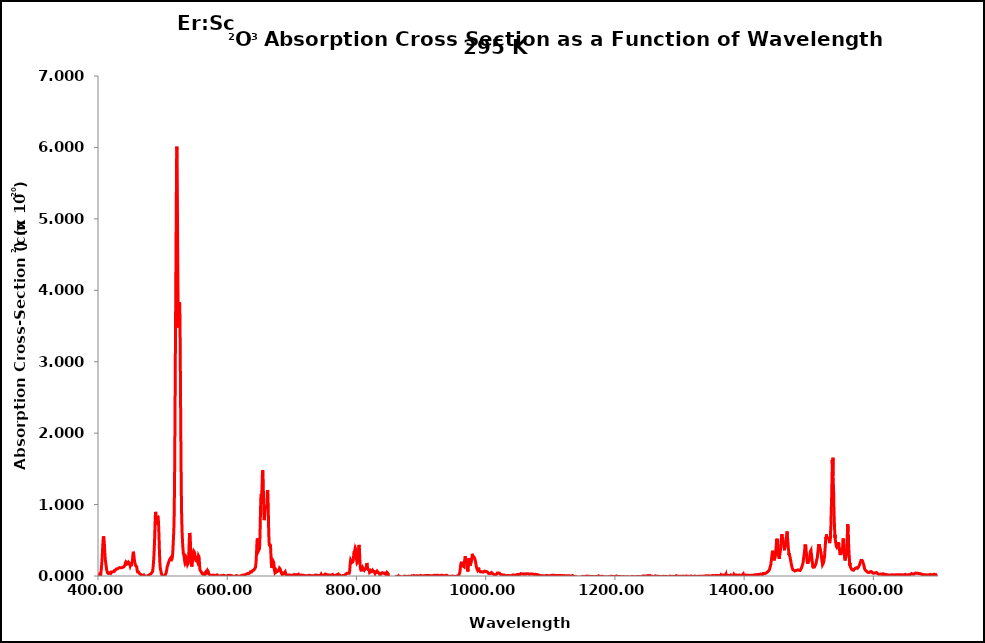
| Category | 295 K |
|---|---|
| 400.0 | -0.005 |
| 400.1 | -0.002 |
| 400.2 | 0.001 |
| 400.3 | 0 |
| 400.4 | 0.004 |
| 400.5 | 0.012 |
| 400.6 | 0.012 |
| 400.7 | 0.013 |
| 400.8 | 0.014 |
| 400.9 | 0.017 |
| 401.0 | 0.018 |
| 401.1 | 0.015 |
| 401.2 | 0.015 |
| 401.3 | 0.017 |
| 401.4 | 0.019 |
| 401.5 | 0.018 |
| 401.6 | 0.014 |
| 401.7 | 0.013 |
| 401.8 | 0.015 |
| 401.9 | 0.014 |
| 402.0 | 0.013 |
| 402.1 | 0.014 |
| 402.2 | 0.017 |
| 402.3 | 0.021 |
| 402.4 | 0.023 |
| 402.5 | 0.026 |
| 402.6 | 0.028 |
| 402.7 | 0.026 |
| 402.8 | 0.03 |
| 402.9 | 0.03 |
| 403.0 | 0.03 |
| 403.1 | 0.033 |
| 403.2 | 0.027 |
| 403.3 | 0.026 |
| 403.4 | 0.019 |
| 403.5 | 0.017 |
| 403.6 | 0.016 |
| 403.7 | 0.016 |
| 403.8 | 0.019 |
| 403.9 | 0.02 |
| 404.0 | 0.019 |
| 404.1 | 0.023 |
| 404.2 | 0.023 |
| 404.3 | 0.031 |
| 404.4 | 0.039 |
| 404.5 | 0.049 |
| 404.6 | 0.055 |
| 404.7 | 0.062 |
| 404.8 | 0.07 |
| 404.9 | 0.077 |
| 405.0 | 0.083 |
| 405.1 | 0.093 |
| 405.2 | 0.105 |
| 405.3 | 0.115 |
| 405.4 | 0.127 |
| 405.5 | 0.14 |
| 405.6 | 0.149 |
| 405.7 | 0.157 |
| 405.8 | 0.169 |
| 405.9 | 0.18 |
| 406.0 | 0.197 |
| 406.1 | 0.212 |
| 406.2 | 0.224 |
| 406.3 | 0.235 |
| 406.4 | 0.251 |
| 406.5 | 0.265 |
| 406.6 | 0.282 |
| 406.7 | 0.299 |
| 406.8 | 0.318 |
| 406.9 | 0.338 |
| 407.0 | 0.353 |
| 407.1 | 0.367 |
| 407.2 | 0.392 |
| 407.3 | 0.407 |
| 407.4 | 0.425 |
| 407.5 | 0.444 |
| 407.6 | 0.46 |
| 407.7 | 0.472 |
| 407.8 | 0.491 |
| 407.9 | 0.507 |
| 408.0 | 0.517 |
| 408.1 | 0.531 |
| 408.2 | 0.542 |
| 408.3 | 0.544 |
| 408.4 | 0.556 |
| 408.5 | 0.557 |
| 408.6 | 0.56 |
| 408.7 | 0.559 |
| 408.8 | 0.559 |
| 408.9 | 0.551 |
| 409.0 | 0.543 |
| 409.1 | 0.535 |
| 409.2 | 0.53 |
| 409.3 | 0.521 |
| 409.4 | 0.511 |
| 409.5 | 0.496 |
| 409.6 | 0.482 |
| 409.7 | 0.469 |
| 409.8 | 0.455 |
| 409.9 | 0.438 |
| 410.0 | 0.42 |
| 410.1 | 0.407 |
| 410.2 | 0.392 |
| 410.3 | 0.375 |
| 410.4 | 0.356 |
| 410.5 | 0.339 |
| 410.6 | 0.324 |
| 410.7 | 0.312 |
| 410.8 | 0.293 |
| 410.9 | 0.276 |
| 411.0 | 0.266 |
| 411.1 | 0.256 |
| 411.2 | 0.247 |
| 411.3 | 0.24 |
| 411.4 | 0.227 |
| 411.5 | 0.218 |
| 411.6 | 0.207 |
| 411.7 | 0.199 |
| 411.8 | 0.194 |
| 411.9 | 0.187 |
| 412.0 | 0.182 |
| 412.1 | 0.175 |
| 412.2 | 0.169 |
| 412.3 | 0.16 |
| 412.4 | 0.152 |
| 412.5 | 0.145 |
| 412.6 | 0.14 |
| 412.7 | 0.133 |
| 412.8 | 0.128 |
| 412.9 | 0.118 |
| 413.0 | 0.114 |
| 413.1 | 0.107 |
| 413.2 | 0.098 |
| 413.3 | 0.093 |
| 413.4 | 0.088 |
| 413.5 | 0.085 |
| 413.6 | 0.082 |
| 413.7 | 0.076 |
| 413.8 | 0.075 |
| 413.9 | 0.07 |
| 414.0 | 0.07 |
| 414.1 | 0.066 |
| 414.2 | 0.064 |
| 414.3 | 0.061 |
| 414.4 | 0.057 |
| 414.5 | 0.053 |
| 414.6 | 0.047 |
| 414.7 | 0.046 |
| 414.8 | 0.041 |
| 414.9 | 0.038 |
| 415.0 | 0.036 |
| 415.1 | 0.034 |
| 415.2 | 0.034 |
| 415.3 | 0.032 |
| 415.4 | 0.038 |
| 415.5 | 0.039 |
| 415.6 | 0.04 |
| 415.7 | 0.041 |
| 415.8 | 0.039 |
| 415.9 | 0.041 |
| 416.0 | 0.039 |
| 416.1 | 0.038 |
| 416.2 | 0.036 |
| 416.3 | 0.035 |
| 416.4 | 0.035 |
| 416.5 | 0.03 |
| 416.6 | 0.027 |
| 416.7 | 0.028 |
| 416.8 | 0.028 |
| 416.9 | 0.027 |
| 417.0 | 0.031 |
| 417.1 | 0.035 |
| 417.2 | 0.036 |
| 417.3 | 0.034 |
| 417.4 | 0.037 |
| 417.5 | 0.039 |
| 417.6 | 0.04 |
| 417.7 | 0.042 |
| 417.8 | 0.043 |
| 417.9 | 0.043 |
| 418.0 | 0.044 |
| 418.1 | 0.044 |
| 418.2 | 0.043 |
| 418.3 | 0.043 |
| 418.4 | 0.045 |
| 418.5 | 0.045 |
| 418.6 | 0.045 |
| 418.7 | 0.047 |
| 418.8 | 0.048 |
| 418.9 | 0.044 |
| 419.0 | 0.042 |
| 419.1 | 0.041 |
| 419.2 | 0.037 |
| 419.3 | 0.033 |
| 419.4 | 0.035 |
| 419.5 | 0.036 |
| 419.6 | 0.036 |
| 419.7 | 0.037 |
| 419.8 | 0.043 |
| 419.9 | 0.04 |
| 420.0 | 0.042 |
| 420.1 | 0.047 |
| 420.2 | 0.05 |
| 420.3 | 0.055 |
| 420.4 | 0.059 |
| 420.5 | 0.059 |
| 420.6 | 0.061 |
| 420.7 | 0.062 |
| 420.8 | 0.063 |
| 420.9 | 0.057 |
| 421.0 | 0.055 |
| 421.1 | 0.055 |
| 421.2 | 0.057 |
| 421.3 | 0.057 |
| 421.4 | 0.058 |
| 421.5 | 0.056 |
| 421.6 | 0.055 |
| 421.7 | 0.057 |
| 421.8 | 0.057 |
| 421.9 | 0.054 |
| 422.0 | 0.053 |
| 422.1 | 0.053 |
| 422.2 | 0.055 |
| 422.3 | 0.053 |
| 422.4 | 0.054 |
| 422.5 | 0.052 |
| 422.6 | 0.055 |
| 422.7 | 0.057 |
| 422.8 | 0.054 |
| 422.9 | 0.054 |
| 423.0 | 0.059 |
| 423.1 | 0.061 |
| 423.2 | 0.066 |
| 423.3 | 0.065 |
| 423.4 | 0.061 |
| 423.5 | 0.061 |
| 423.6 | 0.061 |
| 423.7 | 0.062 |
| 423.8 | 0.061 |
| 423.9 | 0.061 |
| 424.0 | 0.058 |
| 424.1 | 0.054 |
| 424.2 | 0.053 |
| 424.3 | 0.051 |
| 424.4 | 0.05 |
| 424.5 | 0.053 |
| 424.6 | 0.056 |
| 424.7 | 0.056 |
| 424.8 | 0.056 |
| 424.9 | 0.059 |
| 425.0 | 0.058 |
| 425.1 | 0.065 |
| 425.2 | 0.068 |
| 425.3 | 0.072 |
| 425.4 | 0.075 |
| 425.5 | 0.078 |
| 425.6 | 0.079 |
| 425.7 | 0.077 |
| 425.8 | 0.082 |
| 425.9 | 0.082 |
| 426.0 | 0.081 |
| 426.1 | 0.084 |
| 426.2 | 0.082 |
| 426.3 | 0.083 |
| 426.4 | 0.085 |
| 426.5 | 0.084 |
| 426.6 | 0.083 |
| 426.7 | 0.085 |
| 426.8 | 0.088 |
| 426.9 | 0.082 |
| 427.0 | 0.082 |
| 427.1 | 0.084 |
| 427.2 | 0.085 |
| 427.3 | 0.085 |
| 427.4 | 0.085 |
| 427.5 | 0.079 |
| 427.6 | 0.083 |
| 427.7 | 0.085 |
| 427.8 | 0.087 |
| 427.9 | 0.087 |
| 428.0 | 0.088 |
| 428.1 | 0.09 |
| 428.2 | 0.091 |
| 428.3 | 0.087 |
| 428.4 | 0.091 |
| 428.5 | 0.093 |
| 428.6 | 0.094 |
| 428.7 | 0.098 |
| 428.8 | 0.1 |
| 428.9 | 0.096 |
| 429.0 | 0.096 |
| 429.1 | 0.096 |
| 429.2 | 0.093 |
| 429.3 | 0.091 |
| 429.4 | 0.092 |
| 429.5 | 0.09 |
| 429.6 | 0.093 |
| 429.7 | 0.097 |
| 429.8 | 0.092 |
| 429.9 | 0.091 |
| 430.0 | 0.092 |
| 430.1 | 0.094 |
| 430.2 | 0.098 |
| 430.3 | 0.101 |
| 430.4 | 0.102 |
| 430.5 | 0.104 |
| 430.6 | 0.106 |
| 430.7 | 0.102 |
| 430.8 | 0.101 |
| 430.9 | 0.102 |
| 431.0 | 0.105 |
| 431.1 | 0.108 |
| 431.2 | 0.107 |
| 431.3 | 0.106 |
| 431.4 | 0.106 |
| 431.5 | 0.11 |
| 431.6 | 0.112 |
| 431.7 | 0.11 |
| 431.8 | 0.114 |
| 431.9 | 0.112 |
| 432.0 | 0.11 |
| 432.1 | 0.105 |
| 432.2 | 0.104 |
| 432.3 | 0.102 |
| 432.4 | 0.104 |
| 432.5 | 0.102 |
| 432.6 | 0.1 |
| 432.7 | 0.102 |
| 432.8 | 0.102 |
| 432.9 | 0.104 |
| 433.0 | 0.103 |
| 433.1 | 0.105 |
| 433.2 | 0.109 |
| 433.3 | 0.11 |
| 433.4 | 0.112 |
| 433.5 | 0.115 |
| 433.6 | 0.117 |
| 433.7 | 0.118 |
| 433.8 | 0.117 |
| 433.9 | 0.122 |
| 434.0 | 0.119 |
| 434.1 | 0.123 |
| 434.2 | 0.122 |
| 434.3 | 0.122 |
| 434.4 | 0.117 |
| 434.5 | 0.117 |
| 434.6 | 0.115 |
| 434.7 | 0.114 |
| 434.8 | 0.113 |
| 434.9 | 0.113 |
| 435.0 | 0.109 |
| 435.1 | 0.111 |
| 435.2 | 0.114 |
| 435.3 | 0.114 |
| 435.4 | 0.12 |
| 435.5 | 0.121 |
| 435.6 | 0.122 |
| 435.7 | 0.12 |
| 435.8 | 0.119 |
| 435.9 | 0.118 |
| 436.0 | 0.117 |
| 436.1 | 0.12 |
| 436.2 | 0.118 |
| 436.3 | 0.116 |
| 436.4 | 0.119 |
| 436.5 | 0.114 |
| 436.6 | 0.114 |
| 436.7 | 0.115 |
| 436.8 | 0.115 |
| 436.9 | 0.12 |
| 437.0 | 0.123 |
| 437.1 | 0.123 |
| 437.2 | 0.124 |
| 437.3 | 0.12 |
| 437.4 | 0.12 |
| 437.5 | 0.121 |
| 437.6 | 0.122 |
| 437.7 | 0.123 |
| 437.8 | 0.124 |
| 437.9 | 0.127 |
| 438.0 | 0.122 |
| 438.1 | 0.12 |
| 438.2 | 0.121 |
| 438.3 | 0.121 |
| 438.4 | 0.123 |
| 438.5 | 0.127 |
| 438.6 | 0.125 |
| 438.7 | 0.127 |
| 438.8 | 0.129 |
| 438.9 | 0.129 |
| 439.0 | 0.129 |
| 439.1 | 0.129 |
| 439.2 | 0.131 |
| 439.3 | 0.127 |
| 439.4 | 0.126 |
| 439.5 | 0.126 |
| 439.6 | 0.124 |
| 439.7 | 0.123 |
| 439.8 | 0.126 |
| 439.9 | 0.128 |
| 440.0 | 0.127 |
| 440.1 | 0.127 |
| 440.2 | 0.124 |
| 440.3 | 0.123 |
| 440.4 | 0.128 |
| 440.5 | 0.13 |
| 440.6 | 0.132 |
| 440.7 | 0.135 |
| 440.8 | 0.138 |
| 440.9 | 0.134 |
| 441.0 | 0.134 |
| 441.1 | 0.133 |
| 441.2 | 0.138 |
| 441.3 | 0.144 |
| 441.4 | 0.15 |
| 441.5 | 0.151 |
| 441.6 | 0.153 |
| 441.7 | 0.155 |
| 441.8 | 0.157 |
| 441.9 | 0.163 |
| 442.0 | 0.166 |
| 442.1 | 0.169 |
| 442.2 | 0.173 |
| 442.3 | 0.175 |
| 442.4 | 0.183 |
| 442.5 | 0.186 |
| 442.6 | 0.189 |
| 442.7 | 0.193 |
| 442.8 | 0.197 |
| 442.9 | 0.195 |
| 443.0 | 0.194 |
| 443.1 | 0.195 |
| 443.2 | 0.197 |
| 443.3 | 0.2 |
| 443.4 | 0.197 |
| 443.5 | 0.195 |
| 443.6 | 0.193 |
| 443.7 | 0.193 |
| 443.8 | 0.19 |
| 443.9 | 0.19 |
| 444.0 | 0.192 |
| 444.1 | 0.189 |
| 444.2 | 0.191 |
| 444.3 | 0.185 |
| 444.4 | 0.183 |
| 444.5 | 0.183 |
| 444.6 | 0.182 |
| 444.7 | 0.18 |
| 444.8 | 0.177 |
| 444.9 | 0.175 |
| 445.0 | 0.172 |
| 445.1 | 0.169 |
| 445.2 | 0.169 |
| 445.3 | 0.164 |
| 445.4 | 0.17 |
| 445.5 | 0.171 |
| 445.6 | 0.171 |
| 445.7 | 0.169 |
| 445.8 | 0.168 |
| 445.9 | 0.169 |
| 446.0 | 0.171 |
| 446.1 | 0.171 |
| 446.2 | 0.171 |
| 446.3 | 0.171 |
| 446.4 | 0.174 |
| 446.5 | 0.174 |
| 446.6 | 0.174 |
| 446.7 | 0.177 |
| 446.8 | 0.181 |
| 446.9 | 0.184 |
| 447.0 | 0.185 |
| 447.1 | 0.187 |
| 447.2 | 0.191 |
| 447.3 | 0.192 |
| 447.4 | 0.197 |
| 447.5 | 0.195 |
| 447.6 | 0.197 |
| 447.7 | 0.193 |
| 447.8 | 0.191 |
| 447.9 | 0.189 |
| 448.0 | 0.191 |
| 448.1 | 0.19 |
| 448.2 | 0.188 |
| 448.3 | 0.185 |
| 448.4 | 0.184 |
| 448.5 | 0.179 |
| 448.6 | 0.183 |
| 448.7 | 0.177 |
| 448.8 | 0.173 |
| 448.9 | 0.172 |
| 449.0 | 0.169 |
| 449.1 | 0.161 |
| 449.2 | 0.159 |
| 449.3 | 0.156 |
| 449.4 | 0.155 |
| 449.5 | 0.153 |
| 449.6 | 0.151 |
| 449.7 | 0.142 |
| 449.8 | 0.143 |
| 449.9 | 0.149 |
| 450.0 | 0.149 |
| 450.1 | 0.15 |
| 450.2 | 0.154 |
| 450.3 | 0.159 |
| 450.4 | 0.16 |
| 450.5 | 0.16 |
| 450.6 | 0.16 |
| 450.7 | 0.163 |
| 450.8 | 0.169 |
| 450.9 | 0.168 |
| 451.0 | 0.165 |
| 451.1 | 0.166 |
| 451.2 | 0.163 |
| 451.3 | 0.162 |
| 451.4 | 0.157 |
| 451.5 | 0.159 |
| 451.6 | 0.158 |
| 451.7 | 0.157 |
| 451.8 | 0.158 |
| 451.9 | 0.157 |
| 452.0 | 0.16 |
| 452.1 | 0.165 |
| 452.2 | 0.167 |
| 452.3 | 0.169 |
| 452.4 | 0.175 |
| 452.5 | 0.182 |
| 452.6 | 0.181 |
| 452.7 | 0.187 |
| 452.8 | 0.191 |
| 452.9 | 0.196 |
| 453.0 | 0.202 |
| 453.1 | 0.206 |
| 453.2 | 0.21 |
| 453.3 | 0.219 |
| 453.4 | 0.23 |
| 453.5 | 0.237 |
| 453.6 | 0.241 |
| 453.7 | 0.257 |
| 453.8 | 0.266 |
| 453.9 | 0.28 |
| 454.0 | 0.293 |
| 454.1 | 0.302 |
| 454.2 | 0.313 |
| 454.3 | 0.322 |
| 454.4 | 0.327 |
| 454.5 | 0.329 |
| 454.6 | 0.332 |
| 454.7 | 0.339 |
| 454.8 | 0.337 |
| 454.9 | 0.335 |
| 455.0 | 0.331 |
| 455.1 | 0.323 |
| 455.2 | 0.315 |
| 455.3 | 0.31 |
| 455.4 | 0.305 |
| 455.5 | 0.297 |
| 455.6 | 0.288 |
| 455.7 | 0.278 |
| 455.8 | 0.27 |
| 455.9 | 0.261 |
| 456.0 | 0.249 |
| 456.1 | 0.241 |
| 456.2 | 0.234 |
| 456.3 | 0.228 |
| 456.4 | 0.222 |
| 456.5 | 0.213 |
| 456.6 | 0.207 |
| 456.7 | 0.204 |
| 456.8 | 0.201 |
| 456.9 | 0.19 |
| 457.0 | 0.186 |
| 457.1 | 0.187 |
| 457.2 | 0.184 |
| 457.3 | 0.179 |
| 457.4 | 0.178 |
| 457.5 | 0.173 |
| 457.6 | 0.169 |
| 457.7 | 0.165 |
| 457.8 | 0.158 |
| 457.9 | 0.157 |
| 458.0 | 0.16 |
| 458.1 | 0.16 |
| 458.2 | 0.157 |
| 458.3 | 0.152 |
| 458.4 | 0.15 |
| 458.5 | 0.144 |
| 458.6 | 0.144 |
| 458.7 | 0.142 |
| 458.8 | 0.139 |
| 458.9 | 0.142 |
| 459.0 | 0.14 |
| 459.1 | 0.143 |
| 459.2 | 0.141 |
| 459.3 | 0.14 |
| 459.4 | 0.139 |
| 459.5 | 0.138 |
| 459.6 | 0.14 |
| 459.7 | 0.136 |
| 459.8 | 0.134 |
| 459.9 | 0.129 |
| 460.0 | 0.125 |
| 460.1 | 0.119 |
| 460.2 | 0.109 |
| 460.3 | 0.105 |
| 460.4 | 0.093 |
| 460.5 | 0.085 |
| 460.6 | 0.081 |
| 460.7 | 0.076 |
| 460.8 | 0.066 |
| 460.9 | 0.064 |
| 461.0 | 0.062 |
| 461.1 | 0.058 |
| 461.2 | 0.056 |
| 461.3 | 0.052 |
| 461.4 | 0.048 |
| 461.5 | 0.051 |
| 461.6 | 0.052 |
| 461.7 | 0.05 |
| 461.8 | 0.047 |
| 461.9 | 0.047 |
| 462.0 | 0.046 |
| 462.1 | 0.05 |
| 462.2 | 0.056 |
| 462.3 | 0.055 |
| 462.4 | 0.056 |
| 462.5 | 0.058 |
| 462.6 | 0.058 |
| 462.7 | 0.058 |
| 462.8 | 0.058 |
| 462.9 | 0.057 |
| 463.0 | 0.058 |
| 463.1 | 0.057 |
| 463.2 | 0.055 |
| 463.3 | 0.048 |
| 463.4 | 0.049 |
| 463.5 | 0.048 |
| 463.6 | 0.046 |
| 463.7 | 0.039 |
| 463.8 | 0.042 |
| 463.9 | 0.038 |
| 464.0 | 0.038 |
| 464.1 | 0.037 |
| 464.2 | 0.035 |
| 464.3 | 0.033 |
| 464.4 | 0.034 |
| 464.5 | 0.031 |
| 464.6 | 0.031 |
| 464.7 | 0.03 |
| 464.8 | 0.032 |
| 464.9 | 0.027 |
| 465.0 | 0.031 |
| 465.1 | 0.03 |
| 465.2 | 0.027 |
| 465.3 | 0.028 |
| 465.4 | 0.027 |
| 465.5 | 0.021 |
| 465.6 | 0.024 |
| 465.7 | 0.027 |
| 465.8 | 0.027 |
| 465.9 | 0.026 |
| 466.0 | 0.025 |
| 466.1 | 0.025 |
| 466.2 | 0.023 |
| 466.3 | 0.027 |
| 466.4 | 0.027 |
| 466.5 | 0.026 |
| 466.6 | 0.026 |
| 466.7 | 0.022 |
| 466.8 | 0.017 |
| 466.9 | 0.016 |
| 467.0 | 0.017 |
| 467.1 | 0.017 |
| 467.2 | 0.014 |
| 467.3 | 0.018 |
| 467.4 | 0.013 |
| 467.5 | 0.01 |
| 467.6 | 0.007 |
| 467.7 | 0.007 |
| 467.8 | 0.006 |
| 467.9 | 0.006 |
| 468.0 | 0.007 |
| 468.1 | 0.005 |
| 468.2 | 0.012 |
| 468.3 | 0.01 |
| 468.4 | 0.006 |
| 468.5 | 0.01 |
| 468.6 | 0.012 |
| 468.7 | 0.01 |
| 468.8 | 0.01 |
| 468.9 | 0.015 |
| 469.0 | 0.016 |
| 469.1 | 0.015 |
| 469.2 | 0.013 |
| 469.3 | 0.006 |
| 469.4 | 0.006 |
| 469.5 | 0.004 |
| 469.6 | 0 |
| 469.7 | -0.002 |
| 469.8 | 0 |
| 469.9 | -0.001 |
| 470.0 | -0.006 |
| 470.1 | -0.006 |
| 470.2 | -0.008 |
| 470.3 | -0.006 |
| 470.4 | -0.005 |
| 470.5 | -0.005 |
| 470.6 | -0.003 |
| 470.7 | 0 |
| 470.8 | 0.001 |
| 470.9 | 0.002 |
| 471.0 | 0.006 |
| 471.1 | 0.009 |
| 471.2 | 0.006 |
| 471.3 | 0.006 |
| 471.4 | 0.004 |
| 471.5 | 0.003 |
| 471.6 | 0.005 |
| 471.7 | 0.005 |
| 471.8 | 0.002 |
| 471.9 | -0.001 |
| 472.0 | -0.002 |
| 472.1 | -0.004 |
| 472.2 | -0.008 |
| 472.3 | -0.011 |
| 472.4 | -0.012 |
| 472.5 | -0.009 |
| 472.6 | -0.007 |
| 472.7 | -0.008 |
| 472.8 | -0.007 |
| 472.9 | -0.007 |
| 473.0 | -0.002 |
| 473.1 | -0.002 |
| 473.2 | -0.002 |
| 473.3 | -0.004 |
| 473.4 | 0.002 |
| 473.5 | 0.002 |
| 473.6 | -0.002 |
| 473.7 | -0.003 |
| 473.8 | -0.003 |
| 473.9 | -0.003 |
| 474.0 | -0.002 |
| 474.1 | -0.003 |
| 474.2 | -0.005 |
| 474.3 | -0.002 |
| 474.4 | -0.005 |
| 474.5 | -0.008 |
| 474.6 | -0.003 |
| 474.7 | 0 |
| 474.8 | 0.004 |
| 474.9 | 0.001 |
| 475.0 | 0 |
| 475.1 | 0.001 |
| 475.2 | 0 |
| 475.3 | 0.001 |
| 475.4 | -0.005 |
| 475.5 | 0 |
| 475.6 | -0.002 |
| 475.7 | -0.004 |
| 475.8 | -0.009 |
| 475.9 | -0.013 |
| 476.0 | -0.008 |
| 476.1 | -0.006 |
| 476.2 | -0.005 |
| 476.3 | -0.003 |
| 476.4 | 0.003 |
| 476.5 | 0.008 |
| 476.6 | 0.006 |
| 476.7 | 0.008 |
| 476.8 | 0.005 |
| 476.9 | 0.004 |
| 477.0 | 0.004 |
| 477.1 | 0.003 |
| 477.2 | 0.003 |
| 477.3 | 0.003 |
| 477.4 | 0.002 |
| 477.5 | -0.002 |
| 477.6 | -0.006 |
| 477.7 | 0 |
| 477.8 | 0.003 |
| 477.9 | 0.008 |
| 478.0 | 0.014 |
| 478.1 | 0.014 |
| 478.2 | 0.013 |
| 478.3 | 0.012 |
| 478.4 | 0.01 |
| 478.5 | 0.011 |
| 478.6 | 0.011 |
| 478.7 | 0.013 |
| 478.8 | 0.011 |
| 478.9 | 0.011 |
| 479.0 | 0.008 |
| 479.1 | 0.008 |
| 479.2 | 0.013 |
| 479.3 | 0.012 |
| 479.4 | 0.013 |
| 479.5 | 0.013 |
| 479.6 | 0.013 |
| 479.7 | 0.015 |
| 479.8 | 0.014 |
| 479.9 | 0.018 |
| 480.0 | 0.019 |
| 480.1 | 0.022 |
| 480.2 | 0.021 |
| 480.3 | 0.02 |
| 480.4 | 0.019 |
| 480.5 | 0.02 |
| 480.6 | 0.023 |
| 480.7 | 0.023 |
| 480.8 | 0.021 |
| 480.9 | 0.022 |
| 481.0 | 0.021 |
| 481.1 | 0.025 |
| 481.2 | 0.023 |
| 481.3 | 0.025 |
| 481.4 | 0.025 |
| 481.5 | 0.028 |
| 481.6 | 0.027 |
| 481.7 | 0.028 |
| 481.8 | 0.03 |
| 481.9 | 0.032 |
| 482.0 | 0.031 |
| 482.1 | 0.028 |
| 482.2 | 0.026 |
| 482.3 | 0.027 |
| 482.4 | 0.028 |
| 482.5 | 0.027 |
| 482.6 | 0.029 |
| 482.7 | 0.034 |
| 482.8 | 0.035 |
| 482.9 | 0.036 |
| 483.0 | 0.035 |
| 483.1 | 0.043 |
| 483.2 | 0.047 |
| 483.3 | 0.051 |
| 483.4 | 0.053 |
| 483.5 | 0.054 |
| 483.6 | 0.058 |
| 483.7 | 0.059 |
| 483.8 | 0.058 |
| 483.9 | 0.056 |
| 484.0 | 0.056 |
| 484.1 | 0.061 |
| 484.2 | 0.058 |
| 484.3 | 0.061 |
| 484.4 | 0.063 |
| 484.5 | 0.065 |
| 484.6 | 0.073 |
| 484.7 | 0.077 |
| 484.8 | 0.079 |
| 484.9 | 0.085 |
| 485.0 | 0.096 |
| 485.1 | 0.105 |
| 485.2 | 0.114 |
| 485.3 | 0.124 |
| 485.4 | 0.134 |
| 485.5 | 0.144 |
| 485.6 | 0.156 |
| 485.7 | 0.164 |
| 485.8 | 0.178 |
| 485.9 | 0.192 |
| 486.0 | 0.206 |
| 486.1 | 0.22 |
| 486.2 | 0.231 |
| 486.3 | 0.249 |
| 486.4 | 0.265 |
| 486.5 | 0.281 |
| 486.6 | 0.298 |
| 486.7 | 0.318 |
| 486.8 | 0.336 |
| 486.9 | 0.355 |
| 487.0 | 0.375 |
| 487.1 | 0.396 |
| 487.2 | 0.417 |
| 487.3 | 0.439 |
| 487.4 | 0.462 |
| 487.5 | 0.487 |
| 487.6 | 0.512 |
| 487.7 | 0.539 |
| 487.8 | 0.567 |
| 487.9 | 0.598 |
| 488.0 | 0.629 |
| 488.1 | 0.663 |
| 488.2 | 0.693 |
| 488.3 | 0.727 |
| 488.4 | 0.759 |
| 488.5 | 0.782 |
| 488.6 | 0.808 |
| 488.7 | 0.833 |
| 488.8 | 0.853 |
| 488.9 | 0.869 |
| 489.0 | 0.883 |
| 489.1 | 0.893 |
| 489.2 | 0.896 |
| 489.3 | 0.898 |
| 489.4 | 0.89 |
| 489.5 | 0.883 |
| 489.6 | 0.877 |
| 489.7 | 0.861 |
| 489.8 | 0.847 |
| 489.9 | 0.83 |
| 490.0 | 0.813 |
| 490.1 | 0.796 |
| 490.2 | 0.777 |
| 490.3 | 0.763 |
| 490.4 | 0.755 |
| 490.5 | 0.738 |
| 490.6 | 0.731 |
| 490.7 | 0.722 |
| 490.8 | 0.717 |
| 490.9 | 0.714 |
| 491.0 | 0.721 |
| 491.1 | 0.725 |
| 491.2 | 0.73 |
| 491.3 | 0.738 |
| 491.4 | 0.747 |
| 491.5 | 0.758 |
| 491.6 | 0.774 |
| 491.7 | 0.783 |
| 491.8 | 0.799 |
| 491.9 | 0.813 |
| 492.0 | 0.821 |
| 492.1 | 0.828 |
| 492.2 | 0.838 |
| 492.3 | 0.842 |
| 492.4 | 0.853 |
| 492.5 | 0.856 |
| 492.6 | 0.85 |
| 492.7 | 0.851 |
| 492.8 | 0.847 |
| 492.9 | 0.841 |
| 493.0 | 0.832 |
| 493.1 | 0.825 |
| 493.2 | 0.814 |
| 493.3 | 0.8 |
| 493.4 | 0.79 |
| 493.5 | 0.766 |
| 493.6 | 0.748 |
| 493.7 | 0.731 |
| 493.8 | 0.709 |
| 493.9 | 0.691 |
| 494.0 | 0.668 |
| 494.1 | 0.643 |
| 494.2 | 0.615 |
| 494.3 | 0.587 |
| 494.4 | 0.558 |
| 494.5 | 0.526 |
| 494.6 | 0.497 |
| 494.7 | 0.467 |
| 494.8 | 0.436 |
| 494.9 | 0.405 |
| 495.0 | 0.371 |
| 495.1 | 0.342 |
| 495.2 | 0.315 |
| 495.3 | 0.291 |
| 495.4 | 0.266 |
| 495.5 | 0.241 |
| 495.6 | 0.22 |
| 495.7 | 0.199 |
| 495.8 | 0.177 |
| 495.9 | 0.164 |
| 496.0 | 0.152 |
| 496.1 | 0.138 |
| 496.2 | 0.128 |
| 496.3 | 0.12 |
| 496.4 | 0.113 |
| 496.5 | 0.11 |
| 496.6 | 0.105 |
| 496.7 | 0.096 |
| 496.8 | 0.095 |
| 496.9 | 0.097 |
| 497.0 | 0.087 |
| 497.1 | 0.082 |
| 497.2 | 0.08 |
| 497.3 | 0.074 |
| 497.4 | 0.068 |
| 497.5 | 0.065 |
| 497.6 | 0.055 |
| 497.7 | 0.052 |
| 497.8 | 0.05 |
| 497.9 | 0.047 |
| 498.0 | 0.038 |
| 498.1 | 0.037 |
| 498.2 | 0.036 |
| 498.3 | 0.032 |
| 498.4 | 0.032 |
| 498.5 | 0.029 |
| 498.6 | 0.026 |
| 498.7 | 0.026 |
| 498.8 | 0.018 |
| 498.9 | 0.018 |
| 499.0 | 0.014 |
| 499.1 | 0.011 |
| 499.2 | 0.009 |
| 499.3 | 0.003 |
| 499.4 | 0.003 |
| 499.5 | -0.001 |
| 499.6 | -0.002 |
| 499.7 | -0.007 |
| 499.8 | -0.008 |
| 499.9 | -0.006 |
| 500.0 | -0.011 |
| 500.1 | -0.013 |
| 500.2 | -0.012 |
| 500.3 | -0.015 |
| 500.4 | -0.013 |
| 500.5 | -0.014 |
| 500.6 | -0.013 |
| 500.7 | -0.014 |
| 500.8 | -0.011 |
| 500.9 | -0.013 |
| 501.0 | -0.01 |
| 501.1 | -0.01 |
| 501.2 | -0.007 |
| 501.3 | -0.011 |
| 501.4 | -0.007 |
| 501.5 | -0.009 |
| 501.6 | -0.007 |
| 501.7 | -0.007 |
| 501.8 | -0.006 |
| 501.9 | -0.012 |
| 502.0 | -0.011 |
| 502.1 | -0.008 |
| 502.2 | -0.011 |
| 502.3 | -0.012 |
| 502.4 | -0.011 |
| 502.5 | -0.013 |
| 502.6 | -0.013 |
| 502.7 | -0.018 |
| 502.8 | -0.018 |
| 502.9 | -0.018 |
| 503.0 | -0.013 |
| 503.1 | -0.012 |
| 503.2 | -0.012 |
| 503.3 | -0.008 |
| 503.4 | -0.005 |
| 503.5 | -0.002 |
| 503.6 | 0.003 |
| 503.7 | 0.006 |
| 503.8 | 0.012 |
| 503.9 | 0.014 |
| 504.0 | 0.019 |
| 504.1 | 0.021 |
| 504.2 | 0.018 |
| 504.3 | 0.021 |
| 504.4 | 0.024 |
| 504.5 | 0.024 |
| 504.6 | 0.027 |
| 504.7 | 0.029 |
| 504.8 | 0.026 |
| 504.9 | 0.027 |
| 505.0 | 0.031 |
| 505.1 | 0.029 |
| 505.2 | 0.032 |
| 505.3 | 0.042 |
| 505.4 | 0.046 |
| 505.5 | 0.048 |
| 505.6 | 0.052 |
| 505.7 | 0.056 |
| 505.8 | 0.056 |
| 505.9 | 0.063 |
| 506.0 | 0.067 |
| 506.1 | 0.072 |
| 506.2 | 0.076 |
| 506.3 | 0.084 |
| 506.4 | 0.09 |
| 506.5 | 0.092 |
| 506.6 | 0.099 |
| 506.7 | 0.106 |
| 506.8 | 0.111 |
| 506.9 | 0.116 |
| 507.0 | 0.124 |
| 507.1 | 0.127 |
| 507.2 | 0.13 |
| 507.3 | 0.137 |
| 507.4 | 0.14 |
| 507.5 | 0.142 |
| 507.6 | 0.146 |
| 507.7 | 0.148 |
| 507.8 | 0.15 |
| 507.9 | 0.15 |
| 508.0 | 0.151 |
| 508.1 | 0.156 |
| 508.2 | 0.164 |
| 508.3 | 0.162 |
| 508.4 | 0.166 |
| 508.5 | 0.167 |
| 508.6 | 0.168 |
| 508.7 | 0.171 |
| 508.8 | 0.172 |
| 508.9 | 0.178 |
| 509.0 | 0.18 |
| 509.1 | 0.189 |
| 509.2 | 0.189 |
| 509.3 | 0.189 |
| 509.4 | 0.195 |
| 509.5 | 0.193 |
| 509.6 | 0.196 |
| 509.7 | 0.201 |
| 509.8 | 0.205 |
| 509.9 | 0.21 |
| 510.0 | 0.212 |
| 510.1 | 0.213 |
| 510.2 | 0.215 |
| 510.3 | 0.216 |
| 510.4 | 0.221 |
| 510.5 | 0.219 |
| 510.6 | 0.223 |
| 510.7 | 0.226 |
| 510.8 | 0.224 |
| 510.9 | 0.225 |
| 511.0 | 0.228 |
| 511.1 | 0.233 |
| 511.2 | 0.236 |
| 511.3 | 0.233 |
| 511.4 | 0.236 |
| 511.5 | 0.234 |
| 511.6 | 0.239 |
| 511.7 | 0.241 |
| 511.8 | 0.239 |
| 511.9 | 0.235 |
| 512.0 | 0.235 |
| 512.1 | 0.231 |
| 512.2 | 0.226 |
| 512.3 | 0.222 |
| 512.4 | 0.222 |
| 512.5 | 0.217 |
| 512.6 | 0.215 |
| 512.7 | 0.217 |
| 512.8 | 0.213 |
| 512.9 | 0.216 |
| 513.0 | 0.217 |
| 513.1 | 0.214 |
| 513.2 | 0.217 |
| 513.3 | 0.219 |
| 513.4 | 0.223 |
| 513.5 | 0.222 |
| 513.6 | 0.228 |
| 513.7 | 0.227 |
| 513.8 | 0.225 |
| 513.9 | 0.232 |
| 514.0 | 0.229 |
| 514.1 | 0.233 |
| 514.2 | 0.237 |
| 514.3 | 0.238 |
| 514.4 | 0.236 |
| 514.5 | 0.239 |
| 514.6 | 0.243 |
| 514.7 | 0.244 |
| 514.8 | 0.25 |
| 514.9 | 0.254 |
| 515.0 | 0.256 |
| 515.1 | 0.264 |
| 515.2 | 0.274 |
| 515.3 | 0.283 |
| 515.4 | 0.291 |
| 515.5 | 0.304 |
| 515.6 | 0.319 |
| 515.7 | 0.332 |
| 515.8 | 0.346 |
| 515.9 | 0.362 |
| 516.0 | 0.38 |
| 516.1 | 0.397 |
| 516.2 | 0.418 |
| 516.3 | 0.434 |
| 516.4 | 0.448 |
| 516.5 | 0.469 |
| 516.6 | 0.491 |
| 516.7 | 0.508 |
| 516.8 | 0.529 |
| 516.9 | 0.546 |
| 517.0 | 0.567 |
| 517.1 | 0.588 |
| 517.2 | 0.613 |
| 517.3 | 0.635 |
| 517.4 | 0.664 |
| 517.5 | 0.699 |
| 517.6 | 0.735 |
| 517.7 | 0.777 |
| 517.8 | 0.822 |
| 517.9 | 0.873 |
| 518.0 | 0.936 |
| 518.1 | 1.007 |
| 518.2 | 1.083 |
| 518.3 | 1.164 |
| 518.4 | 1.261 |
| 518.5 | 1.359 |
| 518.6 | 1.467 |
| 518.7 | 1.584 |
| 518.8 | 1.702 |
| 518.9 | 1.836 |
| 519.0 | 1.979 |
| 519.1 | 2.125 |
| 519.2 | 2.27 |
| 519.3 | 2.42 |
| 519.4 | 2.571 |
| 519.5 | 2.722 |
| 519.6 | 2.876 |
| 519.7 | 3.032 |
| 519.8 | 3.186 |
| 519.9 | 3.342 |
| 520.0 | 3.493 |
| 520.1 | 3.643 |
| 520.2 | 3.786 |
| 520.3 | 3.927 |
| 520.4 | 4.072 |
| 520.5 | 4.219 |
| 520.6 | 4.365 |
| 520.7 | 4.509 |
| 520.8 | 4.65 |
| 520.9 | 4.797 |
| 521.0 | 4.942 |
| 521.1 | 5.088 |
| 521.2 | 5.225 |
| 521.3 | 5.368 |
| 521.4 | 5.509 |
| 521.5 | 5.638 |
| 521.6 | 5.753 |
| 521.7 | 5.851 |
| 521.8 | 5.939 |
| 521.9 | 5.986 |
| 522.0 | 6.011 |
| 522.1 | 6.006 |
| 522.2 | 5.972 |
| 522.3 | 5.913 |
| 522.4 | 5.828 |
| 522.5 | 5.728 |
| 522.6 | 5.618 |
| 522.7 | 5.489 |
| 522.8 | 5.342 |
| 522.9 | 5.193 |
| 523.0 | 5.05 |
| 523.1 | 4.901 |
| 523.2 | 4.755 |
| 523.3 | 4.606 |
| 523.4 | 4.462 |
| 523.5 | 4.33 |
| 523.6 | 4.208 |
| 523.7 | 4.085 |
| 523.8 | 3.981 |
| 523.9 | 3.886 |
| 524.0 | 3.799 |
| 524.1 | 3.724 |
| 524.2 | 3.655 |
| 524.3 | 3.599 |
| 524.4 | 3.554 |
| 524.5 | 3.521 |
| 524.6 | 3.494 |
| 524.7 | 3.476 |
| 524.8 | 3.474 |
| 524.9 | 3.477 |
| 525.0 | 3.493 |
| 525.1 | 3.516 |
| 525.2 | 3.539 |
| 525.3 | 3.577 |
| 525.4 | 3.611 |
| 525.5 | 3.649 |
| 525.6 | 3.694 |
| 525.7 | 3.733 |
| 525.8 | 3.765 |
| 525.9 | 3.792 |
| 526.0 | 3.815 |
| 526.1 | 3.831 |
| 526.2 | 3.834 |
| 526.3 | 3.832 |
| 526.4 | 3.812 |
| 526.5 | 3.781 |
| 526.6 | 3.74 |
| 526.7 | 3.682 |
| 526.8 | 3.612 |
| 526.9 | 3.533 |
| 527.0 | 3.443 |
| 527.1 | 3.338 |
| 527.2 | 3.225 |
| 527.3 | 3.11 |
| 527.4 | 2.988 |
| 527.5 | 2.853 |
| 527.6 | 2.726 |
| 527.7 | 2.595 |
| 527.8 | 2.461 |
| 527.9 | 2.33 |
| 528.0 | 2.205 |
| 528.1 | 2.083 |
| 528.2 | 1.96 |
| 528.3 | 1.842 |
| 528.4 | 1.724 |
| 528.5 | 1.611 |
| 528.6 | 1.509 |
| 528.7 | 1.406 |
| 528.8 | 1.313 |
| 528.9 | 1.229 |
| 529.0 | 1.152 |
| 529.1 | 1.077 |
| 529.2 | 1.004 |
| 529.3 | 0.944 |
| 529.4 | 0.887 |
| 529.5 | 0.836 |
| 529.6 | 0.792 |
| 529.7 | 0.755 |
| 529.8 | 0.725 |
| 529.9 | 0.689 |
| 530.0 | 0.658 |
| 530.1 | 0.633 |
| 530.2 | 0.606 |
| 530.3 | 0.584 |
| 530.4 | 0.563 |
| 530.5 | 0.543 |
| 530.6 | 0.521 |
| 530.7 | 0.506 |
| 530.8 | 0.489 |
| 530.9 | 0.47 |
| 531.0 | 0.454 |
| 531.1 | 0.438 |
| 531.2 | 0.422 |
| 531.3 | 0.408 |
| 531.4 | 0.397 |
| 531.5 | 0.383 |
| 531.6 | 0.372 |
| 531.7 | 0.363 |
| 531.8 | 0.348 |
| 531.9 | 0.336 |
| 532.0 | 0.323 |
| 532.1 | 0.32 |
| 532.2 | 0.317 |
| 532.3 | 0.313 |
| 532.4 | 0.307 |
| 532.5 | 0.304 |
| 532.6 | 0.303 |
| 532.7 | 0.3 |
| 532.8 | 0.298 |
| 532.9 | 0.294 |
| 533.0 | 0.289 |
| 533.1 | 0.286 |
| 533.2 | 0.281 |
| 533.3 | 0.276 |
| 533.4 | 0.262 |
| 533.5 | 0.257 |
| 533.6 | 0.251 |
| 533.7 | 0.242 |
| 533.8 | 0.232 |
| 533.9 | 0.221 |
| 534.0 | 0.217 |
| 534.1 | 0.211 |
| 534.2 | 0.206 |
| 534.3 | 0.2 |
| 534.4 | 0.192 |
| 534.5 | 0.19 |
| 534.6 | 0.189 |
| 534.7 | 0.181 |
| 534.8 | 0.177 |
| 534.9 | 0.174 |
| 535.0 | 0.179 |
| 535.1 | 0.177 |
| 535.2 | 0.177 |
| 535.3 | 0.181 |
| 535.4 | 0.181 |
| 535.5 | 0.187 |
| 535.6 | 0.192 |
| 535.7 | 0.19 |
| 535.8 | 0.199 |
| 535.9 | 0.207 |
| 536.0 | 0.217 |
| 536.1 | 0.224 |
| 536.2 | 0.233 |
| 536.3 | 0.24 |
| 536.4 | 0.245 |
| 536.5 | 0.252 |
| 536.6 | 0.255 |
| 536.7 | 0.256 |
| 536.8 | 0.261 |
| 536.9 | 0.262 |
| 537.0 | 0.261 |
| 537.1 | 0.258 |
| 537.2 | 0.252 |
| 537.3 | 0.246 |
| 537.4 | 0.243 |
| 537.5 | 0.237 |
| 537.6 | 0.229 |
| 537.7 | 0.218 |
| 537.8 | 0.212 |
| 537.9 | 0.206 |
| 538.0 | 0.196 |
| 538.1 | 0.188 |
| 538.2 | 0.182 |
| 538.3 | 0.175 |
| 538.4 | 0.168 |
| 538.5 | 0.166 |
| 538.6 | 0.16 |
| 538.7 | 0.155 |
| 538.8 | 0.154 |
| 538.9 | 0.154 |
| 539.0 | 0.149 |
| 539.1 | 0.149 |
| 539.2 | 0.153 |
| 539.3 | 0.153 |
| 539.4 | 0.16 |
| 539.5 | 0.163 |
| 539.6 | 0.164 |
| 539.7 | 0.172 |
| 539.8 | 0.183 |
| 539.9 | 0.195 |
| 540.0 | 0.209 |
| 540.1 | 0.226 |
| 540.2 | 0.244 |
| 540.3 | 0.26 |
| 540.4 | 0.279 |
| 540.5 | 0.297 |
| 540.6 | 0.324 |
| 540.7 | 0.353 |
| 540.8 | 0.375 |
| 540.9 | 0.402 |
| 541.0 | 0.431 |
| 541.1 | 0.456 |
| 541.2 | 0.481 |
| 541.3 | 0.507 |
| 541.4 | 0.528 |
| 541.5 | 0.549 |
| 541.6 | 0.568 |
| 541.7 | 0.583 |
| 541.8 | 0.591 |
| 541.9 | 0.602 |
| 542.0 | 0.609 |
| 542.1 | 0.607 |
| 542.2 | 0.604 |
| 542.3 | 0.603 |
| 542.4 | 0.594 |
| 542.5 | 0.583 |
| 542.6 | 0.567 |
| 542.7 | 0.547 |
| 542.8 | 0.526 |
| 542.9 | 0.502 |
| 543.0 | 0.475 |
| 543.1 | 0.448 |
| 543.2 | 0.422 |
| 543.3 | 0.394 |
| 543.4 | 0.364 |
| 543.5 | 0.34 |
| 543.6 | 0.313 |
| 543.7 | 0.29 |
| 543.8 | 0.267 |
| 543.9 | 0.246 |
| 544.0 | 0.228 |
| 544.1 | 0.213 |
| 544.2 | 0.198 |
| 544.3 | 0.184 |
| 544.4 | 0.174 |
| 544.5 | 0.165 |
| 544.6 | 0.153 |
| 544.7 | 0.148 |
| 544.8 | 0.14 |
| 544.9 | 0.139 |
| 545.0 | 0.135 |
| 545.1 | 0.133 |
| 545.2 | 0.134 |
| 545.3 | 0.138 |
| 545.4 | 0.139 |
| 545.5 | 0.142 |
| 545.6 | 0.146 |
| 545.7 | 0.153 |
| 545.8 | 0.161 |
| 545.9 | 0.17 |
| 546.0 | 0.177 |
| 546.1 | 0.189 |
| 546.2 | 0.202 |
| 546.3 | 0.211 |
| 546.4 | 0.218 |
| 546.5 | 0.231 |
| 546.6 | 0.243 |
| 546.7 | 0.253 |
| 546.8 | 0.266 |
| 546.9 | 0.276 |
| 547.0 | 0.287 |
| 547.1 | 0.299 |
| 547.2 | 0.308 |
| 547.3 | 0.314 |
| 547.4 | 0.325 |
| 547.5 | 0.334 |
| 547.6 | 0.341 |
| 547.7 | 0.343 |
| 547.8 | 0.348 |
| 547.9 | 0.347 |
| 548.0 | 0.35 |
| 548.1 | 0.353 |
| 548.2 | 0.351 |
| 548.3 | 0.353 |
| 548.4 | 0.353 |
| 548.5 | 0.349 |
| 548.6 | 0.343 |
| 548.7 | 0.343 |
| 548.8 | 0.345 |
| 548.9 | 0.348 |
| 549.0 | 0.348 |
| 549.1 | 0.344 |
| 549.2 | 0.345 |
| 549.3 | 0.342 |
| 549.4 | 0.336 |
| 549.5 | 0.328 |
| 549.6 | 0.323 |
| 549.7 | 0.311 |
| 549.8 | 0.304 |
| 549.9 | 0.298 |
| 550.0 | 0.285 |
| 550.1 | 0.278 |
| 550.2 | 0.268 |
| 550.3 | 0.256 |
| 550.4 | 0.246 |
| 550.5 | 0.242 |
| 550.6 | 0.241 |
| 550.7 | 0.237 |
| 550.8 | 0.24 |
| 550.9 | 0.234 |
| 551.0 | 0.231 |
| 551.1 | 0.229 |
| 551.2 | 0.229 |
| 551.3 | 0.23 |
| 551.4 | 0.226 |
| 551.5 | 0.23 |
| 551.6 | 0.229 |
| 551.7 | 0.232 |
| 551.8 | 0.235 |
| 551.9 | 0.239 |
| 552.0 | 0.242 |
| 552.1 | 0.244 |
| 552.2 | 0.242 |
| 552.3 | 0.24 |
| 552.4 | 0.241 |
| 552.5 | 0.247 |
| 552.6 | 0.243 |
| 552.7 | 0.243 |
| 552.8 | 0.236 |
| 552.9 | 0.234 |
| 553.0 | 0.228 |
| 553.1 | 0.223 |
| 553.2 | 0.219 |
| 553.3 | 0.217 |
| 553.4 | 0.214 |
| 553.5 | 0.21 |
| 553.6 | 0.207 |
| 553.7 | 0.204 |
| 553.8 | 0.201 |
| 553.9 | 0.201 |
| 554.0 | 0.199 |
| 554.1 | 0.201 |
| 554.2 | 0.203 |
| 554.3 | 0.209 |
| 554.4 | 0.213 |
| 554.5 | 0.223 |
| 554.6 | 0.225 |
| 554.7 | 0.231 |
| 554.8 | 0.237 |
| 554.9 | 0.24 |
| 555.0 | 0.246 |
| 555.1 | 0.257 |
| 555.2 | 0.263 |
| 555.3 | 0.271 |
| 555.4 | 0.276 |
| 555.5 | 0.283 |
| 555.6 | 0.283 |
| 555.7 | 0.291 |
| 555.8 | 0.291 |
| 555.9 | 0.295 |
| 556.0 | 0.296 |
| 556.1 | 0.292 |
| 556.2 | 0.285 |
| 556.3 | 0.276 |
| 556.4 | 0.265 |
| 556.5 | 0.256 |
| 556.6 | 0.244 |
| 556.7 | 0.23 |
| 556.8 | 0.214 |
| 556.9 | 0.2 |
| 557.0 | 0.183 |
| 557.1 | 0.17 |
| 557.2 | 0.159 |
| 557.3 | 0.142 |
| 557.4 | 0.132 |
| 557.5 | 0.123 |
| 557.6 | 0.11 |
| 557.7 | 0.099 |
| 557.8 | 0.092 |
| 557.9 | 0.085 |
| 558.0 | 0.084 |
| 558.1 | 0.082 |
| 558.2 | 0.076 |
| 558.3 | 0.074 |
| 558.4 | 0.076 |
| 558.5 | 0.075 |
| 558.6 | 0.075 |
| 558.7 | 0.076 |
| 558.8 | 0.075 |
| 558.9 | 0.072 |
| 559.0 | 0.071 |
| 559.1 | 0.066 |
| 559.2 | 0.064 |
| 559.3 | 0.064 |
| 559.4 | 0.062 |
| 559.5 | 0.06 |
| 559.6 | 0.06 |
| 559.7 | 0.057 |
| 559.8 | 0.056 |
| 559.9 | 0.055 |
| 560.0 | 0.059 |
| 560.1 | 0.056 |
| 560.2 | 0.056 |
| 560.3 | 0.053 |
| 560.4 | 0.051 |
| 560.5 | 0.048 |
| 560.6 | 0.048 |
| 560.7 | 0.043 |
| 560.8 | 0.042 |
| 560.9 | 0.04 |
| 561.0 | 0.038 |
| 561.1 | 0.033 |
| 561.2 | 0.035 |
| 561.3 | 0.032 |
| 561.4 | 0.031 |
| 561.5 | 0.028 |
| 561.6 | 0.028 |
| 561.7 | 0.027 |
| 561.8 | 0.028 |
| 561.9 | 0.026 |
| 562.0 | 0.024 |
| 562.1 | 0.023 |
| 562.2 | 0.021 |
| 562.3 | 0.02 |
| 562.4 | 0.026 |
| 562.5 | 0.026 |
| 562.6 | 0.027 |
| 562.7 | 0.024 |
| 562.8 | 0.023 |
| 562.9 | 0.023 |
| 563.0 | 0.02 |
| 563.1 | 0.021 |
| 563.2 | 0.023 |
| 563.3 | 0.025 |
| 563.4 | 0.023 |
| 563.5 | 0.022 |
| 563.6 | 0.018 |
| 563.7 | 0.02 |
| 563.8 | 0.023 |
| 563.9 | 0.021 |
| 564.0 | 0.016 |
| 564.1 | 0.014 |
| 564.2 | 0.02 |
| 564.3 | 0.022 |
| 564.4 | 0.022 |
| 564.5 | 0.022 |
| 564.6 | 0.024 |
| 564.7 | 0.027 |
| 564.8 | 0.028 |
| 564.9 | 0.028 |
| 565.0 | 0.031 |
| 565.1 | 0.038 |
| 565.2 | 0.042 |
| 565.3 | 0.038 |
| 565.4 | 0.042 |
| 565.5 | 0.044 |
| 565.6 | 0.047 |
| 565.7 | 0.046 |
| 565.8 | 0.047 |
| 565.9 | 0.049 |
| 566.0 | 0.049 |
| 566.1 | 0.05 |
| 566.2 | 0.051 |
| 566.3 | 0.051 |
| 566.4 | 0.053 |
| 566.5 | 0.045 |
| 566.6 | 0.042 |
| 566.7 | 0.044 |
| 566.8 | 0.043 |
| 566.9 | 0.04 |
| 567.0 | 0.034 |
| 567.1 | 0.036 |
| 567.2 | 0.031 |
| 567.3 | 0.029 |
| 567.4 | 0.03 |
| 567.5 | 0.028 |
| 567.6 | 0.032 |
| 567.7 | 0.032 |
| 567.8 | 0.028 |
| 567.9 | 0.029 |
| 568.0 | 0.03 |
| 568.1 | 0.035 |
| 568.2 | 0.037 |
| 568.3 | 0.041 |
| 568.4 | 0.043 |
| 568.5 | 0.045 |
| 568.6 | 0.046 |
| 568.7 | 0.05 |
| 568.8 | 0.052 |
| 568.9 | 0.057 |
| 569.0 | 0.059 |
| 569.1 | 0.059 |
| 569.2 | 0.062 |
| 569.3 | 0.062 |
| 569.4 | 0.068 |
| 569.5 | 0.069 |
| 569.6 | 0.071 |
| 569.7 | 0.076 |
| 569.8 | 0.072 |
| 569.9 | 0.076 |
| 570.0 | 0.073 |
| 570.1 | 0.075 |
| 570.2 | 0.076 |
| 570.3 | 0.075 |
| 570.4 | 0.076 |
| 570.5 | 0.072 |
| 570.6 | 0.069 |
| 570.7 | 0.066 |
| 570.8 | 0.06 |
| 570.9 | 0.06 |
| 571.0 | 0.056 |
| 571.1 | 0.051 |
| 571.2 | 0.041 |
| 571.3 | 0.039 |
| 571.4 | 0.036 |
| 571.5 | 0.031 |
| 571.6 | 0.025 |
| 571.7 | 0.022 |
| 571.8 | 0.022 |
| 571.9 | 0.017 |
| 572.0 | 0.015 |
| 572.1 | 0.015 |
| 572.2 | 0.019 |
| 572.3 | 0.021 |
| 572.4 | 0.022 |
| 572.5 | 0.022 |
| 572.6 | 0.02 |
| 572.7 | 0.02 |
| 572.8 | 0.021 |
| 572.9 | 0.018 |
| 573.0 | 0.021 |
| 573.1 | 0.018 |
| 573.2 | 0.015 |
| 573.3 | 0.01 |
| 573.4 | 0.011 |
| 573.5 | 0.009 |
| 573.6 | 0.009 |
| 573.7 | 0.01 |
| 573.8 | 0.011 |
| 573.9 | 0.01 |
| 574.0 | 0.01 |
| 574.1 | 0.011 |
| 574.2 | 0.012 |
| 574.3 | 0.015 |
| 574.4 | 0.013 |
| 574.5 | 0.01 |
| 574.6 | 0.011 |
| 574.7 | 0.008 |
| 574.8 | 0.004 |
| 574.9 | 0.01 |
| 575.0 | 0.011 |
| 575.1 | 0.011 |
| 575.2 | 0.01 |
| 575.3 | 0.009 |
| 575.4 | 0.006 |
| 575.5 | 0.009 |
| 575.6 | 0.01 |
| 575.7 | 0.012 |
| 575.8 | 0.01 |
| 575.9 | 0.01 |
| 576.0 | 0.007 |
| 576.1 | 0.007 |
| 576.2 | 0.007 |
| 576.3 | 0.006 |
| 576.4 | 0.009 |
| 576.5 | 0.006 |
| 576.6 | 0.008 |
| 576.7 | 0.006 |
| 576.8 | 0.001 |
| 576.9 | 0.004 |
| 577.0 | 0.005 |
| 577.1 | 0.008 |
| 577.2 | 0.007 |
| 577.3 | 0.007 |
| 577.4 | 0.009 |
| 577.5 | 0.007 |
| 577.6 | 0.012 |
| 577.7 | 0.012 |
| 577.8 | 0.014 |
| 577.9 | 0.013 |
| 578.0 | 0.014 |
| 578.1 | 0.012 |
| 578.2 | 0.009 |
| 578.3 | 0.008 |
| 578.4 | 0.004 |
| 578.5 | 0.005 |
| 578.6 | 0.005 |
| 578.7 | 0.003 |
| 578.8 | 0.002 |
| 578.9 | 0.003 |
| 579.0 | 0.008 |
| 579.1 | 0.005 |
| 579.2 | 0.01 |
| 579.3 | 0.009 |
| 579.4 | 0.008 |
| 579.5 | 0.01 |
| 579.6 | 0.01 |
| 579.7 | 0.009 |
| 579.8 | 0.009 |
| 579.9 | 0.009 |
| 580.0 | 0.007 |
| 580.1 | 0.005 |
| 580.2 | 0.01 |
| 580.3 | 0.009 |
| 580.4 | 0.007 |
| 580.5 | 0.01 |
| 580.6 | 0.011 |
| 580.7 | 0.008 |
| 580.8 | 0.008 |
| 580.9 | 0.007 |
| 581.0 | 0.009 |
| 581.1 | 0.007 |
| 581.2 | 0.007 |
| 581.3 | 0.001 |
| 581.4 | -0.003 |
| 581.5 | -0.005 |
| 581.6 | -0.007 |
| 581.7 | -0.004 |
| 581.8 | -0.001 |
| 581.9 | 0.003 |
| 582.0 | 0.004 |
| 582.1 | 0 |
| 582.2 | 0.002 |
| 582.3 | 0 |
| 582.4 | 0.001 |
| 582.5 | 0.005 |
| 582.6 | 0.006 |
| 582.7 | 0.01 |
| 582.8 | 0.009 |
| 582.9 | 0.011 |
| 583.0 | 0.008 |
| 583.1 | 0.006 |
| 583.2 | 0.011 |
| 583.3 | 0.013 |
| 583.4 | 0.015 |
| 583.5 | 0.013 |
| 583.6 | 0.013 |
| 583.7 | 0.013 |
| 583.8 | 0.013 |
| 583.9 | 0.017 |
| 584.0 | 0.013 |
| 584.1 | 0.016 |
| 584.2 | 0.018 |
| 584.3 | 0.016 |
| 584.4 | 0.013 |
| 584.5 | 0.012 |
| 584.6 | 0.016 |
| 584.7 | 0.011 |
| 584.8 | 0.015 |
| 584.9 | 0.013 |
| 585.0 | 0.01 |
| 585.1 | 0.01 |
| 585.2 | 0.008 |
| 585.3 | 0.003 |
| 585.4 | 0.005 |
| 585.5 | 0.006 |
| 585.6 | 0.005 |
| 585.7 | 0.003 |
| 585.8 | 0.008 |
| 585.9 | 0.004 |
| 586.0 | -0.002 |
| 586.1 | -0.001 |
| 586.2 | 0.001 |
| 586.3 | 0.004 |
| 586.4 | 0.009 |
| 586.5 | 0.008 |
| 586.6 | 0.006 |
| 586.7 | 0.007 |
| 586.8 | 0.01 |
| 586.9 | 0.007 |
| 587.0 | 0.004 |
| 587.1 | 0.008 |
| 587.2 | 0.004 |
| 587.3 | 0.003 |
| 587.4 | 0.001 |
| 587.5 | 0 |
| 587.6 | -0.002 |
| 587.7 | 0 |
| 587.8 | -0.002 |
| 587.9 | -0.002 |
| 588.0 | 0 |
| 588.1 | 0.005 |
| 588.2 | 0.008 |
| 588.3 | 0.006 |
| 588.4 | 0.003 |
| 588.5 | 0.001 |
| 588.6 | 0.002 |
| 588.7 | 0.003 |
| 588.8 | 0.003 |
| 588.9 | 0.004 |
| 589.0 | 0.002 |
| 589.1 | -0.001 |
| 589.2 | -0.006 |
| 589.3 | -0.01 |
| 589.4 | -0.006 |
| 589.5 | -0.005 |
| 589.6 | -0.006 |
| 589.7 | -0.006 |
| 589.8 | -0.007 |
| 589.9 | -0.003 |
| 590.0 | -0.004 |
| 590.1 | -0.005 |
| 590.2 | -0.006 |
| 590.3 | -0.003 |
| 590.4 | 0.003 |
| 590.5 | -0.001 |
| 590.6 | 0.002 |
| 590.7 | 0.006 |
| 590.8 | 0.007 |
| 590.9 | 0.007 |
| 591.0 | 0.002 |
| 591.1 | 0.002 |
| 591.2 | 0.006 |
| 591.3 | 0.007 |
| 591.4 | 0.004 |
| 591.5 | 0.002 |
| 591.6 | 0.005 |
| 591.7 | 0.003 |
| 591.8 | 0.006 |
| 591.9 | 0.002 |
| 592.0 | 0.005 |
| 592.1 | 0.004 |
| 592.2 | 0.008 |
| 592.3 | 0.003 |
| 592.4 | 0.006 |
| 592.5 | 0.01 |
| 592.6 | 0.012 |
| 592.7 | 0.01 |
| 592.8 | 0.011 |
| 592.9 | 0.011 |
| 593.0 | 0.01 |
| 593.1 | 0.008 |
| 593.2 | 0.012 |
| 593.3 | 0.008 |
| 593.4 | 0.012 |
| 593.5 | 0.01 |
| 593.6 | 0.009 |
| 593.7 | 0.009 |
| 593.8 | 0.01 |
| 593.9 | 0.011 |
| 594.0 | 0.009 |
| 594.1 | 0.011 |
| 594.2 | 0.006 |
| 594.3 | 0.013 |
| 594.4 | 0.014 |
| 594.5 | 0.013 |
| 594.6 | 0.01 |
| 594.7 | 0.012 |
| 594.8 | 0.01 |
| 594.9 | 0.012 |
| 595.0 | 0.011 |
| 595.1 | 0.012 |
| 595.2 | 0.011 |
| 595.3 | 0.013 |
| 595.4 | 0.01 |
| 595.5 | 0.007 |
| 595.6 | 0.009 |
| 595.7 | 0.01 |
| 595.8 | 0.008 |
| 595.9 | 0.008 |
| 596.0 | 0.004 |
| 596.1 | 0.006 |
| 596.2 | 0.007 |
| 596.3 | 0.008 |
| 596.4 | 0.008 |
| 596.5 | 0.004 |
| 596.6 | 0.005 |
| 596.7 | 0.002 |
| 596.8 | 0.003 |
| 596.9 | 0.002 |
| 597.0 | 0.002 |
| 597.1 | -0.005 |
| 597.2 | -0.005 |
| 597.3 | -0.01 |
| 597.4 | -0.014 |
| 597.5 | -0.015 |
| 597.6 | -0.015 |
| 597.7 | -0.014 |
| 597.8 | -0.012 |
| 597.9 | -0.011 |
| 598.0 | -0.013 |
| 598.1 | -0.013 |
| 598.2 | -0.004 |
| 598.3 | -0.006 |
| 598.4 | -0.004 |
| 598.5 | -0.005 |
| 598.6 | -0.007 |
| 598.7 | -0.005 |
| 598.8 | -0.006 |
| 598.9 | -0.009 |
| 599.0 | -0.009 |
| 599.1 | -0.006 |
| 599.2 | -0.008 |
| 599.3 | -0.009 |
| 599.4 | -0.008 |
| 599.5 | -0.007 |
| 599.6 | -0.003 |
| 599.7 | 0.001 |
| 599.8 | 0.001 |
| 599.9 | 0 |
| 600.0 | 0.003 |
| 600.1 | 0.002 |
| 600.2 | 0.003 |
| 600.3 | 0.006 |
| 600.4 | 0.009 |
| 600.5 | 0.004 |
| 600.6 | 0.003 |
| 600.7 | 0.005 |
| 600.8 | 0.006 |
| 600.9 | 0.004 |
| 601.0 | 0.005 |
| 601.1 | 0.011 |
| 601.2 | 0.011 |
| 601.3 | 0.01 |
| 601.4 | 0.007 |
| 601.5 | 0.006 |
| 601.6 | 0.011 |
| 601.7 | 0.012 |
| 601.8 | 0.013 |
| 601.9 | 0.008 |
| 602.0 | 0.009 |
| 602.1 | 0.012 |
| 602.2 | 0.005 |
| 602.3 | 0.008 |
| 602.4 | 0.008 |
| 602.5 | 0.005 |
| 602.6 | 0.004 |
| 602.7 | 0.003 |
| 602.8 | 0.001 |
| 602.9 | -0.003 |
| 603.0 | 0 |
| 603.1 | -0.004 |
| 603.2 | -0.005 |
| 603.3 | -0.006 |
| 603.4 | -0.01 |
| 603.5 | -0.004 |
| 603.6 | -0.003 |
| 603.7 | -0.001 |
| 603.8 | 0.001 |
| 603.9 | 0.003 |
| 604.0 | 0.003 |
| 604.1 | 0.003 |
| 604.2 | 0.006 |
| 604.3 | 0.007 |
| 604.4 | 0.008 |
| 604.5 | 0.01 |
| 604.6 | 0.005 |
| 604.7 | 0.006 |
| 604.8 | 0.006 |
| 604.9 | 0.005 |
| 605.0 | 0.002 |
| 605.1 | 0.005 |
| 605.2 | 0.004 |
| 605.3 | 0.002 |
| 605.4 | 0.002 |
| 605.5 | 0.002 |
| 605.6 | 0.005 |
| 605.7 | 0.008 |
| 605.8 | 0.007 |
| 605.9 | 0.007 |
| 606.0 | 0.006 |
| 606.1 | 0.007 |
| 606.2 | 0.012 |
| 606.3 | 0.012 |
| 606.4 | 0.014 |
| 606.5 | 0.014 |
| 606.6 | 0.013 |
| 606.7 | 0.012 |
| 606.8 | 0.007 |
| 606.9 | 0.009 |
| 607.0 | 0.008 |
| 607.1 | 0.009 |
| 607.2 | 0.009 |
| 607.3 | 0.002 |
| 607.4 | 0.003 |
| 607.5 | 0.006 |
| 607.6 | 0.005 |
| 607.7 | 0.004 |
| 607.8 | 0.006 |
| 607.9 | 0.008 |
| 608.0 | 0.007 |
| 608.1 | 0.012 |
| 608.2 | 0.009 |
| 608.3 | 0.006 |
| 608.4 | 0.008 |
| 608.5 | 0.008 |
| 608.6 | -0.001 |
| 608.7 | 0 |
| 608.8 | 0.001 |
| 608.9 | -0.003 |
| 609.0 | -0.004 |
| 609.1 | -0.005 |
| 609.2 | -0.011 |
| 609.3 | -0.01 |
| 609.4 | -0.007 |
| 609.5 | -0.005 |
| 609.6 | -0.009 |
| 609.7 | -0.003 |
| 609.8 | -0.002 |
| 609.9 | -0.005 |
| 610.0 | -0.004 |
| 610.1 | -0.005 |
| 610.2 | -0.004 |
| 610.3 | -0.005 |
| 610.4 | -0.004 |
| 610.5 | -0.005 |
| 610.6 | -0.006 |
| 610.7 | -0.004 |
| 610.8 | -0.004 |
| 610.9 | -0.006 |
| 611.0 | -0.005 |
| 611.1 | -0.006 |
| 611.2 | -0.005 |
| 611.3 | -0.007 |
| 611.4 | -0.002 |
| 611.5 | -0.003 |
| 611.6 | -0.005 |
| 611.7 | -0.004 |
| 611.8 | -0.007 |
| 611.9 | -0.006 |
| 612.0 | -0.008 |
| 612.1 | -0.006 |
| 612.2 | -0.005 |
| 612.3 | -0.005 |
| 612.4 | -0.005 |
| 612.5 | -0.009 |
| 612.6 | -0.004 |
| 612.7 | -0.002 |
| 612.8 | 0 |
| 612.9 | 0.003 |
| 613.0 | 0.006 |
| 613.1 | 0.007 |
| 613.2 | 0.003 |
| 613.3 | 0.002 |
| 613.4 | 0.003 |
| 613.5 | 0.003 |
| 613.6 | 0.007 |
| 613.7 | 0.004 |
| 613.8 | 0.007 |
| 613.9 | 0.006 |
| 614.0 | 0.009 |
| 614.1 | 0.008 |
| 614.2 | 0.01 |
| 614.3 | 0.008 |
| 614.4 | 0.009 |
| 614.5 | 0.013 |
| 614.6 | 0.014 |
| 614.7 | 0.011 |
| 614.8 | 0.011 |
| 614.9 | 0.009 |
| 615.0 | 0.006 |
| 615.1 | 0.005 |
| 615.2 | 0.001 |
| 615.3 | 0.001 |
| 615.4 | 0.003 |
| 615.5 | 0.004 |
| 615.6 | 0.002 |
| 615.7 | 0.003 |
| 615.8 | 0.005 |
| 615.9 | 0.003 |
| 616.0 | 0.001 |
| 616.1 | 0.001 |
| 616.2 | -0.001 |
| 616.3 | 0.001 |
| 616.4 | 0.002 |
| 616.5 | 0.002 |
| 616.6 | 0.002 |
| 616.7 | -0.001 |
| 616.8 | 0.001 |
| 616.9 | -0.002 |
| 617.0 | -0.001 |
| 617.1 | -0.001 |
| 617.2 | -0.001 |
| 617.3 | -0.001 |
| 617.4 | -0.002 |
| 617.5 | -0.005 |
| 617.6 | -0.006 |
| 617.7 | -0.008 |
| 617.8 | -0.004 |
| 617.9 | -0.008 |
| 618.0 | -0.004 |
| 618.1 | -0.007 |
| 618.2 | -0.004 |
| 618.3 | -0.005 |
| 618.4 | -0.004 |
| 618.5 | -0.006 |
| 618.6 | -0.004 |
| 618.7 | -0.005 |
| 618.8 | -0.001 |
| 618.9 | -0.004 |
| 619.0 | -0.002 |
| 619.1 | -0.002 |
| 619.2 | 0.002 |
| 619.3 | -0.002 |
| 619.4 | -0.001 |
| 619.5 | -0.004 |
| 619.6 | -0.001 |
| 619.7 | -0.005 |
| 619.8 | 0.004 |
| 619.9 | 0.001 |
| 620.0 | 0 |
| 620.1 | -0.002 |
| 620.2 | -0.002 |
| 620.3 | -0.001 |
| 620.4 | 0.001 |
| 620.5 | 0.002 |
| 620.6 | 0.005 |
| 620.7 | 0.004 |
| 620.8 | 0.011 |
| 620.9 | 0.004 |
| 621.0 | 0.003 |
| 621.1 | 0.007 |
| 621.2 | 0.01 |
| 621.3 | 0.007 |
| 621.4 | 0.006 |
| 621.5 | 0.005 |
| 621.6 | 0.003 |
| 621.7 | 0.007 |
| 621.8 | 0.007 |
| 621.9 | 0.006 |
| 622.0 | 0.006 |
| 622.1 | 0.008 |
| 622.2 | 0.004 |
| 622.3 | 0.005 |
| 622.4 | 0.003 |
| 622.5 | 0 |
| 622.6 | -0.002 |
| 622.7 | 0.002 |
| 622.8 | 0.002 |
| 622.9 | 0.004 |
| 623.0 | 0.006 |
| 623.1 | 0.008 |
| 623.2 | 0.009 |
| 623.3 | 0.009 |
| 623.4 | 0.011 |
| 623.5 | 0.012 |
| 623.6 | 0.017 |
| 623.7 | 0.019 |
| 623.8 | 0.019 |
| 623.9 | 0.016 |
| 624.0 | 0.014 |
| 624.1 | 0.016 |
| 624.2 | 0.016 |
| 624.3 | 0.012 |
| 624.4 | 0.014 |
| 624.5 | 0.012 |
| 624.6 | 0.011 |
| 624.7 | 0.011 |
| 624.8 | 0.013 |
| 624.9 | 0.011 |
| 625.0 | 0.014 |
| 625.1 | 0.015 |
| 625.2 | 0.011 |
| 625.3 | 0.013 |
| 625.4 | 0.015 |
| 625.5 | 0.016 |
| 625.6 | 0.017 |
| 625.7 | 0.02 |
| 625.8 | 0.019 |
| 625.9 | 0.018 |
| 626.0 | 0.017 |
| 626.1 | 0.014 |
| 626.2 | 0.014 |
| 626.3 | 0.015 |
| 626.4 | 0.011 |
| 626.5 | 0.012 |
| 626.6 | 0.01 |
| 626.7 | 0.014 |
| 626.8 | 0.014 |
| 626.9 | 0.014 |
| 627.0 | 0.015 |
| 627.1 | 0.015 |
| 627.2 | 0.014 |
| 627.3 | 0.019 |
| 627.4 | 0.018 |
| 627.5 | 0.019 |
| 627.6 | 0.02 |
| 627.7 | 0.019 |
| 627.8 | 0.014 |
| 627.9 | 0.013 |
| 628.0 | 0.016 |
| 628.1 | 0.017 |
| 628.2 | 0.019 |
| 628.3 | 0.019 |
| 628.4 | 0.014 |
| 628.5 | 0.014 |
| 628.6 | 0.012 |
| 628.7 | 0.011 |
| 628.8 | 0.014 |
| 628.9 | 0.015 |
| 629.0 | 0.019 |
| 629.1 | 0.017 |
| 629.2 | 0.017 |
| 629.3 | 0.02 |
| 629.4 | 0.022 |
| 629.5 | 0.026 |
| 629.6 | 0.027 |
| 629.7 | 0.029 |
| 629.8 | 0.027 |
| 629.9 | 0.028 |
| 630.0 | 0.032 |
| 630.1 | 0.03 |
| 630.2 | 0.034 |
| 630.3 | 0.034 |
| 630.4 | 0.03 |
| 630.5 | 0.03 |
| 630.6 | 0.031 |
| 630.7 | 0.032 |
| 630.8 | 0.032 |
| 630.9 | 0.035 |
| 631.0 | 0.029 |
| 631.1 | 0.027 |
| 631.2 | 0.029 |
| 631.3 | 0.031 |
| 631.4 | 0.034 |
| 631.5 | 0.035 |
| 631.6 | 0.036 |
| 631.7 | 0.035 |
| 631.8 | 0.035 |
| 631.9 | 0.034 |
| 632.0 | 0.037 |
| 632.1 | 0.04 |
| 632.2 | 0.038 |
| 632.3 | 0.036 |
| 632.4 | 0.03 |
| 632.5 | 0.026 |
| 632.6 | 0.028 |
| 632.7 | 0.03 |
| 632.8 | 0.027 |
| 632.9 | 0.029 |
| 633.0 | 0.033 |
| 633.1 | 0.029 |
| 633.2 | 0.031 |
| 633.3 | 0.038 |
| 633.4 | 0.036 |
| 633.5 | 0.04 |
| 633.6 | 0.038 |
| 633.7 | 0.034 |
| 633.8 | 0.037 |
| 633.9 | 0.039 |
| 634.0 | 0.037 |
| 634.1 | 0.038 |
| 634.2 | 0.04 |
| 634.3 | 0.041 |
| 634.4 | 0.04 |
| 634.5 | 0.043 |
| 634.6 | 0.042 |
| 634.7 | 0.045 |
| 634.8 | 0.051 |
| 634.9 | 0.053 |
| 635.0 | 0.051 |
| 635.1 | 0.052 |
| 635.2 | 0.053 |
| 635.3 | 0.053 |
| 635.4 | 0.05 |
| 635.5 | 0.047 |
| 635.6 | 0.049 |
| 635.7 | 0.055 |
| 635.8 | 0.058 |
| 635.9 | 0.052 |
| 636.0 | 0.048 |
| 636.1 | 0.05 |
| 636.2 | 0.053 |
| 636.3 | 0.052 |
| 636.4 | 0.054 |
| 636.5 | 0.057 |
| 636.6 | 0.061 |
| 636.7 | 0.059 |
| 636.8 | 0.057 |
| 636.9 | 0.055 |
| 637.0 | 0.06 |
| 637.1 | 0.057 |
| 637.2 | 0.057 |
| 637.3 | 0.054 |
| 637.4 | 0.055 |
| 637.5 | 0.056 |
| 637.6 | 0.059 |
| 637.7 | 0.061 |
| 637.8 | 0.064 |
| 637.9 | 0.064 |
| 638.0 | 0.066 |
| 638.1 | 0.068 |
| 638.2 | 0.07 |
| 638.3 | 0.071 |
| 638.4 | 0.078 |
| 638.5 | 0.076 |
| 638.6 | 0.074 |
| 638.7 | 0.072 |
| 638.8 | 0.073 |
| 638.9 | 0.07 |
| 639.0 | 0.071 |
| 639.1 | 0.073 |
| 639.2 | 0.07 |
| 639.3 | 0.072 |
| 639.4 | 0.073 |
| 639.5 | 0.074 |
| 639.6 | 0.076 |
| 639.7 | 0.075 |
| 639.8 | 0.077 |
| 639.9 | 0.076 |
| 640.0 | 0.076 |
| 640.1 | 0.076 |
| 640.2 | 0.077 |
| 640.3 | 0.081 |
| 640.4 | 0.081 |
| 640.5 | 0.083 |
| 640.6 | 0.081 |
| 640.7 | 0.082 |
| 640.8 | 0.087 |
| 640.9 | 0.088 |
| 641.0 | 0.086 |
| 641.1 | 0.088 |
| 641.2 | 0.086 |
| 641.3 | 0.087 |
| 641.4 | 0.084 |
| 641.5 | 0.089 |
| 641.6 | 0.091 |
| 641.7 | 0.088 |
| 641.8 | 0.089 |
| 641.9 | 0.09 |
| 642.0 | 0.094 |
| 642.1 | 0.1 |
| 642.2 | 0.1 |
| 642.3 | 0.104 |
| 642.4 | 0.103 |
| 642.5 | 0.107 |
| 642.6 | 0.104 |
| 642.7 | 0.105 |
| 642.8 | 0.107 |
| 642.9 | 0.107 |
| 643.0 | 0.106 |
| 643.1 | 0.104 |
| 643.2 | 0.102 |
| 643.3 | 0.106 |
| 643.4 | 0.111 |
| 643.5 | 0.112 |
| 643.6 | 0.117 |
| 643.7 | 0.122 |
| 643.8 | 0.128 |
| 643.9 | 0.133 |
| 644.0 | 0.141 |
| 644.1 | 0.149 |
| 644.2 | 0.157 |
| 644.3 | 0.168 |
| 644.4 | 0.177 |
| 644.5 | 0.184 |
| 644.6 | 0.195 |
| 644.7 | 0.208 |
| 644.8 | 0.227 |
| 644.9 | 0.24 |
| 645.0 | 0.259 |
| 645.1 | 0.275 |
| 645.2 | 0.297 |
| 645.3 | 0.319 |
| 645.4 | 0.338 |
| 645.5 | 0.358 |
| 645.6 | 0.382 |
| 645.7 | 0.406 |
| 645.8 | 0.426 |
| 645.9 | 0.446 |
| 646.0 | 0.465 |
| 646.1 | 0.481 |
| 646.2 | 0.494 |
| 646.3 | 0.504 |
| 646.4 | 0.513 |
| 646.5 | 0.518 |
| 646.6 | 0.526 |
| 646.7 | 0.527 |
| 646.8 | 0.525 |
| 646.9 | 0.524 |
| 647.0 | 0.521 |
| 647.1 | 0.514 |
| 647.2 | 0.511 |
| 647.3 | 0.504 |
| 647.4 | 0.495 |
| 647.5 | 0.485 |
| 647.6 | 0.476 |
| 647.7 | 0.468 |
| 647.8 | 0.455 |
| 647.9 | 0.447 |
| 648.0 | 0.436 |
| 648.1 | 0.423 |
| 648.2 | 0.415 |
| 648.3 | 0.404 |
| 648.4 | 0.399 |
| 648.5 | 0.391 |
| 648.6 | 0.387 |
| 648.7 | 0.383 |
| 648.8 | 0.377 |
| 648.9 | 0.372 |
| 649.0 | 0.364 |
| 649.1 | 0.362 |
| 649.2 | 0.361 |
| 649.3 | 0.359 |
| 649.4 | 0.358 |
| 649.5 | 0.359 |
| 649.6 | 0.361 |
| 649.7 | 0.365 |
| 649.8 | 0.374 |
| 649.9 | 0.381 |
| 650.0 | 0.393 |
| 650.1 | 0.414 |
| 650.2 | 0.433 |
| 650.3 | 0.454 |
| 650.4 | 0.482 |
| 650.5 | 0.51 |
| 650.6 | 0.539 |
| 650.7 | 0.573 |
| 650.8 | 0.608 |
| 650.9 | 0.648 |
| 651.0 | 0.692 |
| 651.1 | 0.737 |
| 651.2 | 0.78 |
| 651.3 | 0.824 |
| 651.4 | 0.864 |
| 651.5 | 0.907 |
| 651.6 | 0.949 |
| 651.7 | 0.991 |
| 651.8 | 1.027 |
| 651.9 | 1.06 |
| 652.0 | 1.083 |
| 652.1 | 1.103 |
| 652.2 | 1.119 |
| 652.3 | 1.13 |
| 652.4 | 1.137 |
| 652.5 | 1.139 |
| 652.6 | 1.136 |
| 652.7 | 1.138 |
| 652.8 | 1.134 |
| 652.9 | 1.13 |
| 653.0 | 1.13 |
| 653.1 | 1.132 |
| 653.2 | 1.138 |
| 653.3 | 1.144 |
| 653.4 | 1.152 |
| 653.5 | 1.168 |
| 653.6 | 1.191 |
| 653.7 | 1.214 |
| 653.8 | 1.235 |
| 653.9 | 1.263 |
| 654.0 | 1.293 |
| 654.1 | 1.322 |
| 654.2 | 1.353 |
| 654.3 | 1.383 |
| 654.4 | 1.415 |
| 654.5 | 1.443 |
| 654.6 | 1.465 |
| 654.7 | 1.481 |
| 654.8 | 1.488 |
| 654.9 | 1.494 |
| 655.0 | 1.49 |
| 655.1 | 1.481 |
| 655.2 | 1.466 |
| 655.3 | 1.442 |
| 655.4 | 1.413 |
| 655.5 | 1.373 |
| 655.6 | 1.337 |
| 655.7 | 1.297 |
| 655.8 | 1.25 |
| 655.9 | 1.209 |
| 656.0 | 1.164 |
| 656.1 | 1.118 |
| 656.2 | 1.069 |
| 656.3 | 1.022 |
| 656.4 | 0.978 |
| 656.5 | 0.937 |
| 656.6 | 0.903 |
| 656.7 | 0.869 |
| 656.8 | 0.845 |
| 656.9 | 0.823 |
| 657.0 | 0.801 |
| 657.1 | 0.79 |
| 657.2 | 0.782 |
| 657.3 | 0.78 |
| 657.4 | 0.783 |
| 657.5 | 0.791 |
| 657.6 | 0.795 |
| 657.7 | 0.804 |
| 657.8 | 0.817 |
| 657.9 | 0.828 |
| 658.0 | 0.843 |
| 658.1 | 0.859 |
| 658.2 | 0.87 |
| 658.3 | 0.887 |
| 658.4 | 0.904 |
| 658.5 | 0.921 |
| 658.6 | 0.932 |
| 658.7 | 0.949 |
| 658.8 | 0.959 |
| 658.9 | 0.968 |
| 659.0 | 0.973 |
| 659.1 | 0.975 |
| 659.2 | 0.98 |
| 659.3 | 0.982 |
| 659.4 | 0.98 |
| 659.5 | 0.975 |
| 659.6 | 0.968 |
| 659.7 | 0.963 |
| 659.8 | 0.958 |
| 659.9 | 0.952 |
| 660.0 | 0.945 |
| 660.1 | 0.94 |
| 660.2 | 0.936 |
| 660.3 | 0.931 |
| 660.4 | 0.925 |
| 660.5 | 0.922 |
| 660.6 | 0.922 |
| 660.7 | 0.926 |
| 660.8 | 0.93 |
| 660.9 | 0.936 |
| 661.0 | 0.947 |
| 661.1 | 0.959 |
| 661.2 | 0.971 |
| 661.3 | 0.989 |
| 661.4 | 1.008 |
| 661.5 | 1.03 |
| 661.6 | 1.055 |
| 661.7 | 1.081 |
| 661.8 | 1.104 |
| 661.9 | 1.126 |
| 662.0 | 1.149 |
| 662.1 | 1.168 |
| 662.2 | 1.183 |
| 662.3 | 1.192 |
| 662.4 | 1.203 |
| 662.5 | 1.204 |
| 662.6 | 1.202 |
| 662.7 | 1.19 |
| 662.8 | 1.176 |
| 662.9 | 1.154 |
| 663.0 | 1.128 |
| 663.1 | 1.093 |
| 663.2 | 1.059 |
| 663.3 | 1.019 |
| 663.4 | 0.977 |
| 663.5 | 0.929 |
| 663.6 | 0.881 |
| 663.7 | 0.839 |
| 663.8 | 0.793 |
| 663.9 | 0.749 |
| 664.0 | 0.704 |
| 664.1 | 0.664 |
| 664.2 | 0.63 |
| 664.3 | 0.595 |
| 664.4 | 0.565 |
| 664.5 | 0.539 |
| 664.6 | 0.515 |
| 664.7 | 0.496 |
| 664.8 | 0.475 |
| 664.9 | 0.464 |
| 665.0 | 0.449 |
| 665.1 | 0.441 |
| 665.2 | 0.434 |
| 665.3 | 0.43 |
| 665.4 | 0.424 |
| 665.5 | 0.423 |
| 665.6 | 0.426 |
| 665.7 | 0.426 |
| 665.8 | 0.43 |
| 665.9 | 0.43 |
| 666.0 | 0.428 |
| 666.1 | 0.434 |
| 666.2 | 0.438 |
| 666.3 | 0.443 |
| 666.4 | 0.443 |
| 666.5 | 0.444 |
| 666.6 | 0.442 |
| 666.7 | 0.437 |
| 666.8 | 0.432 |
| 666.9 | 0.424 |
| 667.0 | 0.415 |
| 667.1 | 0.402 |
| 667.2 | 0.385 |
| 667.3 | 0.367 |
| 667.4 | 0.346 |
| 667.5 | 0.325 |
| 667.6 | 0.301 |
| 667.7 | 0.279 |
| 667.8 | 0.259 |
| 667.9 | 0.245 |
| 668.0 | 0.221 |
| 668.1 | 0.203 |
| 668.2 | 0.187 |
| 668.3 | 0.172 |
| 668.4 | 0.159 |
| 668.5 | 0.146 |
| 668.6 | 0.136 |
| 668.7 | 0.13 |
| 668.8 | 0.128 |
| 668.9 | 0.12 |
| 669.0 | 0.113 |
| 669.1 | 0.112 |
| 669.2 | 0.114 |
| 669.3 | 0.116 |
| 669.4 | 0.117 |
| 669.5 | 0.119 |
| 669.6 | 0.126 |
| 669.7 | 0.13 |
| 669.8 | 0.137 |
| 669.9 | 0.143 |
| 670.0 | 0.148 |
| 670.1 | 0.151 |
| 670.2 | 0.162 |
| 670.3 | 0.167 |
| 670.4 | 0.177 |
| 670.5 | 0.182 |
| 670.6 | 0.191 |
| 670.7 | 0.195 |
| 670.8 | 0.198 |
| 670.9 | 0.204 |
| 671.0 | 0.209 |
| 671.1 | 0.213 |
| 671.2 | 0.214 |
| 671.3 | 0.213 |
| 671.4 | 0.214 |
| 671.5 | 0.207 |
| 671.6 | 0.21 |
| 671.7 | 0.204 |
| 671.8 | 0.198 |
| 671.9 | 0.191 |
| 672.0 | 0.182 |
| 672.1 | 0.17 |
| 672.2 | 0.163 |
| 672.3 | 0.152 |
| 672.4 | 0.14 |
| 672.5 | 0.133 |
| 672.6 | 0.125 |
| 672.7 | 0.113 |
| 672.8 | 0.102 |
| 672.9 | 0.093 |
| 673.0 | 0.089 |
| 673.1 | 0.081 |
| 673.2 | 0.076 |
| 673.3 | 0.07 |
| 673.4 | 0.069 |
| 673.5 | 0.065 |
| 673.6 | 0.059 |
| 673.7 | 0.062 |
| 673.8 | 0.062 |
| 673.9 | 0.065 |
| 674.0 | 0.064 |
| 674.1 | 0.065 |
| 674.2 | 0.07 |
| 674.3 | 0.073 |
| 674.4 | 0.075 |
| 674.5 | 0.079 |
| 674.6 | 0.081 |
| 674.7 | 0.082 |
| 674.8 | 0.081 |
| 674.9 | 0.083 |
| 675.0 | 0.083 |
| 675.1 | 0.09 |
| 675.2 | 0.091 |
| 675.3 | 0.089 |
| 675.4 | 0.09 |
| 675.5 | 0.09 |
| 675.6 | 0.093 |
| 675.7 | 0.092 |
| 675.8 | 0.09 |
| 675.9 | 0.086 |
| 676.0 | 0.081 |
| 676.1 | 0.076 |
| 676.2 | 0.069 |
| 676.3 | 0.067 |
| 676.4 | 0.063 |
| 676.5 | 0.058 |
| 676.6 | 0.06 |
| 676.7 | 0.053 |
| 676.8 | 0.054 |
| 676.9 | 0.059 |
| 677.0 | 0.057 |
| 677.1 | 0.056 |
| 677.2 | 0.058 |
| 677.3 | 0.062 |
| 677.4 | 0.064 |
| 677.5 | 0.065 |
| 677.6 | 0.067 |
| 677.7 | 0.067 |
| 677.8 | 0.071 |
| 677.9 | 0.068 |
| 678.0 | 0.068 |
| 678.1 | 0.068 |
| 678.2 | 0.07 |
| 678.3 | 0.07 |
| 678.4 | 0.068 |
| 678.5 | 0.067 |
| 678.6 | 0.066 |
| 678.7 | 0.069 |
| 678.8 | 0.072 |
| 678.9 | 0.069 |
| 679.0 | 0.072 |
| 679.1 | 0.068 |
| 679.2 | 0.071 |
| 679.3 | 0.07 |
| 679.4 | 0.072 |
| 679.5 | 0.075 |
| 679.6 | 0.075 |
| 679.7 | 0.079 |
| 679.8 | 0.077 |
| 679.9 | 0.076 |
| 680.0 | 0.078 |
| 680.1 | 0.081 |
| 680.2 | 0.086 |
| 680.3 | 0.091 |
| 680.4 | 0.095 |
| 680.5 | 0.099 |
| 680.6 | 0.099 |
| 680.7 | 0.103 |
| 680.8 | 0.106 |
| 680.9 | 0.11 |
| 681.0 | 0.112 |
| 681.1 | 0.117 |
| 681.2 | 0.12 |
| 681.3 | 0.117 |
| 681.4 | 0.117 |
| 681.5 | 0.119 |
| 681.6 | 0.119 |
| 681.7 | 0.116 |
| 681.8 | 0.113 |
| 681.9 | 0.111 |
| 682.0 | 0.107 |
| 682.1 | 0.104 |
| 682.2 | 0.096 |
| 682.3 | 0.088 |
| 682.4 | 0.085 |
| 682.5 | 0.077 |
| 682.6 | 0.071 |
| 682.7 | 0.066 |
| 682.8 | 0.064 |
| 682.9 | 0.059 |
| 683.0 | 0.055 |
| 683.1 | 0.051 |
| 683.2 | 0.05 |
| 683.3 | 0.05 |
| 683.4 | 0.047 |
| 683.5 | 0.046 |
| 683.6 | 0.05 |
| 683.7 | 0.046 |
| 683.8 | 0.041 |
| 683.9 | 0.039 |
| 684.0 | 0.039 |
| 684.1 | 0.038 |
| 684.2 | 0.037 |
| 684.3 | 0.032 |
| 684.4 | 0.032 |
| 684.5 | 0.031 |
| 684.6 | 0.03 |
| 684.7 | 0.025 |
| 684.8 | 0.03 |
| 684.9 | 0.034 |
| 685.0 | 0.034 |
| 685.1 | 0.035 |
| 685.2 | 0.036 |
| 685.3 | 0.035 |
| 685.4 | 0.038 |
| 685.5 | 0.039 |
| 685.6 | 0.041 |
| 685.7 | 0.042 |
| 685.8 | 0.04 |
| 685.9 | 0.037 |
| 686.0 | 0.039 |
| 686.1 | 0.043 |
| 686.2 | 0.042 |
| 686.3 | 0.038 |
| 686.4 | 0.036 |
| 686.5 | 0.035 |
| 686.6 | 0.031 |
| 686.7 | 0.03 |
| 686.8 | 0.031 |
| 686.9 | 0.033 |
| 687.0 | 0.031 |
| 687.1 | 0.03 |
| 687.2 | 0.029 |
| 687.3 | 0.027 |
| 687.4 | 0.029 |
| 687.5 | 0.034 |
| 687.6 | 0.034 |
| 687.7 | 0.039 |
| 687.8 | 0.039 |
| 687.9 | 0.038 |
| 688.0 | 0.04 |
| 688.1 | 0.041 |
| 688.2 | 0.041 |
| 688.3 | 0.04 |
| 688.4 | 0.044 |
| 688.5 | 0.046 |
| 688.6 | 0.043 |
| 688.7 | 0.045 |
| 688.8 | 0.043 |
| 688.9 | 0.046 |
| 689.0 | 0.051 |
| 689.1 | 0.051 |
| 689.2 | 0.053 |
| 689.3 | 0.055 |
| 689.4 | 0.056 |
| 689.5 | 0.057 |
| 689.6 | 0.057 |
| 689.7 | 0.06 |
| 689.8 | 0.056 |
| 689.9 | 0.055 |
| 690.0 | 0.055 |
| 690.1 | 0.048 |
| 690.2 | 0.045 |
| 690.3 | 0.045 |
| 690.4 | 0.041 |
| 690.5 | 0.038 |
| 690.6 | 0.036 |
| 690.7 | 0.035 |
| 690.8 | 0.033 |
| 690.9 | 0.032 |
| 691.0 | 0.033 |
| 691.1 | 0.025 |
| 691.2 | 0.023 |
| 691.3 | 0.022 |
| 691.4 | 0.017 |
| 691.5 | 0.015 |
| 691.6 | 0.015 |
| 691.7 | 0.012 |
| 691.8 | 0.011 |
| 691.9 | 0.006 |
| 692.0 | 0.005 |
| 692.1 | 0.003 |
| 692.2 | 0.006 |
| 692.3 | 0.006 |
| 692.4 | 0.007 |
| 692.5 | 0.011 |
| 692.6 | 0.012 |
| 692.7 | 0.01 |
| 692.8 | 0.008 |
| 692.9 | 0.007 |
| 693.0 | 0.009 |
| 693.1 | 0.009 |
| 693.2 | 0.011 |
| 693.3 | 0.007 |
| 693.4 | 0.008 |
| 693.5 | 0.008 |
| 693.6 | 0.006 |
| 693.7 | 0.005 |
| 693.8 | 0.008 |
| 693.9 | 0.008 |
| 694.0 | 0.005 |
| 694.1 | 0.007 |
| 694.2 | 0.007 |
| 694.3 | 0.006 |
| 694.4 | 0.006 |
| 694.5 | 0.005 |
| 694.6 | 0.006 |
| 694.7 | 0.008 |
| 694.8 | 0.009 |
| 694.9 | 0.01 |
| 695.0 | 0.012 |
| 695.1 | 0.015 |
| 695.2 | 0.017 |
| 695.3 | 0.017 |
| 695.4 | 0.013 |
| 695.5 | 0.013 |
| 695.6 | 0.007 |
| 695.7 | 0.01 |
| 695.8 | 0.012 |
| 695.9 | 0.012 |
| 696.0 | 0.011 |
| 696.1 | 0.008 |
| 696.2 | 0.008 |
| 696.3 | 0.002 |
| 696.4 | 0.009 |
| 696.5 | 0.01 |
| 696.6 | 0.007 |
| 696.7 | 0.013 |
| 696.8 | 0.011 |
| 696.9 | 0.005 |
| 697.0 | 0.003 |
| 697.1 | 0.002 |
| 697.2 | 0.002 |
| 697.3 | 0.001 |
| 697.4 | 0.001 |
| 697.5 | -0.004 |
| 697.6 | 0.001 |
| 697.7 | 0.003 |
| 697.8 | 0.006 |
| 697.9 | 0.007 |
| 698.0 | 0.012 |
| 698.1 | 0.016 |
| 698.2 | 0.017 |
| 698.3 | 0.02 |
| 698.4 | 0.023 |
| 698.5 | 0.022 |
| 698.6 | 0.019 |
| 698.7 | 0.019 |
| 698.8 | 0.016 |
| 698.9 | 0.015 |
| 699.0 | 0.018 |
| 699.1 | 0.014 |
| 699.2 | 0.011 |
| 699.3 | 0.007 |
| 699.4 | 0.006 |
| 699.5 | 0.005 |
| 699.6 | 0.011 |
| 699.7 | 0.013 |
| 699.8 | 0.013 |
| 699.9 | 0.016 |
| 700.0 | 0.013 |
| 700.1 | 0.012 |
| 700.2 | 0.013 |
| 700.3 | 0.011 |
| 700.4 | 0.013 |
| 700.5 | 0.008 |
| 700.6 | 0.008 |
| 700.7 | 0.005 |
| 700.8 | 0.008 |
| 700.9 | 0.004 |
| 701.0 | 0.004 |
| 701.1 | 0.008 |
| 701.2 | 0.004 |
| 701.3 | 0.002 |
| 701.4 | 0.005 |
| 701.5 | 0.004 |
| 701.6 | 0.008 |
| 701.7 | 0.006 |
| 701.8 | 0.004 |
| 701.9 | 0.003 |
| 702.0 | 0.008 |
| 702.1 | 0.011 |
| 702.2 | 0.012 |
| 702.3 | 0.014 |
| 702.4 | 0.016 |
| 702.5 | 0.015 |
| 702.6 | 0.018 |
| 702.7 | 0.012 |
| 702.8 | 0.016 |
| 702.9 | 0.017 |
| 703.0 | 0.013 |
| 703.1 | 0.008 |
| 703.2 | 0.007 |
| 703.3 | 0.005 |
| 703.4 | 0.003 |
| 703.5 | 0.001 |
| 703.6 | 0 |
| 703.7 | 0 |
| 703.8 | 0.001 |
| 703.9 | -0.003 |
| 704.0 | -0.002 |
| 704.1 | -0.001 |
| 704.2 | 0.003 |
| 704.3 | 0.002 |
| 704.4 | 0.003 |
| 704.5 | 0.003 |
| 704.6 | 0.004 |
| 704.7 | 0.008 |
| 704.8 | 0.009 |
| 704.9 | 0.012 |
| 705.0 | 0.012 |
| 705.1 | 0.018 |
| 705.2 | 0.014 |
| 705.3 | 0.014 |
| 705.4 | 0.018 |
| 705.5 | 0.022 |
| 705.6 | 0.019 |
| 705.7 | 0.021 |
| 705.8 | 0.019 |
| 705.9 | 0.015 |
| 706.0 | 0.013 |
| 706.1 | 0.01 |
| 706.2 | 0.01 |
| 706.3 | 0.016 |
| 706.4 | 0.018 |
| 706.5 | 0.014 |
| 706.6 | 0.012 |
| 706.7 | 0.017 |
| 706.8 | 0.018 |
| 706.9 | 0.018 |
| 707.0 | 0.02 |
| 707.1 | 0.021 |
| 707.2 | 0.026 |
| 707.3 | 0.024 |
| 707.4 | 0.019 |
| 707.5 | 0.019 |
| 707.6 | 0.018 |
| 707.7 | 0.017 |
| 707.8 | 0.015 |
| 707.9 | 0.018 |
| 708.0 | 0.019 |
| 708.1 | 0.014 |
| 708.2 | 0.014 |
| 708.3 | 0.017 |
| 708.4 | 0.012 |
| 708.5 | 0.013 |
| 708.6 | 0.013 |
| 708.7 | 0.013 |
| 708.8 | 0.011 |
| 708.9 | 0.014 |
| 709.0 | 0.013 |
| 709.1 | 0.012 |
| 709.2 | 0.015 |
| 709.3 | 0.019 |
| 709.4 | 0.016 |
| 709.5 | 0.017 |
| 709.6 | 0.021 |
| 709.7 | 0.022 |
| 709.8 | 0.022 |
| 709.9 | 0.024 |
| 710.0 | 0.019 |
| 710.1 | 0.015 |
| 710.2 | 0.009 |
| 710.3 | 0.009 |
| 710.4 | 0.007 |
| 710.5 | 0.005 |
| 710.6 | 0.004 |
| 710.7 | 0.001 |
| 710.8 | -0.006 |
| 710.9 | -0.008 |
| 711.0 | -0.008 |
| 711.1 | -0.008 |
| 711.2 | -0.007 |
| 711.3 | -0.002 |
| 711.4 | 0.004 |
| 711.5 | 0.005 |
| 711.6 | 0.005 |
| 711.7 | 0.006 |
| 711.8 | 0.007 |
| 711.9 | 0.011 |
| 712.0 | 0.011 |
| 712.1 | 0.013 |
| 712.2 | 0.015 |
| 712.3 | 0.01 |
| 712.4 | 0.009 |
| 712.5 | 0.009 |
| 712.6 | 0.005 |
| 712.7 | 0.004 |
| 712.8 | 0.006 |
| 712.9 | 0.007 |
| 713.0 | 0.007 |
| 713.1 | 0.006 |
| 713.2 | 0.006 |
| 713.3 | 0.007 |
| 713.4 | 0.009 |
| 713.5 | 0.009 |
| 713.6 | 0.008 |
| 713.7 | 0.008 |
| 713.8 | 0.013 |
| 713.9 | 0.012 |
| 714.0 | 0.012 |
| 714.1 | 0.01 |
| 714.2 | 0.014 |
| 714.3 | 0.013 |
| 714.4 | 0.01 |
| 714.5 | 0.014 |
| 714.6 | 0.016 |
| 714.7 | 0.013 |
| 714.8 | 0.013 |
| 714.9 | 0.012 |
| 715.0 | 0.014 |
| 715.1 | 0.013 |
| 715.2 | 0.014 |
| 715.3 | 0.017 |
| 715.4 | 0.013 |
| 715.5 | 0.017 |
| 715.6 | 0.017 |
| 715.7 | 0.012 |
| 715.8 | 0.014 |
| 715.9 | 0.014 |
| 716.0 | 0.011 |
| 716.1 | 0.011 |
| 716.2 | 0.009 |
| 716.3 | 0.013 |
| 716.4 | 0.008 |
| 716.5 | 0.014 |
| 716.6 | 0.012 |
| 716.7 | 0.01 |
| 716.8 | 0.014 |
| 716.9 | 0.013 |
| 717.0 | 0.012 |
| 717.1 | 0.01 |
| 717.2 | 0.012 |
| 717.3 | 0.011 |
| 717.4 | 0.007 |
| 717.5 | 0.008 |
| 717.6 | 0.005 |
| 717.7 | 0.007 |
| 717.8 | 0.01 |
| 717.9 | 0.01 |
| 718.0 | 0.011 |
| 718.1 | 0.014 |
| 718.2 | 0.015 |
| 718.3 | 0.009 |
| 718.4 | 0.007 |
| 718.5 | 0.01 |
| 718.6 | 0.009 |
| 718.7 | 0.006 |
| 718.8 | 0.005 |
| 718.9 | 0.001 |
| 719.0 | 0.001 |
| 719.1 | -0.001 |
| 719.2 | -0.003 |
| 719.3 | -0.001 |
| 719.4 | -0.001 |
| 719.5 | 0.003 |
| 719.6 | 0.005 |
| 719.7 | 0.005 |
| 719.8 | 0.004 |
| 719.9 | 0.004 |
| 720.0 | 0.006 |
| 720.1 | 0.005 |
| 720.2 | 0.007 |
| 720.3 | 0.006 |
| 720.4 | 0.006 |
| 720.5 | 0.006 |
| 720.6 | 0.003 |
| 720.7 | -0.003 |
| 720.8 | 0.001 |
| 720.9 | 0.003 |
| 721.0 | 0.007 |
| 721.1 | 0.004 |
| 721.2 | 0.005 |
| 721.3 | 0.006 |
| 721.4 | 0.006 |
| 721.5 | 0.005 |
| 721.6 | 0.006 |
| 721.7 | 0.01 |
| 721.8 | 0.009 |
| 721.9 | 0.007 |
| 722.0 | 0.009 |
| 722.1 | 0.004 |
| 722.2 | 0.004 |
| 722.3 | 0.004 |
| 722.4 | 0.002 |
| 722.5 | 0.005 |
| 722.6 | 0.006 |
| 722.7 | 0.009 |
| 722.8 | 0.006 |
| 722.9 | 0.009 |
| 723.0 | 0.008 |
| 723.1 | 0.004 |
| 723.2 | 0.005 |
| 723.3 | 0.005 |
| 723.4 | 0.002 |
| 723.5 | 0.004 |
| 723.6 | 0.002 |
| 723.7 | 0.004 |
| 723.8 | 0 |
| 723.9 | 0.003 |
| 724.0 | 0 |
| 724.1 | 0.002 |
| 724.2 | 0.005 |
| 724.3 | -0.001 |
| 724.4 | 0.005 |
| 724.5 | 0.006 |
| 724.6 | 0.001 |
| 724.7 | 0.003 |
| 724.8 | 0.003 |
| 724.9 | 0.005 |
| 725.0 | 0.002 |
| 725.1 | 0.004 |
| 725.2 | 0.002 |
| 725.3 | 0.002 |
| 725.4 | 0.003 |
| 725.5 | -0.001 |
| 725.6 | -0.001 |
| 725.7 | 0.005 |
| 725.8 | 0.005 |
| 725.9 | 0.006 |
| 726.0 | 0.006 |
| 726.1 | 0.012 |
| 726.2 | 0.013 |
| 726.3 | 0.011 |
| 726.4 | 0.01 |
| 726.5 | 0.012 |
| 726.6 | 0.015 |
| 726.7 | 0.018 |
| 726.8 | 0.018 |
| 726.9 | 0.016 |
| 727.0 | 0.01 |
| 727.1 | 0.009 |
| 727.2 | 0.003 |
| 727.3 | 0.004 |
| 727.4 | 0.008 |
| 727.5 | 0.01 |
| 727.6 | 0.01 |
| 727.7 | 0.01 |
| 727.8 | 0.011 |
| 727.9 | 0.008 |
| 728.0 | 0.005 |
| 728.1 | 0.007 |
| 728.2 | 0.01 |
| 728.3 | 0.008 |
| 728.4 | 0.009 |
| 728.5 | 0.008 |
| 728.6 | 0.004 |
| 728.7 | 0.006 |
| 728.8 | 0.002 |
| 728.9 | 0.002 |
| 729.0 | 0.002 |
| 729.1 | 0.004 |
| 729.2 | 0.006 |
| 729.3 | 0.003 |
| 729.4 | 0.01 |
| 729.5 | 0.006 |
| 729.6 | 0.005 |
| 729.7 | 0.007 |
| 729.8 | 0.005 |
| 729.9 | 0.003 |
| 730.0 | 0 |
| 730.1 | 0 |
| 730.2 | 0.004 |
| 730.3 | 0.004 |
| 730.4 | 0.006 |
| 730.5 | 0 |
| 730.6 | 0.002 |
| 730.7 | -0.001 |
| 730.8 | -0.001 |
| 730.9 | -0.001 |
| 731.0 | 0.001 |
| 731.1 | 0 |
| 731.2 | 0.005 |
| 731.3 | 0.001 |
| 731.4 | 0 |
| 731.5 | -0.004 |
| 731.6 | 0 |
| 731.7 | -0.002 |
| 731.8 | 0.002 |
| 731.9 | 0.002 |
| 732.0 | 0.003 |
| 732.1 | 0.005 |
| 732.2 | 0.004 |
| 732.3 | 0.004 |
| 732.4 | 0.003 |
| 732.5 | 0.003 |
| 732.6 | 0.003 |
| 732.7 | 0.004 |
| 732.8 | 0.008 |
| 732.9 | 0.009 |
| 733.0 | 0.011 |
| 733.1 | 0.01 |
| 733.2 | 0.012 |
| 733.3 | 0.015 |
| 733.4 | 0.009 |
| 733.5 | 0.01 |
| 733.6 | 0.012 |
| 733.7 | 0.011 |
| 733.8 | 0.012 |
| 733.9 | 0.007 |
| 734.0 | 0.006 |
| 734.1 | 0.005 |
| 734.2 | 0.004 |
| 734.3 | 0.001 |
| 734.4 | 0 |
| 734.5 | 0.002 |
| 734.6 | 0.001 |
| 734.7 | -0.001 |
| 734.8 | -0.003 |
| 734.9 | -0.004 |
| 735.0 | 0.002 |
| 735.1 | -0.001 |
| 735.2 | -0.001 |
| 735.3 | -0.001 |
| 735.4 | 0 |
| 735.5 | 0.001 |
| 735.6 | 0.003 |
| 735.7 | 0.004 |
| 735.8 | 0.004 |
| 735.9 | 0.01 |
| 736.0 | 0.009 |
| 736.1 | 0.006 |
| 736.2 | 0.011 |
| 736.3 | 0.009 |
| 736.4 | 0.01 |
| 736.5 | 0.008 |
| 736.6 | 0.006 |
| 736.7 | 0.003 |
| 736.8 | 0 |
| 736.9 | -0.002 |
| 737.0 | -0.005 |
| 737.1 | -0.006 |
| 737.2 | -0.006 |
| 737.3 | -0.009 |
| 737.4 | -0.007 |
| 737.5 | -0.004 |
| 737.6 | -0.004 |
| 737.7 | -0.001 |
| 737.8 | 0.001 |
| 737.9 | 0.007 |
| 738.0 | 0.01 |
| 738.1 | 0.009 |
| 738.2 | 0.011 |
| 738.3 | 0.011 |
| 738.4 | 0.013 |
| 738.5 | 0.011 |
| 738.6 | 0.011 |
| 738.7 | 0.011 |
| 738.8 | 0.009 |
| 738.9 | 0.007 |
| 739.0 | 0.009 |
| 739.1 | 0.006 |
| 739.2 | 0.009 |
| 739.3 | 0.009 |
| 739.4 | 0.009 |
| 739.5 | 0.009 |
| 739.6 | 0.01 |
| 739.7 | 0.008 |
| 739.8 | 0.009 |
| 739.9 | 0.012 |
| 740.0 | 0.014 |
| 740.1 | 0.014 |
| 740.2 | 0.017 |
| 740.3 | 0.014 |
| 740.4 | 0.015 |
| 740.5 | 0.015 |
| 740.6 | 0.014 |
| 740.7 | 0.011 |
| 740.8 | 0.017 |
| 740.9 | 0.013 |
| 741.0 | 0.013 |
| 741.1 | 0.011 |
| 741.2 | 0.007 |
| 741.3 | 0.006 |
| 741.4 | 0.006 |
| 741.5 | 0.004 |
| 741.6 | 0.004 |
| 741.7 | 0.004 |
| 741.8 | 0.004 |
| 741.9 | 0 |
| 742.0 | 0.002 |
| 742.1 | 0.001 |
| 742.2 | 0.005 |
| 742.3 | 0.005 |
| 742.4 | 0.005 |
| 742.5 | 0.004 |
| 742.6 | 0.004 |
| 742.7 | 0.008 |
| 742.8 | 0.006 |
| 742.9 | 0.012 |
| 743.0 | 0.011 |
| 743.1 | 0.01 |
| 743.2 | 0.011 |
| 743.3 | 0.008 |
| 743.4 | 0.012 |
| 743.5 | 0.006 |
| 743.6 | 0.011 |
| 743.7 | 0.013 |
| 743.8 | 0.009 |
| 743.9 | 0.011 |
| 744.0 | 0.007 |
| 744.1 | 0.005 |
| 744.2 | 0.003 |
| 744.3 | 0.002 |
| 744.4 | 0.006 |
| 744.5 | 0.007 |
| 744.6 | 0.013 |
| 744.7 | 0.009 |
| 744.8 | 0.007 |
| 744.9 | 0.008 |
| 745.0 | 0.011 |
| 745.1 | 0.01 |
| 745.2 | 0.018 |
| 745.3 | 0.022 |
| 745.4 | 0.021 |
| 745.5 | 0.017 |
| 745.6 | 0.012 |
| 745.7 | 0.011 |
| 745.8 | 0.011 |
| 745.9 | 0.009 |
| 746.0 | 0.009 |
| 746.1 | 0.007 |
| 746.2 | 0.011 |
| 746.3 | 0.008 |
| 746.4 | 0.007 |
| 746.5 | 0.008 |
| 746.6 | 0.01 |
| 746.7 | 0.012 |
| 746.8 | 0.013 |
| 746.9 | 0.011 |
| 747.0 | 0.015 |
| 747.1 | 0.014 |
| 747.2 | 0.013 |
| 747.3 | 0.011 |
| 747.4 | 0.009 |
| 747.5 | 0.008 |
| 747.6 | 0.008 |
| 747.7 | 0.008 |
| 747.8 | 0.009 |
| 747.9 | 0.004 |
| 748.0 | 0.007 |
| 748.1 | 0.005 |
| 748.2 | 0.004 |
| 748.3 | 0.006 |
| 748.4 | 0.007 |
| 748.5 | 0.008 |
| 748.6 | 0.011 |
| 748.7 | 0.012 |
| 748.8 | 0.01 |
| 748.9 | 0.01 |
| 749.0 | 0.012 |
| 749.1 | 0.014 |
| 749.2 | 0.015 |
| 749.3 | 0.014 |
| 749.4 | 0.014 |
| 749.5 | 0.014 |
| 749.6 | 0.014 |
| 749.7 | 0.01 |
| 749.8 | 0.009 |
| 749.9 | 0.01 |
| 750.0 | 0.006 |
| 750.1 | 0.007 |
| 750.2 | 0.007 |
| 750.3 | 0.005 |
| 750.4 | 0.011 |
| 750.5 | 0.007 |
| 750.6 | 0.006 |
| 750.7 | 0.01 |
| 750.8 | 0.012 |
| 750.9 | 0.013 |
| 751.0 | 0.012 |
| 751.1 | 0.02 |
| 751.2 | 0.022 |
| 751.3 | 0.022 |
| 751.4 | 0.026 |
| 751.5 | 0.024 |
| 751.6 | 0.026 |
| 751.7 | 0.026 |
| 751.8 | 0.026 |
| 751.9 | 0.027 |
| 752.0 | 0.029 |
| 752.1 | 0.031 |
| 752.2 | 0.027 |
| 752.3 | 0.026 |
| 752.4 | 0.027 |
| 752.5 | 0.025 |
| 752.6 | 0.027 |
| 752.7 | 0.028 |
| 752.8 | 0.031 |
| 752.9 | 0.027 |
| 753.0 | 0.028 |
| 753.1 | 0.025 |
| 753.2 | 0.025 |
| 753.3 | 0.026 |
| 753.4 | 0.023 |
| 753.5 | 0.022 |
| 753.6 | 0.025 |
| 753.7 | 0.016 |
| 753.8 | 0.016 |
| 753.9 | 0.015 |
| 754.0 | 0.016 |
| 754.1 | 0.012 |
| 754.2 | 0.012 |
| 754.3 | 0.01 |
| 754.4 | 0.01 |
| 754.5 | 0.009 |
| 754.6 | 0.011 |
| 754.7 | 0.008 |
| 754.8 | 0.013 |
| 754.9 | 0.013 |
| 755.0 | 0.011 |
| 755.1 | 0.013 |
| 755.2 | 0.013 |
| 755.3 | 0.012 |
| 755.4 | 0.012 |
| 755.5 | 0.009 |
| 755.6 | 0.01 |
| 755.7 | 0.008 |
| 755.8 | 0.007 |
| 755.9 | 0.006 |
| 756.0 | 0.007 |
| 756.1 | 0.008 |
| 756.2 | 0.01 |
| 756.3 | 0.014 |
| 756.4 | 0.017 |
| 756.5 | 0.014 |
| 756.6 | 0.015 |
| 756.7 | 0.014 |
| 756.8 | 0.012 |
| 756.9 | 0.013 |
| 757.0 | 0.014 |
| 757.1 | 0.015 |
| 757.2 | 0.012 |
| 757.3 | 0.006 |
| 757.4 | 0.004 |
| 757.5 | 0.006 |
| 757.6 | 0.006 |
| 757.7 | 0.006 |
| 757.8 | 0.007 |
| 757.9 | 0.008 |
| 758.0 | 0.004 |
| 758.1 | 0.003 |
| 758.2 | -0.001 |
| 758.3 | 0 |
| 758.4 | 0.002 |
| 758.5 | 0.002 |
| 758.6 | -0.002 |
| 758.7 | -0.002 |
| 758.8 | -0.005 |
| 758.9 | -0.001 |
| 759.0 | 0 |
| 759.1 | 0.004 |
| 759.2 | 0.005 |
| 759.3 | 0.007 |
| 759.4 | 0.012 |
| 759.5 | 0.01 |
| 759.6 | 0.009 |
| 759.7 | 0.012 |
| 759.8 | 0.014 |
| 759.9 | 0.017 |
| 760.0 | 0.016 |
| 760.1 | 0.016 |
| 760.2 | 0.013 |
| 760.3 | 0.014 |
| 760.4 | 0.014 |
| 760.5 | 0.01 |
| 760.6 | 0.01 |
| 760.7 | 0.012 |
| 760.8 | 0.011 |
| 760.9 | 0.011 |
| 761.0 | 0.012 |
| 761.1 | 0.016 |
| 761.2 | 0.014 |
| 761.3 | 0.017 |
| 761.4 | 0.013 |
| 761.5 | 0.013 |
| 761.6 | 0.014 |
| 761.7 | 0.015 |
| 761.8 | 0.016 |
| 761.9 | 0.014 |
| 762.0 | 0.016 |
| 762.1 | 0.017 |
| 762.2 | 0.012 |
| 762.3 | 0.013 |
| 762.4 | 0.013 |
| 762.5 | 0.016 |
| 762.6 | 0.016 |
| 762.7 | 0.018 |
| 762.8 | 0.021 |
| 762.9 | 0.022 |
| 763.0 | 0.021 |
| 763.1 | 0.022 |
| 763.2 | 0.019 |
| 763.3 | 0.02 |
| 763.4 | 0.021 |
| 763.5 | 0.021 |
| 763.6 | 0.02 |
| 763.7 | 0.017 |
| 763.8 | 0.011 |
| 763.9 | 0.009 |
| 764.0 | 0.005 |
| 764.1 | 0.007 |
| 764.2 | 0.005 |
| 764.3 | 0.007 |
| 764.4 | 0.001 |
| 764.5 | 0 |
| 764.6 | -0.002 |
| 764.7 | -0.002 |
| 764.8 | 0.001 |
| 764.9 | 0.002 |
| 765.0 | 0.002 |
| 765.1 | 0.003 |
| 765.2 | 0.004 |
| 765.3 | 0.005 |
| 765.4 | 0.001 |
| 765.5 | 0.006 |
| 765.6 | 0.006 |
| 765.7 | 0.008 |
| 765.8 | 0.007 |
| 765.9 | 0.004 |
| 766.0 | 0.007 |
| 766.1 | 0.007 |
| 766.2 | 0.006 |
| 766.3 | 0 |
| 766.4 | -0.001 |
| 766.5 | 0.002 |
| 766.6 | -0.003 |
| 766.7 | -0.002 |
| 766.8 | -0.001 |
| 766.9 | 0.002 |
| 767.0 | 0.006 |
| 767.1 | 0.008 |
| 767.2 | 0.008 |
| 767.3 | 0.005 |
| 767.4 | 0.008 |
| 767.5 | 0.009 |
| 767.6 | 0.012 |
| 767.7 | 0.014 |
| 767.8 | 0.012 |
| 767.9 | 0.01 |
| 768.0 | 0.01 |
| 768.1 | 0.008 |
| 768.2 | 0.005 |
| 768.3 | 0.005 |
| 768.4 | 0.01 |
| 768.5 | 0.012 |
| 768.6 | 0.011 |
| 768.7 | 0.01 |
| 768.8 | 0.012 |
| 768.9 | 0.013 |
| 769.0 | 0.011 |
| 769.1 | 0.011 |
| 769.2 | 0.014 |
| 769.3 | 0.013 |
| 769.4 | 0.011 |
| 769.5 | 0.01 |
| 769.6 | 0.009 |
| 769.7 | 0.01 |
| 769.8 | 0.014 |
| 769.9 | 0.016 |
| 770.0 | 0.017 |
| 770.1 | 0.017 |
| 770.2 | 0.019 |
| 770.3 | 0.019 |
| 770.4 | 0.022 |
| 770.5 | 0.024 |
| 770.6 | 0.025 |
| 770.7 | 0.027 |
| 770.8 | 0.023 |
| 770.9 | 0.018 |
| 771.0 | 0.018 |
| 771.1 | 0.02 |
| 771.2 | 0.022 |
| 771.3 | 0.021 |
| 771.4 | 0.022 |
| 771.5 | 0.019 |
| 771.6 | 0.018 |
| 771.7 | 0.022 |
| 771.8 | 0.024 |
| 771.9 | 0.03 |
| 772.0 | 0.028 |
| 772.1 | 0.029 |
| 772.2 | 0.024 |
| 772.3 | 0.024 |
| 772.4 | 0.022 |
| 772.5 | 0.016 |
| 772.6 | 0.019 |
| 772.7 | 0.019 |
| 772.8 | 0.015 |
| 772.9 | 0.016 |
| 773.0 | 0.01 |
| 773.1 | 0.013 |
| 773.2 | 0.012 |
| 773.3 | 0.013 |
| 773.4 | 0.011 |
| 773.5 | 0.015 |
| 773.6 | 0.017 |
| 773.7 | 0.016 |
| 773.8 | 0.017 |
| 773.9 | 0.02 |
| 774.0 | 0.013 |
| 774.1 | 0.016 |
| 774.2 | 0.013 |
| 774.3 | 0.011 |
| 774.4 | 0.009 |
| 774.5 | 0.01 |
| 774.6 | 0.01 |
| 774.7 | 0.009 |
| 774.8 | 0.009 |
| 774.9 | 0.006 |
| 775.0 | 0.005 |
| 775.1 | 0.008 |
| 775.2 | 0.004 |
| 775.3 | 0.005 |
| 775.4 | 0.008 |
| 775.5 | 0.008 |
| 775.6 | 0.008 |
| 775.7 | 0.005 |
| 775.8 | 0.005 |
| 775.9 | 0.006 |
| 776.0 | 0.005 |
| 776.1 | 0.004 |
| 776.2 | 0 |
| 776.3 | 0.003 |
| 776.4 | 0.005 |
| 776.5 | 0.002 |
| 776.6 | 0.005 |
| 776.7 | 0.002 |
| 776.8 | 0.003 |
| 776.9 | 0.003 |
| 777.0 | 0.001 |
| 777.1 | 0.003 |
| 777.2 | 0.006 |
| 777.3 | 0.002 |
| 777.4 | 0.003 |
| 777.5 | 0 |
| 777.6 | -0.001 |
| 777.7 | -0.001 |
| 777.8 | 0 |
| 777.9 | 0 |
| 778.0 | 0.002 |
| 778.1 | -0.001 |
| 778.2 | 0.001 |
| 778.3 | -0.005 |
| 778.4 | 0 |
| 778.5 | 0.004 |
| 778.6 | 0.005 |
| 778.7 | 0.007 |
| 778.8 | 0.004 |
| 778.9 | 0.007 |
| 779.0 | 0.008 |
| 779.1 | 0.007 |
| 779.2 | 0.011 |
| 779.3 | 0.006 |
| 779.4 | 0.008 |
| 779.5 | 0.004 |
| 779.6 | -0.001 |
| 779.7 | 0.001 |
| 779.8 | 0.001 |
| 779.9 | 0.004 |
| 780.0 | 0.006 |
| 780.1 | 0.006 |
| 780.2 | 0.007 |
| 780.3 | 0.006 |
| 780.4 | 0.006 |
| 780.5 | 0.008 |
| 780.6 | 0.013 |
| 780.7 | 0.011 |
| 780.8 | 0.012 |
| 780.9 | 0.009 |
| 781.0 | 0.007 |
| 781.1 | 0.003 |
| 781.2 | 0.002 |
| 781.3 | -0.002 |
| 781.4 | -0.003 |
| 781.5 | 0 |
| 781.6 | -0.005 |
| 781.7 | -0.004 |
| 781.8 | -0.002 |
| 781.9 | -0.002 |
| 782.0 | -0.003 |
| 782.1 | 0 |
| 782.2 | -0.003 |
| 782.3 | -0.002 |
| 782.4 | 0.003 |
| 782.5 | 0.007 |
| 782.6 | 0.015 |
| 782.7 | 0.017 |
| 782.8 | 0.016 |
| 782.9 | 0.017 |
| 783.0 | 0.018 |
| 783.1 | 0.02 |
| 783.2 | 0.018 |
| 783.3 | 0.025 |
| 783.4 | 0.023 |
| 783.5 | 0.026 |
| 783.6 | 0.026 |
| 783.7 | 0.023 |
| 783.8 | 0.023 |
| 783.9 | 0.026 |
| 784.0 | 0.03 |
| 784.1 | 0.03 |
| 784.2 | 0.031 |
| 784.3 | 0.033 |
| 784.4 | 0.029 |
| 784.5 | 0.031 |
| 784.6 | 0.028 |
| 784.7 | 0.024 |
| 784.8 | 0.023 |
| 784.9 | 0.028 |
| 785.0 | 0.028 |
| 785.1 | 0.027 |
| 785.2 | 0.027 |
| 785.3 | 0.029 |
| 785.4 | 0.036 |
| 785.5 | 0.038 |
| 785.6 | 0.039 |
| 785.7 | 0.041 |
| 785.8 | 0.043 |
| 785.9 | 0.043 |
| 786.0 | 0.042 |
| 786.1 | 0.041 |
| 786.2 | 0.04 |
| 786.3 | 0.044 |
| 786.4 | 0.041 |
| 786.5 | 0.036 |
| 786.6 | 0.04 |
| 786.7 | 0.039 |
| 786.8 | 0.039 |
| 786.9 | 0.039 |
| 787.0 | 0.04 |
| 787.1 | 0.04 |
| 787.2 | 0.039 |
| 787.3 | 0.04 |
| 787.4 | 0.037 |
| 787.5 | 0.037 |
| 787.6 | 0.036 |
| 787.7 | 0.035 |
| 787.8 | 0.036 |
| 787.9 | 0.037 |
| 788.0 | 0.039 |
| 788.1 | 0.039 |
| 788.2 | 0.035 |
| 788.3 | 0.037 |
| 788.4 | 0.037 |
| 788.5 | 0.038 |
| 788.6 | 0.038 |
| 788.7 | 0.039 |
| 788.8 | 0.039 |
| 788.9 | 0.043 |
| 789.0 | 0.045 |
| 789.1 | 0.045 |
| 789.2 | 0.046 |
| 789.3 | 0.059 |
| 789.4 | 0.065 |
| 789.5 | 0.074 |
| 789.6 | 0.082 |
| 789.7 | 0.095 |
| 789.8 | 0.108 |
| 789.9 | 0.119 |
| 790.0 | 0.128 |
| 790.1 | 0.141 |
| 790.2 | 0.155 |
| 790.3 | 0.169 |
| 790.4 | 0.176 |
| 790.5 | 0.187 |
| 790.6 | 0.193 |
| 790.7 | 0.204 |
| 790.8 | 0.211 |
| 790.9 | 0.218 |
| 791.0 | 0.223 |
| 791.1 | 0.229 |
| 791.2 | 0.23 |
| 791.3 | 0.231 |
| 791.4 | 0.234 |
| 791.5 | 0.231 |
| 791.6 | 0.227 |
| 791.7 | 0.221 |
| 791.8 | 0.219 |
| 791.9 | 0.217 |
| 792.0 | 0.21 |
| 792.1 | 0.204 |
| 792.2 | 0.2 |
| 792.3 | 0.197 |
| 792.4 | 0.19 |
| 792.5 | 0.186 |
| 792.6 | 0.182 |
| 792.7 | 0.18 |
| 792.8 | 0.182 |
| 792.9 | 0.18 |
| 793.0 | 0.179 |
| 793.1 | 0.178 |
| 793.2 | 0.184 |
| 793.3 | 0.186 |
| 793.4 | 0.188 |
| 793.5 | 0.189 |
| 793.6 | 0.194 |
| 793.7 | 0.197 |
| 793.8 | 0.195 |
| 793.9 | 0.196 |
| 794.0 | 0.196 |
| 794.1 | 0.196 |
| 794.2 | 0.193 |
| 794.3 | 0.19 |
| 794.4 | 0.19 |
| 794.5 | 0.191 |
| 794.6 | 0.196 |
| 794.7 | 0.196 |
| 794.8 | 0.202 |
| 794.9 | 0.21 |
| 795.0 | 0.218 |
| 795.1 | 0.226 |
| 795.2 | 0.237 |
| 795.3 | 0.248 |
| 795.4 | 0.256 |
| 795.5 | 0.268 |
| 795.6 | 0.276 |
| 795.7 | 0.29 |
| 795.8 | 0.303 |
| 795.9 | 0.31 |
| 796.0 | 0.321 |
| 796.1 | 0.331 |
| 796.2 | 0.335 |
| 796.3 | 0.338 |
| 796.4 | 0.345 |
| 796.5 | 0.348 |
| 796.6 | 0.347 |
| 796.7 | 0.351 |
| 796.8 | 0.349 |
| 796.9 | 0.349 |
| 797.0 | 0.35 |
| 797.1 | 0.348 |
| 797.2 | 0.346 |
| 797.3 | 0.352 |
| 797.4 | 0.356 |
| 797.5 | 0.36 |
| 797.6 | 0.368 |
| 797.7 | 0.373 |
| 797.8 | 0.376 |
| 797.9 | 0.381 |
| 798.0 | 0.386 |
| 798.1 | 0.391 |
| 798.2 | 0.399 |
| 798.3 | 0.4 |
| 798.4 | 0.396 |
| 798.5 | 0.394 |
| 798.6 | 0.392 |
| 798.7 | 0.388 |
| 798.8 | 0.38 |
| 798.9 | 0.371 |
| 799.0 | 0.366 |
| 799.1 | 0.353 |
| 799.2 | 0.343 |
| 799.3 | 0.332 |
| 799.4 | 0.318 |
| 799.5 | 0.308 |
| 799.6 | 0.296 |
| 799.7 | 0.286 |
| 799.8 | 0.27 |
| 799.9 | 0.259 |
| 800.0 | 0.248 |
| 800.1 | 0.238 |
| 800.2 | 0.23 |
| 800.3 | 0.221 |
| 800.4 | 0.213 |
| 800.5 | 0.208 |
| 800.6 | 0.199 |
| 800.7 | 0.192 |
| 800.8 | 0.186 |
| 800.9 | 0.184 |
| 801.0 | 0.184 |
| 801.1 | 0.185 |
| 801.2 | 0.181 |
| 801.3 | 0.18 |
| 801.4 | 0.181 |
| 801.5 | 0.177 |
| 801.6 | 0.175 |
| 801.7 | 0.179 |
| 801.8 | 0.185 |
| 801.9 | 0.191 |
| 802.0 | 0.196 |
| 802.1 | 0.201 |
| 802.2 | 0.211 |
| 802.3 | 0.22 |
| 802.4 | 0.232 |
| 802.5 | 0.244 |
| 802.6 | 0.261 |
| 802.7 | 0.279 |
| 802.8 | 0.292 |
| 802.9 | 0.309 |
| 803.0 | 0.329 |
| 803.1 | 0.343 |
| 803.2 | 0.363 |
| 803.3 | 0.377 |
| 803.4 | 0.393 |
| 803.5 | 0.402 |
| 803.6 | 0.415 |
| 803.7 | 0.421 |
| 803.8 | 0.427 |
| 803.9 | 0.435 |
| 804.0 | 0.432 |
| 804.1 | 0.423 |
| 804.2 | 0.422 |
| 804.3 | 0.413 |
| 804.4 | 0.402 |
| 804.5 | 0.385 |
| 804.6 | 0.371 |
| 804.7 | 0.349 |
| 804.8 | 0.329 |
| 804.9 | 0.308 |
| 805.0 | 0.286 |
| 805.1 | 0.263 |
| 805.2 | 0.245 |
| 805.3 | 0.219 |
| 805.4 | 0.198 |
| 805.5 | 0.181 |
| 805.6 | 0.163 |
| 805.7 | 0.15 |
| 805.8 | 0.139 |
| 805.9 | 0.132 |
| 806.0 | 0.121 |
| 806.1 | 0.112 |
| 806.2 | 0.114 |
| 806.3 | 0.103 |
| 806.4 | 0.103 |
| 806.5 | 0.098 |
| 806.6 | 0.094 |
| 806.7 | 0.093 |
| 806.8 | 0.091 |
| 806.9 | 0.09 |
| 807.0 | 0.081 |
| 807.1 | 0.086 |
| 807.2 | 0.092 |
| 807.3 | 0.085 |
| 807.4 | 0.087 |
| 807.5 | 0.09 |
| 807.6 | 0.086 |
| 807.7 | 0.089 |
| 807.8 | 0.086 |
| 807.9 | 0.084 |
| 808.0 | 0.084 |
| 808.1 | 0.089 |
| 808.2 | 0.089 |
| 808.3 | 0.088 |
| 808.4 | 0.088 |
| 808.5 | 0.086 |
| 808.6 | 0.083 |
| 808.7 | 0.087 |
| 808.8 | 0.087 |
| 808.9 | 0.094 |
| 809.0 | 0.096 |
| 809.1 | 0.098 |
| 809.2 | 0.101 |
| 809.3 | 0.099 |
| 809.4 | 0.103 |
| 809.5 | 0.106 |
| 809.6 | 0.108 |
| 809.7 | 0.115 |
| 809.8 | 0.119 |
| 809.9 | 0.117 |
| 810.0 | 0.113 |
| 810.1 | 0.115 |
| 810.2 | 0.112 |
| 810.3 | 0.109 |
| 810.4 | 0.106 |
| 810.5 | 0.104 |
| 810.6 | 0.102 |
| 810.7 | 0.102 |
| 810.8 | 0.094 |
| 810.9 | 0.091 |
| 811.0 | 0.092 |
| 811.1 | 0.091 |
| 811.2 | 0.087 |
| 811.3 | 0.085 |
| 811.4 | 0.086 |
| 811.5 | 0.085 |
| 811.6 | 0.082 |
| 811.7 | 0.082 |
| 811.8 | 0.083 |
| 811.9 | 0.083 |
| 812.0 | 0.08 |
| 812.1 | 0.082 |
| 812.2 | 0.08 |
| 812.3 | 0.085 |
| 812.4 | 0.088 |
| 812.5 | 0.089 |
| 812.6 | 0.092 |
| 812.7 | 0.09 |
| 812.8 | 0.092 |
| 812.9 | 0.095 |
| 813.0 | 0.093 |
| 813.1 | 0.096 |
| 813.2 | 0.095 |
| 813.3 | 0.1 |
| 813.4 | 0.096 |
| 813.5 | 0.097 |
| 813.6 | 0.099 |
| 813.7 | 0.098 |
| 813.8 | 0.101 |
| 813.9 | 0.102 |
| 814.0 | 0.101 |
| 814.1 | 0.104 |
| 814.2 | 0.106 |
| 814.3 | 0.108 |
| 814.4 | 0.105 |
| 814.5 | 0.106 |
| 814.6 | 0.101 |
| 814.7 | 0.105 |
| 814.8 | 0.109 |
| 814.9 | 0.113 |
| 815.0 | 0.118 |
| 815.1 | 0.128 |
| 815.2 | 0.132 |
| 815.3 | 0.136 |
| 815.4 | 0.144 |
| 815.5 | 0.153 |
| 815.6 | 0.163 |
| 815.7 | 0.176 |
| 815.8 | 0.177 |
| 815.9 | 0.18 |
| 816.0 | 0.183 |
| 816.1 | 0.183 |
| 816.2 | 0.176 |
| 816.3 | 0.177 |
| 816.4 | 0.175 |
| 816.5 | 0.169 |
| 816.6 | 0.163 |
| 816.7 | 0.153 |
| 816.8 | 0.146 |
| 816.9 | 0.143 |
| 817.0 | 0.132 |
| 817.1 | 0.122 |
| 817.2 | 0.115 |
| 817.3 | 0.107 |
| 817.4 | 0.104 |
| 817.5 | 0.098 |
| 817.6 | 0.092 |
| 817.7 | 0.087 |
| 817.8 | 0.088 |
| 817.9 | 0.085 |
| 818.0 | 0.079 |
| 818.1 | 0.083 |
| 818.2 | 0.087 |
| 818.3 | 0.084 |
| 818.4 | 0.083 |
| 818.5 | 0.08 |
| 818.6 | 0.082 |
| 818.7 | 0.083 |
| 818.8 | 0.085 |
| 818.9 | 0.086 |
| 819.0 | 0.086 |
| 819.1 | 0.091 |
| 819.2 | 0.087 |
| 819.3 | 0.08 |
| 819.4 | 0.084 |
| 819.5 | 0.083 |
| 819.6 | 0.081 |
| 819.7 | 0.08 |
| 819.8 | 0.078 |
| 819.9 | 0.073 |
| 820.0 | 0.069 |
| 820.1 | 0.063 |
| 820.2 | 0.057 |
| 820.3 | 0.056 |
| 820.4 | 0.057 |
| 820.5 | 0.052 |
| 820.6 | 0.055 |
| 820.7 | 0.055 |
| 820.8 | 0.053 |
| 820.9 | 0.056 |
| 821.0 | 0.06 |
| 821.1 | 0.058 |
| 821.2 | 0.062 |
| 821.3 | 0.064 |
| 821.4 | 0.067 |
| 821.5 | 0.068 |
| 821.6 | 0.075 |
| 821.7 | 0.073 |
| 821.8 | 0.074 |
| 821.9 | 0.072 |
| 822.0 | 0.071 |
| 822.1 | 0.069 |
| 822.2 | 0.072 |
| 822.3 | 0.072 |
| 822.4 | 0.069 |
| 822.5 | 0.07 |
| 822.6 | 0.066 |
| 822.7 | 0.058 |
| 822.8 | 0.06 |
| 822.9 | 0.059 |
| 823.0 | 0.063 |
| 823.1 | 0.065 |
| 823.2 | 0.063 |
| 823.3 | 0.06 |
| 823.4 | 0.061 |
| 823.5 | 0.064 |
| 823.6 | 0.061 |
| 823.7 | 0.064 |
| 823.8 | 0.068 |
| 823.9 | 0.069 |
| 824.0 | 0.065 |
| 824.1 | 0.061 |
| 824.2 | 0.06 |
| 824.3 | 0.065 |
| 824.4 | 0.068 |
| 824.5 | 0.072 |
| 824.6 | 0.074 |
| 824.7 | 0.074 |
| 824.8 | 0.075 |
| 824.9 | 0.076 |
| 825.0 | 0.076 |
| 825.1 | 0.08 |
| 825.2 | 0.085 |
| 825.3 | 0.084 |
| 825.4 | 0.081 |
| 825.5 | 0.081 |
| 825.6 | 0.08 |
| 825.7 | 0.078 |
| 825.8 | 0.076 |
| 825.9 | 0.075 |
| 826.0 | 0.074 |
| 826.1 | 0.071 |
| 826.2 | 0.067 |
| 826.3 | 0.065 |
| 826.4 | 0.067 |
| 826.5 | 0.065 |
| 826.6 | 0.066 |
| 826.7 | 0.063 |
| 826.8 | 0.06 |
| 826.9 | 0.066 |
| 827.0 | 0.069 |
| 827.1 | 0.066 |
| 827.2 | 0.064 |
| 827.3 | 0.064 |
| 827.4 | 0.061 |
| 827.5 | 0.061 |
| 827.6 | 0.063 |
| 827.7 | 0.061 |
| 827.8 | 0.055 |
| 827.9 | 0.054 |
| 828.0 | 0.05 |
| 828.1 | 0.041 |
| 828.2 | 0.041 |
| 828.3 | 0.041 |
| 828.4 | 0.043 |
| 828.5 | 0.042 |
| 828.6 | 0.037 |
| 828.7 | 0.035 |
| 828.8 | 0.034 |
| 828.9 | 0.035 |
| 829.0 | 0.04 |
| 829.1 | 0.04 |
| 829.2 | 0.047 |
| 829.3 | 0.051 |
| 829.4 | 0.057 |
| 829.5 | 0.055 |
| 829.6 | 0.058 |
| 829.7 | 0.057 |
| 829.8 | 0.058 |
| 829.9 | 0.06 |
| 830.0 | 0.061 |
| 830.1 | 0.054 |
| 830.2 | 0.054 |
| 830.3 | 0.053 |
| 830.4 | 0.055 |
| 830.5 | 0.048 |
| 830.6 | 0.05 |
| 830.7 | 0.052 |
| 830.8 | 0.057 |
| 830.9 | 0.055 |
| 831.0 | 0.051 |
| 831.1 | 0.053 |
| 831.2 | 0.06 |
| 831.3 | 0.059 |
| 831.4 | 0.06 |
| 831.5 | 0.06 |
| 831.6 | 0.063 |
| 831.7 | 0.063 |
| 831.8 | 0.062 |
| 831.9 | 0.065 |
| 832.0 | 0.068 |
| 832.1 | 0.067 |
| 832.2 | 0.067 |
| 832.3 | 0.065 |
| 832.4 | 0.066 |
| 832.5 | 0.066 |
| 832.6 | 0.062 |
| 832.7 | 0.061 |
| 832.8 | 0.059 |
| 832.9 | 0.061 |
| 833.0 | 0.057 |
| 833.1 | 0.057 |
| 833.2 | 0.056 |
| 833.3 | 0.052 |
| 833.4 | 0.052 |
| 833.5 | 0.048 |
| 833.6 | 0.048 |
| 833.7 | 0.048 |
| 833.8 | 0.049 |
| 833.9 | 0.05 |
| 834.0 | 0.048 |
| 834.1 | 0.043 |
| 834.2 | 0.042 |
| 834.3 | 0.042 |
| 834.4 | 0.044 |
| 834.5 | 0.044 |
| 834.6 | 0.049 |
| 834.7 | 0.044 |
| 834.8 | 0.045 |
| 834.9 | 0.041 |
| 835.0 | 0.035 |
| 835.1 | 0.034 |
| 835.2 | 0.034 |
| 835.3 | 0.029 |
| 835.4 | 0.03 |
| 835.5 | 0.032 |
| 835.6 | 0.029 |
| 835.7 | 0.025 |
| 835.8 | 0.032 |
| 835.9 | 0.031 |
| 836.0 | 0.029 |
| 836.1 | 0.027 |
| 836.2 | 0.029 |
| 836.3 | 0.031 |
| 836.4 | 0.032 |
| 836.5 | 0.031 |
| 836.6 | 0.028 |
| 836.7 | 0.027 |
| 836.8 | 0.028 |
| 836.9 | 0.023 |
| 837.0 | 0.022 |
| 837.1 | 0.026 |
| 837.2 | 0.028 |
| 837.3 | 0.023 |
| 837.4 | 0.023 |
| 837.5 | 0.021 |
| 837.6 | 0.027 |
| 837.7 | 0.028 |
| 837.8 | 0.026 |
| 837.9 | 0.032 |
| 838.0 | 0.034 |
| 838.1 | 0.036 |
| 838.2 | 0.034 |
| 838.3 | 0.038 |
| 838.4 | 0.041 |
| 838.5 | 0.039 |
| 838.6 | 0.041 |
| 838.7 | 0.04 |
| 838.8 | 0.037 |
| 838.9 | 0.043 |
| 839.0 | 0.042 |
| 839.1 | 0.04 |
| 839.2 | 0.039 |
| 839.3 | 0.041 |
| 839.4 | 0.043 |
| 839.5 | 0.045 |
| 839.6 | 0.046 |
| 839.7 | 0.046 |
| 839.8 | 0.041 |
| 839.9 | 0.046 |
| 840.0 | 0.04 |
| 840.1 | 0.041 |
| 840.2 | 0.039 |
| 840.3 | 0.041 |
| 840.4 | 0.043 |
| 840.5 | 0.042 |
| 840.6 | 0.04 |
| 840.7 | 0.039 |
| 840.8 | 0.042 |
| 840.9 | 0.044 |
| 841.0 | 0.04 |
| 841.1 | 0.043 |
| 841.2 | 0.037 |
| 841.3 | 0.039 |
| 841.4 | 0.041 |
| 841.5 | 0.04 |
| 841.6 | 0.039 |
| 841.7 | 0.041 |
| 841.8 | 0.039 |
| 841.9 | 0.039 |
| 842.0 | 0.037 |
| 842.1 | 0.037 |
| 842.2 | 0.039 |
| 842.3 | 0.038 |
| 842.4 | 0.037 |
| 842.5 | 0.035 |
| 842.6 | 0.032 |
| 842.7 | 0.033 |
| 842.8 | 0.032 |
| 842.9 | 0.036 |
| 843.0 | 0.033 |
| 843.1 | 0.038 |
| 843.2 | 0.039 |
| 843.3 | 0.037 |
| 843.4 | 0.041 |
| 843.5 | 0.043 |
| 843.6 | 0.042 |
| 843.7 | 0.045 |
| 843.8 | 0.043 |
| 843.9 | 0.043 |
| 844.0 | 0.038 |
| 844.1 | 0.04 |
| 844.2 | 0.04 |
| 844.3 | 0.034 |
| 844.4 | 0.037 |
| 844.5 | 0.028 |
| 844.6 | 0.026 |
| 844.7 | 0.027 |
| 844.8 | 0.025 |
| 844.9 | 0.03 |
| 845.0 | 0.03 |
| 845.1 | 0.035 |
| 845.2 | 0.035 |
| 845.3 | 0.03 |
| 845.4 | 0.035 |
| 845.5 | 0.036 |
| 845.6 | 0.041 |
| 845.7 | 0.041 |
| 845.8 | 0.04 |
| 845.9 | 0.041 |
| 846.0 | 0.04 |
| 846.1 | 0.039 |
| 846.2 | 0.036 |
| 846.3 | 0.036 |
| 846.4 | 0.035 |
| 846.5 | 0.033 |
| 846.6 | 0.031 |
| 846.7 | 0.031 |
| 846.8 | 0.034 |
| 846.9 | 0.036 |
| 847.0 | 0.033 |
| 847.1 | 0.031 |
| 847.2 | 0.026 |
| 847.3 | 0.03 |
| 847.4 | 0.033 |
| 847.5 | 0.039 |
| 847.6 | 0.045 |
| 847.7 | 0.045 |
| 847.8 | 0.05 |
| 847.9 | 0.045 |
| 848.0 | 0.042 |
| 848.1 | 0.045 |
| 848.2 | 0.045 |
| 848.3 | 0.053 |
| 848.4 | 0.047 |
| 848.5 | 0.044 |
| 848.6 | 0.041 |
| 848.7 | 0.035 |
| 848.8 | 0.035 |
| 848.9 | 0.032 |
| 849.0 | 0.037 |
| 849.1 | 0.032 |
| 849.2 | 0.029 |
| 849.3 | 0.027 |
| 849.4 | 0.026 |
| 849.5 | 0.028 |
| 849.6 | 0.028 |
| 849.7 | 0.027 |
| 849.8 | 0.027 |
| 849.9 | 0.027 |
| 850.0 | 0.025 |
| 850.1 | -0.027 |
| 850.2 | -0.027 |
| 850.3 | -0.027 |
| 850.4 | -0.027 |
| 850.5 | -0.027 |
| 850.6 | -0.028 |
| 850.7 | -0.028 |
| 850.8 | -0.028 |
| 850.9 | -0.028 |
| 851.0 | -0.028 |
| 851.1 | -0.028 |
| 851.2 | -0.028 |
| 851.3 | -0.028 |
| 851.4 | -0.028 |
| 851.5 | -0.028 |
| 851.6 | -0.031 |
| 851.7 | -0.031 |
| 851.8 | -0.031 |
| 851.9 | -0.032 |
| 852.0 | -0.032 |
| 852.1 | -0.033 |
| 852.2 | -0.033 |
| 852.3 | -0.034 |
| 852.4 | -0.034 |
| 852.5 | -0.035 |
| 852.6 | -0.027 |
| 852.7 | -0.026 |
| 852.8 | -0.025 |
| 852.9 | -0.024 |
| 853.0 | -0.023 |
| 853.1 | -0.022 |
| 853.2 | -0.022 |
| 853.3 | -0.021 |
| 853.4 | -0.02 |
| 853.5 | -0.019 |
| 853.6 | -0.022 |
| 853.7 | -0.021 |
| 853.8 | -0.021 |
| 853.9 | -0.021 |
| 854.0 | -0.021 |
| 854.1 | -0.02 |
| 854.2 | -0.02 |
| 854.3 | -0.02 |
| 854.4 | -0.019 |
| 854.5 | -0.019 |
| 854.6 | -0.022 |
| 854.7 | -0.022 |
| 854.8 | -0.022 |
| 854.9 | -0.022 |
| 855.0 | -0.022 |
| 855.1 | -0.023 |
| 855.2 | -0.023 |
| 855.3 | -0.023 |
| 855.4 | -0.023 |
| 855.5 | -0.023 |
| 855.6 | -0.024 |
| 855.7 | -0.025 |
| 855.8 | -0.025 |
| 855.9 | -0.025 |
| 856.0 | -0.026 |
| 856.1 | -0.026 |
| 856.2 | -0.026 |
| 856.3 | -0.027 |
| 856.4 | -0.027 |
| 856.5 | -0.027 |
| 856.6 | -0.025 |
| 856.7 | -0.025 |
| 856.8 | -0.025 |
| 856.9 | -0.025 |
| 857.0 | -0.025 |
| 857.1 | -0.025 |
| 857.2 | -0.025 |
| 857.3 | -0.025 |
| 857.4 | -0.024 |
| 857.5 | -0.024 |
| 857.6 | -0.025 |
| 857.7 | -0.025 |
| 857.8 | -0.025 |
| 857.9 | -0.025 |
| 858.0 | -0.025 |
| 858.1 | -0.025 |
| 858.2 | -0.025 |
| 858.3 | -0.025 |
| 858.4 | -0.025 |
| 858.5 | -0.025 |
| 858.6 | -0.024 |
| 858.7 | -0.024 |
| 858.8 | -0.024 |
| 858.9 | -0.024 |
| 859.0 | -0.024 |
| 859.1 | -0.024 |
| 859.2 | -0.024 |
| 859.3 | -0.024 |
| 859.4 | -0.024 |
| 859.5 | -0.023 |
| 859.6 | -0.02 |
| 859.7 | -0.019 |
| 859.8 | -0.018 |
| 859.9 | -0.018 |
| 860.0 | -0.017 |
| 860.1 | -0.016 |
| 860.2 | -0.016 |
| 860.3 | -0.015 |
| 860.4 | -0.014 |
| 860.5 | -0.013 |
| 860.6 | -0.013 |
| 860.7 | -0.013 |
| 860.8 | -0.012 |
| 860.9 | -0.012 |
| 861.0 | -0.011 |
| 861.1 | -0.01 |
| 861.2 | -0.01 |
| 861.3 | -0.009 |
| 861.4 | -0.009 |
| 861.5 | -0.008 |
| 861.6 | -0.013 |
| 861.7 | -0.013 |
| 861.8 | -0.014 |
| 861.9 | -0.014 |
| 862.0 | -0.014 |
| 862.1 | -0.014 |
| 862.2 | -0.015 |
| 862.3 | -0.015 |
| 862.4 | -0.015 |
| 862.5 | -0.016 |
| 862.6 | -0.014 |
| 862.7 | -0.014 |
| 862.8 | -0.014 |
| 862.9 | -0.014 |
| 863.0 | -0.013 |
| 863.1 | -0.013 |
| 863.2 | -0.013 |
| 863.3 | -0.013 |
| 863.4 | -0.013 |
| 863.5 | -0.013 |
| 863.6 | -0.008 |
| 863.7 | -0.008 |
| 863.8 | -0.007 |
| 863.9 | -0.006 |
| 864.0 | -0.005 |
| 864.1 | -0.004 |
| 864.2 | -0.003 |
| 864.3 | -0.002 |
| 864.4 | -0.002 |
| 864.5 | -0.001 |
| 864.6 | -0.012 |
| 864.7 | -0.013 |
| 864.8 | -0.014 |
| 864.9 | -0.015 |
| 865.0 | -0.016 |
| 865.1 | -0.017 |
| 865.2 | -0.018 |
| 865.3 | -0.019 |
| 865.4 | -0.021 |
| 865.5 | -0.022 |
| 865.6 | -0.013 |
| 865.7 | -0.012 |
| 865.8 | -0.012 |
| 865.9 | -0.011 |
| 866.0 | -0.011 |
| 866.1 | -0.01 |
| 866.2 | -0.01 |
| 866.3 | -0.009 |
| 866.4 | -0.009 |
| 866.5 | -0.008 |
| 866.6 | -0.008 |
| 866.7 | -0.007 |
| 866.8 | -0.007 |
| 866.9 | -0.006 |
| 867.0 | -0.006 |
| 867.1 | -0.005 |
| 867.2 | -0.005 |
| 867.3 | -0.004 |
| 867.4 | -0.003 |
| 867.5 | -0.003 |
| 867.6 | -0.007 |
| 867.7 | -0.007 |
| 867.8 | -0.007 |
| 867.9 | -0.007 |
| 868.0 | -0.007 |
| 868.1 | -0.008 |
| 868.2 | -0.008 |
| 868.3 | -0.008 |
| 868.4 | -0.008 |
| 868.5 | -0.008 |
| 868.6 | -0.009 |
| 868.7 | -0.01 |
| 868.8 | -0.01 |
| 868.9 | -0.011 |
| 869.0 | -0.011 |
| 869.1 | -0.011 |
| 869.2 | -0.012 |
| 869.3 | -0.012 |
| 869.4 | -0.012 |
| 869.5 | -0.013 |
| 869.6 | -0.013 |
| 869.7 | -0.014 |
| 869.8 | -0.014 |
| 869.9 | -0.015 |
| 870.0 | -0.015 |
| 870.1 | -0.016 |
| 870.2 | -0.016 |
| 870.3 | -0.016 |
| 870.4 | -0.017 |
| 870.5 | -0.017 |
| 870.6 | -0.014 |
| 870.7 | -0.014 |
| 870.8 | -0.014 |
| 870.9 | -0.014 |
| 871.0 | -0.013 |
| 871.1 | -0.013 |
| 871.2 | -0.013 |
| 871.3 | -0.013 |
| 871.4 | -0.013 |
| 871.5 | -0.013 |
| 871.6 | -0.009 |
| 871.7 | -0.009 |
| 871.8 | -0.008 |
| 871.9 | -0.007 |
| 872.0 | -0.007 |
| 872.1 | -0.006 |
| 872.2 | -0.005 |
| 872.3 | -0.005 |
| 872.4 | -0.004 |
| 872.5 | -0.004 |
| 872.6 | -0.007 |
| 872.7 | -0.007 |
| 872.8 | -0.007 |
| 872.9 | -0.007 |
| 873.0 | -0.007 |
| 873.1 | -0.007 |
| 873.2 | -0.007 |
| 873.3 | -0.007 |
| 873.4 | -0.007 |
| 873.5 | -0.007 |
| 873.6 | -0.005 |
| 873.7 | -0.005 |
| 873.8 | -0.004 |
| 873.9 | -0.004 |
| 874.0 | -0.003 |
| 874.1 | -0.003 |
| 874.2 | -0.003 |
| 874.3 | -0.002 |
| 874.4 | -0.002 |
| 874.5 | -0.001 |
| 874.6 | -0.004 |
| 874.7 | -0.004 |
| 874.8 | -0.005 |
| 874.9 | -0.005 |
| 875.0 | -0.005 |
| 875.1 | -0.005 |
| 875.2 | -0.005 |
| 875.3 | -0.005 |
| 875.4 | -0.005 |
| 875.5 | -0.006 |
| 875.6 | -0.004 |
| 875.7 | -0.004 |
| 875.8 | -0.004 |
| 875.9 | -0.004 |
| 876.0 | -0.004 |
| 876.1 | -0.004 |
| 876.2 | -0.004 |
| 876.3 | -0.004 |
| 876.4 | -0.004 |
| 876.5 | -0.004 |
| 876.6 | -0.008 |
| 876.7 | -0.008 |
| 876.8 | -0.009 |
| 876.9 | -0.01 |
| 877.0 | -0.01 |
| 877.1 | -0.011 |
| 877.2 | -0.011 |
| 877.3 | -0.012 |
| 877.4 | -0.013 |
| 877.5 | -0.013 |
| 877.6 | -0.007 |
| 877.7 | -0.006 |
| 877.8 | -0.006 |
| 877.9 | -0.005 |
| 878.0 | -0.005 |
| 878.1 | -0.004 |
| 878.2 | -0.003 |
| 878.3 | -0.003 |
| 878.4 | -0.002 |
| 878.5 | -0.002 |
| 878.6 | -0.005 |
| 878.7 | -0.006 |
| 878.8 | -0.006 |
| 878.9 | -0.006 |
| 879.0 | -0.006 |
| 879.1 | -0.006 |
| 879.2 | -0.006 |
| 879.3 | -0.007 |
| 879.4 | -0.007 |
| 879.5 | -0.007 |
| 879.6 | -0.009 |
| 879.7 | -0.01 |
| 879.8 | -0.01 |
| 879.9 | -0.011 |
| 880.0 | -0.011 |
| 880.1 | -0.012 |
| 880.2 | -0.012 |
| 880.3 | -0.012 |
| 880.4 | -0.013 |
| 880.5 | -0.013 |
| 880.6 | -0.006 |
| 880.7 | -0.005 |
| 880.8 | -0.004 |
| 880.9 | -0.003 |
| 881.0 | -0.002 |
| 881.1 | -0.001 |
| 881.2 | 0 |
| 881.3 | 0 |
| 881.4 | 0.001 |
| 881.5 | 0.002 |
| 881.6 | -0.005 |
| 881.7 | -0.006 |
| 881.8 | -0.007 |
| 881.9 | -0.007 |
| 882.0 | -0.008 |
| 882.1 | -0.008 |
| 882.2 | -0.009 |
| 882.3 | -0.009 |
| 882.4 | -0.01 |
| 882.5 | -0.01 |
| 882.6 | -0.007 |
| 882.7 | -0.006 |
| 882.8 | -0.006 |
| 882.9 | -0.006 |
| 883.0 | -0.006 |
| 883.1 | -0.006 |
| 883.2 | -0.005 |
| 883.3 | -0.005 |
| 883.4 | -0.005 |
| 883.5 | -0.005 |
| 883.6 | -0.005 |
| 883.7 | -0.004 |
| 883.8 | -0.004 |
| 883.9 | -0.004 |
| 884.0 | -0.004 |
| 884.1 | -0.003 |
| 884.2 | -0.003 |
| 884.3 | -0.003 |
| 884.4 | -0.003 |
| 884.5 | -0.003 |
| 884.6 | 0 |
| 884.7 | 0.001 |
| 884.8 | 0.002 |
| 884.9 | 0.002 |
| 885.0 | 0.003 |
| 885.1 | 0.003 |
| 885.2 | 0.004 |
| 885.3 | 0.005 |
| 885.4 | 0.005 |
| 885.5 | 0.006 |
| 885.6 | 0.003 |
| 885.7 | 0.003 |
| 885.8 | 0.003 |
| 885.9 | 0.004 |
| 886.0 | 0.004 |
| 886.1 | 0.004 |
| 886.2 | 0.004 |
| 886.3 | 0.004 |
| 886.4 | 0.004 |
| 886.5 | 0.004 |
| 886.6 | -0.001 |
| 886.7 | -0.001 |
| 886.8 | -0.002 |
| 886.9 | -0.003 |
| 887.0 | -0.003 |
| 887.1 | -0.004 |
| 887.2 | -0.005 |
| 887.3 | -0.006 |
| 887.4 | -0.006 |
| 887.5 | -0.007 |
| 887.6 | -0.004 |
| 887.7 | -0.004 |
| 887.8 | -0.004 |
| 887.9 | -0.004 |
| 888.0 | -0.004 |
| 888.1 | -0.004 |
| 888.2 | -0.004 |
| 888.3 | -0.004 |
| 888.4 | -0.004 |
| 888.5 | -0.004 |
| 888.6 | 0.003 |
| 888.7 | 0.004 |
| 888.8 | 0.005 |
| 888.9 | 0.007 |
| 889.0 | 0.008 |
| 889.1 | 0.009 |
| 889.2 | 0.01 |
| 889.3 | 0.011 |
| 889.4 | 0.013 |
| 889.5 | 0.014 |
| 889.6 | 0.005 |
| 889.7 | 0.004 |
| 889.8 | 0.004 |
| 889.9 | 0.003 |
| 890.0 | 0.003 |
| 890.1 | 0.002 |
| 890.2 | 0.002 |
| 890.3 | 0.001 |
| 890.4 | 0.001 |
| 890.5 | 0.001 |
| 890.6 | -0.001 |
| 890.7 | -0.001 |
| 890.8 | -0.002 |
| 890.9 | -0.003 |
| 891.0 | -0.003 |
| 891.1 | -0.004 |
| 891.2 | -0.005 |
| 891.3 | -0.005 |
| 891.4 | -0.006 |
| 891.5 | -0.007 |
| 891.6 | -0.003 |
| 891.7 | -0.003 |
| 891.8 | -0.003 |
| 891.9 | -0.003 |
| 892.0 | -0.003 |
| 892.1 | -0.003 |
| 892.2 | -0.003 |
| 892.3 | -0.003 |
| 892.4 | -0.003 |
| 892.5 | -0.003 |
| 892.6 | -0.001 |
| 892.7 | -0.001 |
| 892.8 | 0 |
| 892.9 | 0 |
| 893.0 | 0.001 |
| 893.1 | 0.001 |
| 893.2 | 0.001 |
| 893.3 | 0.002 |
| 893.4 | 0.002 |
| 893.5 | 0.003 |
| 893.6 | 0.004 |
| 893.7 | 0.004 |
| 893.8 | 0.005 |
| 893.9 | 0.006 |
| 894.0 | 0.006 |
| 894.1 | 0.007 |
| 894.2 | 0.007 |
| 894.3 | 0.008 |
| 894.4 | 0.008 |
| 894.5 | 0.009 |
| 894.6 | 0.004 |
| 894.7 | 0.003 |
| 894.8 | 0.003 |
| 894.9 | 0.003 |
| 895.0 | 0.002 |
| 895.1 | 0.002 |
| 895.2 | 0.001 |
| 895.3 | 0.001 |
| 895.4 | 0.001 |
| 895.5 | 0 |
| 895.6 | 0.002 |
| 895.7 | 0.002 |
| 895.8 | 0.002 |
| 895.9 | 0.002 |
| 896.0 | 0.003 |
| 896.1 | 0.003 |
| 896.2 | 0.003 |
| 896.3 | 0.003 |
| 896.4 | 0.003 |
| 896.5 | 0.003 |
| 896.6 | 0.001 |
| 896.7 | 0 |
| 896.8 | 0 |
| 896.9 | 0 |
| 897.0 | 0 |
| 897.1 | -0.001 |
| 897.2 | -0.001 |
| 897.3 | -0.001 |
| 897.4 | -0.002 |
| 897.5 | -0.002 |
| 897.6 | -0.003 |
| 897.7 | -0.004 |
| 897.8 | -0.004 |
| 897.9 | -0.005 |
| 898.0 | -0.005 |
| 898.1 | -0.005 |
| 898.2 | -0.006 |
| 898.3 | -0.006 |
| 898.4 | -0.007 |
| 898.5 | -0.007 |
| 898.6 | 0.001 |
| 898.7 | 0.002 |
| 898.8 | 0.003 |
| 898.9 | 0.004 |
| 899.0 | 0.005 |
| 899.1 | 0.006 |
| 899.2 | 0.007 |
| 899.3 | 0.008 |
| 899.4 | 0.009 |
| 899.5 | 0.01 |
| 899.6 | 0.004 |
| 899.7 | 0.004 |
| 899.8 | 0.003 |
| 899.9 | 0.003 |
| 900.0 | 0.003 |
| 900.1 | 0.003 |
| 900.2 | 0.003 |
| 900.3 | 0.003 |
| 900.4 | 0.002 |
| 900.5 | 0.002 |
| 900.6 | 0.003 |
| 900.7 | 0.003 |
| 900.8 | 0.003 |
| 900.9 | 0.003 |
| 901.0 | 0.003 |
| 901.1 | 0.003 |
| 901.2 | 0.004 |
| 901.3 | 0.004 |
| 901.4 | 0.004 |
| 901.5 | 0.004 |
| 901.6 | 0 |
| 901.7 | 0 |
| 901.8 | -0.001 |
| 901.9 | -0.001 |
| 902.0 | -0.002 |
| 902.1 | -0.002 |
| 902.2 | -0.003 |
| 902.3 | -0.003 |
| 902.4 | -0.004 |
| 902.5 | -0.004 |
| 902.6 | 0.001 |
| 902.7 | 0.001 |
| 902.8 | 0.001 |
| 902.9 | 0.002 |
| 903.0 | 0.002 |
| 903.1 | 0.002 |
| 903.2 | 0.003 |
| 903.3 | 0.003 |
| 903.4 | 0.003 |
| 903.5 | 0.004 |
| 903.6 | 0.002 |
| 903.7 | 0.002 |
| 903.8 | 0.002 |
| 903.9 | 0.002 |
| 904.0 | 0.002 |
| 904.1 | 0.002 |
| 904.2 | 0.002 |
| 904.3 | 0.002 |
| 904.4 | 0.002 |
| 904.5 | 0.002 |
| 904.6 | 0.002 |
| 904.7 | 0.002 |
| 904.8 | 0.001 |
| 904.9 | 0.001 |
| 905.0 | 0.001 |
| 905.1 | 0.001 |
| 905.2 | 0.001 |
| 905.3 | 0.001 |
| 905.4 | 0.001 |
| 905.5 | 0.001 |
| 905.6 | 0.004 |
| 905.7 | 0.005 |
| 905.8 | 0.005 |
| 905.9 | 0.006 |
| 906.0 | 0.006 |
| 906.1 | 0.007 |
| 906.2 | 0.007 |
| 906.3 | 0.007 |
| 906.4 | 0.008 |
| 906.5 | 0.008 |
| 906.6 | 0.007 |
| 906.7 | 0.007 |
| 906.8 | 0.007 |
| 906.9 | 0.007 |
| 907.0 | 0.007 |
| 907.1 | 0.007 |
| 907.2 | 0.007 |
| 907.3 | 0.008 |
| 907.4 | 0.008 |
| 907.5 | 0.008 |
| 907.6 | 0.005 |
| 907.7 | 0.005 |
| 907.8 | 0.005 |
| 907.9 | 0.004 |
| 908.0 | 0.004 |
| 908.1 | 0.004 |
| 908.2 | 0.003 |
| 908.3 | 0.003 |
| 908.4 | 0.003 |
| 908.5 | 0.002 |
| 908.6 | 0.005 |
| 908.7 | 0.005 |
| 908.8 | 0.005 |
| 908.9 | 0.006 |
| 909.0 | 0.006 |
| 909.1 | 0.006 |
| 909.2 | 0.006 |
| 909.3 | 0.006 |
| 909.4 | 0.007 |
| 909.5 | 0.007 |
| 909.6 | 0.006 |
| 909.7 | 0.006 |
| 909.8 | 0.006 |
| 909.9 | 0.006 |
| 910.0 | 0.006 |
| 910.1 | 0.006 |
| 910.2 | 0.006 |
| 910.3 | 0.006 |
| 910.4 | 0.006 |
| 910.5 | 0.006 |
| 910.6 | 0.006 |
| 910.7 | 0.006 |
| 910.8 | 0.006 |
| 910.9 | 0.006 |
| 911.0 | 0.006 |
| 911.1 | 0.005 |
| 911.2 | 0.005 |
| 911.3 | 0.005 |
| 911.4 | 0.005 |
| 911.5 | 0.005 |
| 911.6 | 0.007 |
| 911.7 | 0.007 |
| 911.8 | 0.007 |
| 911.9 | 0.008 |
| 912.0 | 0.008 |
| 912.1 | 0.008 |
| 912.2 | 0.008 |
| 912.3 | 0.009 |
| 912.4 | 0.009 |
| 912.5 | 0.009 |
| 912.6 | 0.007 |
| 912.7 | 0.006 |
| 912.8 | 0.006 |
| 912.9 | 0.006 |
| 913.0 | 0.006 |
| 913.1 | 0.006 |
| 913.2 | 0.005 |
| 913.3 | 0.005 |
| 913.4 | 0.005 |
| 913.5 | 0.005 |
| 913.6 | 0.004 |
| 913.7 | 0.004 |
| 913.8 | 0.004 |
| 913.9 | 0.003 |
| 914.0 | 0.003 |
| 914.1 | 0.003 |
| 914.2 | 0.003 |
| 914.3 | 0.002 |
| 914.4 | 0.002 |
| 914.5 | 0.002 |
| 914.6 | 0.003 |
| 914.7 | 0.003 |
| 914.8 | 0.003 |
| 914.9 | 0.003 |
| 915.0 | 0.003 |
| 915.1 | 0.003 |
| 915.2 | 0.003 |
| 915.3 | 0.003 |
| 915.4 | 0.003 |
| 915.5 | 0.003 |
| 915.6 | 0.004 |
| 915.7 | 0.004 |
| 915.8 | 0.005 |
| 915.9 | 0.005 |
| 916.0 | 0.005 |
| 916.1 | 0.005 |
| 916.2 | 0.006 |
| 916.3 | 0.006 |
| 916.4 | 0.006 |
| 916.5 | 0.006 |
| 916.6 | 0.004 |
| 916.7 | 0.004 |
| 916.8 | 0.004 |
| 916.9 | 0.004 |
| 917.0 | 0.004 |
| 917.1 | 0.003 |
| 917.2 | 0.003 |
| 917.3 | 0.003 |
| 917.4 | 0.003 |
| 917.5 | 0.003 |
| 917.6 | 0.003 |
| 917.7 | 0.003 |
| 917.8 | 0.003 |
| 917.9 | 0.003 |
| 918.0 | 0.003 |
| 918.1 | 0.003 |
| 918.2 | 0.003 |
| 918.3 | 0.003 |
| 918.4 | 0.002 |
| 918.5 | 0.002 |
| 918.6 | 0.005 |
| 918.7 | 0.005 |
| 918.8 | 0.005 |
| 918.9 | 0.006 |
| 919.0 | 0.006 |
| 919.1 | 0.006 |
| 919.2 | 0.007 |
| 919.3 | 0.007 |
| 919.4 | 0.007 |
| 919.5 | 0.008 |
| 919.6 | 0.008 |
| 919.7 | 0.008 |
| 919.8 | 0.008 |
| 919.9 | 0.008 |
| 920.0 | 0.009 |
| 920.1 | 0.009 |
| 920.2 | 0.009 |
| 920.3 | 0.01 |
| 920.4 | 0.01 |
| 920.5 | 0.01 |
| 920.6 | 0.01 |
| 920.7 | 0.01 |
| 920.8 | 0.01 |
| 920.9 | 0.01 |
| 921.0 | 0.01 |
| 921.1 | 0.011 |
| 921.2 | 0.011 |
| 921.3 | 0.011 |
| 921.4 | 0.011 |
| 921.5 | 0.011 |
| 921.6 | 0.009 |
| 921.7 | 0.009 |
| 921.8 | 0.009 |
| 921.9 | 0.009 |
| 922.0 | 0.009 |
| 922.1 | 0.009 |
| 922.2 | 0.008 |
| 922.3 | 0.008 |
| 922.4 | 0.008 |
| 922.5 | 0.008 |
| 922.6 | 0.008 |
| 922.7 | 0.008 |
| 922.8 | 0.008 |
| 922.9 | 0.008 |
| 923.0 | 0.008 |
| 923.1 | 0.007 |
| 923.2 | 0.007 |
| 923.3 | 0.007 |
| 923.4 | 0.007 |
| 923.5 | 0.007 |
| 923.6 | 0.01 |
| 923.7 | 0.01 |
| 923.8 | 0.01 |
| 923.9 | 0.011 |
| 924.0 | 0.011 |
| 924.1 | 0.011 |
| 924.2 | 0.012 |
| 924.3 | 0.012 |
| 924.4 | 0.012 |
| 924.5 | 0.013 |
| 924.6 | 0.011 |
| 924.7 | 0.012 |
| 924.8 | 0.012 |
| 924.9 | 0.012 |
| 925.0 | 0.012 |
| 925.1 | 0.012 |
| 925.2 | 0.012 |
| 925.3 | 0.012 |
| 925.4 | 0.012 |
| 925.5 | 0.012 |
| 925.6 | 0.011 |
| 925.7 | 0.011 |
| 925.8 | 0.011 |
| 925.9 | 0.011 |
| 926.0 | 0.011 |
| 926.1 | 0.011 |
| 926.2 | 0.011 |
| 926.3 | 0.011 |
| 926.4 | 0.011 |
| 926.5 | 0.011 |
| 926.6 | 0.009 |
| 926.7 | 0.009 |
| 926.8 | 0.008 |
| 926.9 | 0.008 |
| 927.0 | 0.007 |
| 927.1 | 0.007 |
| 927.2 | 0.007 |
| 927.3 | 0.006 |
| 927.4 | 0.006 |
| 927.5 | 0.006 |
| 927.6 | 0.006 |
| 927.7 | 0.006 |
| 927.8 | 0.006 |
| 927.9 | 0.006 |
| 928.0 | 0.005 |
| 928.1 | 0.005 |
| 928.2 | 0.005 |
| 928.3 | 0.005 |
| 928.4 | 0.004 |
| 928.5 | 0.004 |
| 928.6 | 0.005 |
| 928.7 | 0.005 |
| 928.8 | 0.006 |
| 928.9 | 0.006 |
| 929.0 | 0.006 |
| 929.1 | 0.006 |
| 929.2 | 0.006 |
| 929.3 | 0.006 |
| 929.4 | 0.006 |
| 929.5 | 0.006 |
| 929.6 | 0.005 |
| 929.7 | 0.005 |
| 929.8 | 0.004 |
| 929.9 | 0.004 |
| 930.0 | 0.004 |
| 930.1 | 0.004 |
| 930.2 | 0.004 |
| 930.3 | 0.004 |
| 930.4 | 0.003 |
| 930.5 | 0.003 |
| 930.6 | 0.007 |
| 930.7 | 0.008 |
| 930.8 | 0.008 |
| 930.9 | 0.009 |
| 931.0 | 0.009 |
| 931.1 | 0.01 |
| 931.2 | 0.01 |
| 931.3 | 0.011 |
| 931.4 | 0.011 |
| 931.5 | 0.012 |
| 931.6 | 0.01 |
| 931.7 | 0.01 |
| 931.8 | 0.011 |
| 931.9 | 0.011 |
| 932.0 | 0.011 |
| 932.1 | 0.011 |
| 932.2 | 0.011 |
| 932.3 | 0.011 |
| 932.4 | 0.012 |
| 932.5 | 0.012 |
| 932.6 | 0.01 |
| 932.7 | 0.01 |
| 932.8 | 0.01 |
| 932.9 | 0.01 |
| 933.0 | 0.01 |
| 933.1 | 0.01 |
| 933.2 | 0.01 |
| 933.3 | 0.01 |
| 933.4 | 0.01 |
| 933.5 | 0.01 |
| 933.6 | 0.008 |
| 933.7 | 0.008 |
| 933.8 | 0.008 |
| 933.9 | 0.008 |
| 934.0 | 0.007 |
| 934.1 | 0.007 |
| 934.2 | 0.007 |
| 934.3 | 0.007 |
| 934.4 | 0.006 |
| 934.5 | 0.006 |
| 934.6 | 0.006 |
| 934.7 | 0.006 |
| 934.8 | 0.006 |
| 934.9 | 0.005 |
| 935.0 | 0.005 |
| 935.1 | 0.005 |
| 935.2 | 0.005 |
| 935.3 | 0.005 |
| 935.4 | 0.004 |
| 935.5 | 0.004 |
| 935.6 | 0.003 |
| 935.7 | 0.003 |
| 935.8 | 0.003 |
| 935.9 | 0.002 |
| 936.0 | 0.002 |
| 936.1 | 0.002 |
| 936.2 | 0.001 |
| 936.3 | 0.001 |
| 936.4 | 0.001 |
| 936.5 | 0 |
| 936.6 | 0.003 |
| 936.7 | 0.003 |
| 936.8 | 0.003 |
| 936.9 | 0.003 |
| 937.0 | 0.003 |
| 937.1 | 0.003 |
| 937.2 | 0.004 |
| 937.3 | 0.004 |
| 937.4 | 0.004 |
| 937.5 | 0.004 |
| 937.6 | 0.005 |
| 937.7 | 0.006 |
| 937.8 | 0.006 |
| 937.9 | 0.006 |
| 938.0 | 0.006 |
| 938.1 | 0.007 |
| 938.2 | 0.007 |
| 938.3 | 0.007 |
| 938.4 | 0.008 |
| 938.5 | 0.008 |
| 938.6 | 0.009 |
| 938.7 | 0.009 |
| 938.8 | 0.01 |
| 938.9 | 0.01 |
| 939.0 | 0.011 |
| 939.1 | 0.011 |
| 939.2 | 0.011 |
| 939.3 | 0.012 |
| 939.4 | 0.012 |
| 939.5 | 0.013 |
| 939.6 | 0.006 |
| 939.7 | 0.005 |
| 939.8 | 0.004 |
| 939.9 | 0.003 |
| 940.0 | 0.002 |
| 940.1 | 0.002 |
| 940.2 | 0.001 |
| 940.3 | 0 |
| 940.4 | -0.001 |
| 940.5 | -0.002 |
| 940.6 | 0.004 |
| 940.7 | 0.004 |
| 940.8 | 0.005 |
| 940.9 | 0.005 |
| 941.0 | 0.005 |
| 941.1 | 0.005 |
| 941.2 | 0.006 |
| 941.3 | 0.006 |
| 941.4 | 0.006 |
| 941.5 | 0.006 |
| 941.6 | 0 |
| 941.7 | -0.001 |
| 941.8 | -0.002 |
| 941.9 | -0.003 |
| 942.0 | -0.004 |
| 942.1 | -0.005 |
| 942.2 | -0.006 |
| 942.3 | -0.007 |
| 942.4 | -0.008 |
| 942.5 | -0.008 |
| 942.6 | -0.006 |
| 942.7 | -0.006 |
| 942.8 | -0.006 |
| 942.9 | -0.006 |
| 943.0 | -0.007 |
| 943.1 | -0.007 |
| 943.2 | -0.007 |
| 943.3 | -0.008 |
| 943.4 | -0.008 |
| 943.5 | -0.008 |
| 943.6 | -0.006 |
| 943.7 | -0.006 |
| 943.8 | -0.006 |
| 943.9 | -0.006 |
| 944.0 | -0.006 |
| 944.1 | -0.006 |
| 944.2 | -0.006 |
| 944.3 | -0.005 |
| 944.4 | -0.005 |
| 944.5 | -0.005 |
| 944.6 | -0.003 |
| 944.7 | -0.003 |
| 944.8 | -0.002 |
| 944.9 | -0.002 |
| 945.0 | -0.001 |
| 945.1 | -0.001 |
| 945.2 | 0 |
| 945.3 | 0 |
| 945.4 | 0.001 |
| 945.5 | 0.001 |
| 945.6 | -0.003 |
| 945.7 | -0.003 |
| 945.8 | -0.003 |
| 945.9 | -0.004 |
| 946.0 | -0.004 |
| 946.1 | -0.004 |
| 946.2 | -0.005 |
| 946.3 | -0.005 |
| 946.4 | -0.005 |
| 946.5 | -0.005 |
| 946.6 | -0.004 |
| 946.7 | -0.004 |
| 946.8 | -0.004 |
| 946.9 | -0.004 |
| 947.0 | -0.004 |
| 947.1 | -0.004 |
| 947.2 | -0.004 |
| 947.3 | -0.004 |
| 947.4 | -0.004 |
| 947.5 | -0.004 |
| 947.6 | -0.004 |
| 947.7 | -0.004 |
| 947.8 | -0.004 |
| 947.9 | -0.004 |
| 948.0 | -0.004 |
| 948.1 | -0.004 |
| 948.2 | -0.004 |
| 948.3 | -0.004 |
| 948.4 | -0.005 |
| 948.5 | -0.005 |
| 948.6 | -0.002 |
| 948.7 | -0.001 |
| 948.8 | -0.001 |
| 948.9 | 0 |
| 949.0 | 0 |
| 949.1 | 0.001 |
| 949.2 | 0.001 |
| 949.3 | 0.001 |
| 949.4 | 0.002 |
| 949.5 | 0.002 |
| 949.6 | -0.002 |
| 949.7 | -0.002 |
| 949.8 | -0.002 |
| 949.9 | -0.003 |
| 950.0 | -0.003 |
| 950.1 | -0.003 |
| 950.2 | -0.004 |
| 950.3 | -0.004 |
| 950.4 | -0.004 |
| 950.5 | -0.005 |
| 950.6 | -0.004 |
| 950.7 | -0.004 |
| 950.8 | -0.004 |
| 950.9 | -0.004 |
| 951.0 | -0.004 |
| 951.1 | -0.004 |
| 951.2 | -0.004 |
| 951.3 | -0.004 |
| 951.4 | -0.004 |
| 951.5 | -0.005 |
| 951.6 | -0.005 |
| 951.7 | -0.006 |
| 951.8 | -0.006 |
| 951.9 | -0.006 |
| 952.0 | -0.006 |
| 952.1 | -0.007 |
| 952.2 | -0.007 |
| 952.3 | -0.007 |
| 952.4 | -0.007 |
| 952.5 | -0.008 |
| 952.6 | -0.004 |
| 952.7 | -0.004 |
| 952.8 | -0.004 |
| 952.9 | -0.004 |
| 953.0 | -0.003 |
| 953.1 | -0.003 |
| 953.2 | -0.003 |
| 953.3 | -0.002 |
| 953.4 | -0.002 |
| 953.5 | -0.002 |
| 953.6 | -0.006 |
| 953.7 | -0.007 |
| 953.8 | -0.008 |
| 953.9 | -0.008 |
| 954.0 | -0.009 |
| 954.1 | -0.009 |
| 954.2 | -0.01 |
| 954.3 | -0.01 |
| 954.4 | -0.011 |
| 954.5 | -0.011 |
| 954.6 | -0.005 |
| 954.7 | -0.004 |
| 954.8 | -0.004 |
| 954.9 | -0.003 |
| 955.0 | -0.003 |
| 955.1 | -0.002 |
| 955.2 | -0.001 |
| 955.3 | -0.001 |
| 955.4 | 0 |
| 955.5 | 0 |
| 955.6 | -0.004 |
| 955.7 | -0.004 |
| 955.8 | -0.005 |
| 955.9 | -0.005 |
| 956.0 | -0.005 |
| 956.1 | -0.005 |
| 956.2 | -0.006 |
| 956.3 | -0.006 |
| 956.4 | -0.006 |
| 956.5 | -0.007 |
| 956.6 | -0.001 |
| 956.7 | 0 |
| 956.8 | 0.001 |
| 956.9 | 0.002 |
| 957.0 | 0.003 |
| 957.1 | 0.003 |
| 957.2 | 0.004 |
| 957.3 | 0.005 |
| 957.4 | 0.006 |
| 957.5 | 0.006 |
| 957.6 | 0.007 |
| 957.7 | 0.008 |
| 957.8 | 0.009 |
| 957.9 | 0.01 |
| 958.0 | 0.011 |
| 958.1 | 0.012 |
| 958.2 | 0.012 |
| 958.3 | 0.013 |
| 958.4 | 0.014 |
| 958.5 | 0.015 |
| 958.6 | 0.012 |
| 958.7 | 0.012 |
| 958.8 | 0.012 |
| 958.9 | 0.013 |
| 959.0 | 0.013 |
| 959.1 | 0.013 |
| 959.2 | 0.013 |
| 959.3 | 0.013 |
| 959.4 | 0.014 |
| 959.5 | 0.014 |
| 959.6 | 0.039 |
| 959.7 | 0.043 |
| 959.8 | 0.047 |
| 959.9 | 0.051 |
| 960.0 | 0.056 |
| 960.1 | 0.06 |
| 960.2 | 0.064 |
| 960.3 | 0.069 |
| 960.4 | 0.073 |
| 960.5 | 0.077 |
| 960.6 | 0.102 |
| 960.7 | 0.11 |
| 960.8 | 0.117 |
| 960.9 | 0.125 |
| 961.0 | 0.133 |
| 961.1 | 0.141 |
| 961.2 | 0.149 |
| 961.3 | 0.157 |
| 961.4 | 0.165 |
| 961.5 | 0.173 |
| 961.6 | 0.159 |
| 961.7 | 0.164 |
| 961.8 | 0.168 |
| 961.9 | 0.172 |
| 962.0 | 0.177 |
| 962.1 | 0.181 |
| 962.2 | 0.186 |
| 962.3 | 0.19 |
| 962.4 | 0.195 |
| 962.5 | 0.199 |
| 962.6 | 0.169 |
| 962.7 | 0.167 |
| 962.8 | 0.166 |
| 962.9 | 0.165 |
| 963.0 | 0.163 |
| 963.1 | 0.162 |
| 963.2 | 0.161 |
| 963.3 | 0.159 |
| 963.4 | 0.158 |
| 963.5 | 0.157 |
| 963.6 | 0.159 |
| 963.7 | 0.159 |
| 963.8 | 0.158 |
| 963.9 | 0.157 |
| 964.0 | 0.156 |
| 964.1 | 0.156 |
| 964.2 | 0.155 |
| 964.3 | 0.154 |
| 964.4 | 0.154 |
| 964.5 | 0.153 |
| 964.6 | 0.145 |
| 964.7 | 0.143 |
| 964.8 | 0.141 |
| 964.9 | 0.139 |
| 965.0 | 0.137 |
| 965.1 | 0.135 |
| 965.2 | 0.133 |
| 965.3 | 0.131 |
| 965.4 | 0.13 |
| 965.5 | 0.128 |
| 965.6 | 0.134 |
| 965.7 | 0.133 |
| 965.8 | 0.132 |
| 965.9 | 0.132 |
| 966.0 | 0.131 |
| 966.1 | 0.131 |
| 966.2 | 0.13 |
| 966.3 | 0.13 |
| 966.4 | 0.129 |
| 966.5 | 0.128 |
| 966.6 | 0.166 |
| 966.7 | 0.172 |
| 966.8 | 0.178 |
| 966.9 | 0.184 |
| 967.0 | 0.19 |
| 967.1 | 0.196 |
| 967.2 | 0.202 |
| 967.3 | 0.208 |
| 967.4 | 0.214 |
| 967.5 | 0.22 |
| 967.6 | 0.227 |
| 967.7 | 0.233 |
| 967.8 | 0.239 |
| 967.9 | 0.245 |
| 968.0 | 0.251 |
| 968.1 | 0.258 |
| 968.2 | 0.264 |
| 968.3 | 0.27 |
| 968.4 | 0.276 |
| 968.5 | 0.283 |
| 968.6 | 0.258 |
| 968.7 | 0.259 |
| 968.8 | 0.26 |
| 968.9 | 0.261 |
| 969.0 | 0.262 |
| 969.1 | 0.263 |
| 969.2 | 0.265 |
| 969.3 | 0.266 |
| 969.4 | 0.267 |
| 969.5 | 0.268 |
| 969.6 | 0.235 |
| 969.7 | 0.23 |
| 969.8 | 0.225 |
| 969.9 | 0.221 |
| 970.0 | 0.216 |
| 970.1 | 0.212 |
| 970.2 | 0.207 |
| 970.3 | 0.202 |
| 970.4 | 0.198 |
| 970.5 | 0.193 |
| 970.6 | 0.169 |
| 970.7 | 0.161 |
| 970.8 | 0.153 |
| 970.9 | 0.145 |
| 971.0 | 0.137 |
| 971.1 | 0.13 |
| 971.2 | 0.122 |
| 971.3 | 0.114 |
| 971.4 | 0.107 |
| 971.5 | 0.099 |
| 971.6 | 0.107 |
| 971.7 | 0.102 |
| 971.8 | 0.097 |
| 971.9 | 0.092 |
| 972.0 | 0.087 |
| 972.1 | 0.082 |
| 972.2 | 0.077 |
| 972.3 | 0.072 |
| 972.4 | 0.067 |
| 972.5 | 0.062 |
| 972.6 | 0.107 |
| 972.7 | 0.111 |
| 972.8 | 0.114 |
| 972.9 | 0.118 |
| 973.0 | 0.121 |
| 973.1 | 0.125 |
| 973.2 | 0.128 |
| 973.3 | 0.131 |
| 973.4 | 0.135 |
| 973.5 | 0.138 |
| 973.6 | 0.177 |
| 973.7 | 0.186 |
| 973.8 | 0.195 |
| 973.9 | 0.205 |
| 974.0 | 0.214 |
| 974.1 | 0.224 |
| 974.2 | 0.233 |
| 974.3 | 0.243 |
| 974.4 | 0.252 |
| 974.5 | 0.262 |
| 974.6 | 0.228 |
| 974.7 | 0.231 |
| 974.8 | 0.233 |
| 974.9 | 0.236 |
| 975.0 | 0.238 |
| 975.1 | 0.24 |
| 975.2 | 0.243 |
| 975.3 | 0.245 |
| 975.4 | 0.247 |
| 975.5 | 0.25 |
| 975.6 | 0.2 |
| 975.7 | 0.194 |
| 975.8 | 0.188 |
| 975.9 | 0.182 |
| 976.0 | 0.175 |
| 976.1 | 0.169 |
| 976.2 | 0.163 |
| 976.3 | 0.157 |
| 976.4 | 0.151 |
| 976.5 | 0.145 |
| 976.6 | 0.167 |
| 976.7 | 0.166 |
| 976.8 | 0.164 |
| 976.9 | 0.163 |
| 977.0 | 0.161 |
| 977.1 | 0.16 |
| 977.2 | 0.159 |
| 977.3 | 0.157 |
| 977.4 | 0.156 |
| 977.5 | 0.154 |
| 977.6 | 0.191 |
| 977.7 | 0.196 |
| 977.8 | 0.201 |
| 977.9 | 0.206 |
| 978.0 | 0.211 |
| 978.1 | 0.216 |
| 978.2 | 0.221 |
| 978.3 | 0.226 |
| 978.4 | 0.231 |
| 978.5 | 0.237 |
| 978.6 | 0.253 |
| 978.7 | 0.26 |
| 978.8 | 0.268 |
| 978.9 | 0.275 |
| 979.0 | 0.282 |
| 979.1 | 0.289 |
| 979.2 | 0.296 |
| 979.3 | 0.303 |
| 979.4 | 0.311 |
| 979.5 | 0.318 |
| 979.6 | 0.288 |
| 979.7 | 0.289 |
| 979.8 | 0.29 |
| 979.9 | 0.291 |
| 980.0 | 0.292 |
| 980.1 | 0.293 |
| 980.2 | 0.295 |
| 980.3 | 0.296 |
| 980.4 | 0.297 |
| 980.5 | 0.298 |
| 980.6 | 0.282 |
| 980.7 | 0.281 |
| 980.8 | 0.279 |
| 980.9 | 0.277 |
| 981.0 | 0.276 |
| 981.1 | 0.274 |
| 981.2 | 0.272 |
| 981.3 | 0.271 |
| 981.4 | 0.269 |
| 981.5 | 0.267 |
| 981.6 | 0.268 |
| 981.7 | 0.267 |
| 981.8 | 0.265 |
| 981.9 | 0.264 |
| 982.0 | 0.263 |
| 982.1 | 0.262 |
| 982.2 | 0.26 |
| 982.3 | 0.259 |
| 982.4 | 0.258 |
| 982.5 | 0.256 |
| 982.6 | 0.259 |
| 982.7 | 0.258 |
| 982.8 | 0.257 |
| 982.9 | 0.256 |
| 983.0 | 0.256 |
| 983.1 | 0.255 |
| 983.2 | 0.254 |
| 983.3 | 0.254 |
| 983.4 | 0.253 |
| 983.5 | 0.252 |
| 983.6 | 0.229 |
| 983.7 | 0.225 |
| 983.8 | 0.22 |
| 983.9 | 0.216 |
| 984.0 | 0.212 |
| 984.1 | 0.207 |
| 984.2 | 0.203 |
| 984.3 | 0.199 |
| 984.4 | 0.194 |
| 984.5 | 0.19 |
| 984.6 | 0.179 |
| 984.7 | 0.174 |
| 984.8 | 0.169 |
| 984.9 | 0.163 |
| 985.0 | 0.158 |
| 985.1 | 0.153 |
| 985.2 | 0.148 |
| 985.3 | 0.142 |
| 985.4 | 0.137 |
| 985.5 | 0.132 |
| 985.6 | 0.134 |
| 985.7 | 0.13 |
| 985.8 | 0.126 |
| 985.9 | 0.122 |
| 986.0 | 0.118 |
| 986.1 | 0.114 |
| 986.2 | 0.11 |
| 986.3 | 0.106 |
| 986.4 | 0.102 |
| 986.5 | 0.098 |
| 986.6 | 0.102 |
| 986.7 | 0.099 |
| 986.8 | 0.097 |
| 986.9 | 0.094 |
| 987.0 | 0.091 |
| 987.1 | 0.089 |
| 987.2 | 0.086 |
| 987.3 | 0.083 |
| 987.4 | 0.081 |
| 987.5 | 0.078 |
| 987.6 | 0.098 |
| 987.7 | 0.099 |
| 987.8 | 0.1 |
| 987.9 | 0.101 |
| 988.0 | 0.102 |
| 988.1 | 0.103 |
| 988.2 | 0.104 |
| 988.3 | 0.105 |
| 988.4 | 0.106 |
| 988.5 | 0.107 |
| 988.6 | 0.101 |
| 988.7 | 0.101 |
| 988.8 | 0.101 |
| 988.9 | 0.101 |
| 989.0 | 0.101 |
| 989.1 | 0.101 |
| 989.2 | 0.101 |
| 989.3 | 0.1 |
| 989.4 | 0.1 |
| 989.5 | 0.1 |
| 989.6 | 0.085 |
| 989.7 | 0.083 |
| 989.8 | 0.08 |
| 989.9 | 0.078 |
| 990.0 | 0.075 |
| 990.1 | 0.072 |
| 990.2 | 0.07 |
| 990.3 | 0.067 |
| 990.4 | 0.065 |
| 990.5 | 0.062 |
| 990.6 | 0.068 |
| 990.7 | 0.067 |
| 990.8 | 0.065 |
| 990.9 | 0.064 |
| 991.0 | 0.063 |
| 991.1 | 0.062 |
| 991.2 | 0.06 |
| 991.3 | 0.059 |
| 991.4 | 0.058 |
| 991.5 | 0.057 |
| 991.6 | 0.059 |
| 991.7 | 0.058 |
| 991.8 | 0.058 |
| 991.9 | 0.057 |
| 992.0 | 0.056 |
| 992.1 | 0.056 |
| 992.2 | 0.055 |
| 992.3 | 0.054 |
| 992.4 | 0.054 |
| 992.5 | 0.053 |
| 992.6 | 0.058 |
| 992.7 | 0.059 |
| 992.8 | 0.059 |
| 992.9 | 0.06 |
| 993.0 | 0.06 |
| 993.1 | 0.06 |
| 993.2 | 0.061 |
| 993.3 | 0.061 |
| 993.4 | 0.061 |
| 993.5 | 0.062 |
| 993.6 | 0.061 |
| 993.7 | 0.061 |
| 993.8 | 0.062 |
| 993.9 | 0.062 |
| 994.0 | 0.062 |
| 994.1 | 0.062 |
| 994.2 | 0.062 |
| 994.3 | 0.063 |
| 994.4 | 0.063 |
| 994.5 | 0.063 |
| 994.6 | 0.058 |
| 994.7 | 0.058 |
| 994.8 | 0.057 |
| 994.9 | 0.056 |
| 995.0 | 0.056 |
| 995.1 | 0.055 |
| 995.2 | 0.054 |
| 995.3 | 0.054 |
| 995.4 | 0.053 |
| 995.5 | 0.053 |
| 995.6 | 0.054 |
| 995.7 | 0.053 |
| 995.8 | 0.053 |
| 995.9 | 0.053 |
| 996.0 | 0.052 |
| 996.1 | 0.052 |
| 996.2 | 0.051 |
| 996.3 | 0.051 |
| 996.4 | 0.051 |
| 996.5 | 0.05 |
| 996.6 | 0.054 |
| 996.7 | 0.055 |
| 996.8 | 0.055 |
| 996.9 | 0.055 |
| 997.0 | 0.056 |
| 997.1 | 0.056 |
| 997.2 | 0.056 |
| 997.3 | 0.057 |
| 997.4 | 0.057 |
| 997.5 | 0.057 |
| 997.6 | 0.062 |
| 997.7 | 0.063 |
| 997.8 | 0.064 |
| 997.9 | 0.065 |
| 998.0 | 0.066 |
| 998.1 | 0.068 |
| 998.2 | 0.069 |
| 998.3 | 0.07 |
| 998.4 | 0.071 |
| 998.5 | 0.072 |
| 998.6 | 0.064 |
| 998.7 | 0.064 |
| 998.8 | 0.063 |
| 998.9 | 0.063 |
| 999.0 | 0.063 |
| 999.1 | 0.062 |
| 999.2 | 0.062 |
| 999.3 | 0.062 |
| 999.4 | 0.061 |
| 999.5 | 0.061 |
| 999.6 | 0.064 |
| 999.7 | 0.064 |
| 999.8 | 0.064 |
| 999.9 | 0.064 |
| 1000.0 | 0.065 |
| 1000.1 | 0.065 |
| 1000.2 | 0.065 |
| 1000.3 | 0.065 |
| 1000.4 | 0.065 |
| 1000.5 | 0.065 |
| 1000.6 | 0.063 |
| 1000.7 | 0.063 |
| 1000.8 | 0.063 |
| 1000.9 | 0.062 |
| 1001.0 | 0.062 |
| 1001.1 | 0.062 |
| 1001.2 | 0.062 |
| 1001.3 | 0.062 |
| 1001.4 | 0.061 |
| 1001.5 | 0.061 |
| 1001.6 | 0.062 |
| 1001.7 | 0.061 |
| 1001.8 | 0.061 |
| 1001.9 | 0.061 |
| 1002.0 | 0.061 |
| 1002.1 | 0.061 |
| 1002.2 | 0.061 |
| 1002.3 | 0.061 |
| 1002.4 | 0.061 |
| 1002.5 | 0.06 |
| 1002.6 | 0.056 |
| 1002.7 | 0.056 |
| 1002.8 | 0.055 |
| 1002.9 | 0.054 |
| 1003.0 | 0.053 |
| 1003.1 | 0.053 |
| 1003.2 | 0.052 |
| 1003.3 | 0.051 |
| 1003.4 | 0.05 |
| 1003.5 | 0.049 |
| 1003.6 | 0.046 |
| 1003.7 | 0.045 |
| 1003.8 | 0.043 |
| 1003.9 | 0.042 |
| 1004.0 | 0.041 |
| 1004.1 | 0.04 |
| 1004.2 | 0.039 |
| 1004.3 | 0.037 |
| 1004.4 | 0.036 |
| 1004.5 | 0.035 |
| 1004.6 | 0.036 |
| 1004.7 | 0.035 |
| 1004.8 | 0.035 |
| 1004.9 | 0.034 |
| 1005.0 | 0.033 |
| 1005.1 | 0.032 |
| 1005.2 | 0.032 |
| 1005.3 | 0.031 |
| 1005.4 | 0.03 |
| 1005.5 | 0.029 |
| 1005.6 | 0.032 |
| 1005.7 | 0.032 |
| 1005.8 | 0.032 |
| 1005.9 | 0.032 |
| 1006.0 | 0.032 |
| 1006.1 | 0.032 |
| 1006.2 | 0.032 |
| 1006.3 | 0.032 |
| 1006.4 | 0.032 |
| 1006.5 | 0.032 |
| 1006.6 | 0.034 |
| 1006.7 | 0.034 |
| 1006.8 | 0.035 |
| 1006.9 | 0.035 |
| 1007.0 | 0.035 |
| 1007.1 | 0.036 |
| 1007.2 | 0.036 |
| 1007.3 | 0.036 |
| 1007.4 | 0.037 |
| 1007.5 | 0.037 |
| 1007.6 | 0.04 |
| 1007.7 | 0.041 |
| 1007.8 | 0.042 |
| 1007.9 | 0.043 |
| 1008.0 | 0.043 |
| 1008.1 | 0.044 |
| 1008.2 | 0.045 |
| 1008.3 | 0.046 |
| 1008.4 | 0.046 |
| 1008.5 | 0.047 |
| 1008.6 | 0.047 |
| 1008.7 | 0.047 |
| 1008.8 | 0.048 |
| 1008.9 | 0.048 |
| 1009.0 | 0.049 |
| 1009.1 | 0.049 |
| 1009.2 | 0.05 |
| 1009.3 | 0.051 |
| 1009.4 | 0.051 |
| 1009.5 | 0.052 |
| 1009.6 | 0.045 |
| 1009.7 | 0.045 |
| 1009.8 | 0.044 |
| 1009.9 | 0.043 |
| 1010.0 | 0.043 |
| 1010.1 | 0.042 |
| 1010.2 | 0.042 |
| 1010.3 | 0.041 |
| 1010.4 | 0.04 |
| 1010.5 | 0.04 |
| 1010.6 | 0.036 |
| 1010.7 | 0.035 |
| 1010.8 | 0.033 |
| 1010.9 | 0.032 |
| 1011.0 | 0.031 |
| 1011.1 | 0.03 |
| 1011.2 | 0.029 |
| 1011.3 | 0.028 |
| 1011.4 | 0.026 |
| 1011.5 | 0.025 |
| 1011.6 | 0.026 |
| 1011.7 | 0.026 |
| 1011.8 | 0.025 |
| 1011.9 | 0.024 |
| 1012.0 | 0.023 |
| 1012.1 | 0.023 |
| 1012.2 | 0.022 |
| 1012.3 | 0.021 |
| 1012.4 | 0.02 |
| 1012.5 | 0.02 |
| 1012.6 | 0.021 |
| 1012.7 | 0.021 |
| 1012.8 | 0.021 |
| 1012.9 | 0.021 |
| 1013.0 | 0.02 |
| 1013.1 | 0.02 |
| 1013.2 | 0.02 |
| 1013.3 | 0.019 |
| 1013.4 | 0.019 |
| 1013.5 | 0.019 |
| 1013.6 | 0.019 |
| 1013.7 | 0.019 |
| 1013.8 | 0.019 |
| 1013.9 | 0.019 |
| 1014.0 | 0.019 |
| 1014.1 | 0.019 |
| 1014.2 | 0.019 |
| 1014.3 | 0.019 |
| 1014.4 | 0.018 |
| 1014.5 | 0.018 |
| 1014.6 | 0.017 |
| 1014.7 | 0.017 |
| 1014.8 | 0.016 |
| 1014.9 | 0.016 |
| 1015.0 | 0.016 |
| 1015.1 | 0.015 |
| 1015.2 | 0.015 |
| 1015.3 | 0.015 |
| 1015.4 | 0.015 |
| 1015.5 | 0.014 |
| 1015.6 | 0.019 |
| 1015.7 | 0.02 |
| 1015.8 | 0.02 |
| 1015.9 | 0.021 |
| 1016.0 | 0.021 |
| 1016.1 | 0.022 |
| 1016.2 | 0.022 |
| 1016.3 | 0.023 |
| 1016.4 | 0.024 |
| 1016.5 | 0.024 |
| 1016.6 | 0.026 |
| 1016.7 | 0.026 |
| 1016.8 | 0.027 |
| 1016.9 | 0.028 |
| 1017.0 | 0.028 |
| 1017.1 | 0.029 |
| 1017.2 | 0.03 |
| 1017.3 | 0.03 |
| 1017.4 | 0.031 |
| 1017.5 | 0.032 |
| 1017.6 | 0.036 |
| 1017.7 | 0.038 |
| 1017.8 | 0.039 |
| 1017.9 | 0.04 |
| 1018.0 | 0.042 |
| 1018.1 | 0.043 |
| 1018.2 | 0.044 |
| 1018.3 | 0.046 |
| 1018.4 | 0.047 |
| 1018.5 | 0.048 |
| 1018.6 | 0.04 |
| 1018.7 | 0.04 |
| 1018.8 | 0.04 |
| 1018.9 | 0.04 |
| 1019.0 | 0.04 |
| 1019.1 | 0.039 |
| 1019.2 | 0.039 |
| 1019.3 | 0.039 |
| 1019.4 | 0.039 |
| 1019.5 | 0.039 |
| 1019.6 | 0.042 |
| 1019.7 | 0.042 |
| 1019.8 | 0.042 |
| 1019.9 | 0.043 |
| 1020.0 | 0.043 |
| 1020.1 | 0.043 |
| 1020.2 | 0.043 |
| 1020.3 | 0.044 |
| 1020.4 | 0.044 |
| 1020.5 | 0.044 |
| 1020.6 | 0.041 |
| 1020.7 | 0.041 |
| 1020.8 | 0.041 |
| 1020.9 | 0.041 |
| 1021.0 | 0.04 |
| 1021.1 | 0.04 |
| 1021.2 | 0.04 |
| 1021.3 | 0.04 |
| 1021.4 | 0.039 |
| 1021.5 | 0.039 |
| 1021.6 | 0.034 |
| 1021.7 | 0.033 |
| 1021.8 | 0.032 |
| 1021.9 | 0.031 |
| 1022.0 | 0.03 |
| 1022.1 | 0.029 |
| 1022.2 | 0.028 |
| 1022.3 | 0.026 |
| 1022.4 | 0.025 |
| 1022.5 | 0.024 |
| 1022.6 | 0.026 |
| 1022.7 | 0.025 |
| 1022.8 | 0.024 |
| 1022.9 | 0.023 |
| 1023.0 | 0.023 |
| 1023.1 | 0.022 |
| 1023.2 | 0.021 |
| 1023.3 | 0.021 |
| 1023.4 | 0.02 |
| 1023.5 | 0.019 |
| 1023.6 | 0.02 |
| 1023.7 | 0.02 |
| 1023.8 | 0.019 |
| 1023.9 | 0.019 |
| 1024.0 | 0.019 |
| 1024.1 | 0.018 |
| 1024.2 | 0.018 |
| 1024.3 | 0.017 |
| 1024.4 | 0.017 |
| 1024.5 | 0.016 |
| 1024.6 | 0.015 |
| 1024.7 | 0.015 |
| 1024.8 | 0.014 |
| 1024.9 | 0.013 |
| 1025.0 | 0.013 |
| 1025.1 | 0.012 |
| 1025.2 | 0.012 |
| 1025.3 | 0.011 |
| 1025.4 | 0.011 |
| 1025.5 | 0.01 |
| 1025.6 | 0.017 |
| 1025.7 | 0.018 |
| 1025.8 | 0.018 |
| 1025.9 | 0.019 |
| 1026.0 | 0.02 |
| 1026.1 | 0.021 |
| 1026.2 | 0.021 |
| 1026.3 | 0.022 |
| 1026.4 | 0.023 |
| 1026.5 | 0.023 |
| 1026.6 | 0.016 |
| 1026.7 | 0.016 |
| 1026.8 | 0.015 |
| 1026.9 | 0.014 |
| 1027.0 | 0.014 |
| 1027.1 | 0.013 |
| 1027.2 | 0.013 |
| 1027.3 | 0.012 |
| 1027.4 | 0.011 |
| 1027.5 | 0.011 |
| 1027.6 | 0.013 |
| 1027.7 | 0.013 |
| 1027.8 | 0.013 |
| 1027.9 | 0.012 |
| 1028.0 | 0.012 |
| 1028.1 | 0.012 |
| 1028.2 | 0.012 |
| 1028.3 | 0.012 |
| 1028.4 | 0.012 |
| 1028.5 | 0.012 |
| 1028.6 | 0.013 |
| 1028.7 | 0.013 |
| 1028.8 | 0.013 |
| 1028.9 | 0.014 |
| 1029.0 | 0.014 |
| 1029.1 | 0.014 |
| 1029.2 | 0.014 |
| 1029.3 | 0.014 |
| 1029.4 | 0.014 |
| 1029.5 | 0.014 |
| 1029.6 | 0.011 |
| 1029.7 | 0.011 |
| 1029.8 | 0.01 |
| 1029.9 | 0.01 |
| 1030.0 | 0.009 |
| 1030.1 | 0.009 |
| 1030.2 | 0.008 |
| 1030.3 | 0.008 |
| 1030.4 | 0.007 |
| 1030.5 | 0.007 |
| 1030.6 | 0.007 |
| 1030.7 | 0.007 |
| 1030.8 | 0.007 |
| 1030.9 | 0.007 |
| 1031.0 | 0.006 |
| 1031.1 | 0.006 |
| 1031.2 | 0.006 |
| 1031.3 | 0.006 |
| 1031.4 | 0.005 |
| 1031.5 | 0.005 |
| 1031.6 | 0.005 |
| 1031.7 | 0.004 |
| 1031.8 | 0.004 |
| 1031.9 | 0.004 |
| 1032.0 | 0.004 |
| 1032.1 | 0.003 |
| 1032.2 | 0.003 |
| 1032.3 | 0.003 |
| 1032.4 | 0.003 |
| 1032.5 | 0.002 |
| 1032.6 | 0.006 |
| 1032.7 | 0.006 |
| 1032.8 | 0.007 |
| 1032.9 | 0.007 |
| 1033.0 | 0.008 |
| 1033.1 | 0.008 |
| 1033.2 | 0.008 |
| 1033.3 | 0.009 |
| 1033.4 | 0.009 |
| 1033.5 | 0.01 |
| 1033.6 | 0.006 |
| 1033.7 | 0.006 |
| 1033.8 | 0.005 |
| 1033.9 | 0.005 |
| 1034.0 | 0.005 |
| 1034.1 | 0.005 |
| 1034.2 | 0.004 |
| 1034.3 | 0.004 |
| 1034.4 | 0.004 |
| 1034.5 | 0.003 |
| 1034.6 | 0.007 |
| 1034.7 | 0.007 |
| 1034.8 | 0.007 |
| 1034.9 | 0.007 |
| 1035.0 | 0.008 |
| 1035.1 | 0.008 |
| 1035.2 | 0.008 |
| 1035.3 | 0.009 |
| 1035.4 | 0.009 |
| 1035.5 | 0.009 |
| 1035.6 | 0.01 |
| 1035.7 | 0.01 |
| 1035.8 | 0.01 |
| 1035.9 | 0.011 |
| 1036.0 | 0.011 |
| 1036.1 | 0.011 |
| 1036.2 | 0.012 |
| 1036.3 | 0.012 |
| 1036.4 | 0.012 |
| 1036.5 | 0.012 |
| 1036.6 | 0.007 |
| 1036.7 | 0.006 |
| 1036.8 | 0.005 |
| 1036.9 | 0.004 |
| 1037.0 | 0.004 |
| 1037.1 | 0.003 |
| 1037.2 | 0.002 |
| 1037.3 | 0.001 |
| 1037.4 | 0.001 |
| 1037.5 | 0 |
| 1037.6 | 0.003 |
| 1037.7 | 0.003 |
| 1037.8 | 0.003 |
| 1037.9 | 0.003 |
| 1038.0 | 0.003 |
| 1038.1 | 0.003 |
| 1038.2 | 0.003 |
| 1038.3 | 0.003 |
| 1038.4 | 0.003 |
| 1038.5 | 0.003 |
| 1038.6 | 0.005 |
| 1038.7 | 0.005 |
| 1038.8 | 0.006 |
| 1038.9 | 0.006 |
| 1039.0 | 0.006 |
| 1039.1 | 0.006 |
| 1039.2 | 0.007 |
| 1039.3 | 0.007 |
| 1039.4 | 0.007 |
| 1039.5 | 0.008 |
| 1039.6 | 0.006 |
| 1039.7 | 0.006 |
| 1039.8 | 0.005 |
| 1039.9 | 0.005 |
| 1040.0 | 0.005 |
| 1040.1 | 0.005 |
| 1040.2 | 0.005 |
| 1040.3 | 0.005 |
| 1040.4 | 0.005 |
| 1040.5 | 0.005 |
| 1040.6 | 0.009 |
| 1040.7 | 0.01 |
| 1040.8 | 0.011 |
| 1040.9 | 0.012 |
| 1041.0 | 0.012 |
| 1041.1 | 0.013 |
| 1041.2 | 0.014 |
| 1041.3 | 0.014 |
| 1041.4 | 0.015 |
| 1041.5 | 0.016 |
| 1041.6 | 0.014 |
| 1041.7 | 0.014 |
| 1041.8 | 0.015 |
| 1041.9 | 0.015 |
| 1042.0 | 0.015 |
| 1042.1 | 0.015 |
| 1042.2 | 0.016 |
| 1042.3 | 0.016 |
| 1042.4 | 0.016 |
| 1042.5 | 0.017 |
| 1042.6 | 0.015 |
| 1042.7 | 0.015 |
| 1042.8 | 0.016 |
| 1042.9 | 0.016 |
| 1043.0 | 0.016 |
| 1043.1 | 0.016 |
| 1043.2 | 0.016 |
| 1043.3 | 0.016 |
| 1043.4 | 0.016 |
| 1043.5 | 0.016 |
| 1043.6 | 0.016 |
| 1043.7 | 0.016 |
| 1043.8 | 0.017 |
| 1043.9 | 0.017 |
| 1044.0 | 0.017 |
| 1044.1 | 0.017 |
| 1044.2 | 0.017 |
| 1044.3 | 0.017 |
| 1044.4 | 0.017 |
| 1044.5 | 0.017 |
| 1044.6 | 0.012 |
| 1044.7 | 0.012 |
| 1044.8 | 0.011 |
| 1044.9 | 0.01 |
| 1045.0 | 0.009 |
| 1045.1 | 0.008 |
| 1045.2 | 0.008 |
| 1045.3 | 0.007 |
| 1045.4 | 0.006 |
| 1045.5 | 0.005 |
| 1045.6 | 0.01 |
| 1045.7 | 0.01 |
| 1045.8 | 0.01 |
| 1045.9 | 0.01 |
| 1046.0 | 0.01 |
| 1046.1 | 0.01 |
| 1046.2 | 0.01 |
| 1046.3 | 0.01 |
| 1046.4 | 0.01 |
| 1046.5 | 0.011 |
| 1046.6 | 0.015 |
| 1046.7 | 0.016 |
| 1046.8 | 0.017 |
| 1046.9 | 0.018 |
| 1047.0 | 0.019 |
| 1047.1 | 0.02 |
| 1047.2 | 0.021 |
| 1047.3 | 0.021 |
| 1047.4 | 0.022 |
| 1047.5 | 0.023 |
| 1047.6 | 0.019 |
| 1047.7 | 0.019 |
| 1047.8 | 0.019 |
| 1047.9 | 0.019 |
| 1048.0 | 0.019 |
| 1048.1 | 0.019 |
| 1048.2 | 0.019 |
| 1048.3 | 0.019 |
| 1048.4 | 0.018 |
| 1048.5 | 0.018 |
| 1048.6 | 0.021 |
| 1048.7 | 0.021 |
| 1048.8 | 0.022 |
| 1048.9 | 0.022 |
| 1049.0 | 0.022 |
| 1049.1 | 0.023 |
| 1049.2 | 0.023 |
| 1049.3 | 0.024 |
| 1049.4 | 0.024 |
| 1049.5 | 0.024 |
| 1049.6 | 0.022 |
| 1049.7 | 0.022 |
| 1049.8 | 0.022 |
| 1049.9 | 0.022 |
| 1050.0 | 0.022 |
| 1050.1 | 0.022 |
| 1050.2 | 0.022 |
| 1050.3 | 0.022 |
| 1050.4 | 0.022 |
| 1050.5 | 0.022 |
| 1050.6 | 0.021 |
| 1050.7 | 0.021 |
| 1050.8 | 0.021 |
| 1050.9 | 0.021 |
| 1051.0 | 0.02 |
| 1051.1 | 0.02 |
| 1051.2 | 0.02 |
| 1051.3 | 0.02 |
| 1051.4 | 0.02 |
| 1051.5 | 0.02 |
| 1051.6 | 0.02 |
| 1051.7 | 0.02 |
| 1051.8 | 0.02 |
| 1051.9 | 0.02 |
| 1052.0 | 0.02 |
| 1052.1 | 0.02 |
| 1052.2 | 0.02 |
| 1052.3 | 0.02 |
| 1052.4 | 0.02 |
| 1052.5 | 0.02 |
| 1052.6 | 0.019 |
| 1052.7 | 0.019 |
| 1052.8 | 0.019 |
| 1052.9 | 0.019 |
| 1053.0 | 0.018 |
| 1053.1 | 0.018 |
| 1053.2 | 0.018 |
| 1053.3 | 0.018 |
| 1053.4 | 0.018 |
| 1053.5 | 0.018 |
| 1053.6 | 0.025 |
| 1053.7 | 0.026 |
| 1053.8 | 0.027 |
| 1053.9 | 0.028 |
| 1054.0 | 0.029 |
| 1054.1 | 0.03 |
| 1054.2 | 0.031 |
| 1054.3 | 0.032 |
| 1054.4 | 0.033 |
| 1054.5 | 0.034 |
| 1054.6 | 0.027 |
| 1054.7 | 0.027 |
| 1054.8 | 0.027 |
| 1054.9 | 0.026 |
| 1055.0 | 0.026 |
| 1055.1 | 0.026 |
| 1055.2 | 0.026 |
| 1055.3 | 0.025 |
| 1055.4 | 0.025 |
| 1055.5 | 0.025 |
| 1055.6 | 0.028 |
| 1055.7 | 0.028 |
| 1055.8 | 0.029 |
| 1055.9 | 0.029 |
| 1056.0 | 0.03 |
| 1056.1 | 0.03 |
| 1056.2 | 0.03 |
| 1056.3 | 0.031 |
| 1056.4 | 0.031 |
| 1056.5 | 0.031 |
| 1056.6 | 0.028 |
| 1056.7 | 0.027 |
| 1056.8 | 0.027 |
| 1056.9 | 0.027 |
| 1057.0 | 0.026 |
| 1057.1 | 0.026 |
| 1057.2 | 0.026 |
| 1057.3 | 0.025 |
| 1057.4 | 0.025 |
| 1057.5 | 0.025 |
| 1057.6 | 0.029 |
| 1057.7 | 0.03 |
| 1057.8 | 0.03 |
| 1057.9 | 0.03 |
| 1058.0 | 0.031 |
| 1058.1 | 0.031 |
| 1058.2 | 0.032 |
| 1058.3 | 0.032 |
| 1058.4 | 0.033 |
| 1058.5 | 0.033 |
| 1058.6 | 0.027 |
| 1058.7 | 0.027 |
| 1058.8 | 0.026 |
| 1058.9 | 0.026 |
| 1059.0 | 0.025 |
| 1059.1 | 0.025 |
| 1059.2 | 0.024 |
| 1059.3 | 0.023 |
| 1059.4 | 0.023 |
| 1059.5 | 0.022 |
| 1059.6 | 0.027 |
| 1059.7 | 0.028 |
| 1059.8 | 0.028 |
| 1059.9 | 0.028 |
| 1060.0 | 0.029 |
| 1060.1 | 0.029 |
| 1060.2 | 0.029 |
| 1060.3 | 0.03 |
| 1060.4 | 0.03 |
| 1060.5 | 0.03 |
| 1060.6 | 0.03 |
| 1060.7 | 0.03 |
| 1060.8 | 0.03 |
| 1060.9 | 0.03 |
| 1061.0 | 0.03 |
| 1061.1 | 0.03 |
| 1061.2 | 0.03 |
| 1061.3 | 0.031 |
| 1061.4 | 0.031 |
| 1061.5 | 0.031 |
| 1061.6 | 0.028 |
| 1061.7 | 0.028 |
| 1061.8 | 0.027 |
| 1061.9 | 0.027 |
| 1062.0 | 0.027 |
| 1062.1 | 0.026 |
| 1062.2 | 0.026 |
| 1062.3 | 0.025 |
| 1062.4 | 0.025 |
| 1062.5 | 0.025 |
| 1062.6 | 0.03 |
| 1062.7 | 0.031 |
| 1062.8 | 0.031 |
| 1062.9 | 0.032 |
| 1063.0 | 0.032 |
| 1063.1 | 0.033 |
| 1063.2 | 0.033 |
| 1063.3 | 0.034 |
| 1063.4 | 0.035 |
| 1063.5 | 0.035 |
| 1063.6 | 0.032 |
| 1063.7 | 0.032 |
| 1063.8 | 0.032 |
| 1063.9 | 0.032 |
| 1064.0 | 0.032 |
| 1064.1 | 0.032 |
| 1064.2 | 0.032 |
| 1064.3 | 0.032 |
| 1064.4 | 0.032 |
| 1064.5 | 0.032 |
| 1064.6 | 0.031 |
| 1064.7 | 0.031 |
| 1064.8 | 0.031 |
| 1064.9 | 0.03 |
| 1065.0 | 0.03 |
| 1065.1 | 0.03 |
| 1065.2 | 0.03 |
| 1065.3 | 0.03 |
| 1065.4 | 0.029 |
| 1065.5 | 0.029 |
| 1065.6 | 0.032 |
| 1065.7 | 0.033 |
| 1065.8 | 0.033 |
| 1065.9 | 0.034 |
| 1066.0 | 0.034 |
| 1066.1 | 0.034 |
| 1066.2 | 0.035 |
| 1066.3 | 0.035 |
| 1066.4 | 0.035 |
| 1066.5 | 0.036 |
| 1066.6 | 0.029 |
| 1066.7 | 0.028 |
| 1066.8 | 0.027 |
| 1066.9 | 0.026 |
| 1067.0 | 0.025 |
| 1067.1 | 0.025 |
| 1067.2 | 0.024 |
| 1067.3 | 0.023 |
| 1067.4 | 0.022 |
| 1067.5 | 0.021 |
| 1067.6 | 0.027 |
| 1067.7 | 0.027 |
| 1067.8 | 0.028 |
| 1067.9 | 0.028 |
| 1068.0 | 0.028 |
| 1068.1 | 0.029 |
| 1068.2 | 0.029 |
| 1068.3 | 0.029 |
| 1068.4 | 0.03 |
| 1068.5 | 0.03 |
| 1068.6 | 0.028 |
| 1068.7 | 0.028 |
| 1068.8 | 0.028 |
| 1068.9 | 0.028 |
| 1069.0 | 0.028 |
| 1069.1 | 0.028 |
| 1069.2 | 0.028 |
| 1069.3 | 0.028 |
| 1069.4 | 0.028 |
| 1069.5 | 0.028 |
| 1069.6 | 0.028 |
| 1069.7 | 0.028 |
| 1069.8 | 0.028 |
| 1069.9 | 0.028 |
| 1070.0 | 0.028 |
| 1070.1 | 0.028 |
| 1070.2 | 0.028 |
| 1070.3 | 0.028 |
| 1070.4 | 0.028 |
| 1070.5 | 0.028 |
| 1070.6 | 0.027 |
| 1070.7 | 0.027 |
| 1070.8 | 0.027 |
| 1070.9 | 0.027 |
| 1071.0 | 0.027 |
| 1071.1 | 0.027 |
| 1071.2 | 0.027 |
| 1071.3 | 0.027 |
| 1071.4 | 0.026 |
| 1071.5 | 0.026 |
| 1071.6 | 0.028 |
| 1071.7 | 0.029 |
| 1071.8 | 0.029 |
| 1071.9 | 0.029 |
| 1072.0 | 0.029 |
| 1072.1 | 0.029 |
| 1072.2 | 0.03 |
| 1072.3 | 0.03 |
| 1072.4 | 0.03 |
| 1072.5 | 0.03 |
| 1072.6 | 0.027 |
| 1072.7 | 0.027 |
| 1072.8 | 0.026 |
| 1072.9 | 0.026 |
| 1073.0 | 0.026 |
| 1073.1 | 0.025 |
| 1073.2 | 0.025 |
| 1073.3 | 0.025 |
| 1073.4 | 0.024 |
| 1073.5 | 0.024 |
| 1073.6 | 0.026 |
| 1073.7 | 0.026 |
| 1073.8 | 0.026 |
| 1073.9 | 0.026 |
| 1074.0 | 0.026 |
| 1074.1 | 0.026 |
| 1074.2 | 0.026 |
| 1074.3 | 0.026 |
| 1074.4 | 0.027 |
| 1074.5 | 0.027 |
| 1074.6 | 0.023 |
| 1074.7 | 0.022 |
| 1074.8 | 0.022 |
| 1074.9 | 0.021 |
| 1075.0 | 0.021 |
| 1075.1 | 0.02 |
| 1075.2 | 0.02 |
| 1075.3 | 0.019 |
| 1075.4 | 0.019 |
| 1075.5 | 0.018 |
| 1075.6 | 0.024 |
| 1075.7 | 0.024 |
| 1075.8 | 0.025 |
| 1075.9 | 0.025 |
| 1076.0 | 0.026 |
| 1076.1 | 0.026 |
| 1076.2 | 0.026 |
| 1076.3 | 0.027 |
| 1076.4 | 0.027 |
| 1076.5 | 0.028 |
| 1076.6 | 0.025 |
| 1076.7 | 0.025 |
| 1076.8 | 0.025 |
| 1076.9 | 0.024 |
| 1077.0 | 0.024 |
| 1077.1 | 0.024 |
| 1077.2 | 0.024 |
| 1077.3 | 0.024 |
| 1077.4 | 0.024 |
| 1077.5 | 0.024 |
| 1077.6 | 0.023 |
| 1077.7 | 0.023 |
| 1077.8 | 0.023 |
| 1077.9 | 0.023 |
| 1078.0 | 0.023 |
| 1078.1 | 0.023 |
| 1078.2 | 0.022 |
| 1078.3 | 0.022 |
| 1078.4 | 0.022 |
| 1078.5 | 0.022 |
| 1078.6 | 0.023 |
| 1078.7 | 0.023 |
| 1078.8 | 0.023 |
| 1078.9 | 0.023 |
| 1079.0 | 0.023 |
| 1079.1 | 0.024 |
| 1079.2 | 0.024 |
| 1079.3 | 0.024 |
| 1079.4 | 0.024 |
| 1079.5 | 0.024 |
| 1079.6 | 0.023 |
| 1079.7 | 0.023 |
| 1079.8 | 0.022 |
| 1079.9 | 0.022 |
| 1080.0 | 0.022 |
| 1080.1 | 0.022 |
| 1080.2 | 0.022 |
| 1080.3 | 0.022 |
| 1080.4 | 0.022 |
| 1080.5 | 0.021 |
| 1080.6 | 0.02 |
| 1080.7 | 0.019 |
| 1080.8 | 0.019 |
| 1080.9 | 0.018 |
| 1081.0 | 0.018 |
| 1081.1 | 0.018 |
| 1081.2 | 0.017 |
| 1081.3 | 0.017 |
| 1081.4 | 0.016 |
| 1081.5 | 0.016 |
| 1081.6 | 0.012 |
| 1081.7 | 0.011 |
| 1081.8 | 0.009 |
| 1081.9 | 0.008 |
| 1082.0 | 0.007 |
| 1082.1 | 0.006 |
| 1082.2 | 0.005 |
| 1082.3 | 0.004 |
| 1082.4 | 0.003 |
| 1082.5 | 0.002 |
| 1082.6 | 0.008 |
| 1082.7 | 0.008 |
| 1082.8 | 0.009 |
| 1082.9 | 0.009 |
| 1083.0 | 0.009 |
| 1083.1 | 0.009 |
| 1083.2 | 0.009 |
| 1083.3 | 0.009 |
| 1083.4 | 0.009 |
| 1083.5 | 0.01 |
| 1083.6 | 0.008 |
| 1083.7 | 0.008 |
| 1083.8 | 0.007 |
| 1083.9 | 0.007 |
| 1084.0 | 0.007 |
| 1084.1 | 0.007 |
| 1084.2 | 0.007 |
| 1084.3 | 0.006 |
| 1084.4 | 0.006 |
| 1084.5 | 0.006 |
| 1084.6 | 0.007 |
| 1084.7 | 0.007 |
| 1084.8 | 0.007 |
| 1084.9 | 0.007 |
| 1085.0 | 0.007 |
| 1085.1 | 0.007 |
| 1085.2 | 0.007 |
| 1085.3 | 0.007 |
| 1085.4 | 0.007 |
| 1085.5 | 0.007 |
| 1085.6 | 0.005 |
| 1085.7 | 0.005 |
| 1085.8 | 0.004 |
| 1085.9 | 0.004 |
| 1086.0 | 0.004 |
| 1086.1 | 0.003 |
| 1086.2 | 0.003 |
| 1086.3 | 0.003 |
| 1086.4 | 0.002 |
| 1086.5 | 0.002 |
| 1086.6 | 0.001 |
| 1086.7 | 0 |
| 1086.8 | 0 |
| 1086.9 | -0.001 |
| 1087.0 | -0.002 |
| 1087.1 | -0.002 |
| 1087.2 | -0.003 |
| 1087.3 | -0.003 |
| 1087.4 | -0.004 |
| 1087.5 | -0.004 |
| 1087.6 | 0.002 |
| 1087.7 | 0.003 |
| 1087.8 | 0.003 |
| 1087.9 | 0.004 |
| 1088.0 | 0.004 |
| 1088.1 | 0.005 |
| 1088.2 | 0.006 |
| 1088.3 | 0.006 |
| 1088.4 | 0.007 |
| 1088.5 | 0.007 |
| 1088.6 | 0.002 |
| 1088.7 | 0.001 |
| 1088.8 | 0.001 |
| 1088.9 | 0.001 |
| 1089.0 | 0 |
| 1089.1 | 0 |
| 1089.2 | -0.001 |
| 1089.3 | -0.001 |
| 1089.4 | -0.002 |
| 1089.5 | -0.002 |
| 1089.6 | 0.002 |
| 1089.7 | 0.002 |
| 1089.8 | 0.003 |
| 1089.9 | 0.003 |
| 1090.0 | 0.003 |
| 1090.1 | 0.004 |
| 1090.2 | 0.004 |
| 1090.3 | 0.004 |
| 1090.4 | 0.004 |
| 1090.5 | 0.005 |
| 1090.6 | 0.001 |
| 1090.7 | 0 |
| 1090.8 | 0 |
| 1090.9 | -0.001 |
| 1091.0 | -0.001 |
| 1091.1 | -0.002 |
| 1091.2 | -0.002 |
| 1091.3 | -0.003 |
| 1091.4 | -0.003 |
| 1091.5 | -0.004 |
| 1091.6 | 0.003 |
| 1091.7 | 0.004 |
| 1091.8 | 0.004 |
| 1091.9 | 0.005 |
| 1092.0 | 0.006 |
| 1092.1 | 0.007 |
| 1092.2 | 0.007 |
| 1092.3 | 0.008 |
| 1092.4 | 0.009 |
| 1092.5 | 0.01 |
| 1092.6 | 0.006 |
| 1092.7 | 0.006 |
| 1092.8 | 0.006 |
| 1092.9 | 0.005 |
| 1093.0 | 0.005 |
| 1093.1 | 0.005 |
| 1093.2 | 0.005 |
| 1093.3 | 0.005 |
| 1093.4 | 0.005 |
| 1093.5 | 0.005 |
| 1093.6 | 0.007 |
| 1093.7 | 0.007 |
| 1093.8 | 0.007 |
| 1093.9 | 0.008 |
| 1094.0 | 0.008 |
| 1094.1 | 0.008 |
| 1094.2 | 0.008 |
| 1094.3 | 0.009 |
| 1094.4 | 0.009 |
| 1094.5 | 0.009 |
| 1094.6 | 0.003 |
| 1094.7 | 0.002 |
| 1094.8 | 0.002 |
| 1094.9 | 0.001 |
| 1095.0 | 0 |
| 1095.1 | -0.001 |
| 1095.2 | -0.001 |
| 1095.3 | -0.002 |
| 1095.4 | -0.003 |
| 1095.5 | -0.004 |
| 1095.6 | 0.003 |
| 1095.7 | 0.003 |
| 1095.8 | 0.004 |
| 1095.9 | 0.004 |
| 1096.0 | 0.005 |
| 1096.1 | 0.005 |
| 1096.2 | 0.006 |
| 1096.3 | 0.006 |
| 1096.4 | 0.006 |
| 1096.5 | 0.007 |
| 1096.6 | 0.003 |
| 1096.7 | 0.003 |
| 1096.8 | 0.003 |
| 1096.9 | 0.003 |
| 1097.0 | 0.002 |
| 1097.1 | 0.002 |
| 1097.2 | 0.002 |
| 1097.3 | 0.002 |
| 1097.4 | 0.001 |
| 1097.5 | 0.001 |
| 1097.6 | 0.004 |
| 1097.7 | 0.004 |
| 1097.8 | 0.004 |
| 1097.9 | 0.005 |
| 1098.0 | 0.005 |
| 1098.1 | 0.005 |
| 1098.2 | 0.006 |
| 1098.3 | 0.006 |
| 1098.4 | 0.006 |
| 1098.5 | 0.006 |
| 1098.6 | 0.005 |
| 1098.7 | 0.005 |
| 1098.8 | 0.005 |
| 1098.9 | 0.005 |
| 1099.0 | 0.005 |
| 1099.1 | 0.005 |
| 1099.2 | 0.004 |
| 1099.3 | 0.004 |
| 1099.4 | 0.004 |
| 1099.5 | 0.004 |
| 1099.6 | 0.005 |
| 1099.7 | 0.006 |
| 1099.8 | 0.006 |
| 1099.9 | 0.006 |
| 1100.0 | 0.006 |
| 1100.1 | 0.006 |
| 1100.2 | 0.006 |
| 1100.3 | 0.007 |
| 1100.4 | 0.007 |
| 1100.5 | 0.007 |
| 1100.6 | 0.006 |
| 1100.7 | 0.005 |
| 1100.8 | 0.005 |
| 1100.9 | 0.005 |
| 1101.0 | 0.005 |
| 1101.1 | 0.005 |
| 1101.2 | 0.005 |
| 1101.3 | 0.005 |
| 1101.4 | 0.005 |
| 1101.5 | 0.005 |
| 1101.6 | 0.008 |
| 1101.7 | 0.008 |
| 1101.8 | 0.009 |
| 1101.9 | 0.009 |
| 1102.0 | 0.009 |
| 1102.1 | 0.01 |
| 1102.2 | 0.01 |
| 1102.3 | 0.011 |
| 1102.4 | 0.011 |
| 1102.5 | 0.012 |
| 1102.6 | 0.008 |
| 1102.7 | 0.008 |
| 1102.8 | 0.007 |
| 1102.9 | 0.007 |
| 1103.0 | 0.007 |
| 1103.1 | 0.007 |
| 1103.2 | 0.006 |
| 1103.3 | 0.006 |
| 1103.4 | 0.006 |
| 1103.5 | 0.006 |
| 1103.6 | 0.01 |
| 1103.7 | 0.01 |
| 1103.8 | 0.011 |
| 1103.9 | 0.011 |
| 1104.0 | 0.012 |
| 1104.1 | 0.012 |
| 1104.2 | 0.013 |
| 1104.3 | 0.013 |
| 1104.4 | 0.014 |
| 1104.5 | 0.014 |
| 1104.6 | 0.01 |
| 1104.7 | 0.01 |
| 1104.8 | 0.01 |
| 1104.9 | 0.01 |
| 1105.0 | 0.01 |
| 1105.1 | 0.009 |
| 1105.2 | 0.009 |
| 1105.3 | 0.009 |
| 1105.4 | 0.009 |
| 1105.5 | 0.008 |
| 1105.6 | 0.01 |
| 1105.7 | 0.01 |
| 1105.8 | 0.01 |
| 1105.9 | 0.01 |
| 1106.0 | 0.01 |
| 1106.1 | 0.01 |
| 1106.2 | 0.011 |
| 1106.3 | 0.011 |
| 1106.4 | 0.011 |
| 1106.5 | 0.011 |
| 1106.6 | 0.008 |
| 1106.7 | 0.007 |
| 1106.8 | 0.007 |
| 1106.9 | 0.006 |
| 1107.0 | 0.006 |
| 1107.1 | 0.005 |
| 1107.2 | 0.005 |
| 1107.3 | 0.004 |
| 1107.4 | 0.004 |
| 1107.5 | 0.003 |
| 1107.6 | 0.006 |
| 1107.7 | 0.007 |
| 1107.8 | 0.007 |
| 1107.9 | 0.007 |
| 1108.0 | 0.007 |
| 1108.1 | 0.007 |
| 1108.2 | 0.007 |
| 1108.3 | 0.007 |
| 1108.4 | 0.007 |
| 1108.5 | 0.008 |
| 1108.6 | 0.007 |
| 1108.7 | 0.007 |
| 1108.8 | 0.007 |
| 1108.9 | 0.007 |
| 1109.0 | 0.007 |
| 1109.1 | 0.007 |
| 1109.2 | 0.007 |
| 1109.3 | 0.007 |
| 1109.4 | 0.007 |
| 1109.5 | 0.007 |
| 1109.6 | 0.007 |
| 1109.7 | 0.007 |
| 1109.8 | 0.007 |
| 1109.9 | 0.008 |
| 1110.0 | 0.008 |
| 1110.1 | 0.008 |
| 1110.2 | 0.008 |
| 1110.3 | 0.008 |
| 1110.4 | 0.008 |
| 1110.5 | 0.008 |
| 1110.6 | 0.007 |
| 1110.7 | 0.007 |
| 1110.8 | 0.007 |
| 1110.9 | 0.007 |
| 1111.0 | 0.007 |
| 1111.1 | 0.007 |
| 1111.2 | 0.007 |
| 1111.3 | 0.007 |
| 1111.4 | 0.007 |
| 1111.5 | 0.007 |
| 1111.6 | 0.007 |
| 1111.7 | 0.007 |
| 1111.8 | 0.007 |
| 1111.9 | 0.007 |
| 1112.0 | 0.007 |
| 1112.1 | 0.008 |
| 1112.2 | 0.008 |
| 1112.3 | 0.008 |
| 1112.4 | 0.008 |
| 1112.5 | 0.008 |
| 1112.6 | 0.006 |
| 1112.7 | 0.005 |
| 1112.8 | 0.005 |
| 1112.9 | 0.005 |
| 1113.0 | 0.004 |
| 1113.1 | 0.004 |
| 1113.2 | 0.004 |
| 1113.3 | 0.004 |
| 1113.4 | 0.003 |
| 1113.5 | 0.003 |
| 1113.6 | 0.007 |
| 1113.7 | 0.008 |
| 1113.8 | 0.008 |
| 1113.9 | 0.009 |
| 1114.0 | 0.009 |
| 1114.1 | 0.01 |
| 1114.2 | 0.01 |
| 1114.3 | 0.011 |
| 1114.4 | 0.011 |
| 1114.5 | 0.012 |
| 1114.6 | 0.008 |
| 1114.7 | 0.008 |
| 1114.8 | 0.008 |
| 1114.9 | 0.007 |
| 1115.0 | 0.007 |
| 1115.1 | 0.007 |
| 1115.2 | 0.007 |
| 1115.3 | 0.006 |
| 1115.4 | 0.006 |
| 1115.5 | 0.006 |
| 1115.6 | 0.008 |
| 1115.7 | 0.008 |
| 1115.8 | 0.008 |
| 1115.9 | 0.008 |
| 1116.0 | 0.008 |
| 1116.1 | 0.009 |
| 1116.2 | 0.009 |
| 1116.3 | 0.009 |
| 1116.4 | 0.009 |
| 1116.5 | 0.009 |
| 1116.6 | 0.006 |
| 1116.7 | 0.005 |
| 1116.8 | 0.005 |
| 1116.9 | 0.004 |
| 1117.0 | 0.004 |
| 1117.1 | 0.003 |
| 1117.2 | 0.003 |
| 1117.3 | 0.002 |
| 1117.4 | 0.002 |
| 1117.5 | 0.001 |
| 1117.6 | 0.005 |
| 1117.7 | 0.006 |
| 1117.8 | 0.006 |
| 1117.9 | 0.006 |
| 1118.0 | 0.006 |
| 1118.1 | 0.007 |
| 1118.2 | 0.007 |
| 1118.3 | 0.007 |
| 1118.4 | 0.007 |
| 1118.5 | 0.008 |
| 1118.6 | 0.007 |
| 1118.7 | 0.007 |
| 1118.8 | 0.007 |
| 1118.9 | 0.007 |
| 1119.0 | 0.007 |
| 1119.1 | 0.007 |
| 1119.2 | 0.007 |
| 1119.3 | 0.007 |
| 1119.4 | 0.007 |
| 1119.5 | 0.007 |
| 1119.6 | 0.003 |
| 1119.7 | 0.002 |
| 1119.8 | 0.002 |
| 1119.9 | 0.001 |
| 1120.0 | 0 |
| 1120.1 | 0 |
| 1120.2 | -0.001 |
| 1120.3 | -0.002 |
| 1120.4 | -0.002 |
| 1120.5 | -0.003 |
| 1120.6 | 0.001 |
| 1120.7 | 0.001 |
| 1120.8 | 0.001 |
| 1120.9 | 0.001 |
| 1121.0 | 0.002 |
| 1121.1 | 0.002 |
| 1121.2 | 0.002 |
| 1121.3 | 0.002 |
| 1121.4 | 0.002 |
| 1121.5 | 0.002 |
| 1121.6 | 0.006 |
| 1121.7 | 0.007 |
| 1121.8 | 0.008 |
| 1121.9 | 0.008 |
| 1122.0 | 0.009 |
| 1122.1 | 0.01 |
| 1122.2 | 0.01 |
| 1122.3 | 0.011 |
| 1122.4 | 0.012 |
| 1122.5 | 0.013 |
| 1122.6 | 0.004 |
| 1122.7 | 0.003 |
| 1122.8 | 0.002 |
| 1122.9 | 0.001 |
| 1123.0 | 0 |
| 1123.1 | -0.001 |
| 1123.2 | -0.002 |
| 1123.3 | -0.003 |
| 1123.4 | -0.004 |
| 1123.5 | -0.004 |
| 1123.6 | 0.003 |
| 1123.7 | 0.004 |
| 1123.8 | 0.004 |
| 1123.9 | 0.004 |
| 1124.0 | 0.005 |
| 1124.1 | 0.005 |
| 1124.2 | 0.006 |
| 1124.3 | 0.006 |
| 1124.4 | 0.007 |
| 1124.5 | 0.007 |
| 1124.6 | 0.005 |
| 1124.7 | 0.005 |
| 1124.8 | 0.005 |
| 1124.9 | 0.005 |
| 1125.0 | 0.005 |
| 1125.1 | 0.005 |
| 1125.2 | 0.005 |
| 1125.3 | 0.005 |
| 1125.4 | 0.005 |
| 1125.5 | 0.005 |
| 1125.6 | 0.005 |
| 1125.7 | 0.005 |
| 1125.8 | 0.005 |
| 1125.9 | 0.005 |
| 1126.0 | 0.005 |
| 1126.1 | 0.005 |
| 1126.2 | 0.005 |
| 1126.3 | 0.005 |
| 1126.4 | 0.005 |
| 1126.5 | 0.005 |
| 1126.6 | 0.004 |
| 1126.7 | 0.004 |
| 1126.8 | 0.004 |
| 1126.9 | 0.004 |
| 1127.0 | 0.004 |
| 1127.1 | 0.004 |
| 1127.2 | 0.004 |
| 1127.3 | 0.003 |
| 1127.4 | 0.003 |
| 1127.5 | 0.003 |
| 1127.6 | 0.004 |
| 1127.7 | 0.004 |
| 1127.8 | 0.004 |
| 1127.9 | 0.004 |
| 1128.0 | 0.004 |
| 1128.1 | 0.004 |
| 1128.2 | 0.004 |
| 1128.3 | 0.004 |
| 1128.4 | 0.004 |
| 1128.5 | 0.004 |
| 1128.6 | 0.005 |
| 1128.7 | 0.005 |
| 1128.8 | 0.006 |
| 1128.9 | 0.006 |
| 1129.0 | 0.006 |
| 1129.1 | 0.006 |
| 1129.2 | 0.007 |
| 1129.3 | 0.007 |
| 1129.4 | 0.007 |
| 1129.5 | 0.007 |
| 1129.6 | 0.002 |
| 1129.7 | 0.001 |
| 1129.8 | 0.001 |
| 1129.9 | 0 |
| 1130.0 | -0.001 |
| 1130.1 | -0.001 |
| 1130.2 | -0.002 |
| 1130.3 | -0.003 |
| 1130.4 | -0.003 |
| 1130.5 | -0.004 |
| 1130.6 | -0.003 |
| 1130.7 | -0.003 |
| 1130.8 | -0.003 |
| 1130.9 | -0.003 |
| 1131.0 | -0.004 |
| 1131.1 | -0.004 |
| 1131.2 | -0.004 |
| 1131.3 | -0.005 |
| 1131.4 | -0.005 |
| 1131.5 | -0.005 |
| 1131.6 | -0.002 |
| 1131.7 | -0.002 |
| 1131.8 | -0.001 |
| 1131.9 | -0.001 |
| 1132.0 | -0.001 |
| 1132.1 | 0 |
| 1132.2 | 0 |
| 1132.3 | 0 |
| 1132.4 | 0 |
| 1132.5 | 0.001 |
| 1132.6 | 0.001 |
| 1132.7 | 0.002 |
| 1132.8 | 0.002 |
| 1132.9 | 0.003 |
| 1133.0 | 0.003 |
| 1133.1 | 0.003 |
| 1133.2 | 0.004 |
| 1133.3 | 0.004 |
| 1133.4 | 0.004 |
| 1133.5 | 0.005 |
| 1133.6 | 0.005 |
| 1133.7 | 0.005 |
| 1133.8 | 0.005 |
| 1133.9 | 0.006 |
| 1134.0 | 0.006 |
| 1134.1 | 0.006 |
| 1134.2 | 0.006 |
| 1134.3 | 0.007 |
| 1134.4 | 0.007 |
| 1134.5 | 0.007 |
| 1134.6 | 0.005 |
| 1134.7 | 0.005 |
| 1134.8 | 0.005 |
| 1134.9 | 0.005 |
| 1135.0 | 0.005 |
| 1135.1 | 0.005 |
| 1135.2 | 0.004 |
| 1135.3 | 0.004 |
| 1135.4 | 0.004 |
| 1135.5 | 0.004 |
| 1135.6 | -0.002 |
| 1135.7 | -0.003 |
| 1135.8 | -0.004 |
| 1135.9 | -0.005 |
| 1136.0 | -0.006 |
| 1136.1 | -0.007 |
| 1136.2 | -0.008 |
| 1136.3 | -0.009 |
| 1136.4 | -0.01 |
| 1136.5 | -0.011 |
| 1136.6 | -0.005 |
| 1136.7 | -0.004 |
| 1136.8 | -0.004 |
| 1136.9 | -0.004 |
| 1137.0 | -0.004 |
| 1137.1 | -0.004 |
| 1137.2 | -0.003 |
| 1137.3 | -0.003 |
| 1137.4 | -0.003 |
| 1137.5 | -0.003 |
| 1137.6 | -0.007 |
| 1137.7 | -0.008 |
| 1137.8 | -0.009 |
| 1137.9 | -0.009 |
| 1138.0 | -0.01 |
| 1138.1 | -0.01 |
| 1138.2 | -0.011 |
| 1138.3 | -0.012 |
| 1138.4 | -0.012 |
| 1138.5 | -0.013 |
| 1138.6 | -0.01 |
| 1138.7 | -0.01 |
| 1138.8 | -0.01 |
| 1138.9 | -0.01 |
| 1139.0 | -0.01 |
| 1139.1 | -0.01 |
| 1139.2 | -0.01 |
| 1139.3 | -0.01 |
| 1139.4 | -0.011 |
| 1139.5 | -0.011 |
| 1139.6 | -0.011 |
| 1139.7 | -0.011 |
| 1139.8 | -0.012 |
| 1139.9 | -0.012 |
| 1140.0 | -0.012 |
| 1140.1 | -0.012 |
| 1140.2 | -0.012 |
| 1140.3 | -0.013 |
| 1140.4 | -0.013 |
| 1140.5 | -0.013 |
| 1140.6 | -0.012 |
| 1140.7 | -0.011 |
| 1140.8 | -0.011 |
| 1140.9 | -0.011 |
| 1141.0 | -0.011 |
| 1141.1 | -0.011 |
| 1141.2 | -0.011 |
| 1141.3 | -0.011 |
| 1141.4 | -0.011 |
| 1141.5 | -0.011 |
| 1141.6 | -0.016 |
| 1141.7 | -0.016 |
| 1141.8 | -0.017 |
| 1141.9 | -0.018 |
| 1142.0 | -0.019 |
| 1142.1 | -0.019 |
| 1142.2 | -0.02 |
| 1142.3 | -0.021 |
| 1142.4 | -0.022 |
| 1142.5 | -0.022 |
| 1142.6 | -0.02 |
| 1142.7 | -0.02 |
| 1142.8 | -0.02 |
| 1142.9 | -0.02 |
| 1143.0 | -0.02 |
| 1143.1 | -0.02 |
| 1143.2 | -0.021 |
| 1143.3 | -0.021 |
| 1143.4 | -0.021 |
| 1143.5 | -0.021 |
| 1143.6 | -0.018 |
| 1143.7 | -0.017 |
| 1143.8 | -0.017 |
| 1143.9 | -0.016 |
| 1144.0 | -0.016 |
| 1144.1 | -0.016 |
| 1144.2 | -0.015 |
| 1144.3 | -0.015 |
| 1144.4 | -0.014 |
| 1144.5 | -0.014 |
| 1144.6 | -0.016 |
| 1144.7 | -0.016 |
| 1144.8 | -0.016 |
| 1144.9 | -0.016 |
| 1145.0 | -0.016 |
| 1145.1 | -0.016 |
| 1145.2 | -0.015 |
| 1145.3 | -0.015 |
| 1145.4 | -0.015 |
| 1145.5 | -0.015 |
| 1145.6 | -0.015 |
| 1145.7 | -0.015 |
| 1145.8 | -0.015 |
| 1145.9 | -0.015 |
| 1146.0 | -0.015 |
| 1146.1 | -0.015 |
| 1146.2 | -0.015 |
| 1146.3 | -0.015 |
| 1146.4 | -0.015 |
| 1146.5 | -0.015 |
| 1146.6 | -0.014 |
| 1146.7 | -0.014 |
| 1146.8 | -0.013 |
| 1146.9 | -0.013 |
| 1147.0 | -0.013 |
| 1147.1 | -0.013 |
| 1147.2 | -0.013 |
| 1147.3 | -0.012 |
| 1147.4 | -0.012 |
| 1147.5 | -0.012 |
| 1147.6 | -0.01 |
| 1147.7 | -0.01 |
| 1147.8 | -0.01 |
| 1147.9 | -0.009 |
| 1148.0 | -0.009 |
| 1148.1 | -0.008 |
| 1148.2 | -0.008 |
| 1148.3 | -0.007 |
| 1148.4 | -0.007 |
| 1148.5 | -0.007 |
| 1148.6 | -0.011 |
| 1148.7 | -0.012 |
| 1148.8 | -0.012 |
| 1148.9 | -0.013 |
| 1149.0 | -0.013 |
| 1149.1 | -0.014 |
| 1149.2 | -0.014 |
| 1149.3 | -0.015 |
| 1149.4 | -0.015 |
| 1149.5 | -0.015 |
| 1149.6 | -0.01 |
| 1149.7 | -0.009 |
| 1149.8 | -0.009 |
| 1149.9 | -0.008 |
| 1150.0 | -0.007 |
| 1150.1 | -0.007 |
| 1150.2 | -0.006 |
| 1150.3 | -0.006 |
| 1150.4 | -0.005 |
| 1150.5 | -0.004 |
| 1150.6 | -0.009 |
| 1150.7 | -0.01 |
| 1150.8 | -0.01 |
| 1150.9 | -0.01 |
| 1151.0 | -0.011 |
| 1151.1 | -0.011 |
| 1151.2 | -0.011 |
| 1151.3 | -0.012 |
| 1151.4 | -0.012 |
| 1151.5 | -0.012 |
| 1151.6 | -0.011 |
| 1151.7 | -0.011 |
| 1151.8 | -0.011 |
| 1151.9 | -0.011 |
| 1152.0 | -0.011 |
| 1152.1 | -0.011 |
| 1152.2 | -0.01 |
| 1152.3 | -0.01 |
| 1152.4 | -0.01 |
| 1152.5 | -0.01 |
| 1152.6 | -0.007 |
| 1152.7 | -0.006 |
| 1152.8 | -0.006 |
| 1152.9 | -0.005 |
| 1153.0 | -0.005 |
| 1153.1 | -0.004 |
| 1153.2 | -0.004 |
| 1153.3 | -0.003 |
| 1153.4 | -0.002 |
| 1153.5 | -0.002 |
| 1153.6 | -0.007 |
| 1153.7 | -0.007 |
| 1153.8 | -0.008 |
| 1153.9 | -0.008 |
| 1154.0 | -0.009 |
| 1154.1 | -0.009 |
| 1154.2 | -0.009 |
| 1154.3 | -0.01 |
| 1154.4 | -0.01 |
| 1154.5 | -0.011 |
| 1154.6 | -0.005 |
| 1154.7 | -0.005 |
| 1154.8 | -0.004 |
| 1154.9 | -0.004 |
| 1155.0 | -0.003 |
| 1155.1 | -0.003 |
| 1155.2 | -0.002 |
| 1155.3 | -0.002 |
| 1155.4 | -0.001 |
| 1155.5 | -0.001 |
| 1155.6 | -0.001 |
| 1155.7 | 0 |
| 1155.8 | 0 |
| 1155.9 | 0 |
| 1156.0 | 0.001 |
| 1156.1 | 0.001 |
| 1156.2 | 0.002 |
| 1156.3 | 0.002 |
| 1156.4 | 0.002 |
| 1156.5 | 0.003 |
| 1156.6 | -0.001 |
| 1156.7 | -0.001 |
| 1156.8 | -0.001 |
| 1156.9 | -0.002 |
| 1157.0 | -0.002 |
| 1157.1 | -0.002 |
| 1157.2 | -0.003 |
| 1157.3 | -0.003 |
| 1157.4 | -0.003 |
| 1157.5 | -0.003 |
| 1157.6 | -0.003 |
| 1157.7 | -0.004 |
| 1157.8 | -0.004 |
| 1157.9 | -0.004 |
| 1158.0 | -0.004 |
| 1158.1 | -0.005 |
| 1158.2 | -0.005 |
| 1158.3 | -0.005 |
| 1158.4 | -0.005 |
| 1158.5 | -0.006 |
| 1158.6 | -0.007 |
| 1158.7 | -0.007 |
| 1158.8 | -0.008 |
| 1158.9 | -0.008 |
| 1159.0 | -0.009 |
| 1159.1 | -0.009 |
| 1159.2 | -0.009 |
| 1159.3 | -0.01 |
| 1159.4 | -0.01 |
| 1159.5 | -0.011 |
| 1159.6 | -0.005 |
| 1159.7 | -0.004 |
| 1159.8 | -0.004 |
| 1159.9 | -0.003 |
| 1160.0 | -0.002 |
| 1160.1 | -0.002 |
| 1160.2 | -0.001 |
| 1160.3 | -0.001 |
| 1160.4 | 0 |
| 1160.5 | 0.001 |
| 1160.6 | -0.005 |
| 1160.7 | -0.006 |
| 1160.8 | -0.006 |
| 1160.9 | -0.007 |
| 1161.0 | -0.007 |
| 1161.1 | -0.008 |
| 1161.2 | -0.008 |
| 1161.3 | -0.009 |
| 1161.4 | -0.009 |
| 1161.5 | -0.01 |
| 1161.6 | -0.006 |
| 1161.7 | -0.006 |
| 1161.8 | -0.006 |
| 1161.9 | -0.006 |
| 1162.0 | -0.005 |
| 1162.1 | -0.005 |
| 1162.2 | -0.005 |
| 1162.3 | -0.005 |
| 1162.4 | -0.005 |
| 1162.5 | -0.004 |
| 1162.6 | -0.006 |
| 1162.7 | -0.006 |
| 1162.8 | -0.007 |
| 1162.9 | -0.007 |
| 1163.0 | -0.007 |
| 1163.1 | -0.007 |
| 1163.2 | -0.007 |
| 1163.3 | -0.007 |
| 1163.4 | -0.007 |
| 1163.5 | -0.007 |
| 1163.6 | -0.008 |
| 1163.7 | -0.008 |
| 1163.8 | -0.008 |
| 1163.9 | -0.009 |
| 1164.0 | -0.009 |
| 1164.1 | -0.009 |
| 1164.2 | -0.009 |
| 1164.3 | -0.01 |
| 1164.4 | -0.01 |
| 1164.5 | -0.01 |
| 1164.6 | -0.007 |
| 1164.7 | -0.006 |
| 1164.8 | -0.006 |
| 1164.9 | -0.005 |
| 1165.0 | -0.005 |
| 1165.1 | -0.005 |
| 1165.2 | -0.004 |
| 1165.3 | -0.004 |
| 1165.4 | -0.004 |
| 1165.5 | -0.003 |
| 1165.6 | -0.007 |
| 1165.7 | -0.007 |
| 1165.8 | -0.008 |
| 1165.9 | -0.008 |
| 1166.0 | -0.008 |
| 1166.1 | -0.009 |
| 1166.2 | -0.009 |
| 1166.3 | -0.009 |
| 1166.4 | -0.01 |
| 1166.5 | -0.01 |
| 1166.6 | -0.006 |
| 1166.7 | -0.006 |
| 1166.8 | -0.005 |
| 1166.9 | -0.005 |
| 1167.0 | -0.004 |
| 1167.1 | -0.004 |
| 1167.2 | -0.003 |
| 1167.3 | -0.003 |
| 1167.4 | -0.003 |
| 1167.5 | -0.002 |
| 1167.6 | -0.007 |
| 1167.7 | -0.007 |
| 1167.8 | -0.007 |
| 1167.9 | -0.008 |
| 1168.0 | -0.008 |
| 1168.1 | -0.008 |
| 1168.2 | -0.009 |
| 1168.3 | -0.009 |
| 1168.4 | -0.01 |
| 1168.5 | -0.01 |
| 1168.6 | -0.009 |
| 1168.7 | -0.009 |
| 1168.8 | -0.01 |
| 1168.9 | -0.01 |
| 1169.0 | -0.01 |
| 1169.1 | -0.01 |
| 1169.2 | -0.01 |
| 1169.3 | -0.011 |
| 1169.4 | -0.011 |
| 1169.5 | -0.011 |
| 1169.6 | -0.009 |
| 1169.7 | -0.009 |
| 1169.8 | -0.009 |
| 1169.9 | -0.009 |
| 1170.0 | -0.009 |
| 1170.1 | -0.009 |
| 1170.2 | -0.009 |
| 1170.3 | -0.008 |
| 1170.4 | -0.008 |
| 1170.5 | -0.008 |
| 1170.6 | -0.008 |
| 1170.7 | -0.008 |
| 1170.8 | -0.008 |
| 1170.9 | -0.008 |
| 1171.0 | -0.008 |
| 1171.1 | -0.007 |
| 1171.2 | -0.007 |
| 1171.3 | -0.007 |
| 1171.4 | -0.007 |
| 1171.5 | -0.007 |
| 1171.6 | -0.008 |
| 1171.7 | -0.008 |
| 1171.8 | -0.008 |
| 1171.9 | -0.008 |
| 1172.0 | -0.008 |
| 1172.1 | -0.009 |
| 1172.2 | -0.009 |
| 1172.3 | -0.009 |
| 1172.4 | -0.009 |
| 1172.5 | -0.009 |
| 1172.6 | -0.005 |
| 1172.7 | -0.005 |
| 1172.8 | -0.004 |
| 1172.9 | -0.004 |
| 1173.0 | -0.003 |
| 1173.1 | -0.003 |
| 1173.2 | -0.002 |
| 1173.3 | -0.002 |
| 1173.4 | -0.001 |
| 1173.5 | 0 |
| 1173.6 | -0.008 |
| 1173.7 | -0.009 |
| 1173.8 | -0.01 |
| 1173.9 | -0.01 |
| 1174.0 | -0.011 |
| 1174.1 | -0.012 |
| 1174.2 | -0.013 |
| 1174.3 | -0.014 |
| 1174.4 | -0.015 |
| 1174.5 | -0.015 |
| 1174.6 | -0.006 |
| 1174.7 | -0.005 |
| 1174.8 | -0.004 |
| 1174.9 | -0.003 |
| 1175.0 | -0.002 |
| 1175.1 | -0.001 |
| 1175.2 | 0 |
| 1175.3 | 0.001 |
| 1175.4 | 0.002 |
| 1175.5 | 0.003 |
| 1175.6 | -0.006 |
| 1175.7 | -0.006 |
| 1175.8 | -0.007 |
| 1175.9 | -0.008 |
| 1176.0 | -0.008 |
| 1176.1 | -0.009 |
| 1176.2 | -0.01 |
| 1176.3 | -0.01 |
| 1176.4 | -0.011 |
| 1176.5 | -0.012 |
| 1176.6 | -0.008 |
| 1176.7 | -0.008 |
| 1176.8 | -0.008 |
| 1176.9 | -0.008 |
| 1177.0 | -0.007 |
| 1177.1 | -0.007 |
| 1177.2 | -0.007 |
| 1177.3 | -0.007 |
| 1177.4 | -0.007 |
| 1177.5 | -0.007 |
| 1177.6 | -0.007 |
| 1177.7 | -0.007 |
| 1177.8 | -0.006 |
| 1177.9 | -0.006 |
| 1178.0 | -0.006 |
| 1178.1 | -0.006 |
| 1178.2 | -0.006 |
| 1178.3 | -0.006 |
| 1178.4 | -0.006 |
| 1178.5 | -0.006 |
| 1178.6 | -0.01 |
| 1178.7 | -0.01 |
| 1178.8 | -0.011 |
| 1178.9 | -0.011 |
| 1179.0 | -0.012 |
| 1179.1 | -0.013 |
| 1179.2 | -0.013 |
| 1179.3 | -0.014 |
| 1179.4 | -0.014 |
| 1179.5 | -0.015 |
| 1179.6 | -0.007 |
| 1179.7 | -0.007 |
| 1179.8 | -0.006 |
| 1179.9 | -0.005 |
| 1180.0 | -0.004 |
| 1180.1 | -0.003 |
| 1180.2 | -0.003 |
| 1180.3 | -0.002 |
| 1180.4 | -0.001 |
| 1180.5 | 0 |
| 1180.6 | -0.005 |
| 1180.7 | -0.005 |
| 1180.8 | -0.005 |
| 1180.9 | -0.005 |
| 1181.0 | -0.005 |
| 1181.1 | -0.005 |
| 1181.2 | -0.005 |
| 1181.3 | -0.005 |
| 1181.4 | -0.005 |
| 1181.5 | -0.005 |
| 1181.6 | -0.007 |
| 1181.7 | -0.008 |
| 1181.8 | -0.008 |
| 1181.9 | -0.009 |
| 1182.0 | -0.009 |
| 1182.1 | -0.009 |
| 1182.2 | -0.01 |
| 1182.3 | -0.01 |
| 1182.4 | -0.011 |
| 1182.5 | -0.011 |
| 1182.6 | -0.011 |
| 1182.7 | -0.011 |
| 1182.8 | -0.011 |
| 1182.9 | -0.012 |
| 1183.0 | -0.012 |
| 1183.1 | -0.012 |
| 1183.2 | -0.013 |
| 1183.3 | -0.013 |
| 1183.4 | -0.013 |
| 1183.5 | -0.013 |
| 1183.6 | -0.008 |
| 1183.7 | -0.008 |
| 1183.8 | -0.007 |
| 1183.9 | -0.007 |
| 1184.0 | -0.006 |
| 1184.1 | -0.006 |
| 1184.2 | -0.005 |
| 1184.3 | -0.004 |
| 1184.4 | -0.004 |
| 1184.5 | -0.003 |
| 1184.6 | -0.01 |
| 1184.7 | -0.01 |
| 1184.8 | -0.011 |
| 1184.9 | -0.011 |
| 1185.0 | -0.012 |
| 1185.1 | -0.012 |
| 1185.2 | -0.013 |
| 1185.3 | -0.014 |
| 1185.4 | -0.014 |
| 1185.5 | -0.015 |
| 1185.6 | -0.013 |
| 1185.7 | -0.013 |
| 1185.8 | -0.013 |
| 1185.9 | -0.013 |
| 1186.0 | -0.014 |
| 1186.1 | -0.014 |
| 1186.2 | -0.014 |
| 1186.3 | -0.014 |
| 1186.4 | -0.014 |
| 1186.5 | -0.015 |
| 1186.6 | -0.012 |
| 1186.7 | -0.011 |
| 1186.8 | -0.011 |
| 1186.9 | -0.01 |
| 1187.0 | -0.01 |
| 1187.1 | -0.01 |
| 1187.2 | -0.009 |
| 1187.3 | -0.009 |
| 1187.4 | -0.009 |
| 1187.5 | -0.008 |
| 1187.6 | -0.011 |
| 1187.7 | -0.011 |
| 1187.8 | -0.011 |
| 1187.9 | -0.011 |
| 1188.0 | -0.011 |
| 1188.1 | -0.011 |
| 1188.2 | -0.011 |
| 1188.3 | -0.012 |
| 1188.4 | -0.012 |
| 1188.5 | -0.012 |
| 1188.6 | -0.011 |
| 1188.7 | -0.011 |
| 1188.8 | -0.01 |
| 1188.9 | -0.01 |
| 1189.0 | -0.01 |
| 1189.1 | -0.01 |
| 1189.2 | -0.01 |
| 1189.3 | -0.01 |
| 1189.4 | -0.01 |
| 1189.5 | -0.01 |
| 1189.6 | -0.008 |
| 1189.7 | -0.008 |
| 1189.8 | -0.008 |
| 1189.9 | -0.008 |
| 1190.0 | -0.007 |
| 1190.1 | -0.007 |
| 1190.2 | -0.007 |
| 1190.3 | -0.006 |
| 1190.4 | -0.006 |
| 1190.5 | -0.006 |
| 1190.6 | -0.01 |
| 1190.7 | -0.011 |
| 1190.8 | -0.011 |
| 1190.9 | -0.012 |
| 1191.0 | -0.012 |
| 1191.1 | -0.013 |
| 1191.2 | -0.013 |
| 1191.3 | -0.014 |
| 1191.4 | -0.014 |
| 1191.5 | -0.015 |
| 1191.6 | -0.01 |
| 1191.7 | -0.01 |
| 1191.8 | -0.01 |
| 1191.9 | -0.009 |
| 1192.0 | -0.009 |
| 1192.1 | -0.009 |
| 1192.2 | -0.009 |
| 1192.3 | -0.008 |
| 1192.4 | -0.008 |
| 1192.5 | -0.008 |
| 1192.6 | -0.009 |
| 1192.7 | -0.009 |
| 1192.8 | -0.009 |
| 1192.9 | -0.009 |
| 1193.0 | -0.009 |
| 1193.1 | -0.009 |
| 1193.2 | -0.009 |
| 1193.3 | -0.009 |
| 1193.4 | -0.009 |
| 1193.5 | -0.009 |
| 1193.6 | -0.006 |
| 1193.7 | -0.006 |
| 1193.8 | -0.005 |
| 1193.9 | -0.005 |
| 1194.0 | -0.005 |
| 1194.1 | -0.004 |
| 1194.2 | -0.004 |
| 1194.3 | -0.003 |
| 1194.4 | -0.003 |
| 1194.5 | -0.002 |
| 1194.6 | -0.007 |
| 1194.7 | -0.008 |
| 1194.8 | -0.008 |
| 1194.9 | -0.008 |
| 1195.0 | -0.009 |
| 1195.1 | -0.009 |
| 1195.2 | -0.01 |
| 1195.3 | -0.01 |
| 1195.4 | -0.011 |
| 1195.5 | -0.011 |
| 1195.6 | -0.008 |
| 1195.7 | -0.008 |
| 1195.8 | -0.008 |
| 1195.9 | -0.007 |
| 1196.0 | -0.007 |
| 1196.1 | -0.007 |
| 1196.2 | -0.007 |
| 1196.3 | -0.007 |
| 1196.4 | -0.006 |
| 1196.5 | -0.006 |
| 1196.6 | -0.008 |
| 1196.7 | -0.008 |
| 1196.8 | -0.008 |
| 1196.9 | -0.009 |
| 1197.0 | -0.009 |
| 1197.1 | -0.009 |
| 1197.2 | -0.009 |
| 1197.3 | -0.009 |
| 1197.4 | -0.009 |
| 1197.5 | -0.01 |
| 1197.6 | -0.008 |
| 1197.7 | -0.008 |
| 1197.8 | -0.008 |
| 1197.9 | -0.007 |
| 1198.0 | -0.007 |
| 1198.1 | -0.007 |
| 1198.2 | -0.007 |
| 1198.3 | -0.007 |
| 1198.4 | -0.007 |
| 1198.5 | -0.007 |
| 1198.6 | -0.007 |
| 1198.7 | -0.007 |
| 1198.8 | -0.006 |
| 1198.9 | -0.006 |
| 1199.0 | -0.006 |
| 1199.1 | -0.006 |
| 1199.2 | -0.006 |
| 1199.3 | -0.006 |
| 1199.4 | -0.006 |
| 1199.5 | -0.006 |
| 1199.6 | -0.008 |
| 1199.7 | -0.008 |
| 1199.8 | -0.008 |
| 1199.9 | -0.008 |
| 1200.0 | -0.009 |
| 1200.1 | -0.009 |
| 1200.2 | -0.009 |
| 1200.3 | -0.009 |
| 1200.4 | -0.01 |
| 1200.5 | -0.01 |
| 1200.6 | -0.007 |
| 1200.7 | -0.007 |
| 1200.8 | -0.007 |
| 1200.9 | -0.006 |
| 1201.0 | -0.006 |
| 1201.1 | -0.006 |
| 1201.2 | -0.005 |
| 1201.3 | -0.005 |
| 1201.4 | -0.005 |
| 1201.5 | -0.005 |
| 1201.6 | -0.004 |
| 1201.7 | -0.003 |
| 1201.8 | -0.003 |
| 1201.9 | -0.003 |
| 1202.0 | -0.002 |
| 1202.1 | -0.002 |
| 1202.2 | -0.001 |
| 1202.3 | -0.001 |
| 1202.4 | -0.001 |
| 1202.5 | 0 |
| 1202.6 | -0.007 |
| 1202.7 | -0.008 |
| 1202.8 | -0.008 |
| 1202.9 | -0.009 |
| 1203.0 | -0.01 |
| 1203.1 | -0.011 |
| 1203.2 | -0.011 |
| 1203.3 | -0.012 |
| 1203.4 | -0.013 |
| 1203.5 | -0.014 |
| 1203.6 | -0.006 |
| 1203.7 | -0.005 |
| 1203.8 | -0.005 |
| 1203.9 | -0.004 |
| 1204.0 | -0.004 |
| 1204.1 | -0.003 |
| 1204.2 | -0.002 |
| 1204.3 | -0.002 |
| 1204.4 | -0.001 |
| 1204.5 | 0 |
| 1204.6 | -0.006 |
| 1204.7 | -0.006 |
| 1204.8 | -0.007 |
| 1204.9 | -0.007 |
| 1205.0 | -0.007 |
| 1205.1 | -0.008 |
| 1205.2 | -0.008 |
| 1205.3 | -0.008 |
| 1205.4 | -0.009 |
| 1205.5 | -0.009 |
| 1205.6 | -0.009 |
| 1205.7 | -0.009 |
| 1205.8 | -0.009 |
| 1205.9 | -0.009 |
| 1206.0 | -0.009 |
| 1206.1 | -0.01 |
| 1206.2 | -0.01 |
| 1206.3 | -0.01 |
| 1206.4 | -0.01 |
| 1206.5 | -0.011 |
| 1206.6 | -0.009 |
| 1206.7 | -0.009 |
| 1206.8 | -0.008 |
| 1206.9 | -0.008 |
| 1207.0 | -0.008 |
| 1207.1 | -0.008 |
| 1207.2 | -0.008 |
| 1207.3 | -0.008 |
| 1207.4 | -0.008 |
| 1207.5 | -0.007 |
| 1207.6 | -0.007 |
| 1207.7 | -0.007 |
| 1207.8 | -0.007 |
| 1207.9 | -0.007 |
| 1208.0 | -0.007 |
| 1208.1 | -0.007 |
| 1208.2 | -0.007 |
| 1208.3 | -0.006 |
| 1208.4 | -0.006 |
| 1208.5 | -0.006 |
| 1208.6 | -0.007 |
| 1208.7 | -0.007 |
| 1208.8 | -0.007 |
| 1208.9 | -0.007 |
| 1209.0 | -0.007 |
| 1209.1 | -0.007 |
| 1209.2 | -0.007 |
| 1209.3 | -0.008 |
| 1209.4 | -0.008 |
| 1209.5 | -0.008 |
| 1209.6 | -0.01 |
| 1209.7 | -0.01 |
| 1209.8 | -0.01 |
| 1209.9 | -0.011 |
| 1210.0 | -0.011 |
| 1210.1 | -0.011 |
| 1210.2 | -0.012 |
| 1210.3 | -0.012 |
| 1210.4 | -0.012 |
| 1210.5 | -0.013 |
| 1210.6 | -0.01 |
| 1210.7 | -0.01 |
| 1210.8 | -0.01 |
| 1210.9 | -0.01 |
| 1211.0 | -0.01 |
| 1211.1 | -0.01 |
| 1211.2 | -0.01 |
| 1211.3 | -0.01 |
| 1211.4 | -0.01 |
| 1211.5 | -0.01 |
| 1211.6 | -0.01 |
| 1211.7 | -0.01 |
| 1211.8 | -0.01 |
| 1211.9 | -0.01 |
| 1212.0 | -0.01 |
| 1212.1 | -0.01 |
| 1212.2 | -0.01 |
| 1212.3 | -0.01 |
| 1212.4 | -0.01 |
| 1212.5 | -0.01 |
| 1212.6 | -0.008 |
| 1212.7 | -0.007 |
| 1212.8 | -0.007 |
| 1212.9 | -0.007 |
| 1213.0 | -0.006 |
| 1213.1 | -0.006 |
| 1213.2 | -0.006 |
| 1213.3 | -0.005 |
| 1213.4 | -0.005 |
| 1213.5 | -0.005 |
| 1213.6 | -0.008 |
| 1213.7 | -0.009 |
| 1213.8 | -0.009 |
| 1213.9 | -0.009 |
| 1214.0 | -0.01 |
| 1214.1 | -0.01 |
| 1214.2 | -0.01 |
| 1214.3 | -0.01 |
| 1214.4 | -0.011 |
| 1214.5 | -0.011 |
| 1214.6 | -0.01 |
| 1214.7 | -0.01 |
| 1214.8 | -0.01 |
| 1214.9 | -0.01 |
| 1215.0 | -0.01 |
| 1215.1 | -0.01 |
| 1215.2 | -0.01 |
| 1215.3 | -0.01 |
| 1215.4 | -0.011 |
| 1215.5 | -0.011 |
| 1215.6 | -0.01 |
| 1215.7 | -0.01 |
| 1215.8 | -0.01 |
| 1215.9 | -0.01 |
| 1216.0 | -0.01 |
| 1216.1 | -0.01 |
| 1216.2 | -0.01 |
| 1216.3 | -0.01 |
| 1216.4 | -0.01 |
| 1216.5 | -0.01 |
| 1216.6 | -0.011 |
| 1216.7 | -0.011 |
| 1216.8 | -0.011 |
| 1216.9 | -0.012 |
| 1217.0 | -0.012 |
| 1217.1 | -0.012 |
| 1217.2 | -0.012 |
| 1217.3 | -0.012 |
| 1217.4 | -0.013 |
| 1217.5 | -0.013 |
| 1217.6 | -0.011 |
| 1217.7 | -0.011 |
| 1217.8 | -0.011 |
| 1217.9 | -0.01 |
| 1218.0 | -0.01 |
| 1218.1 | -0.01 |
| 1218.2 | -0.01 |
| 1218.3 | -0.01 |
| 1218.4 | -0.01 |
| 1218.5 | -0.01 |
| 1218.6 | -0.009 |
| 1218.7 | -0.008 |
| 1218.8 | -0.008 |
| 1218.9 | -0.008 |
| 1219.0 | -0.007 |
| 1219.1 | -0.007 |
| 1219.2 | -0.007 |
| 1219.3 | -0.006 |
| 1219.4 | -0.006 |
| 1219.5 | -0.006 |
| 1219.6 | -0.009 |
| 1219.7 | -0.009 |
| 1219.8 | -0.009 |
| 1219.9 | -0.01 |
| 1220.0 | -0.01 |
| 1220.1 | -0.01 |
| 1220.2 | -0.01 |
| 1220.3 | -0.011 |
| 1220.4 | -0.011 |
| 1220.5 | -0.011 |
| 1220.6 | -0.012 |
| 1220.7 | -0.013 |
| 1220.8 | -0.013 |
| 1220.9 | -0.014 |
| 1221.0 | -0.014 |
| 1221.1 | -0.014 |
| 1221.2 | -0.015 |
| 1221.3 | -0.015 |
| 1221.4 | -0.016 |
| 1221.5 | -0.016 |
| 1221.6 | -0.014 |
| 1221.7 | -0.013 |
| 1221.8 | -0.013 |
| 1221.9 | -0.013 |
| 1222.0 | -0.013 |
| 1222.1 | -0.013 |
| 1222.2 | -0.013 |
| 1222.3 | -0.013 |
| 1222.4 | -0.013 |
| 1222.5 | -0.013 |
| 1222.6 | -0.014 |
| 1222.7 | -0.014 |
| 1222.8 | -0.014 |
| 1222.9 | -0.014 |
| 1223.0 | -0.014 |
| 1223.1 | -0.014 |
| 1223.2 | -0.015 |
| 1223.3 | -0.015 |
| 1223.4 | -0.015 |
| 1223.5 | -0.015 |
| 1223.6 | -0.015 |
| 1223.7 | -0.016 |
| 1223.8 | -0.016 |
| 1223.9 | -0.016 |
| 1224.0 | -0.016 |
| 1224.1 | -0.016 |
| 1224.2 | -0.017 |
| 1224.3 | -0.017 |
| 1224.4 | -0.017 |
| 1224.5 | -0.017 |
| 1224.6 | -0.013 |
| 1224.7 | -0.013 |
| 1224.8 | -0.012 |
| 1224.9 | -0.011 |
| 1225.0 | -0.011 |
| 1225.1 | -0.01 |
| 1225.2 | -0.01 |
| 1225.3 | -0.009 |
| 1225.4 | -0.009 |
| 1225.5 | -0.008 |
| 1225.6 | -0.009 |
| 1225.7 | -0.009 |
| 1225.8 | -0.008 |
| 1225.9 | -0.008 |
| 1226.0 | -0.008 |
| 1226.1 | -0.008 |
| 1226.2 | -0.007 |
| 1226.3 | -0.007 |
| 1226.4 | -0.007 |
| 1226.5 | -0.006 |
| 1226.6 | -0.011 |
| 1226.7 | -0.011 |
| 1226.8 | -0.012 |
| 1226.9 | -0.012 |
| 1227.0 | -0.012 |
| 1227.1 | -0.013 |
| 1227.2 | -0.013 |
| 1227.3 | -0.014 |
| 1227.4 | -0.014 |
| 1227.5 | -0.015 |
| 1227.6 | -0.01 |
| 1227.7 | -0.01 |
| 1227.8 | -0.01 |
| 1227.9 | -0.009 |
| 1228.0 | -0.009 |
| 1228.1 | -0.009 |
| 1228.2 | -0.008 |
| 1228.3 | -0.008 |
| 1228.4 | -0.008 |
| 1228.5 | -0.007 |
| 1228.6 | -0.008 |
| 1228.7 | -0.008 |
| 1228.8 | -0.008 |
| 1228.9 | -0.008 |
| 1229.0 | -0.008 |
| 1229.1 | -0.008 |
| 1229.2 | -0.008 |
| 1229.3 | -0.008 |
| 1229.4 | -0.007 |
| 1229.5 | -0.007 |
| 1229.6 | -0.01 |
| 1229.7 | -0.01 |
| 1229.8 | -0.01 |
| 1229.9 | -0.011 |
| 1230.0 | -0.011 |
| 1230.1 | -0.011 |
| 1230.2 | -0.012 |
| 1230.3 | -0.012 |
| 1230.4 | -0.012 |
| 1230.5 | -0.013 |
| 1230.6 | -0.01 |
| 1230.7 | -0.01 |
| 1230.8 | -0.01 |
| 1230.9 | -0.01 |
| 1231.0 | -0.01 |
| 1231.1 | -0.01 |
| 1231.2 | -0.009 |
| 1231.3 | -0.009 |
| 1231.4 | -0.009 |
| 1231.5 | -0.009 |
| 1231.6 | -0.015 |
| 1231.7 | -0.016 |
| 1231.8 | -0.017 |
| 1231.9 | -0.018 |
| 1232.0 | -0.019 |
| 1232.1 | -0.02 |
| 1232.2 | -0.021 |
| 1232.3 | -0.022 |
| 1232.4 | -0.023 |
| 1232.5 | -0.024 |
| 1232.6 | -0.018 |
| 1232.7 | -0.018 |
| 1232.8 | -0.018 |
| 1232.9 | -0.018 |
| 1233.0 | -0.018 |
| 1233.1 | -0.018 |
| 1233.2 | -0.018 |
| 1233.3 | -0.018 |
| 1233.4 | -0.017 |
| 1233.5 | -0.017 |
| 1233.6 | -0.012 |
| 1233.7 | -0.011 |
| 1233.8 | -0.01 |
| 1233.9 | -0.009 |
| 1234.0 | -0.008 |
| 1234.1 | -0.007 |
| 1234.2 | -0.006 |
| 1234.3 | -0.005 |
| 1234.4 | -0.004 |
| 1234.5 | -0.003 |
| 1234.6 | -0.008 |
| 1234.7 | -0.007 |
| 1234.8 | -0.007 |
| 1234.9 | -0.007 |
| 1235.0 | -0.007 |
| 1235.1 | -0.007 |
| 1235.2 | -0.007 |
| 1235.3 | -0.007 |
| 1235.4 | -0.007 |
| 1235.5 | -0.007 |
| 1235.6 | -0.011 |
| 1235.7 | -0.012 |
| 1235.8 | -0.013 |
| 1235.9 | -0.014 |
| 1236.0 | -0.014 |
| 1236.1 | -0.015 |
| 1236.2 | -0.016 |
| 1236.3 | -0.016 |
| 1236.4 | -0.017 |
| 1236.5 | -0.018 |
| 1236.6 | -0.012 |
| 1236.7 | -0.012 |
| 1236.8 | -0.011 |
| 1236.9 | -0.011 |
| 1237.0 | -0.01 |
| 1237.1 | -0.01 |
| 1237.2 | -0.01 |
| 1237.3 | -0.009 |
| 1237.4 | -0.009 |
| 1237.5 | -0.008 |
| 1237.6 | -0.008 |
| 1237.7 | -0.008 |
| 1237.8 | -0.007 |
| 1237.9 | -0.007 |
| 1238.0 | -0.007 |
| 1238.1 | -0.006 |
| 1238.2 | -0.006 |
| 1238.3 | -0.005 |
| 1238.4 | -0.005 |
| 1238.5 | -0.005 |
| 1238.6 | -0.008 |
| 1238.7 | -0.008 |
| 1238.8 | -0.008 |
| 1238.9 | -0.008 |
| 1239.0 | -0.008 |
| 1239.1 | -0.008 |
| 1239.2 | -0.008 |
| 1239.3 | -0.009 |
| 1239.4 | -0.009 |
| 1239.5 | -0.009 |
| 1239.6 | -0.009 |
| 1239.7 | -0.01 |
| 1239.8 | -0.01 |
| 1239.9 | -0.01 |
| 1240.0 | -0.01 |
| 1240.1 | -0.01 |
| 1240.2 | -0.011 |
| 1240.3 | -0.011 |
| 1240.4 | -0.011 |
| 1240.5 | -0.011 |
| 1240.6 | -0.007 |
| 1240.7 | -0.007 |
| 1240.8 | -0.006 |
| 1240.9 | -0.006 |
| 1241.0 | -0.005 |
| 1241.1 | -0.005 |
| 1241.2 | -0.004 |
| 1241.3 | -0.004 |
| 1241.4 | -0.003 |
| 1241.5 | -0.003 |
| 1241.6 | -0.005 |
| 1241.7 | -0.005 |
| 1241.8 | -0.005 |
| 1241.9 | -0.005 |
| 1242.0 | -0.005 |
| 1242.1 | -0.005 |
| 1242.2 | -0.005 |
| 1242.3 | -0.005 |
| 1242.4 | -0.005 |
| 1242.5 | -0.005 |
| 1242.6 | -0.003 |
| 1242.7 | -0.003 |
| 1242.8 | -0.002 |
| 1242.9 | -0.002 |
| 1243.0 | -0.002 |
| 1243.1 | -0.001 |
| 1243.2 | -0.001 |
| 1243.3 | 0 |
| 1243.4 | 0 |
| 1243.5 | 0 |
| 1243.6 | -0.003 |
| 1243.7 | -0.003 |
| 1243.8 | -0.003 |
| 1243.9 | -0.003 |
| 1244.0 | -0.004 |
| 1244.1 | -0.004 |
| 1244.2 | -0.004 |
| 1244.3 | -0.004 |
| 1244.4 | -0.004 |
| 1244.5 | -0.005 |
| 1244.6 | -0.003 |
| 1244.7 | -0.003 |
| 1244.8 | -0.003 |
| 1244.9 | -0.002 |
| 1245.0 | -0.002 |
| 1245.1 | -0.002 |
| 1245.2 | -0.002 |
| 1245.3 | -0.002 |
| 1245.4 | -0.002 |
| 1245.5 | -0.002 |
| 1245.6 | -0.004 |
| 1245.7 | -0.004 |
| 1245.8 | -0.004 |
| 1245.9 | -0.004 |
| 1246.0 | -0.005 |
| 1246.1 | -0.005 |
| 1246.2 | -0.005 |
| 1246.3 | -0.005 |
| 1246.4 | -0.006 |
| 1246.5 | -0.006 |
| 1246.6 | -0.001 |
| 1246.7 | -0.001 |
| 1246.8 | 0 |
| 1246.9 | 0 |
| 1247.0 | 0.001 |
| 1247.1 | 0.001 |
| 1247.2 | 0.002 |
| 1247.3 | 0.002 |
| 1247.4 | 0.003 |
| 1247.5 | 0.003 |
| 1247.6 | -0.004 |
| 1247.7 | -0.005 |
| 1247.8 | -0.006 |
| 1247.9 | -0.006 |
| 1248.0 | -0.007 |
| 1248.1 | -0.008 |
| 1248.2 | -0.009 |
| 1248.3 | -0.009 |
| 1248.4 | -0.01 |
| 1248.5 | -0.011 |
| 1248.6 | -0.004 |
| 1248.7 | -0.003 |
| 1248.8 | -0.003 |
| 1248.9 | -0.002 |
| 1249.0 | -0.002 |
| 1249.1 | -0.001 |
| 1249.2 | 0 |
| 1249.3 | 0 |
| 1249.4 | 0.001 |
| 1249.5 | 0.001 |
| 1249.6 | 0.002 |
| 1249.7 | 0.002 |
| 1249.8 | 0.003 |
| 1249.9 | 0.003 |
| 1250.0 | 0.004 |
| 1250.1 | 0.004 |
| 1250.2 | 0.005 |
| 1250.3 | 0.005 |
| 1250.4 | 0.006 |
| 1250.5 | 0.006 |
| 1250.6 | 0.005 |
| 1250.7 | 0.005 |
| 1250.8 | 0.005 |
| 1250.9 | 0.005 |
| 1251.0 | 0.006 |
| 1251.1 | 0.006 |
| 1251.2 | 0.006 |
| 1251.3 | 0.006 |
| 1251.4 | 0.006 |
| 1251.5 | 0.007 |
| 1251.6 | 0.004 |
| 1251.7 | 0.003 |
| 1251.8 | 0.003 |
| 1251.9 | 0.003 |
| 1252.0 | 0.002 |
| 1252.1 | 0.002 |
| 1252.2 | 0.001 |
| 1252.3 | 0.001 |
| 1252.4 | 0.001 |
| 1252.5 | 0 |
| 1252.6 | 0.003 |
| 1252.7 | 0.003 |
| 1252.8 | 0.003 |
| 1252.9 | 0.004 |
| 1253.0 | 0.004 |
| 1253.1 | 0.004 |
| 1253.2 | 0.004 |
| 1253.3 | 0.004 |
| 1253.4 | 0.004 |
| 1253.5 | 0.005 |
| 1253.6 | 0.004 |
| 1253.7 | 0.004 |
| 1253.8 | 0.004 |
| 1253.9 | 0.004 |
| 1254.0 | 0.004 |
| 1254.1 | 0.004 |
| 1254.2 | 0.004 |
| 1254.3 | 0.004 |
| 1254.4 | 0.004 |
| 1254.5 | 0.004 |
| 1254.6 | 0.005 |
| 1254.7 | 0.005 |
| 1254.8 | 0.006 |
| 1254.9 | 0.006 |
| 1255.0 | 0.006 |
| 1255.1 | 0.006 |
| 1255.2 | 0.006 |
| 1255.3 | 0.007 |
| 1255.4 | 0.007 |
| 1255.5 | 0.007 |
| 1255.6 | 0.001 |
| 1255.7 | 0 |
| 1255.8 | 0 |
| 1255.9 | -0.001 |
| 1256.0 | -0.002 |
| 1256.1 | -0.003 |
| 1256.2 | -0.004 |
| 1256.3 | -0.004 |
| 1256.4 | -0.005 |
| 1256.5 | -0.006 |
| 1256.6 | -0.004 |
| 1256.7 | -0.004 |
| 1256.8 | -0.004 |
| 1256.9 | -0.004 |
| 1257.0 | -0.005 |
| 1257.1 | -0.005 |
| 1257.2 | -0.005 |
| 1257.3 | -0.005 |
| 1257.4 | -0.006 |
| 1257.5 | -0.006 |
| 1257.6 | -0.005 |
| 1257.7 | -0.005 |
| 1257.8 | -0.005 |
| 1257.9 | -0.005 |
| 1258.0 | -0.005 |
| 1258.1 | -0.005 |
| 1258.2 | -0.005 |
| 1258.3 | -0.005 |
| 1258.4 | -0.005 |
| 1258.5 | -0.005 |
| 1258.6 | -0.008 |
| 1258.7 | -0.009 |
| 1258.8 | -0.009 |
| 1258.9 | -0.01 |
| 1259.0 | -0.01 |
| 1259.1 | -0.011 |
| 1259.2 | -0.011 |
| 1259.3 | -0.012 |
| 1259.4 | -0.012 |
| 1259.5 | -0.013 |
| 1259.6 | -0.011 |
| 1259.7 | -0.011 |
| 1259.8 | -0.011 |
| 1259.9 | -0.011 |
| 1260.0 | -0.011 |
| 1260.1 | -0.011 |
| 1260.2 | -0.011 |
| 1260.3 | -0.011 |
| 1260.4 | -0.011 |
| 1260.5 | -0.011 |
| 1260.6 | -0.008 |
| 1260.7 | -0.008 |
| 1260.8 | -0.007 |
| 1260.9 | -0.007 |
| 1261.0 | -0.007 |
| 1261.1 | -0.006 |
| 1261.2 | -0.006 |
| 1261.3 | -0.005 |
| 1261.4 | -0.005 |
| 1261.5 | -0.004 |
| 1261.6 | -0.004 |
| 1261.7 | -0.003 |
| 1261.8 | -0.003 |
| 1261.9 | -0.003 |
| 1262.0 | -0.002 |
| 1262.1 | -0.002 |
| 1262.2 | -0.001 |
| 1262.3 | -0.001 |
| 1262.4 | 0 |
| 1262.5 | 0 |
| 1262.6 | 0.001 |
| 1262.7 | 0.002 |
| 1262.8 | 0.003 |
| 1262.9 | 0.003 |
| 1263.0 | 0.004 |
| 1263.1 | 0.004 |
| 1263.2 | 0.005 |
| 1263.3 | 0.005 |
| 1263.4 | 0.006 |
| 1263.5 | 0.007 |
| 1263.6 | -0.001 |
| 1263.7 | -0.002 |
| 1263.8 | -0.002 |
| 1263.9 | -0.003 |
| 1264.0 | -0.004 |
| 1264.1 | -0.005 |
| 1264.2 | -0.005 |
| 1264.3 | -0.006 |
| 1264.4 | -0.007 |
| 1264.5 | -0.008 |
| 1264.6 | -0.006 |
| 1264.7 | -0.006 |
| 1264.8 | -0.006 |
| 1264.9 | -0.007 |
| 1265.0 | -0.007 |
| 1265.1 | -0.007 |
| 1265.2 | -0.008 |
| 1265.3 | -0.008 |
| 1265.4 | -0.008 |
| 1265.5 | -0.009 |
| 1265.6 | -0.004 |
| 1265.7 | -0.003 |
| 1265.8 | -0.003 |
| 1265.9 | -0.002 |
| 1266.0 | -0.002 |
| 1266.1 | -0.001 |
| 1266.2 | -0.001 |
| 1266.3 | 0 |
| 1266.4 | 0 |
| 1266.5 | 0.001 |
| 1266.6 | -0.003 |
| 1266.7 | -0.003 |
| 1266.8 | -0.003 |
| 1266.9 | -0.003 |
| 1267.0 | -0.004 |
| 1267.1 | -0.004 |
| 1267.2 | -0.004 |
| 1267.3 | -0.004 |
| 1267.4 | -0.004 |
| 1267.5 | -0.004 |
| 1267.6 | -0.006 |
| 1267.7 | -0.007 |
| 1267.8 | -0.007 |
| 1267.9 | -0.008 |
| 1268.0 | -0.008 |
| 1268.1 | -0.008 |
| 1268.2 | -0.009 |
| 1268.3 | -0.009 |
| 1268.4 | -0.01 |
| 1268.5 | -0.01 |
| 1268.6 | -0.009 |
| 1268.7 | -0.009 |
| 1268.8 | -0.009 |
| 1268.9 | -0.01 |
| 1269.0 | -0.01 |
| 1269.1 | -0.01 |
| 1269.2 | -0.01 |
| 1269.3 | -0.01 |
| 1269.4 | -0.011 |
| 1269.5 | -0.011 |
| 1269.6 | -0.007 |
| 1269.7 | -0.007 |
| 1269.8 | -0.007 |
| 1269.9 | -0.006 |
| 1270.0 | -0.006 |
| 1270.1 | -0.005 |
| 1270.2 | -0.005 |
| 1270.3 | -0.005 |
| 1270.4 | -0.004 |
| 1270.5 | -0.004 |
| 1270.6 | -0.006 |
| 1270.7 | -0.007 |
| 1270.8 | -0.007 |
| 1270.9 | -0.007 |
| 1271.0 | -0.007 |
| 1271.1 | -0.007 |
| 1271.2 | -0.007 |
| 1271.3 | -0.007 |
| 1271.4 | -0.007 |
| 1271.5 | -0.007 |
| 1271.6 | -0.009 |
| 1271.7 | -0.009 |
| 1271.8 | -0.01 |
| 1271.9 | -0.01 |
| 1272.0 | -0.01 |
| 1272.1 | -0.01 |
| 1272.2 | -0.011 |
| 1272.3 | -0.011 |
| 1272.4 | -0.011 |
| 1272.5 | -0.012 |
| 1272.6 | -0.011 |
| 1272.7 | -0.011 |
| 1272.8 | -0.011 |
| 1272.9 | -0.011 |
| 1273.0 | -0.011 |
| 1273.1 | -0.011 |
| 1273.2 | -0.011 |
| 1273.3 | -0.011 |
| 1273.4 | -0.011 |
| 1273.5 | -0.011 |
| 1273.6 | -0.008 |
| 1273.7 | -0.007 |
| 1273.8 | -0.007 |
| 1273.9 | -0.006 |
| 1274.0 | -0.006 |
| 1274.1 | -0.005 |
| 1274.2 | -0.005 |
| 1274.3 | -0.004 |
| 1274.4 | -0.003 |
| 1274.5 | -0.003 |
| 1274.6 | -0.005 |
| 1274.7 | -0.005 |
| 1274.8 | -0.005 |
| 1274.9 | -0.005 |
| 1275.0 | -0.005 |
| 1275.1 | -0.005 |
| 1275.2 | -0.005 |
| 1275.3 | -0.005 |
| 1275.4 | -0.004 |
| 1275.5 | -0.004 |
| 1275.6 | -0.005 |
| 1275.7 | -0.004 |
| 1275.8 | -0.004 |
| 1275.9 | -0.004 |
| 1276.0 | -0.004 |
| 1276.1 | -0.004 |
| 1276.2 | -0.004 |
| 1276.3 | -0.004 |
| 1276.4 | -0.004 |
| 1276.5 | -0.004 |
| 1276.6 | -0.006 |
| 1276.7 | -0.007 |
| 1276.8 | -0.007 |
| 1276.9 | -0.007 |
| 1277.0 | -0.008 |
| 1277.1 | -0.008 |
| 1277.2 | -0.008 |
| 1277.3 | -0.009 |
| 1277.4 | -0.009 |
| 1277.5 | -0.009 |
| 1277.6 | -0.007 |
| 1277.7 | -0.007 |
| 1277.8 | -0.007 |
| 1277.9 | -0.007 |
| 1278.0 | -0.007 |
| 1278.1 | -0.007 |
| 1278.2 | -0.007 |
| 1278.3 | -0.007 |
| 1278.4 | -0.007 |
| 1278.5 | -0.006 |
| 1278.6 | -0.007 |
| 1278.7 | -0.007 |
| 1278.8 | -0.007 |
| 1278.9 | -0.007 |
| 1279.0 | -0.008 |
| 1279.1 | -0.008 |
| 1279.2 | -0.008 |
| 1279.3 | -0.008 |
| 1279.4 | -0.008 |
| 1279.5 | -0.008 |
| 1279.6 | -0.008 |
| 1279.7 | -0.007 |
| 1279.8 | -0.007 |
| 1279.9 | -0.007 |
| 1280.0 | -0.007 |
| 1280.1 | -0.007 |
| 1280.2 | -0.007 |
| 1280.3 | -0.007 |
| 1280.4 | -0.007 |
| 1280.5 | -0.007 |
| 1280.6 | -0.009 |
| 1280.7 | -0.009 |
| 1280.8 | -0.009 |
| 1280.9 | -0.01 |
| 1281.0 | -0.01 |
| 1281.1 | -0.01 |
| 1281.2 | -0.01 |
| 1281.3 | -0.011 |
| 1281.4 | -0.011 |
| 1281.5 | -0.011 |
| 1281.6 | -0.011 |
| 1281.7 | -0.011 |
| 1281.8 | -0.012 |
| 1281.9 | -0.012 |
| 1282.0 | -0.012 |
| 1282.1 | -0.012 |
| 1282.2 | -0.012 |
| 1282.3 | -0.013 |
| 1282.4 | -0.013 |
| 1282.5 | -0.013 |
| 1282.6 | -0.011 |
| 1282.7 | -0.01 |
| 1282.8 | -0.01 |
| 1282.9 | -0.01 |
| 1283.0 | -0.01 |
| 1283.1 | -0.01 |
| 1283.2 | -0.009 |
| 1283.3 | -0.009 |
| 1283.4 | -0.009 |
| 1283.5 | -0.009 |
| 1283.6 | -0.009 |
| 1283.7 | -0.009 |
| 1283.8 | -0.009 |
| 1283.9 | -0.008 |
| 1284.0 | -0.008 |
| 1284.1 | -0.008 |
| 1284.2 | -0.008 |
| 1284.3 | -0.008 |
| 1284.4 | -0.008 |
| 1284.5 | -0.008 |
| 1284.6 | -0.004 |
| 1284.7 | -0.004 |
| 1284.8 | -0.003 |
| 1284.9 | -0.002 |
| 1285.0 | -0.002 |
| 1285.1 | -0.001 |
| 1285.2 | 0 |
| 1285.3 | 0 |
| 1285.4 | 0.001 |
| 1285.5 | 0.002 |
| 1285.6 | -0.004 |
| 1285.7 | -0.005 |
| 1285.8 | -0.005 |
| 1285.9 | -0.005 |
| 1286.0 | -0.006 |
| 1286.1 | -0.006 |
| 1286.2 | -0.007 |
| 1286.3 | -0.007 |
| 1286.4 | -0.008 |
| 1286.5 | -0.008 |
| 1286.6 | -0.009 |
| 1286.7 | -0.009 |
| 1286.8 | -0.01 |
| 1286.9 | -0.011 |
| 1287.0 | -0.011 |
| 1287.1 | -0.012 |
| 1287.2 | -0.012 |
| 1287.3 | -0.013 |
| 1287.4 | -0.013 |
| 1287.5 | -0.014 |
| 1287.6 | -0.008 |
| 1287.7 | -0.007 |
| 1287.8 | -0.006 |
| 1287.9 | -0.006 |
| 1288.0 | -0.005 |
| 1288.1 | -0.005 |
| 1288.2 | -0.004 |
| 1288.3 | -0.004 |
| 1288.4 | -0.003 |
| 1288.5 | -0.002 |
| 1288.6 | -0.002 |
| 1288.7 | -0.001 |
| 1288.8 | -0.001 |
| 1288.9 | 0 |
| 1289.0 | 0 |
| 1289.1 | 0.001 |
| 1289.2 | 0.002 |
| 1289.3 | 0.002 |
| 1289.4 | 0.003 |
| 1289.5 | 0.003 |
| 1289.6 | -0.005 |
| 1289.7 | -0.006 |
| 1289.8 | -0.007 |
| 1289.9 | -0.008 |
| 1290.0 | -0.009 |
| 1290.1 | -0.01 |
| 1290.2 | -0.01 |
| 1290.3 | -0.011 |
| 1290.4 | -0.012 |
| 1290.5 | -0.013 |
| 1290.6 | -0.008 |
| 1290.7 | -0.008 |
| 1290.8 | -0.008 |
| 1290.9 | -0.008 |
| 1291.0 | -0.008 |
| 1291.1 | -0.008 |
| 1291.2 | -0.008 |
| 1291.3 | -0.008 |
| 1291.4 | -0.008 |
| 1291.5 | -0.008 |
| 1291.6 | -0.007 |
| 1291.7 | -0.007 |
| 1291.8 | -0.006 |
| 1291.9 | -0.006 |
| 1292.0 | -0.006 |
| 1292.1 | -0.006 |
| 1292.2 | -0.005 |
| 1292.3 | -0.005 |
| 1292.4 | -0.005 |
| 1292.5 | -0.005 |
| 1292.6 | -0.006 |
| 1292.7 | -0.006 |
| 1292.8 | -0.006 |
| 1292.9 | -0.006 |
| 1293.0 | -0.006 |
| 1293.1 | -0.006 |
| 1293.2 | -0.006 |
| 1293.3 | -0.006 |
| 1293.4 | -0.006 |
| 1293.5 | -0.006 |
| 1293.6 | -0.003 |
| 1293.7 | -0.002 |
| 1293.8 | -0.002 |
| 1293.9 | -0.001 |
| 1294.0 | -0.001 |
| 1294.1 | 0 |
| 1294.2 | 0 |
| 1294.3 | 0.001 |
| 1294.4 | 0.001 |
| 1294.5 | 0.002 |
| 1294.6 | 0.003 |
| 1294.7 | 0.003 |
| 1294.8 | 0.004 |
| 1294.9 | 0.005 |
| 1295.0 | 0.005 |
| 1295.1 | 0.006 |
| 1295.2 | 0.007 |
| 1295.3 | 0.007 |
| 1295.4 | 0.008 |
| 1295.5 | 0.008 |
| 1295.6 | 0 |
| 1295.7 | -0.001 |
| 1295.8 | -0.002 |
| 1295.9 | -0.003 |
| 1296.0 | -0.004 |
| 1296.1 | -0.004 |
| 1296.2 | -0.005 |
| 1296.3 | -0.006 |
| 1296.4 | -0.007 |
| 1296.5 | -0.008 |
| 1296.6 | -0.003 |
| 1296.7 | -0.003 |
| 1296.8 | -0.003 |
| 1296.9 | -0.003 |
| 1297.0 | -0.002 |
| 1297.1 | -0.002 |
| 1297.2 | -0.002 |
| 1297.3 | -0.002 |
| 1297.4 | -0.002 |
| 1297.5 | -0.002 |
| 1297.6 | -0.003 |
| 1297.7 | -0.003 |
| 1297.8 | -0.003 |
| 1297.9 | -0.003 |
| 1298.0 | -0.003 |
| 1298.1 | -0.003 |
| 1298.2 | -0.003 |
| 1298.3 | -0.003 |
| 1298.4 | -0.003 |
| 1298.5 | -0.003 |
| 1298.6 | -0.006 |
| 1298.7 | -0.006 |
| 1298.8 | -0.007 |
| 1298.9 | -0.007 |
| 1299.0 | -0.008 |
| 1299.1 | -0.008 |
| 1299.2 | -0.009 |
| 1299.3 | -0.009 |
| 1299.4 | -0.01 |
| 1299.5 | -0.01 |
| 1299.6 | -0.004 |
| 1299.7 | -0.003 |
| 1299.8 | -0.003 |
| 1299.9 | -0.002 |
| 1300.0 | -0.001 |
| 1300.1 | -0.001 |
| 1300.2 | 0 |
| 1300.3 | 0 |
| 1300.4 | 0.001 |
| 1300.5 | 0.002 |
| 1300.6 | -0.002 |
| 1300.7 | -0.003 |
| 1300.8 | -0.003 |
| 1300.9 | -0.003 |
| 1301.0 | -0.003 |
| 1301.1 | -0.003 |
| 1301.2 | -0.003 |
| 1301.3 | -0.003 |
| 1301.4 | -0.004 |
| 1301.5 | -0.004 |
| 1301.6 | -0.002 |
| 1301.7 | -0.002 |
| 1301.8 | -0.002 |
| 1301.9 | -0.002 |
| 1302.0 | -0.002 |
| 1302.1 | -0.002 |
| 1302.2 | -0.002 |
| 1302.3 | -0.001 |
| 1302.4 | -0.001 |
| 1302.5 | -0.001 |
| 1302.6 | -0.002 |
| 1302.7 | -0.002 |
| 1302.8 | -0.002 |
| 1302.9 | -0.002 |
| 1303.0 | -0.002 |
| 1303.1 | -0.002 |
| 1303.2 | -0.002 |
| 1303.3 | -0.002 |
| 1303.4 | -0.003 |
| 1303.5 | -0.003 |
| 1303.6 | -0.004 |
| 1303.7 | -0.005 |
| 1303.8 | -0.005 |
| 1303.9 | -0.005 |
| 1304.0 | -0.006 |
| 1304.1 | -0.006 |
| 1304.2 | -0.006 |
| 1304.3 | -0.007 |
| 1304.4 | -0.007 |
| 1304.5 | -0.008 |
| 1304.6 | -0.005 |
| 1304.7 | -0.005 |
| 1304.8 | -0.005 |
| 1304.9 | -0.005 |
| 1305.0 | -0.005 |
| 1305.1 | -0.005 |
| 1305.2 | -0.004 |
| 1305.3 | -0.004 |
| 1305.4 | -0.004 |
| 1305.5 | -0.004 |
| 1305.6 | -0.003 |
| 1305.7 | -0.002 |
| 1305.8 | -0.002 |
| 1305.9 | -0.001 |
| 1306.0 | -0.001 |
| 1306.1 | -0.001 |
| 1306.2 | 0 |
| 1306.3 | 0 |
| 1306.4 | 0 |
| 1306.5 | 0.001 |
| 1306.6 | -0.002 |
| 1306.7 | -0.003 |
| 1306.8 | -0.003 |
| 1306.9 | -0.003 |
| 1307.0 | -0.003 |
| 1307.1 | -0.003 |
| 1307.2 | -0.004 |
| 1307.3 | -0.004 |
| 1307.4 | -0.004 |
| 1307.5 | -0.004 |
| 1307.6 | -0.003 |
| 1307.7 | -0.003 |
| 1307.8 | -0.003 |
| 1307.9 | -0.003 |
| 1308.0 | -0.003 |
| 1308.1 | -0.003 |
| 1308.2 | -0.003 |
| 1308.3 | -0.003 |
| 1308.4 | -0.003 |
| 1308.5 | -0.003 |
| 1308.6 | -0.004 |
| 1308.7 | -0.004 |
| 1308.8 | -0.004 |
| 1308.9 | -0.004 |
| 1309.0 | -0.004 |
| 1309.1 | -0.005 |
| 1309.2 | -0.005 |
| 1309.3 | -0.005 |
| 1309.4 | -0.005 |
| 1309.5 | -0.005 |
| 1309.6 | 0 |
| 1309.7 | 0.001 |
| 1309.8 | 0.002 |
| 1309.9 | 0.003 |
| 1310.0 | 0.003 |
| 1310.1 | 0.004 |
| 1310.2 | 0.005 |
| 1310.3 | 0.006 |
| 1310.4 | 0.006 |
| 1310.5 | 0.007 |
| 1310.6 | 0.001 |
| 1310.7 | 0 |
| 1310.8 | 0 |
| 1310.9 | -0.001 |
| 1311.0 | -0.001 |
| 1311.1 | -0.002 |
| 1311.2 | -0.002 |
| 1311.3 | -0.003 |
| 1311.4 | -0.003 |
| 1311.5 | -0.003 |
| 1311.6 | -0.003 |
| 1311.7 | -0.003 |
| 1311.8 | -0.003 |
| 1311.9 | -0.003 |
| 1312.0 | -0.004 |
| 1312.1 | -0.004 |
| 1312.2 | -0.004 |
| 1312.3 | -0.004 |
| 1312.4 | -0.005 |
| 1312.5 | -0.005 |
| 1312.6 | -0.005 |
| 1312.7 | -0.005 |
| 1312.8 | -0.005 |
| 1312.9 | -0.005 |
| 1313.0 | -0.005 |
| 1313.1 | -0.005 |
| 1313.2 | -0.006 |
| 1313.3 | -0.006 |
| 1313.4 | -0.006 |
| 1313.5 | -0.006 |
| 1313.6 | -0.005 |
| 1313.7 | -0.005 |
| 1313.8 | -0.005 |
| 1313.9 | -0.005 |
| 1314.0 | -0.005 |
| 1314.1 | -0.005 |
| 1314.2 | -0.005 |
| 1314.3 | -0.005 |
| 1314.4 | -0.004 |
| 1314.5 | -0.004 |
| 1314.6 | -0.006 |
| 1314.7 | -0.006 |
| 1314.8 | -0.007 |
| 1314.9 | -0.007 |
| 1315.0 | -0.007 |
| 1315.1 | -0.008 |
| 1315.2 | -0.008 |
| 1315.3 | -0.008 |
| 1315.4 | -0.008 |
| 1315.5 | -0.009 |
| 1315.6 | -0.003 |
| 1315.7 | -0.002 |
| 1315.8 | -0.002 |
| 1315.9 | -0.001 |
| 1316.0 | 0 |
| 1316.1 | 0 |
| 1316.2 | 0.001 |
| 1316.3 | 0.002 |
| 1316.4 | 0.002 |
| 1316.5 | 0.003 |
| 1316.6 | 0 |
| 1316.7 | 0 |
| 1316.8 | 0 |
| 1316.9 | 0 |
| 1317.0 | 0 |
| 1317.1 | 0 |
| 1317.2 | 0 |
| 1317.3 | 0 |
| 1317.4 | 0 |
| 1317.5 | 0 |
| 1317.6 | -0.002 |
| 1317.7 | -0.002 |
| 1317.8 | -0.002 |
| 1317.9 | -0.003 |
| 1318.0 | -0.003 |
| 1318.1 | -0.003 |
| 1318.2 | -0.004 |
| 1318.3 | -0.004 |
| 1318.4 | -0.004 |
| 1318.5 | -0.005 |
| 1318.6 | -0.002 |
| 1318.7 | -0.002 |
| 1318.8 | -0.001 |
| 1318.9 | -0.001 |
| 1319.0 | -0.001 |
| 1319.1 | -0.001 |
| 1319.2 | 0 |
| 1319.3 | 0 |
| 1319.4 | 0 |
| 1319.5 | 0 |
| 1319.6 | -0.004 |
| 1319.7 | -0.005 |
| 1319.8 | -0.005 |
| 1319.9 | -0.006 |
| 1320.0 | -0.006 |
| 1320.1 | -0.007 |
| 1320.2 | -0.007 |
| 1320.3 | -0.008 |
| 1320.4 | -0.008 |
| 1320.5 | -0.009 |
| 1320.6 | -0.008 |
| 1320.7 | -0.009 |
| 1320.8 | -0.009 |
| 1320.9 | -0.01 |
| 1321.0 | -0.01 |
| 1321.1 | -0.01 |
| 1321.2 | -0.011 |
| 1321.3 | -0.011 |
| 1321.4 | -0.012 |
| 1321.5 | -0.012 |
| 1321.6 | -0.008 |
| 1321.7 | -0.007 |
| 1321.8 | -0.007 |
| 1321.9 | -0.006 |
| 1322.0 | -0.006 |
| 1322.1 | -0.006 |
| 1322.2 | -0.005 |
| 1322.3 | -0.005 |
| 1322.4 | -0.004 |
| 1322.5 | -0.004 |
| 1322.6 | -0.004 |
| 1322.7 | -0.003 |
| 1322.8 | -0.003 |
| 1322.9 | -0.003 |
| 1323.0 | -0.002 |
| 1323.1 | -0.002 |
| 1323.2 | -0.001 |
| 1323.3 | -0.001 |
| 1323.4 | -0.001 |
| 1323.5 | 0 |
| 1323.6 | -0.006 |
| 1323.7 | -0.006 |
| 1323.8 | -0.007 |
| 1323.9 | -0.008 |
| 1324.0 | -0.008 |
| 1324.1 | -0.009 |
| 1324.2 | -0.009 |
| 1324.3 | -0.01 |
| 1324.4 | -0.011 |
| 1324.5 | -0.011 |
| 1324.6 | -0.007 |
| 1324.7 | -0.006 |
| 1324.8 | -0.006 |
| 1324.9 | -0.006 |
| 1325.0 | -0.006 |
| 1325.1 | -0.005 |
| 1325.2 | -0.005 |
| 1325.3 | -0.005 |
| 1325.4 | -0.005 |
| 1325.5 | -0.004 |
| 1325.6 | -0.006 |
| 1325.7 | -0.006 |
| 1325.8 | -0.007 |
| 1325.9 | -0.007 |
| 1326.0 | -0.007 |
| 1326.1 | -0.007 |
| 1326.2 | -0.007 |
| 1326.3 | -0.007 |
| 1326.4 | -0.007 |
| 1326.5 | -0.007 |
| 1326.6 | -0.009 |
| 1326.7 | -0.009 |
| 1326.8 | -0.01 |
| 1326.9 | -0.01 |
| 1327.0 | -0.01 |
| 1327.1 | -0.011 |
| 1327.2 | -0.011 |
| 1327.3 | -0.011 |
| 1327.4 | -0.012 |
| 1327.5 | -0.012 |
| 1327.6 | -0.008 |
| 1327.7 | -0.008 |
| 1327.8 | -0.008 |
| 1327.9 | -0.007 |
| 1328.0 | -0.007 |
| 1328.1 | -0.007 |
| 1328.2 | -0.006 |
| 1328.3 | -0.006 |
| 1328.4 | -0.006 |
| 1328.5 | -0.005 |
| 1328.6 | -0.006 |
| 1328.7 | -0.006 |
| 1328.8 | -0.006 |
| 1328.9 | -0.006 |
| 1329.0 | -0.006 |
| 1329.1 | -0.006 |
| 1329.2 | -0.006 |
| 1329.3 | -0.005 |
| 1329.4 | -0.005 |
| 1329.5 | -0.005 |
| 1329.6 | -0.004 |
| 1329.7 | -0.004 |
| 1329.8 | -0.003 |
| 1329.9 | -0.003 |
| 1330.0 | -0.003 |
| 1330.1 | -0.003 |
| 1330.2 | -0.002 |
| 1330.3 | -0.002 |
| 1330.4 | -0.002 |
| 1330.5 | -0.001 |
| 1330.6 | -0.004 |
| 1330.7 | -0.004 |
| 1330.8 | -0.004 |
| 1330.9 | -0.004 |
| 1331.0 | -0.005 |
| 1331.1 | -0.005 |
| 1331.2 | -0.005 |
| 1331.3 | -0.005 |
| 1331.4 | -0.005 |
| 1331.5 | -0.005 |
| 1331.6 | -0.004 |
| 1331.7 | -0.004 |
| 1331.8 | -0.004 |
| 1331.9 | -0.003 |
| 1332.0 | -0.003 |
| 1332.1 | -0.003 |
| 1332.2 | -0.003 |
| 1332.3 | -0.003 |
| 1332.4 | -0.003 |
| 1332.5 | -0.003 |
| 1332.6 | -0.002 |
| 1332.7 | -0.002 |
| 1332.8 | -0.002 |
| 1332.9 | -0.002 |
| 1333.0 | -0.002 |
| 1333.1 | -0.002 |
| 1333.2 | -0.002 |
| 1333.3 | -0.001 |
| 1333.4 | -0.001 |
| 1333.5 | -0.001 |
| 1333.6 | -0.004 |
| 1333.7 | -0.005 |
| 1333.8 | -0.005 |
| 1333.9 | -0.005 |
| 1334.0 | -0.006 |
| 1334.1 | -0.006 |
| 1334.2 | -0.007 |
| 1334.3 | -0.007 |
| 1334.4 | -0.007 |
| 1334.5 | -0.008 |
| 1334.6 | -0.004 |
| 1334.7 | -0.004 |
| 1334.8 | -0.003 |
| 1334.9 | -0.003 |
| 1335.0 | -0.003 |
| 1335.1 | -0.003 |
| 1335.2 | -0.002 |
| 1335.3 | -0.002 |
| 1335.4 | -0.002 |
| 1335.5 | -0.001 |
| 1335.6 | -0.002 |
| 1335.7 | -0.002 |
| 1335.8 | -0.002 |
| 1335.9 | -0.002 |
| 1336.0 | -0.002 |
| 1336.1 | -0.002 |
| 1336.2 | -0.002 |
| 1336.3 | -0.002 |
| 1336.4 | -0.001 |
| 1336.5 | -0.001 |
| 1336.6 | -0.007 |
| 1336.7 | -0.008 |
| 1336.8 | -0.009 |
| 1336.9 | -0.009 |
| 1337.0 | -0.01 |
| 1337.1 | -0.011 |
| 1337.2 | -0.012 |
| 1337.3 | -0.013 |
| 1337.4 | -0.014 |
| 1337.5 | -0.014 |
| 1337.6 | -0.008 |
| 1337.7 | -0.008 |
| 1337.8 | -0.008 |
| 1337.9 | -0.008 |
| 1338.0 | -0.007 |
| 1338.1 | -0.007 |
| 1338.2 | -0.007 |
| 1338.3 | -0.006 |
| 1338.4 | -0.006 |
| 1338.5 | -0.006 |
| 1338.6 | -0.004 |
| 1338.7 | -0.004 |
| 1338.8 | -0.003 |
| 1338.9 | -0.002 |
| 1339.0 | -0.002 |
| 1339.1 | -0.001 |
| 1339.2 | -0.001 |
| 1339.3 | 0 |
| 1339.4 | 0 |
| 1339.5 | 0.001 |
| 1339.6 | 0 |
| 1339.7 | 0.001 |
| 1339.8 | 0.001 |
| 1339.9 | 0.001 |
| 1340.0 | 0.002 |
| 1340.1 | 0.002 |
| 1340.2 | 0.002 |
| 1340.3 | 0.003 |
| 1340.4 | 0.003 |
| 1340.5 | 0.003 |
| 1340.6 | 0.003 |
| 1340.7 | 0.003 |
| 1340.8 | 0.003 |
| 1340.9 | 0.003 |
| 1341.0 | 0.003 |
| 1341.1 | 0.003 |
| 1341.2 | 0.003 |
| 1341.3 | 0.004 |
| 1341.4 | 0.004 |
| 1341.5 | 0.004 |
| 1341.6 | 0.002 |
| 1341.7 | 0.002 |
| 1341.8 | 0.002 |
| 1341.9 | 0.001 |
| 1342.0 | 0.001 |
| 1342.1 | 0.001 |
| 1342.2 | 0.001 |
| 1342.3 | 0.001 |
| 1342.4 | 0.001 |
| 1342.5 | 0 |
| 1342.6 | -0.001 |
| 1342.7 | -0.002 |
| 1342.8 | -0.002 |
| 1342.9 | -0.003 |
| 1343.0 | -0.003 |
| 1343.1 | -0.004 |
| 1343.2 | -0.004 |
| 1343.3 | -0.004 |
| 1343.4 | -0.005 |
| 1343.5 | -0.005 |
| 1343.6 | 0 |
| 1343.7 | 0.001 |
| 1343.8 | 0.001 |
| 1343.9 | 0.002 |
| 1344.0 | 0.002 |
| 1344.1 | 0.003 |
| 1344.2 | 0.004 |
| 1344.3 | 0.004 |
| 1344.4 | 0.005 |
| 1344.5 | 0.005 |
| 1344.6 | 0.001 |
| 1344.7 | 0.001 |
| 1344.8 | 0.001 |
| 1344.9 | 0 |
| 1345.0 | 0 |
| 1345.1 | 0 |
| 1345.2 | 0 |
| 1345.3 | 0 |
| 1345.4 | -0.001 |
| 1345.5 | -0.001 |
| 1345.6 | -0.001 |
| 1345.7 | -0.001 |
| 1345.8 | -0.001 |
| 1345.9 | -0.001 |
| 1346.0 | -0.002 |
| 1346.1 | -0.002 |
| 1346.2 | -0.002 |
| 1346.3 | -0.002 |
| 1346.4 | -0.002 |
| 1346.5 | -0.002 |
| 1346.6 | -0.002 |
| 1346.7 | -0.002 |
| 1346.8 | -0.002 |
| 1346.9 | -0.002 |
| 1347.0 | -0.002 |
| 1347.1 | -0.002 |
| 1347.2 | -0.002 |
| 1347.3 | -0.002 |
| 1347.4 | -0.002 |
| 1347.5 | -0.002 |
| 1347.6 | 0.001 |
| 1347.7 | 0.002 |
| 1347.8 | 0.002 |
| 1347.9 | 0.003 |
| 1348.0 | 0.003 |
| 1348.1 | 0.004 |
| 1348.2 | 0.004 |
| 1348.3 | 0.005 |
| 1348.4 | 0.005 |
| 1348.5 | 0.006 |
| 1348.6 | 0.001 |
| 1348.7 | 0.001 |
| 1348.8 | 0.001 |
| 1348.9 | 0.001 |
| 1349.0 | 0 |
| 1349.1 | 0 |
| 1349.2 | 0 |
| 1349.3 | -0.001 |
| 1349.4 | -0.001 |
| 1349.5 | -0.001 |
| 1349.6 | 0.003 |
| 1349.7 | 0.003 |
| 1349.8 | 0.004 |
| 1349.9 | 0.004 |
| 1350.0 | 0.005 |
| 1350.1 | 0.005 |
| 1350.2 | 0.005 |
| 1350.3 | 0.006 |
| 1350.4 | 0.006 |
| 1350.5 | 0.007 |
| 1350.6 | 0.007 |
| 1350.7 | 0.007 |
| 1350.8 | 0.007 |
| 1350.9 | 0.008 |
| 1351.0 | 0.008 |
| 1351.1 | 0.008 |
| 1351.2 | 0.009 |
| 1351.3 | 0.009 |
| 1351.4 | 0.009 |
| 1351.5 | 0.01 |
| 1351.6 | 0.007 |
| 1351.7 | 0.007 |
| 1351.8 | 0.007 |
| 1351.9 | 0.007 |
| 1352.0 | 0.007 |
| 1352.1 | 0.007 |
| 1352.2 | 0.007 |
| 1352.3 | 0.006 |
| 1352.4 | 0.006 |
| 1352.5 | 0.006 |
| 1352.6 | 0.006 |
| 1352.7 | 0.005 |
| 1352.8 | 0.005 |
| 1352.9 | 0.005 |
| 1353.0 | 0.005 |
| 1353.1 | 0.005 |
| 1353.2 | 0.004 |
| 1353.3 | 0.004 |
| 1353.4 | 0.004 |
| 1353.5 | 0.004 |
| 1353.6 | 0.001 |
| 1353.7 | 0.001 |
| 1353.8 | 0 |
| 1353.9 | 0 |
| 1354.0 | -0.001 |
| 1354.1 | -0.001 |
| 1354.2 | -0.002 |
| 1354.3 | -0.002 |
| 1354.4 | -0.003 |
| 1354.5 | -0.004 |
| 1354.6 | 0.002 |
| 1354.7 | 0.002 |
| 1354.8 | 0.003 |
| 1354.9 | 0.003 |
| 1355.0 | 0.003 |
| 1355.1 | 0.004 |
| 1355.2 | 0.004 |
| 1355.3 | 0.005 |
| 1355.4 | 0.005 |
| 1355.5 | 0.005 |
| 1355.6 | -0.003 |
| 1355.7 | -0.004 |
| 1355.8 | -0.005 |
| 1355.9 | -0.006 |
| 1356.0 | -0.007 |
| 1356.1 | -0.008 |
| 1356.2 | -0.009 |
| 1356.3 | -0.01 |
| 1356.4 | -0.011 |
| 1356.5 | -0.012 |
| 1356.6 | -0.001 |
| 1356.7 | 0 |
| 1356.8 | 0.001 |
| 1356.9 | 0.002 |
| 1357.0 | 0.003 |
| 1357.1 | 0.004 |
| 1357.2 | 0.006 |
| 1357.3 | 0.007 |
| 1357.4 | 0.008 |
| 1357.5 | 0.009 |
| 1357.6 | 0.005 |
| 1357.7 | 0.006 |
| 1357.8 | 0.006 |
| 1357.9 | 0.007 |
| 1358.0 | 0.007 |
| 1358.1 | 0.007 |
| 1358.2 | 0.008 |
| 1358.3 | 0.008 |
| 1358.4 | 0.008 |
| 1358.5 | 0.009 |
| 1358.6 | 0.007 |
| 1358.7 | 0.007 |
| 1358.8 | 0.007 |
| 1358.9 | 0.007 |
| 1359.0 | 0.007 |
| 1359.1 | 0.007 |
| 1359.2 | 0.007 |
| 1359.3 | 0.007 |
| 1359.4 | 0.007 |
| 1359.5 | 0.007 |
| 1359.6 | 0.005 |
| 1359.7 | 0.005 |
| 1359.8 | 0.005 |
| 1359.9 | 0.005 |
| 1360.0 | 0.005 |
| 1360.1 | 0.004 |
| 1360.2 | 0.004 |
| 1360.3 | 0.004 |
| 1360.4 | 0.004 |
| 1360.5 | 0.004 |
| 1360.6 | 0.007 |
| 1360.7 | 0.007 |
| 1360.8 | 0.008 |
| 1360.9 | 0.008 |
| 1361.0 | 0.008 |
| 1361.1 | 0.009 |
| 1361.2 | 0.009 |
| 1361.3 | 0.009 |
| 1361.4 | 0.01 |
| 1361.5 | 0.01 |
| 1361.6 | 0.008 |
| 1361.7 | 0.008 |
| 1361.8 | 0.007 |
| 1361.9 | 0.007 |
| 1362.0 | 0.007 |
| 1362.1 | 0.007 |
| 1362.2 | 0.007 |
| 1362.3 | 0.007 |
| 1362.4 | 0.007 |
| 1362.5 | 0.007 |
| 1362.6 | -0.009 |
| 1362.7 | -0.012 |
| 1362.8 | -0.014 |
| 1362.9 | -0.017 |
| 1363.0 | -0.02 |
| 1363.1 | -0.022 |
| 1363.2 | -0.025 |
| 1363.3 | -0.028 |
| 1363.4 | -0.03 |
| 1363.5 | -0.033 |
| 1363.6 | -0.004 |
| 1363.7 | -0.001 |
| 1363.8 | 0.002 |
| 1363.9 | 0.004 |
| 1364.0 | 0.007 |
| 1364.1 | 0.01 |
| 1364.2 | 0.012 |
| 1364.3 | 0.015 |
| 1364.4 | 0.018 |
| 1364.5 | 0.021 |
| 1364.6 | 0.014 |
| 1364.7 | 0.015 |
| 1364.8 | 0.016 |
| 1364.9 | 0.018 |
| 1365.0 | 0.019 |
| 1365.1 | 0.02 |
| 1365.2 | 0.021 |
| 1365.3 | 0.022 |
| 1365.4 | 0.024 |
| 1365.5 | 0.025 |
| 1365.6 | 0.001 |
| 1365.7 | -0.002 |
| 1365.8 | -0.005 |
| 1365.9 | -0.008 |
| 1366.0 | -0.011 |
| 1366.1 | -0.014 |
| 1366.2 | -0.017 |
| 1366.3 | -0.02 |
| 1366.4 | -0.022 |
| 1366.5 | -0.025 |
| 1366.6 | -0.002 |
| 1366.7 | 0 |
| 1366.8 | 0.001 |
| 1366.9 | 0.003 |
| 1367.0 | 0.004 |
| 1367.1 | 0.006 |
| 1367.2 | 0.007 |
| 1367.3 | 0.009 |
| 1367.4 | 0.01 |
| 1367.5 | 0.012 |
| 1367.6 | 0.014 |
| 1367.7 | 0.016 |
| 1367.8 | 0.018 |
| 1367.9 | 0.02 |
| 1368.0 | 0.021 |
| 1368.1 | 0.023 |
| 1368.2 | 0.025 |
| 1368.3 | 0.026 |
| 1368.4 | 0.028 |
| 1368.5 | 0.03 |
| 1368.6 | 0.002 |
| 1368.7 | -0.002 |
| 1368.8 | -0.005 |
| 1368.9 | -0.008 |
| 1369.0 | -0.011 |
| 1369.1 | -0.014 |
| 1369.2 | -0.018 |
| 1369.3 | -0.021 |
| 1369.4 | -0.024 |
| 1369.5 | -0.027 |
| 1369.6 | -0.007 |
| 1369.7 | -0.006 |
| 1369.8 | -0.005 |
| 1369.9 | -0.005 |
| 1370.0 | -0.004 |
| 1370.1 | -0.003 |
| 1370.2 | -0.003 |
| 1370.3 | -0.002 |
| 1370.4 | -0.001 |
| 1370.5 | 0 |
| 1370.6 | 0.006 |
| 1370.7 | 0.007 |
| 1370.8 | 0.009 |
| 1370.9 | 0.011 |
| 1371.0 | 0.012 |
| 1371.1 | 0.014 |
| 1371.2 | 0.015 |
| 1371.3 | 0.017 |
| 1371.4 | 0.019 |
| 1371.5 | 0.02 |
| 1371.6 | 0.003 |
| 1371.7 | 0.001 |
| 1371.8 | 0 |
| 1371.9 | -0.002 |
| 1372.0 | -0.003 |
| 1372.1 | -0.005 |
| 1372.2 | -0.006 |
| 1372.3 | -0.008 |
| 1372.4 | -0.01 |
| 1372.5 | -0.011 |
| 1372.6 | -0.003 |
| 1372.7 | -0.003 |
| 1372.8 | -0.003 |
| 1372.9 | -0.003 |
| 1373.0 | -0.003 |
| 1373.1 | -0.003 |
| 1373.2 | -0.003 |
| 1373.3 | -0.003 |
| 1373.4 | -0.003 |
| 1373.5 | -0.003 |
| 1373.6 | 0.004 |
| 1373.7 | 0.005 |
| 1373.8 | 0.006 |
| 1373.9 | 0.007 |
| 1374.0 | 0.008 |
| 1374.1 | 0.01 |
| 1374.2 | 0.011 |
| 1374.3 | 0.012 |
| 1374.4 | 0.013 |
| 1374.5 | 0.014 |
| 1374.6 | 0.008 |
| 1374.7 | 0.008 |
| 1374.8 | 0.008 |
| 1374.9 | 0.008 |
| 1375.0 | 0.008 |
| 1375.1 | 0.007 |
| 1375.2 | 0.007 |
| 1375.3 | 0.007 |
| 1375.4 | 0.007 |
| 1375.5 | 0.007 |
| 1375.6 | 0.006 |
| 1375.7 | 0.006 |
| 1375.8 | 0.006 |
| 1375.9 | 0.005 |
| 1376.0 | 0.005 |
| 1376.1 | 0.005 |
| 1376.2 | 0.005 |
| 1376.3 | 0.004 |
| 1376.4 | 0.004 |
| 1376.5 | 0.004 |
| 1376.6 | 0.006 |
| 1376.7 | 0.006 |
| 1376.8 | 0.006 |
| 1376.9 | 0.006 |
| 1377.0 | 0.006 |
| 1377.1 | 0.006 |
| 1377.2 | 0.006 |
| 1377.3 | 0.006 |
| 1377.4 | 0.006 |
| 1377.5 | 0.006 |
| 1377.6 | 0.004 |
| 1377.7 | 0.003 |
| 1377.8 | 0.003 |
| 1377.9 | 0.002 |
| 1378.0 | 0.002 |
| 1378.1 | 0.002 |
| 1378.2 | 0.001 |
| 1378.3 | 0.001 |
| 1378.4 | 0 |
| 1378.5 | 0 |
| 1378.6 | 0.009 |
| 1378.7 | 0.01 |
| 1378.8 | 0.012 |
| 1378.9 | 0.013 |
| 1379.0 | 0.014 |
| 1379.1 | 0.015 |
| 1379.2 | 0.017 |
| 1379.3 | 0.018 |
| 1379.4 | 0.019 |
| 1379.5 | 0.02 |
| 1379.6 | 0.006 |
| 1379.7 | 0.005 |
| 1379.8 | 0.003 |
| 1379.9 | 0.002 |
| 1380.0 | 0.001 |
| 1380.1 | -0.001 |
| 1380.2 | -0.002 |
| 1380.3 | -0.003 |
| 1380.4 | -0.005 |
| 1380.5 | -0.006 |
| 1380.6 | -0.002 |
| 1380.7 | -0.003 |
| 1380.8 | -0.003 |
| 1380.9 | -0.004 |
| 1381.0 | -0.004 |
| 1381.1 | -0.005 |
| 1381.2 | -0.005 |
| 1381.3 | -0.006 |
| 1381.4 | -0.006 |
| 1381.5 | -0.007 |
| 1381.6 | 0.001 |
| 1381.7 | 0.002 |
| 1381.8 | 0.002 |
| 1381.9 | 0.003 |
| 1382.0 | 0.004 |
| 1382.1 | 0.005 |
| 1382.2 | 0.006 |
| 1382.3 | 0.007 |
| 1382.4 | 0.008 |
| 1382.5 | 0.009 |
| 1382.6 | -0.003 |
| 1382.7 | -0.004 |
| 1382.8 | -0.005 |
| 1382.9 | -0.007 |
| 1383.0 | -0.008 |
| 1383.1 | -0.009 |
| 1383.2 | -0.01 |
| 1383.3 | -0.011 |
| 1383.4 | -0.013 |
| 1383.5 | -0.014 |
| 1383.6 | 0.007 |
| 1383.7 | 0.01 |
| 1383.8 | 0.012 |
| 1383.9 | 0.015 |
| 1384.0 | 0.017 |
| 1384.1 | 0.02 |
| 1384.2 | 0.022 |
| 1384.3 | 0.025 |
| 1384.4 | 0.027 |
| 1384.5 | 0.03 |
| 1384.6 | 0.013 |
| 1384.7 | 0.012 |
| 1384.8 | 0.012 |
| 1384.9 | 0.011 |
| 1385.0 | 0.01 |
| 1385.1 | 0.01 |
| 1385.2 | 0.009 |
| 1385.3 | 0.008 |
| 1385.4 | 0.008 |
| 1385.5 | 0.007 |
| 1385.6 | 0.009 |
| 1385.7 | 0.009 |
| 1385.8 | 0.009 |
| 1385.9 | 0.009 |
| 1386.0 | 0.008 |
| 1386.1 | 0.008 |
| 1386.2 | 0.008 |
| 1386.3 | 0.008 |
| 1386.4 | 0.008 |
| 1386.5 | 0.007 |
| 1386.6 | 0.011 |
| 1386.7 | 0.012 |
| 1386.8 | 0.012 |
| 1386.9 | 0.013 |
| 1387.0 | 0.013 |
| 1387.1 | 0.014 |
| 1387.2 | 0.014 |
| 1387.3 | 0.015 |
| 1387.4 | 0.015 |
| 1387.5 | 0.016 |
| 1387.6 | 0.006 |
| 1387.7 | 0.005 |
| 1387.8 | 0.004 |
| 1387.9 | 0.003 |
| 1388.0 | 0.002 |
| 1388.1 | 0.001 |
| 1388.2 | -0.001 |
| 1388.3 | -0.002 |
| 1388.4 | -0.003 |
| 1388.5 | -0.004 |
| 1388.6 | 0.007 |
| 1388.7 | 0.008 |
| 1388.8 | 0.009 |
| 1388.9 | 0.01 |
| 1389.0 | 0.01 |
| 1389.1 | 0.011 |
| 1389.2 | 0.012 |
| 1389.3 | 0.013 |
| 1389.4 | 0.014 |
| 1389.5 | 0.015 |
| 1389.6 | 0.012 |
| 1389.7 | 0.012 |
| 1389.8 | 0.013 |
| 1389.9 | 0.013 |
| 1390.0 | 0.013 |
| 1390.1 | 0.013 |
| 1390.2 | 0.014 |
| 1390.3 | 0.014 |
| 1390.4 | 0.014 |
| 1390.5 | 0.014 |
| 1390.6 | 0.011 |
| 1390.7 | 0.011 |
| 1390.8 | 0.011 |
| 1390.9 | 0.011 |
| 1391.0 | 0.01 |
| 1391.1 | 0.01 |
| 1391.2 | 0.01 |
| 1391.3 | 0.009 |
| 1391.4 | 0.009 |
| 1391.5 | 0.009 |
| 1391.6 | 0.001 |
| 1391.7 | 0 |
| 1391.8 | -0.002 |
| 1391.9 | -0.004 |
| 1392.0 | -0.005 |
| 1392.1 | -0.007 |
| 1392.2 | -0.008 |
| 1392.3 | -0.01 |
| 1392.4 | -0.011 |
| 1392.5 | -0.013 |
| 1392.6 | 0.002 |
| 1392.7 | 0.004 |
| 1392.8 | 0.005 |
| 1392.9 | 0.006 |
| 1393.0 | 0.007 |
| 1393.1 | 0.009 |
| 1393.2 | 0.01 |
| 1393.3 | 0.011 |
| 1393.4 | 0.012 |
| 1393.5 | 0.014 |
| 1393.6 | 0.01 |
| 1393.7 | 0.011 |
| 1393.8 | 0.011 |
| 1393.9 | 0.011 |
| 1394.0 | 0.012 |
| 1394.1 | 0.012 |
| 1394.2 | 0.013 |
| 1394.3 | 0.013 |
| 1394.4 | 0.014 |
| 1394.5 | 0.014 |
| 1394.6 | 0.003 |
| 1394.7 | 0.002 |
| 1394.8 | 0 |
| 1394.9 | -0.001 |
| 1395.0 | -0.003 |
| 1395.1 | -0.004 |
| 1395.2 | -0.006 |
| 1395.3 | -0.007 |
| 1395.4 | -0.008 |
| 1395.5 | -0.01 |
| 1395.6 | -0.002 |
| 1395.7 | -0.001 |
| 1395.8 | -0.001 |
| 1395.9 | -0.001 |
| 1396.0 | -0.001 |
| 1396.1 | -0.001 |
| 1396.2 | -0.001 |
| 1396.3 | 0 |
| 1396.4 | 0 |
| 1396.5 | 0 |
| 1396.6 | 0.007 |
| 1396.7 | 0.009 |
| 1396.8 | 0.01 |
| 1396.9 | 0.011 |
| 1397.0 | 0.013 |
| 1397.1 | 0.014 |
| 1397.2 | 0.016 |
| 1397.3 | 0.017 |
| 1397.4 | 0.018 |
| 1397.5 | 0.02 |
| 1397.6 | 0.019 |
| 1397.7 | 0.02 |
| 1397.8 | 0.021 |
| 1397.9 | 0.022 |
| 1398.0 | 0.023 |
| 1398.1 | 0.024 |
| 1398.2 | 0.025 |
| 1398.3 | 0.027 |
| 1398.4 | 0.028 |
| 1398.5 | 0.029 |
| 1398.6 | 0.017 |
| 1398.7 | 0.016 |
| 1398.8 | 0.015 |
| 1398.9 | 0.014 |
| 1399.0 | 0.013 |
| 1399.1 | 0.012 |
| 1399.2 | 0.011 |
| 1399.3 | 0.01 |
| 1399.4 | 0.009 |
| 1399.5 | 0.008 |
| 1399.6 | 0 |
| 1399.7 | -0.002 |
| 1399.8 | -0.004 |
| 1399.9 | -0.006 |
| 1400.0 | -0.008 |
| 1400.1 | -0.01 |
| 1400.2 | -0.012 |
| 1400.3 | -0.015 |
| 1400.4 | -0.017 |
| 1400.5 | -0.019 |
| 1400.6 | -0.006 |
| 1400.7 | -0.005 |
| 1400.8 | -0.005 |
| 1400.9 | -0.005 |
| 1401.0 | -0.004 |
| 1401.1 | -0.004 |
| 1401.2 | -0.003 |
| 1401.3 | -0.003 |
| 1401.4 | -0.003 |
| 1401.5 | -0.002 |
| 1401.6 | 0.003 |
| 1401.7 | 0.004 |
| 1401.8 | 0.006 |
| 1401.9 | 0.007 |
| 1402.0 | 0.008 |
| 1402.1 | 0.009 |
| 1402.2 | 0.011 |
| 1402.3 | 0.012 |
| 1402.4 | 0.013 |
| 1402.5 | 0.014 |
| 1402.6 | 0.012 |
| 1402.7 | 0.012 |
| 1402.8 | 0.013 |
| 1402.9 | 0.013 |
| 1403.0 | 0.014 |
| 1403.1 | 0.014 |
| 1403.2 | 0.015 |
| 1403.3 | 0.016 |
| 1403.4 | 0.016 |
| 1403.5 | 0.017 |
| 1403.6 | 0.01 |
| 1403.7 | 0.009 |
| 1403.8 | 0.008 |
| 1403.9 | 0.008 |
| 1404.0 | 0.007 |
| 1404.1 | 0.006 |
| 1404.2 | 0.005 |
| 1404.3 | 0.005 |
| 1404.4 | 0.004 |
| 1404.5 | 0.003 |
| 1404.6 | 0.003 |
| 1404.7 | 0.002 |
| 1404.8 | 0.001 |
| 1404.9 | 0.001 |
| 1405.0 | 0 |
| 1405.1 | -0.001 |
| 1405.2 | -0.001 |
| 1405.3 | -0.002 |
| 1405.4 | -0.003 |
| 1405.5 | -0.003 |
| 1405.6 | 0.008 |
| 1405.7 | 0.01 |
| 1405.8 | 0.011 |
| 1405.9 | 0.013 |
| 1406.0 | 0.014 |
| 1406.1 | 0.015 |
| 1406.2 | 0.017 |
| 1406.3 | 0.018 |
| 1406.4 | 0.02 |
| 1406.5 | 0.021 |
| 1406.6 | 0.012 |
| 1406.7 | 0.012 |
| 1406.8 | 0.012 |
| 1406.9 | 0.011 |
| 1407.0 | 0.011 |
| 1407.1 | 0.011 |
| 1407.2 | 0.01 |
| 1407.3 | 0.01 |
| 1407.4 | 0.01 |
| 1407.5 | 0.009 |
| 1407.6 | 0.008 |
| 1407.7 | 0.008 |
| 1407.8 | 0.008 |
| 1407.9 | 0.007 |
| 1408.0 | 0.007 |
| 1408.1 | 0.006 |
| 1408.2 | 0.006 |
| 1408.3 | 0.005 |
| 1408.4 | 0.005 |
| 1408.5 | 0.005 |
| 1408.6 | 0.005 |
| 1408.7 | 0.005 |
| 1408.8 | 0.005 |
| 1408.9 | 0.004 |
| 1409.0 | 0.004 |
| 1409.1 | 0.004 |
| 1409.2 | 0.004 |
| 1409.3 | 0.003 |
| 1409.4 | 0.003 |
| 1409.5 | 0.003 |
| 1409.6 | 0.005 |
| 1409.7 | 0.005 |
| 1409.8 | 0.005 |
| 1409.9 | 0.005 |
| 1410.0 | 0.005 |
| 1410.1 | 0.005 |
| 1410.2 | 0.005 |
| 1410.3 | 0.005 |
| 1410.4 | 0.005 |
| 1410.5 | 0.005 |
| 1410.6 | 0.01 |
| 1410.7 | 0.011 |
| 1410.8 | 0.012 |
| 1410.9 | 0.013 |
| 1411.0 | 0.014 |
| 1411.1 | 0.015 |
| 1411.2 | 0.016 |
| 1411.3 | 0.017 |
| 1411.4 | 0.018 |
| 1411.5 | 0.019 |
| 1411.6 | 0.013 |
| 1411.7 | 0.013 |
| 1411.8 | 0.012 |
| 1411.9 | 0.012 |
| 1412.0 | 0.012 |
| 1412.1 | 0.012 |
| 1412.2 | 0.012 |
| 1412.3 | 0.011 |
| 1412.4 | 0.011 |
| 1412.5 | 0.011 |
| 1412.6 | 0.012 |
| 1412.7 | 0.012 |
| 1412.8 | 0.011 |
| 1412.9 | 0.011 |
| 1413.0 | 0.011 |
| 1413.1 | 0.011 |
| 1413.2 | 0.011 |
| 1413.3 | 0.011 |
| 1413.4 | 0.011 |
| 1413.5 | 0.011 |
| 1413.6 | 0.006 |
| 1413.7 | 0.005 |
| 1413.8 | 0.004 |
| 1413.9 | 0.003 |
| 1414.0 | 0.002 |
| 1414.1 | 0.001 |
| 1414.2 | 0 |
| 1414.3 | -0.001 |
| 1414.4 | -0.002 |
| 1414.5 | -0.003 |
| 1414.6 | 0.007 |
| 1414.7 | 0.008 |
| 1414.8 | 0.009 |
| 1414.9 | 0.01 |
| 1415.0 | 0.01 |
| 1415.1 | 0.011 |
| 1415.2 | 0.012 |
| 1415.3 | 0.013 |
| 1415.4 | 0.014 |
| 1415.5 | 0.015 |
| 1415.6 | 0.015 |
| 1415.7 | 0.016 |
| 1415.8 | 0.017 |
| 1415.9 | 0.018 |
| 1416.0 | 0.018 |
| 1416.1 | 0.019 |
| 1416.2 | 0.02 |
| 1416.3 | 0.021 |
| 1416.4 | 0.022 |
| 1416.5 | 0.022 |
| 1416.6 | 0.018 |
| 1416.7 | 0.018 |
| 1416.8 | 0.018 |
| 1416.9 | 0.018 |
| 1417.0 | 0.018 |
| 1417.1 | 0.018 |
| 1417.2 | 0.018 |
| 1417.3 | 0.018 |
| 1417.4 | 0.018 |
| 1417.5 | 0.018 |
| 1417.6 | 0.016 |
| 1417.7 | 0.016 |
| 1417.8 | 0.015 |
| 1417.9 | 0.015 |
| 1418.0 | 0.015 |
| 1418.1 | 0.014 |
| 1418.2 | 0.014 |
| 1418.3 | 0.014 |
| 1418.4 | 0.013 |
| 1418.5 | 0.013 |
| 1418.6 | 0.014 |
| 1418.7 | 0.014 |
| 1418.8 | 0.014 |
| 1418.9 | 0.013 |
| 1419.0 | 0.013 |
| 1419.1 | 0.013 |
| 1419.2 | 0.013 |
| 1419.3 | 0.013 |
| 1419.4 | 0.013 |
| 1419.5 | 0.013 |
| 1419.6 | 0.017 |
| 1419.7 | 0.017 |
| 1419.8 | 0.018 |
| 1419.9 | 0.018 |
| 1420.0 | 0.019 |
| 1420.1 | 0.019 |
| 1420.2 | 0.02 |
| 1420.3 | 0.02 |
| 1420.4 | 0.021 |
| 1420.5 | 0.021 |
| 1420.6 | 0.02 |
| 1420.7 | 0.02 |
| 1420.8 | 0.02 |
| 1420.9 | 0.02 |
| 1421.0 | 0.021 |
| 1421.1 | 0.021 |
| 1421.2 | 0.021 |
| 1421.3 | 0.021 |
| 1421.4 | 0.021 |
| 1421.5 | 0.022 |
| 1421.6 | 0.02 |
| 1421.7 | 0.02 |
| 1421.8 | 0.02 |
| 1421.9 | 0.02 |
| 1422.0 | 0.02 |
| 1422.1 | 0.02 |
| 1422.2 | 0.02 |
| 1422.3 | 0.02 |
| 1422.4 | 0.02 |
| 1422.5 | 0.02 |
| 1422.6 | 0.021 |
| 1422.7 | 0.021 |
| 1422.8 | 0.022 |
| 1422.9 | 0.022 |
| 1423.0 | 0.022 |
| 1423.1 | 0.022 |
| 1423.2 | 0.022 |
| 1423.3 | 0.022 |
| 1423.4 | 0.023 |
| 1423.5 | 0.023 |
| 1423.6 | 0.022 |
| 1423.7 | 0.022 |
| 1423.8 | 0.022 |
| 1423.9 | 0.022 |
| 1424.0 | 0.021 |
| 1424.1 | 0.021 |
| 1424.2 | 0.021 |
| 1424.3 | 0.021 |
| 1424.4 | 0.021 |
| 1424.5 | 0.021 |
| 1424.6 | 0.025 |
| 1424.7 | 0.026 |
| 1424.8 | 0.026 |
| 1424.9 | 0.027 |
| 1425.0 | 0.028 |
| 1425.1 | 0.028 |
| 1425.2 | 0.029 |
| 1425.3 | 0.029 |
| 1425.4 | 0.03 |
| 1425.5 | 0.031 |
| 1425.6 | 0.025 |
| 1425.7 | 0.025 |
| 1425.8 | 0.024 |
| 1425.9 | 0.024 |
| 1426.0 | 0.023 |
| 1426.1 | 0.023 |
| 1426.2 | 0.023 |
| 1426.3 | 0.022 |
| 1426.4 | 0.022 |
| 1426.5 | 0.021 |
| 1426.6 | 0.024 |
| 1426.7 | 0.024 |
| 1426.8 | 0.024 |
| 1426.9 | 0.024 |
| 1427.0 | 0.025 |
| 1427.1 | 0.025 |
| 1427.2 | 0.025 |
| 1427.3 | 0.025 |
| 1427.4 | 0.025 |
| 1427.5 | 0.025 |
| 1427.6 | 0.023 |
| 1427.7 | 0.022 |
| 1427.8 | 0.022 |
| 1427.9 | 0.022 |
| 1428.0 | 0.022 |
| 1428.1 | 0.021 |
| 1428.2 | 0.021 |
| 1428.3 | 0.021 |
| 1428.4 | 0.02 |
| 1428.5 | 0.02 |
| 1428.6 | 0.027 |
| 1428.7 | 0.028 |
| 1428.8 | 0.029 |
| 1428.9 | 0.03 |
| 1429.0 | 0.031 |
| 1429.1 | 0.032 |
| 1429.2 | 0.033 |
| 1429.3 | 0.034 |
| 1429.4 | 0.035 |
| 1429.5 | 0.036 |
| 1429.6 | 0.032 |
| 1429.7 | 0.032 |
| 1429.8 | 0.032 |
| 1429.9 | 0.032 |
| 1430.0 | 0.032 |
| 1430.1 | 0.032 |
| 1430.2 | 0.032 |
| 1430.3 | 0.032 |
| 1430.4 | 0.032 |
| 1430.5 | 0.032 |
| 1430.6 | 0.032 |
| 1430.7 | 0.032 |
| 1430.8 | 0.032 |
| 1430.9 | 0.033 |
| 1431.0 | 0.033 |
| 1431.1 | 0.033 |
| 1431.2 | 0.033 |
| 1431.3 | 0.033 |
| 1431.4 | 0.033 |
| 1431.5 | 0.033 |
| 1431.6 | 0.032 |
| 1431.7 | 0.031 |
| 1431.8 | 0.031 |
| 1431.9 | 0.031 |
| 1432.0 | 0.031 |
| 1432.1 | 0.031 |
| 1432.2 | 0.031 |
| 1432.3 | 0.03 |
| 1432.4 | 0.03 |
| 1432.5 | 0.03 |
| 1432.6 | 0.035 |
| 1432.7 | 0.036 |
| 1432.8 | 0.037 |
| 1432.9 | 0.037 |
| 1433.0 | 0.038 |
| 1433.1 | 0.039 |
| 1433.2 | 0.039 |
| 1433.3 | 0.04 |
| 1433.4 | 0.041 |
| 1433.5 | 0.042 |
| 1433.6 | 0.04 |
| 1433.7 | 0.041 |
| 1433.8 | 0.041 |
| 1433.9 | 0.041 |
| 1434.0 | 0.042 |
| 1434.1 | 0.042 |
| 1434.2 | 0.042 |
| 1434.3 | 0.043 |
| 1434.4 | 0.043 |
| 1434.5 | 0.044 |
| 1434.6 | 0.047 |
| 1434.7 | 0.048 |
| 1434.8 | 0.049 |
| 1434.9 | 0.05 |
| 1435.0 | 0.051 |
| 1435.1 | 0.052 |
| 1435.2 | 0.053 |
| 1435.3 | 0.054 |
| 1435.4 | 0.055 |
| 1435.5 | 0.056 |
| 1435.6 | 0.055 |
| 1435.7 | 0.055 |
| 1435.8 | 0.056 |
| 1435.9 | 0.056 |
| 1436.0 | 0.057 |
| 1436.1 | 0.057 |
| 1436.2 | 0.058 |
| 1436.3 | 0.059 |
| 1436.4 | 0.059 |
| 1436.5 | 0.06 |
| 1436.6 | 0.061 |
| 1436.7 | 0.062 |
| 1436.8 | 0.062 |
| 1436.9 | 0.063 |
| 1437.0 | 0.064 |
| 1437.1 | 0.065 |
| 1437.2 | 0.065 |
| 1437.3 | 0.066 |
| 1437.4 | 0.067 |
| 1437.5 | 0.067 |
| 1437.6 | 0.066 |
| 1437.7 | 0.067 |
| 1437.8 | 0.067 |
| 1437.9 | 0.067 |
| 1438.0 | 0.068 |
| 1438.1 | 0.068 |
| 1438.2 | 0.069 |
| 1438.3 | 0.069 |
| 1438.4 | 0.069 |
| 1438.5 | 0.07 |
| 1438.6 | 0.08 |
| 1438.7 | 0.082 |
| 1438.8 | 0.084 |
| 1438.9 | 0.086 |
| 1439.0 | 0.088 |
| 1439.1 | 0.09 |
| 1439.2 | 0.092 |
| 1439.3 | 0.094 |
| 1439.4 | 0.096 |
| 1439.5 | 0.098 |
| 1439.6 | 0.106 |
| 1439.7 | 0.109 |
| 1439.8 | 0.112 |
| 1439.9 | 0.115 |
| 1440.0 | 0.118 |
| 1440.1 | 0.122 |
| 1440.2 | 0.125 |
| 1440.3 | 0.128 |
| 1440.4 | 0.131 |
| 1440.5 | 0.134 |
| 1440.6 | 0.14 |
| 1440.7 | 0.143 |
| 1440.8 | 0.147 |
| 1440.9 | 0.15 |
| 1441.0 | 0.154 |
| 1441.1 | 0.157 |
| 1441.2 | 0.161 |
| 1441.3 | 0.164 |
| 1441.4 | 0.168 |
| 1441.5 | 0.171 |
| 1441.6 | 0.19 |
| 1441.7 | 0.196 |
| 1441.8 | 0.202 |
| 1441.9 | 0.208 |
| 1442.0 | 0.214 |
| 1442.1 | 0.22 |
| 1442.2 | 0.226 |
| 1442.3 | 0.232 |
| 1442.4 | 0.238 |
| 1442.5 | 0.244 |
| 1442.6 | 0.26 |
| 1442.7 | 0.268 |
| 1442.8 | 0.276 |
| 1442.9 | 0.284 |
| 1443.0 | 0.292 |
| 1443.1 | 0.3 |
| 1443.2 | 0.308 |
| 1443.3 | 0.316 |
| 1443.4 | 0.324 |
| 1443.5 | 0.332 |
| 1443.6 | 0.317 |
| 1443.7 | 0.321 |
| 1443.8 | 0.325 |
| 1443.9 | 0.329 |
| 1444.0 | 0.334 |
| 1444.1 | 0.338 |
| 1444.2 | 0.342 |
| 1444.3 | 0.346 |
| 1444.4 | 0.35 |
| 1444.5 | 0.355 |
| 1444.6 | 0.313 |
| 1444.7 | 0.309 |
| 1444.8 | 0.306 |
| 1444.9 | 0.303 |
| 1445.0 | 0.299 |
| 1445.1 | 0.296 |
| 1445.2 | 0.292 |
| 1445.3 | 0.289 |
| 1445.4 | 0.285 |
| 1445.5 | 0.282 |
| 1445.6 | 0.267 |
| 1445.7 | 0.261 |
| 1445.8 | 0.256 |
| 1445.9 | 0.25 |
| 1446.0 | 0.245 |
| 1446.1 | 0.24 |
| 1446.2 | 0.234 |
| 1446.3 | 0.229 |
| 1446.4 | 0.224 |
| 1446.5 | 0.218 |
| 1446.6 | 0.237 |
| 1446.7 | 0.235 |
| 1446.8 | 0.234 |
| 1446.9 | 0.233 |
| 1447.0 | 0.231 |
| 1447.1 | 0.23 |
| 1447.2 | 0.228 |
| 1447.3 | 0.227 |
| 1447.4 | 0.226 |
| 1447.5 | 0.224 |
| 1447.6 | 0.25 |
| 1447.7 | 0.253 |
| 1447.8 | 0.256 |
| 1447.9 | 0.259 |
| 1448.0 | 0.262 |
| 1448.1 | 0.266 |
| 1448.2 | 0.269 |
| 1448.3 | 0.272 |
| 1448.4 | 0.275 |
| 1448.5 | 0.278 |
| 1448.6 | 0.318 |
| 1448.7 | 0.328 |
| 1448.8 | 0.337 |
| 1448.9 | 0.347 |
| 1449.0 | 0.356 |
| 1449.1 | 0.366 |
| 1449.2 | 0.376 |
| 1449.3 | 0.385 |
| 1449.4 | 0.395 |
| 1449.5 | 0.405 |
| 1449.6 | 0.425 |
| 1449.7 | 0.436 |
| 1449.8 | 0.448 |
| 1449.9 | 0.459 |
| 1450.0 | 0.471 |
| 1450.1 | 0.483 |
| 1450.2 | 0.495 |
| 1450.3 | 0.506 |
| 1450.4 | 0.518 |
| 1450.5 | 0.53 |
| 1450.6 | 0.493 |
| 1450.7 | 0.496 |
| 1450.8 | 0.5 |
| 1450.9 | 0.504 |
| 1451.0 | 0.507 |
| 1451.1 | 0.511 |
| 1451.2 | 0.515 |
| 1451.3 | 0.518 |
| 1451.4 | 0.522 |
| 1451.5 | 0.526 |
| 1451.6 | 0.452 |
| 1451.7 | 0.443 |
| 1451.8 | 0.434 |
| 1451.9 | 0.425 |
| 1452.0 | 0.416 |
| 1452.1 | 0.407 |
| 1452.2 | 0.398 |
| 1452.3 | 0.389 |
| 1452.4 | 0.38 |
| 1452.5 | 0.372 |
| 1452.6 | 0.352 |
| 1452.7 | 0.342 |
| 1452.8 | 0.331 |
| 1452.9 | 0.321 |
| 1453.0 | 0.311 |
| 1453.1 | 0.3 |
| 1453.2 | 0.29 |
| 1453.3 | 0.28 |
| 1453.4 | 0.27 |
| 1453.5 | 0.26 |
| 1453.6 | 0.282 |
| 1453.7 | 0.277 |
| 1453.8 | 0.272 |
| 1453.9 | 0.267 |
| 1454.0 | 0.262 |
| 1454.1 | 0.257 |
| 1454.2 | 0.253 |
| 1454.3 | 0.248 |
| 1454.4 | 0.243 |
| 1454.5 | 0.238 |
| 1454.6 | 0.269 |
| 1454.7 | 0.27 |
| 1454.8 | 0.271 |
| 1454.9 | 0.272 |
| 1455.0 | 0.273 |
| 1455.1 | 0.274 |
| 1455.2 | 0.275 |
| 1455.3 | 0.276 |
| 1455.4 | 0.277 |
| 1455.5 | 0.279 |
| 1455.6 | 0.32 |
| 1455.7 | 0.328 |
| 1455.8 | 0.336 |
| 1455.9 | 0.344 |
| 1456.0 | 0.352 |
| 1456.1 | 0.36 |
| 1456.2 | 0.368 |
| 1456.3 | 0.376 |
| 1456.4 | 0.384 |
| 1456.5 | 0.392 |
| 1456.6 | 0.42 |
| 1456.7 | 0.431 |
| 1456.8 | 0.443 |
| 1456.9 | 0.455 |
| 1457.0 | 0.466 |
| 1457.1 | 0.478 |
| 1457.2 | 0.49 |
| 1457.3 | 0.502 |
| 1457.4 | 0.514 |
| 1457.5 | 0.526 |
| 1457.6 | 0.517 |
| 1457.7 | 0.526 |
| 1457.8 | 0.534 |
| 1457.9 | 0.543 |
| 1458.0 | 0.552 |
| 1458.1 | 0.56 |
| 1458.2 | 0.569 |
| 1458.3 | 0.578 |
| 1458.4 | 0.587 |
| 1458.5 | 0.595 |
| 1458.6 | 0.559 |
| 1458.7 | 0.56 |
| 1458.8 | 0.562 |
| 1458.9 | 0.563 |
| 1459.0 | 0.564 |
| 1459.1 | 0.565 |
| 1459.2 | 0.566 |
| 1459.3 | 0.568 |
| 1459.4 | 0.569 |
| 1459.5 | 0.57 |
| 1459.6 | 0.533 |
| 1459.7 | 0.528 |
| 1459.8 | 0.522 |
| 1459.9 | 0.517 |
| 1460.0 | 0.512 |
| 1460.1 | 0.507 |
| 1460.2 | 0.502 |
| 1460.3 | 0.497 |
| 1460.4 | 0.492 |
| 1460.5 | 0.487 |
| 1460.6 | 0.475 |
| 1460.7 | 0.469 |
| 1460.8 | 0.463 |
| 1460.9 | 0.457 |
| 1461.0 | 0.451 |
| 1461.1 | 0.445 |
| 1461.2 | 0.439 |
| 1461.3 | 0.433 |
| 1461.4 | 0.427 |
| 1461.5 | 0.421 |
| 1461.6 | 0.415 |
| 1461.7 | 0.409 |
| 1461.8 | 0.403 |
| 1461.9 | 0.397 |
| 1462.0 | 0.391 |
| 1462.1 | 0.385 |
| 1462.2 | 0.379 |
| 1462.3 | 0.373 |
| 1462.4 | 0.367 |
| 1462.5 | 0.361 |
| 1462.6 | 0.384 |
| 1462.7 | 0.382 |
| 1462.8 | 0.381 |
| 1462.9 | 0.38 |
| 1463.0 | 0.379 |
| 1463.1 | 0.378 |
| 1463.2 | 0.377 |
| 1463.3 | 0.375 |
| 1463.4 | 0.374 |
| 1463.5 | 0.373 |
| 1463.6 | 0.406 |
| 1463.7 | 0.411 |
| 1463.8 | 0.416 |
| 1463.9 | 0.42 |
| 1464.0 | 0.425 |
| 1464.1 | 0.429 |
| 1464.2 | 0.434 |
| 1464.3 | 0.439 |
| 1464.4 | 0.443 |
| 1464.5 | 0.448 |
| 1464.6 | 0.475 |
| 1464.7 | 0.484 |
| 1464.8 | 0.492 |
| 1464.9 | 0.501 |
| 1465.0 | 0.509 |
| 1465.1 | 0.518 |
| 1465.2 | 0.526 |
| 1465.3 | 0.535 |
| 1465.4 | 0.544 |
| 1465.5 | 0.552 |
| 1465.6 | 0.554 |
| 1465.7 | 0.561 |
| 1465.8 | 0.569 |
| 1465.9 | 0.576 |
| 1466.0 | 0.584 |
| 1466.1 | 0.591 |
| 1466.2 | 0.599 |
| 1466.3 | 0.607 |
| 1466.4 | 0.614 |
| 1466.5 | 0.622 |
| 1466.6 | 0.565 |
| 1466.7 | 0.561 |
| 1466.8 | 0.558 |
| 1466.9 | 0.555 |
| 1467.0 | 0.552 |
| 1467.1 | 0.549 |
| 1467.2 | 0.546 |
| 1467.3 | 0.542 |
| 1467.4 | 0.539 |
| 1467.5 | 0.536 |
| 1467.6 | 0.482 |
| 1467.7 | 0.47 |
| 1467.8 | 0.459 |
| 1467.9 | 0.448 |
| 1468.0 | 0.436 |
| 1468.1 | 0.425 |
| 1468.2 | 0.414 |
| 1468.3 | 0.403 |
| 1468.4 | 0.391 |
| 1468.5 | 0.38 |
| 1468.6 | 0.378 |
| 1468.7 | 0.369 |
| 1468.8 | 0.359 |
| 1468.9 | 0.35 |
| 1469.0 | 0.34 |
| 1469.1 | 0.331 |
| 1469.2 | 0.322 |
| 1469.3 | 0.312 |
| 1469.4 | 0.303 |
| 1469.5 | 0.294 |
| 1469.6 | 0.315 |
| 1469.7 | 0.311 |
| 1469.8 | 0.307 |
| 1469.9 | 0.303 |
| 1470.0 | 0.299 |
| 1470.1 | 0.295 |
| 1470.2 | 0.291 |
| 1470.3 | 0.287 |
| 1470.4 | 0.283 |
| 1470.5 | 0.279 |
| 1470.6 | 0.278 |
| 1470.7 | 0.274 |
| 1470.8 | 0.271 |
| 1470.9 | 0.267 |
| 1471.0 | 0.264 |
| 1471.1 | 0.26 |
| 1471.2 | 0.257 |
| 1471.3 | 0.253 |
| 1471.4 | 0.25 |
| 1471.5 | 0.246 |
| 1471.6 | 0.236 |
| 1471.7 | 0.231 |
| 1471.8 | 0.226 |
| 1471.9 | 0.222 |
| 1472.0 | 0.217 |
| 1472.1 | 0.213 |
| 1472.2 | 0.208 |
| 1472.3 | 0.203 |
| 1472.4 | 0.199 |
| 1472.5 | 0.194 |
| 1472.6 | 0.187 |
| 1472.7 | 0.182 |
| 1472.8 | 0.177 |
| 1472.9 | 0.172 |
| 1473.0 | 0.166 |
| 1473.1 | 0.161 |
| 1473.2 | 0.156 |
| 1473.3 | 0.151 |
| 1473.4 | 0.147 |
| 1473.5 | 0.142 |
| 1473.6 | 0.142 |
| 1473.7 | 0.138 |
| 1473.8 | 0.134 |
| 1473.9 | 0.13 |
| 1474.0 | 0.126 |
| 1474.1 | 0.122 |
| 1474.2 | 0.118 |
| 1474.3 | 0.114 |
| 1474.4 | 0.11 |
| 1474.5 | 0.106 |
| 1474.6 | 0.108 |
| 1474.7 | 0.106 |
| 1474.8 | 0.103 |
| 1474.9 | 0.1 |
| 1475.0 | 0.097 |
| 1475.1 | 0.094 |
| 1475.2 | 0.091 |
| 1475.3 | 0.088 |
| 1475.4 | 0.085 |
| 1475.5 | 0.082 |
| 1475.6 | 0.09 |
| 1475.7 | 0.089 |
| 1475.8 | 0.088 |
| 1475.9 | 0.087 |
| 1476.0 | 0.086 |
| 1476.1 | 0.085 |
| 1476.2 | 0.084 |
| 1476.3 | 0.083 |
| 1476.4 | 0.081 |
| 1476.5 | 0.08 |
| 1476.6 | 0.081 |
| 1476.7 | 0.08 |
| 1476.8 | 0.08 |
| 1476.9 | 0.079 |
| 1477.0 | 0.078 |
| 1477.1 | 0.077 |
| 1477.2 | 0.077 |
| 1477.3 | 0.076 |
| 1477.4 | 0.075 |
| 1477.5 | 0.074 |
| 1477.6 | 0.075 |
| 1477.7 | 0.074 |
| 1477.8 | 0.074 |
| 1477.9 | 0.073 |
| 1478.0 | 0.073 |
| 1478.1 | 0.072 |
| 1478.2 | 0.072 |
| 1478.3 | 0.071 |
| 1478.4 | 0.071 |
| 1478.5 | 0.07 |
| 1478.6 | 0.075 |
| 1478.7 | 0.076 |
| 1478.8 | 0.076 |
| 1478.9 | 0.076 |
| 1479.0 | 0.077 |
| 1479.1 | 0.077 |
| 1479.2 | 0.078 |
| 1479.3 | 0.078 |
| 1479.4 | 0.078 |
| 1479.5 | 0.079 |
| 1479.6 | 0.077 |
| 1479.7 | 0.077 |
| 1479.8 | 0.077 |
| 1479.9 | 0.077 |
| 1480.0 | 0.077 |
| 1480.1 | 0.077 |
| 1480.2 | 0.077 |
| 1480.3 | 0.077 |
| 1480.4 | 0.077 |
| 1480.5 | 0.078 |
| 1480.6 | 0.077 |
| 1480.7 | 0.076 |
| 1480.8 | 0.076 |
| 1480.9 | 0.076 |
| 1481.0 | 0.076 |
| 1481.1 | 0.076 |
| 1481.2 | 0.076 |
| 1481.3 | 0.076 |
| 1481.4 | 0.076 |
| 1481.5 | 0.076 |
| 1481.6 | 0.081 |
| 1481.7 | 0.081 |
| 1481.8 | 0.082 |
| 1481.9 | 0.083 |
| 1482.0 | 0.084 |
| 1482.1 | 0.085 |
| 1482.2 | 0.085 |
| 1482.3 | 0.086 |
| 1482.4 | 0.087 |
| 1482.5 | 0.088 |
| 1482.6 | 0.085 |
| 1482.7 | 0.085 |
| 1482.8 | 0.085 |
| 1482.9 | 0.085 |
| 1483.0 | 0.086 |
| 1483.1 | 0.086 |
| 1483.2 | 0.086 |
| 1483.3 | 0.086 |
| 1483.4 | 0.086 |
| 1483.5 | 0.086 |
| 1483.6 | 0.082 |
| 1483.7 | 0.081 |
| 1483.8 | 0.081 |
| 1483.9 | 0.08 |
| 1484.0 | 0.079 |
| 1484.1 | 0.079 |
| 1484.2 | 0.078 |
| 1484.3 | 0.078 |
| 1484.4 | 0.077 |
| 1484.5 | 0.076 |
| 1484.6 | 0.079 |
| 1484.7 | 0.079 |
| 1484.8 | 0.079 |
| 1484.9 | 0.079 |
| 1485.0 | 0.079 |
| 1485.1 | 0.079 |
| 1485.2 | 0.079 |
| 1485.3 | 0.079 |
| 1485.4 | 0.079 |
| 1485.5 | 0.079 |
| 1485.6 | 0.078 |
| 1485.7 | 0.078 |
| 1485.8 | 0.078 |
| 1485.9 | 0.078 |
| 1486.0 | 0.078 |
| 1486.1 | 0.078 |
| 1486.2 | 0.078 |
| 1486.3 | 0.078 |
| 1486.4 | 0.077 |
| 1486.5 | 0.077 |
| 1486.6 | 0.08 |
| 1486.7 | 0.081 |
| 1486.8 | 0.081 |
| 1486.9 | 0.081 |
| 1487.0 | 0.082 |
| 1487.1 | 0.082 |
| 1487.2 | 0.083 |
| 1487.3 | 0.083 |
| 1487.4 | 0.083 |
| 1487.5 | 0.084 |
| 1487.6 | 0.092 |
| 1487.7 | 0.094 |
| 1487.8 | 0.096 |
| 1487.9 | 0.097 |
| 1488.0 | 0.099 |
| 1488.1 | 0.101 |
| 1488.2 | 0.103 |
| 1488.3 | 0.104 |
| 1488.4 | 0.106 |
| 1488.5 | 0.108 |
| 1488.6 | 0.113 |
| 1488.7 | 0.115 |
| 1488.8 | 0.117 |
| 1488.9 | 0.12 |
| 1489.0 | 0.122 |
| 1489.1 | 0.124 |
| 1489.2 | 0.126 |
| 1489.3 | 0.129 |
| 1489.4 | 0.131 |
| 1489.5 | 0.133 |
| 1489.6 | 0.138 |
| 1489.7 | 0.141 |
| 1489.8 | 0.144 |
| 1489.9 | 0.146 |
| 1490.0 | 0.149 |
| 1490.1 | 0.152 |
| 1490.2 | 0.155 |
| 1490.3 | 0.157 |
| 1490.4 | 0.16 |
| 1490.5 | 0.163 |
| 1490.6 | 0.168 |
| 1490.7 | 0.171 |
| 1490.8 | 0.174 |
| 1490.9 | 0.178 |
| 1491.0 | 0.181 |
| 1491.1 | 0.184 |
| 1491.2 | 0.187 |
| 1491.3 | 0.19 |
| 1491.4 | 0.193 |
| 1491.5 | 0.197 |
| 1491.6 | 0.218 |
| 1491.7 | 0.224 |
| 1491.8 | 0.23 |
| 1491.9 | 0.237 |
| 1492.0 | 0.243 |
| 1492.1 | 0.249 |
| 1492.2 | 0.256 |
| 1492.3 | 0.262 |
| 1492.4 | 0.268 |
| 1492.5 | 0.275 |
| 1492.6 | 0.285 |
| 1492.7 | 0.293 |
| 1492.8 | 0.3 |
| 1492.9 | 0.307 |
| 1493.0 | 0.314 |
| 1493.1 | 0.321 |
| 1493.2 | 0.329 |
| 1493.3 | 0.336 |
| 1493.4 | 0.343 |
| 1493.5 | 0.35 |
| 1493.6 | 0.364 |
| 1493.7 | 0.372 |
| 1493.8 | 0.381 |
| 1493.9 | 0.389 |
| 1494.0 | 0.398 |
| 1494.1 | 0.406 |
| 1494.2 | 0.415 |
| 1494.3 | 0.423 |
| 1494.4 | 0.432 |
| 1494.5 | 0.44 |
| 1494.6 | 0.414 |
| 1494.7 | 0.416 |
| 1494.8 | 0.419 |
| 1494.9 | 0.422 |
| 1495.0 | 0.424 |
| 1495.1 | 0.427 |
| 1495.2 | 0.43 |
| 1495.3 | 0.432 |
| 1495.4 | 0.435 |
| 1495.5 | 0.438 |
| 1495.6 | 0.38 |
| 1495.7 | 0.372 |
| 1495.8 | 0.365 |
| 1495.9 | 0.358 |
| 1496.0 | 0.35 |
| 1496.1 | 0.343 |
| 1496.2 | 0.336 |
| 1496.3 | 0.329 |
| 1496.4 | 0.321 |
| 1496.5 | 0.314 |
| 1496.6 | 0.287 |
| 1496.7 | 0.277 |
| 1496.8 | 0.266 |
| 1496.9 | 0.256 |
| 1497.0 | 0.246 |
| 1497.1 | 0.235 |
| 1497.2 | 0.225 |
| 1497.3 | 0.215 |
| 1497.4 | 0.205 |
| 1497.5 | 0.195 |
| 1497.6 | 0.213 |
| 1497.7 | 0.207 |
| 1497.8 | 0.202 |
| 1497.9 | 0.197 |
| 1498.0 | 0.191 |
| 1498.1 | 0.186 |
| 1498.2 | 0.18 |
| 1498.3 | 0.175 |
| 1498.4 | 0.17 |
| 1498.5 | 0.164 |
| 1498.6 | 0.184 |
| 1498.7 | 0.183 |
| 1498.8 | 0.182 |
| 1498.9 | 0.181 |
| 1499.0 | 0.18 |
| 1499.1 | 0.179 |
| 1499.2 | 0.178 |
| 1499.3 | 0.176 |
| 1499.4 | 0.175 |
| 1499.5 | 0.174 |
| 1499.6 | 0.195 |
| 1499.7 | 0.198 |
| 1499.8 | 0.2 |
| 1499.9 | 0.203 |
| 1500.0 | 0.205 |
| 1500.1 | 0.208 |
| 1500.2 | 0.21 |
| 1500.3 | 0.213 |
| 1500.4 | 0.216 |
| 1500.5 | 0.218 |
| 1500.6 | 0.23 |
| 1500.7 | 0.235 |
| 1500.8 | 0.239 |
| 1500.9 | 0.243 |
| 1501.0 | 0.247 |
| 1501.1 | 0.251 |
| 1501.2 | 0.256 |
| 1501.3 | 0.26 |
| 1501.4 | 0.264 |
| 1501.5 | 0.268 |
| 1501.6 | 0.285 |
| 1501.7 | 0.291 |
| 1501.8 | 0.298 |
| 1501.9 | 0.304 |
| 1502.0 | 0.311 |
| 1502.1 | 0.317 |
| 1502.2 | 0.323 |
| 1502.3 | 0.33 |
| 1502.4 | 0.336 |
| 1502.5 | 0.343 |
| 1502.6 | 0.331 |
| 1502.7 | 0.334 |
| 1502.8 | 0.338 |
| 1502.9 | 0.341 |
| 1503.0 | 0.344 |
| 1503.1 | 0.348 |
| 1503.2 | 0.351 |
| 1503.3 | 0.354 |
| 1503.4 | 0.358 |
| 1503.5 | 0.361 |
| 1503.6 | 0.327 |
| 1503.7 | 0.325 |
| 1503.8 | 0.322 |
| 1503.9 | 0.319 |
| 1504.0 | 0.316 |
| 1504.1 | 0.314 |
| 1504.2 | 0.311 |
| 1504.3 | 0.308 |
| 1504.4 | 0.305 |
| 1504.5 | 0.302 |
| 1504.6 | 0.265 |
| 1504.7 | 0.257 |
| 1504.8 | 0.249 |
| 1504.9 | 0.24 |
| 1505.0 | 0.232 |
| 1505.1 | 0.224 |
| 1505.2 | 0.216 |
| 1505.3 | 0.207 |
| 1505.4 | 0.199 |
| 1505.5 | 0.191 |
| 1505.6 | 0.188 |
| 1505.7 | 0.181 |
| 1505.8 | 0.173 |
| 1505.9 | 0.166 |
| 1506.0 | 0.159 |
| 1506.1 | 0.152 |
| 1506.2 | 0.144 |
| 1506.3 | 0.137 |
| 1506.4 | 0.13 |
| 1506.5 | 0.123 |
| 1506.6 | 0.139 |
| 1506.7 | 0.136 |
| 1506.8 | 0.133 |
| 1506.9 | 0.13 |
| 1507.0 | 0.126 |
| 1507.1 | 0.123 |
| 1507.2 | 0.12 |
| 1507.3 | 0.117 |
| 1507.4 | 0.113 |
| 1507.5 | 0.11 |
| 1507.6 | 0.119 |
| 1507.7 | 0.118 |
| 1507.8 | 0.117 |
| 1507.9 | 0.116 |
| 1508.0 | 0.115 |
| 1508.1 | 0.114 |
| 1508.2 | 0.113 |
| 1508.3 | 0.111 |
| 1508.4 | 0.11 |
| 1508.5 | 0.109 |
| 1508.6 | 0.123 |
| 1508.7 | 0.124 |
| 1508.8 | 0.126 |
| 1508.9 | 0.127 |
| 1509.0 | 0.129 |
| 1509.1 | 0.13 |
| 1509.2 | 0.131 |
| 1509.3 | 0.133 |
| 1509.4 | 0.134 |
| 1509.5 | 0.135 |
| 1509.6 | 0.14 |
| 1509.7 | 0.142 |
| 1509.8 | 0.144 |
| 1509.9 | 0.146 |
| 1510.0 | 0.148 |
| 1510.1 | 0.15 |
| 1510.2 | 0.151 |
| 1510.3 | 0.153 |
| 1510.4 | 0.155 |
| 1510.5 | 0.157 |
| 1510.6 | 0.163 |
| 1510.7 | 0.165 |
| 1510.8 | 0.168 |
| 1510.9 | 0.17 |
| 1511.0 | 0.173 |
| 1511.1 | 0.175 |
| 1511.2 | 0.178 |
| 1511.3 | 0.18 |
| 1511.4 | 0.183 |
| 1511.5 | 0.185 |
| 1511.6 | 0.197 |
| 1511.7 | 0.201 |
| 1511.8 | 0.205 |
| 1511.9 | 0.209 |
| 1512.0 | 0.213 |
| 1512.1 | 0.217 |
| 1512.2 | 0.221 |
| 1512.3 | 0.225 |
| 1512.4 | 0.229 |
| 1512.5 | 0.233 |
| 1512.6 | 0.234 |
| 1512.7 | 0.238 |
| 1512.8 | 0.241 |
| 1512.9 | 0.245 |
| 1513.0 | 0.249 |
| 1513.1 | 0.252 |
| 1513.2 | 0.256 |
| 1513.3 | 0.26 |
| 1513.4 | 0.263 |
| 1513.5 | 0.267 |
| 1513.6 | 0.295 |
| 1513.7 | 0.303 |
| 1513.8 | 0.311 |
| 1513.9 | 0.319 |
| 1514.0 | 0.327 |
| 1514.1 | 0.335 |
| 1514.2 | 0.343 |
| 1514.3 | 0.351 |
| 1514.4 | 0.359 |
| 1514.5 | 0.367 |
| 1514.6 | 0.378 |
| 1514.7 | 0.386 |
| 1514.8 | 0.395 |
| 1514.9 | 0.403 |
| 1515.0 | 0.412 |
| 1515.1 | 0.421 |
| 1515.2 | 0.429 |
| 1515.3 | 0.438 |
| 1515.4 | 0.447 |
| 1515.5 | 0.456 |
| 1515.6 | 0.427 |
| 1515.7 | 0.43 |
| 1515.8 | 0.432 |
| 1515.9 | 0.435 |
| 1516.0 | 0.437 |
| 1516.1 | 0.44 |
| 1516.2 | 0.442 |
| 1516.3 | 0.445 |
| 1516.4 | 0.447 |
| 1516.5 | 0.45 |
| 1516.6 | 0.418 |
| 1516.7 | 0.414 |
| 1516.8 | 0.411 |
| 1516.9 | 0.408 |
| 1517.0 | 0.405 |
| 1517.1 | 0.401 |
| 1517.2 | 0.398 |
| 1517.3 | 0.395 |
| 1517.4 | 0.392 |
| 1517.5 | 0.388 |
| 1517.6 | 0.385 |
| 1517.7 | 0.382 |
| 1517.8 | 0.378 |
| 1517.9 | 0.375 |
| 1518.0 | 0.372 |
| 1518.1 | 0.368 |
| 1518.2 | 0.365 |
| 1518.3 | 0.362 |
| 1518.4 | 0.359 |
| 1518.5 | 0.355 |
| 1518.6 | 0.338 |
| 1518.7 | 0.333 |
| 1518.8 | 0.327 |
| 1518.9 | 0.322 |
| 1519.0 | 0.316 |
| 1519.1 | 0.311 |
| 1519.2 | 0.305 |
| 1519.3 | 0.3 |
| 1519.4 | 0.295 |
| 1519.5 | 0.289 |
| 1519.6 | 0.271 |
| 1519.7 | 0.263 |
| 1519.8 | 0.256 |
| 1519.9 | 0.249 |
| 1520.0 | 0.241 |
| 1520.1 | 0.234 |
| 1520.2 | 0.226 |
| 1520.3 | 0.219 |
| 1520.4 | 0.212 |
| 1520.5 | 0.204 |
| 1520.6 | 0.202 |
| 1520.7 | 0.196 |
| 1520.8 | 0.19 |
| 1520.9 | 0.183 |
| 1521.0 | 0.177 |
| 1521.1 | 0.171 |
| 1521.2 | 0.164 |
| 1521.3 | 0.158 |
| 1521.4 | 0.152 |
| 1521.5 | 0.145 |
| 1521.6 | 0.166 |
| 1521.7 | 0.165 |
| 1521.8 | 0.163 |
| 1521.9 | 0.161 |
| 1522.0 | 0.159 |
| 1522.1 | 0.158 |
| 1522.2 | 0.156 |
| 1522.3 | 0.154 |
| 1522.4 | 0.153 |
| 1522.5 | 0.151 |
| 1522.6 | 0.18 |
| 1522.7 | 0.184 |
| 1522.8 | 0.187 |
| 1522.9 | 0.191 |
| 1523.0 | 0.194 |
| 1523.1 | 0.198 |
| 1523.2 | 0.202 |
| 1523.3 | 0.205 |
| 1523.4 | 0.209 |
| 1523.5 | 0.212 |
| 1523.6 | 0.227 |
| 1523.7 | 0.232 |
| 1523.8 | 0.238 |
| 1523.9 | 0.243 |
| 1524.0 | 0.249 |
| 1524.1 | 0.254 |
| 1524.2 | 0.26 |
| 1524.3 | 0.265 |
| 1524.4 | 0.271 |
| 1524.5 | 0.276 |
| 1524.6 | 0.313 |
| 1524.7 | 0.324 |
| 1524.8 | 0.335 |
| 1524.9 | 0.346 |
| 1525.0 | 0.357 |
| 1525.1 | 0.368 |
| 1525.2 | 0.379 |
| 1525.3 | 0.39 |
| 1525.4 | 0.401 |
| 1525.5 | 0.412 |
| 1525.6 | 0.435 |
| 1525.7 | 0.448 |
| 1525.8 | 0.461 |
| 1525.9 | 0.475 |
| 1526.0 | 0.488 |
| 1526.1 | 0.501 |
| 1526.2 | 0.515 |
| 1526.3 | 0.529 |
| 1526.4 | 0.542 |
| 1526.5 | 0.556 |
| 1526.6 | 0.525 |
| 1526.7 | 0.531 |
| 1526.8 | 0.538 |
| 1526.9 | 0.544 |
| 1527.0 | 0.55 |
| 1527.1 | 0.556 |
| 1527.2 | 0.563 |
| 1527.3 | 0.569 |
| 1527.4 | 0.575 |
| 1527.5 | 0.582 |
| 1527.6 | 0.543 |
| 1527.7 | 0.541 |
| 1527.8 | 0.54 |
| 1527.9 | 0.539 |
| 1528.0 | 0.538 |
| 1528.1 | 0.537 |
| 1528.2 | 0.535 |
| 1528.3 | 0.534 |
| 1528.4 | 0.533 |
| 1528.5 | 0.532 |
| 1528.6 | 0.537 |
| 1528.7 | 0.537 |
| 1528.8 | 0.536 |
| 1528.9 | 0.536 |
| 1529.0 | 0.536 |
| 1529.1 | 0.536 |
| 1529.2 | 0.536 |
| 1529.3 | 0.536 |
| 1529.4 | 0.535 |
| 1529.5 | 0.535 |
| 1529.6 | 0.539 |
| 1529.7 | 0.539 |
| 1529.8 | 0.54 |
| 1529.9 | 0.54 |
| 1530.0 | 0.541 |
| 1530.1 | 0.541 |
| 1530.2 | 0.542 |
| 1530.3 | 0.542 |
| 1530.4 | 0.543 |
| 1530.5 | 0.543 |
| 1530.6 | 0.53 |
| 1530.7 | 0.529 |
| 1530.8 | 0.527 |
| 1530.9 | 0.525 |
| 1531.0 | 0.524 |
| 1531.1 | 0.522 |
| 1531.2 | 0.52 |
| 1531.3 | 0.518 |
| 1531.4 | 0.517 |
| 1531.5 | 0.515 |
| 1531.6 | 0.496 |
| 1531.7 | 0.492 |
| 1531.8 | 0.487 |
| 1531.9 | 0.483 |
| 1532.0 | 0.478 |
| 1532.1 | 0.474 |
| 1532.2 | 0.469 |
| 1532.3 | 0.465 |
| 1532.4 | 0.46 |
| 1532.5 | 0.456 |
| 1532.6 | 0.49 |
| 1532.7 | 0.492 |
| 1532.8 | 0.494 |
| 1532.9 | 0.496 |
| 1533.0 | 0.498 |
| 1533.1 | 0.5 |
| 1533.2 | 0.502 |
| 1533.3 | 0.504 |
| 1533.4 | 0.506 |
| 1533.5 | 0.508 |
| 1533.6 | 0.592 |
| 1533.7 | 0.608 |
| 1533.8 | 0.625 |
| 1533.9 | 0.641 |
| 1534.0 | 0.657 |
| 1534.1 | 0.674 |
| 1534.2 | 0.69 |
| 1534.3 | 0.707 |
| 1534.4 | 0.724 |
| 1534.5 | 0.741 |
| 1534.6 | 0.841 |
| 1534.7 | 0.873 |
| 1534.8 | 0.906 |
| 1534.9 | 0.939 |
| 1535.0 | 0.972 |
| 1535.1 | 1.005 |
| 1535.2 | 1.04 |
| 1535.3 | 1.074 |
| 1535.4 | 1.109 |
| 1535.5 | 1.144 |
| 1535.6 | 1.213 |
| 1535.7 | 1.256 |
| 1535.8 | 1.299 |
| 1535.9 | 1.343 |
| 1536.0 | 1.388 |
| 1536.1 | 1.433 |
| 1536.2 | 1.479 |
| 1536.3 | 1.526 |
| 1536.4 | 1.574 |
| 1536.5 | 1.623 |
| 1536.6 | 1.491 |
| 1536.7 | 1.509 |
| 1536.8 | 1.527 |
| 1536.9 | 1.544 |
| 1537.0 | 1.562 |
| 1537.1 | 1.581 |
| 1537.2 | 1.599 |
| 1537.3 | 1.617 |
| 1537.4 | 1.636 |
| 1537.5 | 1.654 |
| 1537.6 | 1.4 |
| 1537.7 | 1.373 |
| 1537.8 | 1.348 |
| 1537.9 | 1.322 |
| 1538.0 | 1.296 |
| 1538.1 | 1.271 |
| 1538.2 | 1.246 |
| 1538.3 | 1.222 |
| 1538.4 | 1.197 |
| 1538.5 | 1.173 |
| 1538.6 | 1.064 |
| 1538.7 | 1.027 |
| 1538.8 | 0.991 |
| 1538.9 | 0.955 |
| 1539.0 | 0.92 |
| 1539.1 | 0.885 |
| 1539.2 | 0.851 |
| 1539.3 | 0.817 |
| 1539.4 | 0.783 |
| 1539.5 | 0.75 |
| 1539.6 | 0.758 |
| 1539.7 | 0.732 |
| 1539.8 | 0.706 |
| 1539.9 | 0.681 |
| 1540.0 | 0.655 |
| 1540.1 | 0.63 |
| 1540.2 | 0.605 |
| 1540.3 | 0.581 |
| 1540.4 | 0.556 |
| 1540.5 | 0.532 |
| 1540.6 | 0.577 |
| 1540.7 | 0.564 |
| 1540.8 | 0.551 |
| 1540.9 | 0.539 |
| 1541.0 | 0.526 |
| 1541.1 | 0.513 |
| 1541.2 | 0.501 |
| 1541.3 | 0.488 |
| 1541.4 | 0.476 |
| 1541.5 | 0.463 |
| 1541.6 | 0.482 |
| 1541.7 | 0.475 |
| 1541.8 | 0.468 |
| 1541.9 | 0.461 |
| 1542.0 | 0.454 |
| 1542.1 | 0.447 |
| 1542.2 | 0.44 |
| 1542.3 | 0.433 |
| 1542.4 | 0.426 |
| 1542.5 | 0.419 |
| 1542.6 | 0.433 |
| 1542.7 | 0.429 |
| 1542.8 | 0.425 |
| 1542.9 | 0.422 |
| 1543.0 | 0.418 |
| 1543.1 | 0.415 |
| 1543.2 | 0.411 |
| 1543.3 | 0.408 |
| 1543.4 | 0.404 |
| 1543.5 | 0.401 |
| 1543.6 | 0.411 |
| 1543.7 | 0.41 |
| 1543.8 | 0.408 |
| 1543.9 | 0.407 |
| 1544.0 | 0.406 |
| 1544.1 | 0.405 |
| 1544.2 | 0.403 |
| 1544.3 | 0.402 |
| 1544.4 | 0.401 |
| 1544.5 | 0.4 |
| 1544.6 | 0.427 |
| 1544.7 | 0.431 |
| 1544.8 | 0.434 |
| 1544.9 | 0.438 |
| 1545.0 | 0.441 |
| 1545.1 | 0.445 |
| 1545.2 | 0.449 |
| 1545.3 | 0.452 |
| 1545.4 | 0.456 |
| 1545.5 | 0.459 |
| 1545.6 | 0.458 |
| 1545.7 | 0.461 |
| 1545.8 | 0.463 |
| 1545.9 | 0.466 |
| 1546.0 | 0.469 |
| 1546.1 | 0.472 |
| 1546.2 | 0.474 |
| 1546.3 | 0.477 |
| 1546.4 | 0.48 |
| 1546.5 | 0.483 |
| 1546.6 | 0.429 |
| 1546.7 | 0.423 |
| 1546.8 | 0.416 |
| 1546.9 | 0.409 |
| 1547.0 | 0.403 |
| 1547.1 | 0.396 |
| 1547.2 | 0.39 |
| 1547.3 | 0.383 |
| 1547.4 | 0.377 |
| 1547.5 | 0.371 |
| 1547.6 | 0.361 |
| 1547.7 | 0.354 |
| 1547.8 | 0.347 |
| 1547.9 | 0.34 |
| 1548.0 | 0.333 |
| 1548.1 | 0.326 |
| 1548.2 | 0.319 |
| 1548.3 | 0.312 |
| 1548.4 | 0.305 |
| 1548.5 | 0.299 |
| 1548.6 | 0.32 |
| 1548.7 | 0.317 |
| 1548.8 | 0.315 |
| 1548.9 | 0.313 |
| 1549.0 | 0.311 |
| 1549.1 | 0.308 |
| 1549.2 | 0.306 |
| 1549.3 | 0.304 |
| 1549.4 | 0.302 |
| 1549.5 | 0.3 |
| 1549.6 | 0.312 |
| 1549.7 | 0.312 |
| 1549.8 | 0.312 |
| 1549.9 | 0.312 |
| 1550.0 | 0.313 |
| 1550.1 | 0.313 |
| 1550.2 | 0.313 |
| 1550.3 | 0.313 |
| 1550.4 | 0.313 |
| 1550.5 | 0.314 |
| 1550.6 | 0.322 |
| 1550.7 | 0.324 |
| 1550.8 | 0.325 |
| 1550.9 | 0.327 |
| 1551.0 | 0.328 |
| 1551.1 | 0.33 |
| 1551.2 | 0.331 |
| 1551.3 | 0.333 |
| 1551.4 | 0.335 |
| 1551.5 | 0.336 |
| 1551.6 | 0.361 |
| 1551.7 | 0.367 |
| 1551.8 | 0.373 |
| 1551.9 | 0.378 |
| 1552.0 | 0.384 |
| 1552.1 | 0.389 |
| 1552.2 | 0.395 |
| 1552.3 | 0.401 |
| 1552.4 | 0.406 |
| 1552.5 | 0.412 |
| 1552.6 | 0.443 |
| 1552.7 | 0.453 |
| 1552.8 | 0.463 |
| 1552.9 | 0.473 |
| 1553.0 | 0.483 |
| 1553.1 | 0.493 |
| 1553.2 | 0.504 |
| 1553.3 | 0.514 |
| 1553.4 | 0.524 |
| 1553.5 | 0.534 |
| 1553.6 | 0.453 |
| 1553.7 | 0.447 |
| 1553.8 | 0.442 |
| 1553.9 | 0.437 |
| 1554.0 | 0.432 |
| 1554.1 | 0.427 |
| 1554.2 | 0.422 |
| 1554.3 | 0.417 |
| 1554.4 | 0.412 |
| 1554.5 | 0.407 |
| 1554.6 | 0.353 |
| 1554.7 | 0.34 |
| 1554.8 | 0.327 |
| 1554.9 | 0.314 |
| 1555.0 | 0.301 |
| 1555.1 | 0.288 |
| 1555.2 | 0.275 |
| 1555.3 | 0.263 |
| 1555.4 | 0.25 |
| 1555.5 | 0.238 |
| 1555.6 | 0.267 |
| 1555.7 | 0.261 |
| 1555.8 | 0.256 |
| 1555.9 | 0.25 |
| 1556.0 | 0.244 |
| 1556.1 | 0.239 |
| 1556.2 | 0.233 |
| 1556.3 | 0.228 |
| 1556.4 | 0.222 |
| 1556.5 | 0.217 |
| 1556.6 | 0.238 |
| 1556.7 | 0.236 |
| 1556.8 | 0.235 |
| 1556.9 | 0.234 |
| 1557.0 | 0.233 |
| 1557.1 | 0.232 |
| 1557.2 | 0.231 |
| 1557.3 | 0.23 |
| 1557.4 | 0.229 |
| 1557.5 | 0.227 |
| 1557.6 | 0.261 |
| 1557.7 | 0.266 |
| 1557.8 | 0.271 |
| 1557.9 | 0.276 |
| 1558.0 | 0.28 |
| 1558.1 | 0.285 |
| 1558.2 | 0.29 |
| 1558.3 | 0.295 |
| 1558.4 | 0.3 |
| 1558.5 | 0.304 |
| 1558.6 | 0.385 |
| 1558.7 | 0.402 |
| 1558.8 | 0.42 |
| 1558.9 | 0.438 |
| 1559.0 | 0.457 |
| 1559.1 | 0.475 |
| 1559.2 | 0.493 |
| 1559.3 | 0.512 |
| 1559.4 | 0.53 |
| 1559.5 | 0.549 |
| 1559.6 | 0.561 |
| 1559.7 | 0.579 |
| 1559.8 | 0.597 |
| 1559.9 | 0.615 |
| 1560.0 | 0.633 |
| 1560.1 | 0.651 |
| 1560.2 | 0.67 |
| 1560.3 | 0.688 |
| 1560.4 | 0.707 |
| 1560.5 | 0.726 |
| 1560.6 | 0.605 |
| 1560.7 | 0.6 |
| 1560.8 | 0.596 |
| 1560.9 | 0.591 |
| 1561.0 | 0.587 |
| 1561.1 | 0.582 |
| 1561.2 | 0.577 |
| 1561.3 | 0.573 |
| 1561.4 | 0.568 |
| 1561.5 | 0.564 |
| 1561.6 | 0.463 |
| 1561.7 | 0.443 |
| 1561.8 | 0.423 |
| 1561.9 | 0.403 |
| 1562.0 | 0.383 |
| 1562.1 | 0.364 |
| 1562.2 | 0.345 |
| 1562.3 | 0.325 |
| 1562.4 | 0.306 |
| 1562.5 | 0.287 |
| 1562.6 | 0.286 |
| 1562.7 | 0.27 |
| 1562.8 | 0.254 |
| 1562.9 | 0.238 |
| 1563.0 | 0.222 |
| 1563.1 | 0.207 |
| 1563.2 | 0.191 |
| 1563.3 | 0.176 |
| 1563.4 | 0.16 |
| 1563.5 | 0.145 |
| 1563.6 | 0.183 |
| 1563.7 | 0.176 |
| 1563.8 | 0.17 |
| 1563.9 | 0.164 |
| 1564.0 | 0.157 |
| 1564.1 | 0.151 |
| 1564.2 | 0.144 |
| 1564.3 | 0.138 |
| 1564.4 | 0.131 |
| 1564.5 | 0.125 |
| 1564.6 | 0.136 |
| 1564.7 | 0.133 |
| 1564.8 | 0.129 |
| 1564.9 | 0.126 |
| 1565.0 | 0.123 |
| 1565.1 | 0.119 |
| 1565.2 | 0.116 |
| 1565.3 | 0.112 |
| 1565.4 | 0.109 |
| 1565.5 | 0.106 |
| 1565.6 | 0.109 |
| 1565.7 | 0.106 |
| 1565.8 | 0.104 |
| 1565.9 | 0.102 |
| 1566.0 | 0.099 |
| 1566.1 | 0.097 |
| 1566.2 | 0.095 |
| 1566.3 | 0.092 |
| 1566.4 | 0.09 |
| 1566.5 | 0.088 |
| 1566.6 | 0.093 |
| 1566.7 | 0.092 |
| 1566.8 | 0.091 |
| 1566.9 | 0.09 |
| 1567.0 | 0.089 |
| 1567.1 | 0.088 |
| 1567.2 | 0.087 |
| 1567.3 | 0.086 |
| 1567.4 | 0.085 |
| 1567.5 | 0.084 |
| 1567.6 | 0.084 |
| 1567.7 | 0.083 |
| 1567.8 | 0.082 |
| 1567.9 | 0.082 |
| 1568.0 | 0.081 |
| 1568.1 | 0.08 |
| 1568.2 | 0.079 |
| 1568.3 | 0.078 |
| 1568.4 | 0.077 |
| 1568.5 | 0.077 |
| 1568.6 | 0.081 |
| 1568.7 | 0.081 |
| 1568.8 | 0.081 |
| 1568.9 | 0.082 |
| 1569.0 | 0.082 |
| 1569.1 | 0.082 |
| 1569.2 | 0.082 |
| 1569.3 | 0.082 |
| 1569.4 | 0.082 |
| 1569.5 | 0.082 |
| 1569.6 | 0.088 |
| 1569.7 | 0.089 |
| 1569.8 | 0.09 |
| 1569.9 | 0.091 |
| 1570.0 | 0.092 |
| 1570.1 | 0.093 |
| 1570.2 | 0.095 |
| 1570.3 | 0.096 |
| 1570.4 | 0.097 |
| 1570.5 | 0.098 |
| 1570.6 | 0.095 |
| 1570.7 | 0.095 |
| 1570.8 | 0.095 |
| 1570.9 | 0.096 |
| 1571.0 | 0.096 |
| 1571.1 | 0.096 |
| 1571.2 | 0.097 |
| 1571.3 | 0.097 |
| 1571.4 | 0.098 |
| 1571.5 | 0.098 |
| 1571.6 | 0.103 |
| 1571.7 | 0.104 |
| 1571.8 | 0.105 |
| 1571.9 | 0.106 |
| 1572.0 | 0.107 |
| 1572.1 | 0.108 |
| 1572.2 | 0.109 |
| 1572.3 | 0.11 |
| 1572.4 | 0.111 |
| 1572.5 | 0.112 |
| 1572.6 | 0.112 |
| 1572.7 | 0.113 |
| 1572.8 | 0.114 |
| 1572.9 | 0.115 |
| 1573.0 | 0.116 |
| 1573.1 | 0.117 |
| 1573.2 | 0.118 |
| 1573.3 | 0.119 |
| 1573.4 | 0.119 |
| 1573.5 | 0.12 |
| 1573.6 | 0.115 |
| 1573.7 | 0.115 |
| 1573.8 | 0.115 |
| 1573.9 | 0.115 |
| 1574.0 | 0.115 |
| 1574.1 | 0.115 |
| 1574.2 | 0.114 |
| 1574.3 | 0.114 |
| 1574.4 | 0.114 |
| 1574.5 | 0.114 |
| 1574.6 | 0.111 |
| 1574.7 | 0.111 |
| 1574.8 | 0.11 |
| 1574.9 | 0.109 |
| 1575.0 | 0.109 |
| 1575.1 | 0.108 |
| 1575.2 | 0.108 |
| 1575.3 | 0.107 |
| 1575.4 | 0.107 |
| 1575.5 | 0.106 |
| 1575.6 | 0.113 |
| 1575.7 | 0.114 |
| 1575.8 | 0.114 |
| 1575.9 | 0.115 |
| 1576.0 | 0.116 |
| 1576.1 | 0.116 |
| 1576.2 | 0.117 |
| 1576.3 | 0.118 |
| 1576.4 | 0.118 |
| 1576.5 | 0.119 |
| 1576.6 | 0.122 |
| 1576.7 | 0.123 |
| 1576.8 | 0.124 |
| 1576.9 | 0.125 |
| 1577.0 | 0.127 |
| 1577.1 | 0.128 |
| 1577.2 | 0.129 |
| 1577.3 | 0.13 |
| 1577.4 | 0.131 |
| 1577.5 | 0.132 |
| 1577.6 | 0.136 |
| 1577.7 | 0.137 |
| 1577.8 | 0.139 |
| 1577.9 | 0.14 |
| 1578.0 | 0.142 |
| 1578.1 | 0.143 |
| 1578.2 | 0.145 |
| 1578.3 | 0.146 |
| 1578.4 | 0.148 |
| 1578.5 | 0.149 |
| 1578.6 | 0.158 |
| 1578.7 | 0.161 |
| 1578.8 | 0.164 |
| 1578.9 | 0.167 |
| 1579.0 | 0.17 |
| 1579.1 | 0.172 |
| 1579.2 | 0.175 |
| 1579.3 | 0.178 |
| 1579.4 | 0.181 |
| 1579.5 | 0.184 |
| 1579.6 | 0.185 |
| 1579.7 | 0.188 |
| 1579.8 | 0.19 |
| 1579.9 | 0.193 |
| 1580.0 | 0.195 |
| 1580.1 | 0.198 |
| 1580.2 | 0.2 |
| 1580.3 | 0.203 |
| 1580.4 | 0.206 |
| 1580.5 | 0.208 |
| 1580.6 | 0.211 |
| 1580.7 | 0.214 |
| 1580.8 | 0.216 |
| 1580.9 | 0.219 |
| 1581.0 | 0.222 |
| 1581.1 | 0.224 |
| 1581.2 | 0.227 |
| 1581.3 | 0.23 |
| 1581.4 | 0.232 |
| 1581.5 | 0.235 |
| 1581.6 | 0.22 |
| 1581.7 | 0.22 |
| 1581.8 | 0.219 |
| 1581.9 | 0.219 |
| 1582.0 | 0.219 |
| 1582.1 | 0.218 |
| 1582.2 | 0.218 |
| 1582.3 | 0.218 |
| 1582.4 | 0.217 |
| 1582.5 | 0.217 |
| 1582.6 | 0.215 |
| 1582.7 | 0.214 |
| 1582.8 | 0.213 |
| 1582.9 | 0.212 |
| 1583.0 | 0.212 |
| 1583.1 | 0.211 |
| 1583.2 | 0.21 |
| 1583.3 | 0.21 |
| 1583.4 | 0.209 |
| 1583.5 | 0.208 |
| 1583.6 | 0.196 |
| 1583.7 | 0.194 |
| 1583.8 | 0.191 |
| 1583.9 | 0.188 |
| 1584.0 | 0.186 |
| 1584.1 | 0.183 |
| 1584.2 | 0.181 |
| 1584.3 | 0.178 |
| 1584.4 | 0.176 |
| 1584.5 | 0.173 |
| 1584.6 | 0.17 |
| 1584.7 | 0.167 |
| 1584.8 | 0.164 |
| 1584.9 | 0.162 |
| 1585.0 | 0.159 |
| 1585.1 | 0.156 |
| 1585.2 | 0.153 |
| 1585.3 | 0.151 |
| 1585.4 | 0.148 |
| 1585.5 | 0.145 |
| 1585.6 | 0.134 |
| 1585.7 | 0.13 |
| 1585.8 | 0.126 |
| 1585.9 | 0.122 |
| 1586.0 | 0.118 |
| 1586.1 | 0.114 |
| 1586.2 | 0.11 |
| 1586.3 | 0.106 |
| 1586.4 | 0.102 |
| 1586.5 | 0.098 |
| 1586.6 | 0.104 |
| 1586.7 | 0.101 |
| 1586.8 | 0.099 |
| 1586.9 | 0.096 |
| 1587.0 | 0.094 |
| 1587.1 | 0.092 |
| 1587.2 | 0.089 |
| 1587.3 | 0.087 |
| 1587.4 | 0.085 |
| 1587.5 | 0.082 |
| 1587.6 | 0.084 |
| 1587.7 | 0.082 |
| 1587.8 | 0.081 |
| 1587.9 | 0.079 |
| 1588.0 | 0.078 |
| 1588.1 | 0.076 |
| 1588.2 | 0.074 |
| 1588.3 | 0.073 |
| 1588.4 | 0.071 |
| 1588.5 | 0.069 |
| 1588.6 | 0.074 |
| 1588.7 | 0.073 |
| 1588.8 | 0.073 |
| 1588.9 | 0.072 |
| 1589.0 | 0.072 |
| 1589.1 | 0.071 |
| 1589.2 | 0.07 |
| 1589.3 | 0.07 |
| 1589.4 | 0.069 |
| 1589.5 | 0.068 |
| 1589.6 | 0.065 |
| 1589.7 | 0.064 |
| 1589.8 | 0.063 |
| 1589.9 | 0.062 |
| 1590.0 | 0.061 |
| 1590.1 | 0.06 |
| 1590.2 | 0.059 |
| 1590.3 | 0.058 |
| 1590.4 | 0.057 |
| 1590.5 | 0.056 |
| 1590.6 | 0.058 |
| 1590.7 | 0.057 |
| 1590.8 | 0.057 |
| 1590.9 | 0.056 |
| 1591.0 | 0.056 |
| 1591.1 | 0.055 |
| 1591.2 | 0.055 |
| 1591.3 | 0.054 |
| 1591.4 | 0.054 |
| 1591.5 | 0.053 |
| 1591.6 | 0.053 |
| 1591.7 | 0.052 |
| 1591.8 | 0.051 |
| 1591.9 | 0.051 |
| 1592.0 | 0.05 |
| 1592.1 | 0.05 |
| 1592.2 | 0.049 |
| 1592.3 | 0.049 |
| 1592.4 | 0.048 |
| 1592.5 | 0.048 |
| 1592.6 | 0.048 |
| 1592.7 | 0.048 |
| 1592.8 | 0.048 |
| 1592.9 | 0.048 |
| 1593.0 | 0.047 |
| 1593.1 | 0.047 |
| 1593.2 | 0.047 |
| 1593.3 | 0.046 |
| 1593.4 | 0.046 |
| 1593.5 | 0.046 |
| 1593.6 | 0.05 |
| 1593.7 | 0.05 |
| 1593.8 | 0.051 |
| 1593.9 | 0.051 |
| 1594.0 | 0.052 |
| 1594.1 | 0.052 |
| 1594.2 | 0.053 |
| 1594.3 | 0.053 |
| 1594.4 | 0.054 |
| 1594.5 | 0.054 |
| 1594.6 | 0.056 |
| 1594.7 | 0.057 |
| 1594.8 | 0.057 |
| 1594.9 | 0.058 |
| 1595.0 | 0.059 |
| 1595.1 | 0.06 |
| 1595.2 | 0.06 |
| 1595.3 | 0.061 |
| 1595.4 | 0.062 |
| 1595.5 | 0.062 |
| 1595.6 | 0.063 |
| 1595.7 | 0.064 |
| 1595.8 | 0.065 |
| 1595.9 | 0.066 |
| 1596.0 | 0.067 |
| 1596.1 | 0.067 |
| 1596.2 | 0.068 |
| 1596.3 | 0.069 |
| 1596.4 | 0.07 |
| 1596.5 | 0.07 |
| 1596.6 | 0.064 |
| 1596.7 | 0.063 |
| 1596.8 | 0.062 |
| 1596.9 | 0.062 |
| 1597.0 | 0.061 |
| 1597.1 | 0.061 |
| 1597.2 | 0.06 |
| 1597.3 | 0.06 |
| 1597.4 | 0.059 |
| 1597.5 | 0.059 |
| 1597.6 | 0.056 |
| 1597.7 | 0.055 |
| 1597.8 | 0.054 |
| 1597.9 | 0.053 |
| 1598.0 | 0.052 |
| 1598.1 | 0.051 |
| 1598.2 | 0.05 |
| 1598.3 | 0.049 |
| 1598.4 | 0.048 |
| 1598.5 | 0.047 |
| 1598.6 | 0.045 |
| 1598.7 | 0.044 |
| 1598.8 | 0.043 |
| 1598.9 | 0.042 |
| 1599.0 | 0.041 |
| 1599.1 | 0.04 |
| 1599.2 | 0.039 |
| 1599.3 | 0.038 |
| 1599.4 | 0.036 |
| 1599.5 | 0.035 |
| 1599.6 | 0.04 |
| 1599.7 | 0.04 |
| 1599.8 | 0.039 |
| 1599.9 | 0.039 |
| 1600.0 | 0.039 |
| 1600.1 | 0.039 |
| 1600.2 | 0.039 |
| 1600.3 | 0.038 |
| 1600.4 | 0.038 |
| 1600.5 | 0.038 |
| 1600.6 | 0.04 |
| 1600.7 | 0.04 |
| 1600.8 | 0.04 |
| 1600.9 | 0.04 |
| 1601.0 | 0.04 |
| 1601.1 | 0.04 |
| 1601.2 | 0.04 |
| 1601.3 | 0.04 |
| 1601.4 | 0.041 |
| 1601.5 | 0.041 |
| 1601.6 | 0.041 |
| 1601.7 | 0.041 |
| 1601.8 | 0.041 |
| 1601.9 | 0.042 |
| 1602.0 | 0.042 |
| 1602.1 | 0.042 |
| 1602.2 | 0.042 |
| 1602.3 | 0.042 |
| 1602.4 | 0.042 |
| 1602.5 | 0.042 |
| 1602.6 | 0.043 |
| 1602.7 | 0.043 |
| 1602.8 | 0.043 |
| 1602.9 | 0.043 |
| 1603.0 | 0.043 |
| 1603.1 | 0.044 |
| 1603.2 | 0.044 |
| 1603.3 | 0.044 |
| 1603.4 | 0.044 |
| 1603.5 | 0.044 |
| 1603.6 | 0.046 |
| 1603.7 | 0.046 |
| 1603.8 | 0.047 |
| 1603.9 | 0.047 |
| 1604.0 | 0.047 |
| 1604.1 | 0.048 |
| 1604.2 | 0.048 |
| 1604.3 | 0.049 |
| 1604.4 | 0.049 |
| 1604.5 | 0.049 |
| 1604.6 | 0.048 |
| 1604.7 | 0.049 |
| 1604.8 | 0.049 |
| 1604.9 | 0.049 |
| 1605.0 | 0.049 |
| 1605.1 | 0.049 |
| 1605.2 | 0.049 |
| 1605.3 | 0.049 |
| 1605.4 | 0.05 |
| 1605.5 | 0.05 |
| 1605.6 | 0.043 |
| 1605.7 | 0.042 |
| 1605.8 | 0.041 |
| 1605.9 | 0.04 |
| 1606.0 | 0.039 |
| 1606.1 | 0.038 |
| 1606.2 | 0.037 |
| 1606.3 | 0.036 |
| 1606.4 | 0.035 |
| 1606.5 | 0.034 |
| 1606.6 | 0.036 |
| 1606.7 | 0.035 |
| 1606.8 | 0.035 |
| 1606.9 | 0.034 |
| 1607.0 | 0.034 |
| 1607.1 | 0.033 |
| 1607.2 | 0.032 |
| 1607.3 | 0.032 |
| 1607.4 | 0.031 |
| 1607.5 | 0.031 |
| 1607.6 | 0.029 |
| 1607.7 | 0.029 |
| 1607.8 | 0.028 |
| 1607.9 | 0.027 |
| 1608.0 | 0.026 |
| 1608.1 | 0.026 |
| 1608.2 | 0.025 |
| 1608.3 | 0.024 |
| 1608.4 | 0.024 |
| 1608.5 | 0.023 |
| 1608.6 | 0.025 |
| 1608.7 | 0.025 |
| 1608.8 | 0.025 |
| 1608.9 | 0.025 |
| 1609.0 | 0.024 |
| 1609.1 | 0.024 |
| 1609.2 | 0.024 |
| 1609.3 | 0.024 |
| 1609.4 | 0.024 |
| 1609.5 | 0.024 |
| 1609.6 | 0.023 |
| 1609.7 | 0.023 |
| 1609.8 | 0.023 |
| 1609.9 | 0.023 |
| 1610.0 | 0.023 |
| 1610.1 | 0.022 |
| 1610.2 | 0.022 |
| 1610.3 | 0.022 |
| 1610.4 | 0.022 |
| 1610.5 | 0.022 |
| 1610.6 | 0.025 |
| 1610.7 | 0.025 |
| 1610.8 | 0.026 |
| 1610.9 | 0.026 |
| 1611.0 | 0.027 |
| 1611.1 | 0.027 |
| 1611.2 | 0.027 |
| 1611.3 | 0.028 |
| 1611.4 | 0.028 |
| 1611.5 | 0.029 |
| 1611.6 | 0.025 |
| 1611.7 | 0.025 |
| 1611.8 | 0.025 |
| 1611.9 | 0.024 |
| 1612.0 | 0.024 |
| 1612.1 | 0.024 |
| 1612.2 | 0.024 |
| 1612.3 | 0.023 |
| 1612.4 | 0.023 |
| 1612.5 | 0.023 |
| 1612.6 | 0.023 |
| 1612.7 | 0.023 |
| 1612.8 | 0.023 |
| 1612.9 | 0.023 |
| 1613.0 | 0.023 |
| 1613.1 | 0.023 |
| 1613.2 | 0.023 |
| 1613.3 | 0.022 |
| 1613.4 | 0.022 |
| 1613.5 | 0.022 |
| 1613.6 | 0.026 |
| 1613.7 | 0.026 |
| 1613.8 | 0.027 |
| 1613.9 | 0.027 |
| 1614.0 | 0.028 |
| 1614.1 | 0.028 |
| 1614.2 | 0.029 |
| 1614.3 | 0.029 |
| 1614.4 | 0.03 |
| 1614.5 | 0.03 |
| 1614.6 | 0.025 |
| 1614.7 | 0.024 |
| 1614.8 | 0.024 |
| 1614.9 | 0.023 |
| 1615.0 | 0.023 |
| 1615.1 | 0.022 |
| 1615.2 | 0.022 |
| 1615.3 | 0.021 |
| 1615.4 | 0.021 |
| 1615.5 | 0.02 |
| 1615.6 | 0.018 |
| 1615.7 | 0.017 |
| 1615.8 | 0.017 |
| 1615.9 | 0.016 |
| 1616.0 | 0.015 |
| 1616.1 | 0.014 |
| 1616.2 | 0.013 |
| 1616.3 | 0.013 |
| 1616.4 | 0.012 |
| 1616.5 | 0.011 |
| 1616.6 | 0.019 |
| 1616.7 | 0.019 |
| 1616.8 | 0.02 |
| 1616.9 | 0.02 |
| 1617.0 | 0.021 |
| 1617.1 | 0.022 |
| 1617.2 | 0.022 |
| 1617.3 | 0.023 |
| 1617.4 | 0.024 |
| 1617.5 | 0.024 |
| 1617.6 | 0.018 |
| 1617.7 | 0.017 |
| 1617.8 | 0.016 |
| 1617.9 | 0.016 |
| 1618.0 | 0.015 |
| 1618.1 | 0.015 |
| 1618.2 | 0.014 |
| 1618.3 | 0.014 |
| 1618.4 | 0.013 |
| 1618.5 | 0.012 |
| 1618.6 | 0.015 |
| 1618.7 | 0.015 |
| 1618.8 | 0.015 |
| 1618.9 | 0.015 |
| 1619.0 | 0.014 |
| 1619.1 | 0.014 |
| 1619.2 | 0.014 |
| 1619.3 | 0.014 |
| 1619.4 | 0.014 |
| 1619.5 | 0.014 |
| 1619.6 | 0.018 |
| 1619.7 | 0.018 |
| 1619.8 | 0.019 |
| 1619.9 | 0.02 |
| 1620.0 | 0.02 |
| 1620.1 | 0.021 |
| 1620.2 | 0.021 |
| 1620.3 | 0.022 |
| 1620.4 | 0.022 |
| 1620.5 | 0.023 |
| 1620.6 | 0.02 |
| 1620.7 | 0.02 |
| 1620.8 | 0.02 |
| 1620.9 | 0.02 |
| 1621.0 | 0.02 |
| 1621.1 | 0.02 |
| 1621.2 | 0.02 |
| 1621.3 | 0.02 |
| 1621.4 | 0.02 |
| 1621.5 | 0.02 |
| 1621.6 | 0.017 |
| 1621.7 | 0.016 |
| 1621.8 | 0.015 |
| 1621.9 | 0.015 |
| 1622.0 | 0.014 |
| 1622.1 | 0.014 |
| 1622.2 | 0.013 |
| 1622.3 | 0.013 |
| 1622.4 | 0.012 |
| 1622.5 | 0.012 |
| 1622.6 | 0.016 |
| 1622.7 | 0.016 |
| 1622.8 | 0.016 |
| 1622.9 | 0.016 |
| 1623.0 | 0.017 |
| 1623.1 | 0.017 |
| 1623.2 | 0.017 |
| 1623.3 | 0.017 |
| 1623.4 | 0.018 |
| 1623.5 | 0.018 |
| 1623.6 | 0.016 |
| 1623.7 | 0.016 |
| 1623.8 | 0.015 |
| 1623.9 | 0.015 |
| 1624.0 | 0.015 |
| 1624.1 | 0.015 |
| 1624.2 | 0.015 |
| 1624.3 | 0.014 |
| 1624.4 | 0.014 |
| 1624.5 | 0.014 |
| 1624.6 | 0.015 |
| 1624.7 | 0.015 |
| 1624.8 | 0.014 |
| 1624.9 | 0.014 |
| 1625.0 | 0.014 |
| 1625.1 | 0.014 |
| 1625.2 | 0.014 |
| 1625.3 | 0.014 |
| 1625.4 | 0.014 |
| 1625.5 | 0.014 |
| 1625.6 | 0.014 |
| 1625.7 | 0.014 |
| 1625.8 | 0.014 |
| 1625.9 | 0.014 |
| 1626.0 | 0.014 |
| 1626.1 | 0.014 |
| 1626.2 | 0.014 |
| 1626.3 | 0.013 |
| 1626.4 | 0.013 |
| 1626.5 | 0.013 |
| 1626.6 | 0.013 |
| 1626.7 | 0.012 |
| 1626.8 | 0.012 |
| 1626.9 | 0.012 |
| 1627.0 | 0.012 |
| 1627.1 | 0.012 |
| 1627.2 | 0.011 |
| 1627.3 | 0.011 |
| 1627.4 | 0.011 |
| 1627.5 | 0.011 |
| 1627.6 | 0.014 |
| 1627.7 | 0.015 |
| 1627.8 | 0.015 |
| 1627.9 | 0.015 |
| 1628.0 | 0.016 |
| 1628.1 | 0.016 |
| 1628.2 | 0.017 |
| 1628.3 | 0.017 |
| 1628.4 | 0.018 |
| 1628.5 | 0.018 |
| 1628.6 | 0.016 |
| 1628.7 | 0.016 |
| 1628.8 | 0.016 |
| 1628.9 | 0.016 |
| 1629.0 | 0.017 |
| 1629.1 | 0.017 |
| 1629.2 | 0.017 |
| 1629.3 | 0.017 |
| 1629.4 | 0.017 |
| 1629.5 | 0.017 |
| 1629.6 | 0.017 |
| 1629.7 | 0.017 |
| 1629.8 | 0.017 |
| 1629.9 | 0.017 |
| 1630.0 | 0.017 |
| 1630.1 | 0.017 |
| 1630.2 | 0.017 |
| 1630.3 | 0.017 |
| 1630.4 | 0.017 |
| 1630.5 | 0.017 |
| 1630.6 | 0.017 |
| 1630.7 | 0.017 |
| 1630.8 | 0.017 |
| 1630.9 | 0.017 |
| 1631.0 | 0.017 |
| 1631.1 | 0.017 |
| 1631.2 | 0.017 |
| 1631.3 | 0.017 |
| 1631.4 | 0.017 |
| 1631.5 | 0.017 |
| 1631.6 | 0.016 |
| 1631.7 | 0.016 |
| 1631.8 | 0.015 |
| 1631.9 | 0.015 |
| 1632.0 | 0.015 |
| 1632.1 | 0.015 |
| 1632.2 | 0.015 |
| 1632.3 | 0.014 |
| 1632.4 | 0.014 |
| 1632.5 | 0.014 |
| 1632.6 | 0.015 |
| 1632.7 | 0.015 |
| 1632.8 | 0.015 |
| 1632.9 | 0.015 |
| 1633.0 | 0.015 |
| 1633.1 | 0.015 |
| 1633.2 | 0.015 |
| 1633.3 | 0.015 |
| 1633.4 | 0.015 |
| 1633.5 | 0.015 |
| 1633.6 | 0.017 |
| 1633.7 | 0.018 |
| 1633.8 | 0.018 |
| 1633.9 | 0.018 |
| 1634.0 | 0.019 |
| 1634.1 | 0.019 |
| 1634.2 | 0.02 |
| 1634.3 | 0.02 |
| 1634.4 | 0.02 |
| 1634.5 | 0.021 |
| 1634.6 | 0.018 |
| 1634.7 | 0.018 |
| 1634.8 | 0.018 |
| 1634.9 | 0.018 |
| 1635.0 | 0.018 |
| 1635.1 | 0.018 |
| 1635.2 | 0.018 |
| 1635.3 | 0.018 |
| 1635.4 | 0.018 |
| 1635.5 | 0.018 |
| 1635.6 | 0.018 |
| 1635.7 | 0.018 |
| 1635.8 | 0.018 |
| 1635.9 | 0.018 |
| 1636.0 | 0.017 |
| 1636.1 | 0.017 |
| 1636.2 | 0.017 |
| 1636.3 | 0.017 |
| 1636.4 | 0.017 |
| 1636.5 | 0.017 |
| 1636.6 | 0.016 |
| 1636.7 | 0.016 |
| 1636.8 | 0.016 |
| 1636.9 | 0.016 |
| 1637.0 | 0.015 |
| 1637.1 | 0.015 |
| 1637.2 | 0.015 |
| 1637.3 | 0.015 |
| 1637.4 | 0.014 |
| 1637.5 | 0.014 |
| 1637.6 | 0.016 |
| 1637.7 | 0.016 |
| 1637.8 | 0.016 |
| 1637.9 | 0.016 |
| 1638.0 | 0.016 |
| 1638.1 | 0.016 |
| 1638.2 | 0.016 |
| 1638.3 | 0.017 |
| 1638.4 | 0.017 |
| 1638.5 | 0.017 |
| 1638.6 | 0.015 |
| 1638.7 | 0.015 |
| 1638.8 | 0.015 |
| 1638.9 | 0.015 |
| 1639.0 | 0.014 |
| 1639.1 | 0.014 |
| 1639.2 | 0.014 |
| 1639.3 | 0.014 |
| 1639.4 | 0.014 |
| 1639.5 | 0.013 |
| 1639.6 | 0.016 |
| 1639.7 | 0.017 |
| 1639.8 | 0.017 |
| 1639.9 | 0.017 |
| 1640.0 | 0.017 |
| 1640.1 | 0.018 |
| 1640.2 | 0.018 |
| 1640.3 | 0.018 |
| 1640.4 | 0.019 |
| 1640.5 | 0.019 |
| 1640.6 | 0.018 |
| 1640.7 | 0.018 |
| 1640.8 | 0.018 |
| 1640.9 | 0.018 |
| 1641.0 | 0.018 |
| 1641.1 | 0.018 |
| 1641.2 | 0.018 |
| 1641.3 | 0.018 |
| 1641.4 | 0.018 |
| 1641.5 | 0.018 |
| 1641.6 | 0.017 |
| 1641.7 | 0.017 |
| 1641.8 | 0.017 |
| 1641.9 | 0.017 |
| 1642.0 | 0.016 |
| 1642.1 | 0.016 |
| 1642.2 | 0.016 |
| 1642.3 | 0.016 |
| 1642.4 | 0.016 |
| 1642.5 | 0.016 |
| 1642.6 | 0.017 |
| 1642.7 | 0.017 |
| 1642.8 | 0.017 |
| 1642.9 | 0.017 |
| 1643.0 | 0.017 |
| 1643.1 | 0.017 |
| 1643.2 | 0.018 |
| 1643.3 | 0.018 |
| 1643.4 | 0.018 |
| 1643.5 | 0.018 |
| 1643.6 | 0.019 |
| 1643.7 | 0.019 |
| 1643.8 | 0.02 |
| 1643.9 | 0.02 |
| 1644.0 | 0.02 |
| 1644.1 | 0.02 |
| 1644.2 | 0.021 |
| 1644.3 | 0.021 |
| 1644.4 | 0.021 |
| 1644.5 | 0.021 |
| 1644.6 | 0.017 |
| 1644.7 | 0.016 |
| 1644.8 | 0.016 |
| 1644.9 | 0.015 |
| 1645.0 | 0.015 |
| 1645.1 | 0.014 |
| 1645.2 | 0.013 |
| 1645.3 | 0.013 |
| 1645.4 | 0.012 |
| 1645.5 | 0.012 |
| 1645.6 | 0.015 |
| 1645.7 | 0.015 |
| 1645.8 | 0.015 |
| 1645.9 | 0.015 |
| 1646.0 | 0.015 |
| 1646.1 | 0.015 |
| 1646.2 | 0.015 |
| 1646.3 | 0.015 |
| 1646.4 | 0.015 |
| 1646.5 | 0.015 |
| 1646.6 | 0.017 |
| 1646.7 | 0.018 |
| 1646.8 | 0.018 |
| 1646.9 | 0.019 |
| 1647.0 | 0.019 |
| 1647.1 | 0.019 |
| 1647.2 | 0.02 |
| 1647.3 | 0.02 |
| 1647.4 | 0.021 |
| 1647.5 | 0.021 |
| 1647.6 | 0.018 |
| 1647.7 | 0.018 |
| 1647.8 | 0.018 |
| 1647.9 | 0.018 |
| 1648.0 | 0.017 |
| 1648.1 | 0.017 |
| 1648.2 | 0.017 |
| 1648.3 | 0.017 |
| 1648.4 | 0.017 |
| 1648.5 | 0.017 |
| 1648.6 | 0.02 |
| 1648.7 | 0.02 |
| 1648.8 | 0.021 |
| 1648.9 | 0.021 |
| 1649.0 | 0.021 |
| 1649.1 | 0.022 |
| 1649.2 | 0.022 |
| 1649.3 | 0.023 |
| 1649.4 | 0.023 |
| 1649.5 | 0.023 |
| 1649.6 | 0.018 |
| 1649.7 | 0.017 |
| 1649.8 | 0.017 |
| 1649.9 | 0.016 |
| 1650.0 | 0.016 |
| 1650.1 | 0.015 |
| 1650.2 | 0.015 |
| 1650.3 | 0.014 |
| 1650.4 | 0.014 |
| 1650.5 | 0.013 |
| 1650.6 | 0.014 |
| 1650.7 | 0.014 |
| 1650.8 | 0.014 |
| 1650.9 | 0.014 |
| 1651.0 | 0.013 |
| 1651.1 | 0.013 |
| 1651.2 | 0.013 |
| 1651.3 | 0.013 |
| 1651.4 | 0.012 |
| 1651.5 | 0.012 |
| 1651.6 | 0.015 |
| 1651.7 | 0.015 |
| 1651.8 | 0.016 |
| 1651.9 | 0.016 |
| 1652.0 | 0.016 |
| 1652.1 | 0.017 |
| 1652.2 | 0.017 |
| 1652.3 | 0.017 |
| 1652.4 | 0.017 |
| 1652.5 | 0.018 |
| 1652.6 | 0.015 |
| 1652.7 | 0.015 |
| 1652.8 | 0.015 |
| 1652.9 | 0.015 |
| 1653.0 | 0.015 |
| 1653.1 | 0.015 |
| 1653.2 | 0.015 |
| 1653.3 | 0.014 |
| 1653.4 | 0.014 |
| 1653.5 | 0.014 |
| 1653.6 | 0.016 |
| 1653.7 | 0.016 |
| 1653.8 | 0.016 |
| 1653.9 | 0.016 |
| 1654.0 | 0.017 |
| 1654.1 | 0.017 |
| 1654.2 | 0.017 |
| 1654.3 | 0.017 |
| 1654.4 | 0.017 |
| 1654.5 | 0.018 |
| 1654.6 | 0.016 |
| 1654.7 | 0.016 |
| 1654.8 | 0.016 |
| 1654.9 | 0.015 |
| 1655.0 | 0.015 |
| 1655.1 | 0.015 |
| 1655.2 | 0.015 |
| 1655.3 | 0.015 |
| 1655.4 | 0.015 |
| 1655.5 | 0.015 |
| 1655.6 | 0.018 |
| 1655.7 | 0.019 |
| 1655.8 | 0.019 |
| 1655.9 | 0.02 |
| 1656.0 | 0.02 |
| 1656.1 | 0.021 |
| 1656.2 | 0.021 |
| 1656.3 | 0.022 |
| 1656.4 | 0.022 |
| 1656.5 | 0.023 |
| 1656.6 | 0.021 |
| 1656.7 | 0.021 |
| 1656.8 | 0.021 |
| 1656.9 | 0.021 |
| 1657.0 | 0.021 |
| 1657.1 | 0.022 |
| 1657.2 | 0.022 |
| 1657.3 | 0.022 |
| 1657.4 | 0.022 |
| 1657.5 | 0.022 |
| 1657.6 | 0.023 |
| 1657.7 | 0.024 |
| 1657.8 | 0.024 |
| 1657.9 | 0.024 |
| 1658.0 | 0.024 |
| 1658.1 | 0.025 |
| 1658.2 | 0.025 |
| 1658.3 | 0.025 |
| 1658.4 | 0.026 |
| 1658.5 | 0.026 |
| 1658.6 | 0.03 |
| 1658.7 | 0.031 |
| 1658.8 | 0.032 |
| 1658.9 | 0.033 |
| 1659.0 | 0.034 |
| 1659.1 | 0.035 |
| 1659.2 | 0.035 |
| 1659.3 | 0.036 |
| 1659.4 | 0.037 |
| 1659.5 | 0.038 |
| 1659.6 | 0.031 |
| 1659.7 | 0.031 |
| 1659.8 | 0.03 |
| 1659.9 | 0.03 |
| 1660.0 | 0.029 |
| 1660.1 | 0.029 |
| 1660.2 | 0.029 |
| 1660.3 | 0.028 |
| 1660.4 | 0.028 |
| 1660.5 | 0.027 |
| 1660.6 | 0.029 |
| 1660.7 | 0.029 |
| 1660.8 | 0.029 |
| 1660.9 | 0.028 |
| 1661.0 | 0.028 |
| 1661.1 | 0.028 |
| 1661.2 | 0.028 |
| 1661.3 | 0.028 |
| 1661.4 | 0.028 |
| 1661.5 | 0.028 |
| 1661.6 | 0.027 |
| 1661.7 | 0.026 |
| 1661.8 | 0.026 |
| 1661.9 | 0.026 |
| 1662.0 | 0.025 |
| 1662.1 | 0.025 |
| 1662.2 | 0.025 |
| 1662.3 | 0.024 |
| 1662.4 | 0.024 |
| 1662.5 | 0.024 |
| 1662.6 | 0.03 |
| 1662.7 | 0.031 |
| 1662.8 | 0.032 |
| 1662.9 | 0.033 |
| 1663.0 | 0.034 |
| 1663.1 | 0.035 |
| 1663.2 | 0.036 |
| 1663.3 | 0.036 |
| 1663.4 | 0.037 |
| 1663.5 | 0.038 |
| 1663.6 | 0.035 |
| 1663.7 | 0.035 |
| 1663.8 | 0.035 |
| 1663.9 | 0.035 |
| 1664.0 | 0.036 |
| 1664.1 | 0.036 |
| 1664.2 | 0.036 |
| 1664.3 | 0.036 |
| 1664.4 | 0.036 |
| 1664.5 | 0.036 |
| 1664.6 | 0.038 |
| 1664.7 | 0.038 |
| 1664.8 | 0.039 |
| 1664.9 | 0.039 |
| 1665.0 | 0.039 |
| 1665.1 | 0.04 |
| 1665.2 | 0.04 |
| 1665.3 | 0.041 |
| 1665.4 | 0.041 |
| 1665.5 | 0.041 |
| 1665.6 | 0.038 |
| 1665.7 | 0.037 |
| 1665.8 | 0.037 |
| 1665.9 | 0.037 |
| 1666.0 | 0.037 |
| 1666.1 | 0.036 |
| 1666.2 | 0.036 |
| 1666.3 | 0.036 |
| 1666.4 | 0.036 |
| 1666.5 | 0.035 |
| 1666.6 | 0.038 |
| 1666.7 | 0.038 |
| 1666.8 | 0.038 |
| 1666.9 | 0.038 |
| 1667.0 | 0.038 |
| 1667.1 | 0.038 |
| 1667.2 | 0.038 |
| 1667.3 | 0.039 |
| 1667.4 | 0.039 |
| 1667.5 | 0.039 |
| 1667.6 | 0.038 |
| 1667.7 | 0.037 |
| 1667.8 | 0.037 |
| 1667.9 | 0.037 |
| 1668.0 | 0.037 |
| 1668.1 | 0.037 |
| 1668.2 | 0.037 |
| 1668.3 | 0.037 |
| 1668.4 | 0.037 |
| 1668.5 | 0.037 |
| 1668.6 | 0.039 |
| 1668.7 | 0.039 |
| 1668.8 | 0.039 |
| 1668.9 | 0.039 |
| 1669.0 | 0.04 |
| 1669.1 | 0.04 |
| 1669.2 | 0.04 |
| 1669.3 | 0.04 |
| 1669.4 | 0.041 |
| 1669.5 | 0.041 |
| 1669.6 | 0.037 |
| 1669.7 | 0.037 |
| 1669.8 | 0.037 |
| 1669.9 | 0.036 |
| 1670.0 | 0.036 |
| 1670.1 | 0.035 |
| 1670.2 | 0.035 |
| 1670.3 | 0.035 |
| 1670.4 | 0.034 |
| 1670.5 | 0.034 |
| 1670.6 | 0.035 |
| 1670.7 | 0.035 |
| 1670.8 | 0.035 |
| 1670.9 | 0.035 |
| 1671.0 | 0.035 |
| 1671.1 | 0.035 |
| 1671.2 | 0.035 |
| 1671.3 | 0.035 |
| 1671.4 | 0.035 |
| 1671.5 | 0.035 |
| 1671.6 | 0.033 |
| 1671.7 | 0.033 |
| 1671.8 | 0.032 |
| 1671.9 | 0.032 |
| 1672.0 | 0.031 |
| 1672.1 | 0.031 |
| 1672.2 | 0.031 |
| 1672.3 | 0.03 |
| 1672.4 | 0.03 |
| 1672.5 | 0.03 |
| 1672.6 | 0.031 |
| 1672.7 | 0.031 |
| 1672.8 | 0.031 |
| 1672.9 | 0.031 |
| 1673.0 | 0.031 |
| 1673.1 | 0.031 |
| 1673.2 | 0.031 |
| 1673.3 | 0.03 |
| 1673.4 | 0.03 |
| 1673.5 | 0.03 |
| 1673.6 | 0.026 |
| 1673.7 | 0.025 |
| 1673.8 | 0.025 |
| 1673.9 | 0.024 |
| 1674.0 | 0.023 |
| 1674.1 | 0.022 |
| 1674.2 | 0.022 |
| 1674.3 | 0.021 |
| 1674.4 | 0.02 |
| 1674.5 | 0.019 |
| 1674.6 | 0.022 |
| 1674.7 | 0.021 |
| 1674.8 | 0.021 |
| 1674.9 | 0.021 |
| 1675.0 | 0.021 |
| 1675.1 | 0.021 |
| 1675.2 | 0.02 |
| 1675.3 | 0.02 |
| 1675.4 | 0.02 |
| 1675.5 | 0.02 |
| 1675.6 | 0.021 |
| 1675.7 | 0.022 |
| 1675.8 | 0.022 |
| 1675.9 | 0.022 |
| 1676.0 | 0.022 |
| 1676.1 | 0.022 |
| 1676.2 | 0.022 |
| 1676.3 | 0.022 |
| 1676.4 | 0.022 |
| 1676.5 | 0.023 |
| 1676.6 | 0.02 |
| 1676.7 | 0.02 |
| 1676.8 | 0.02 |
| 1676.9 | 0.02 |
| 1677.0 | 0.019 |
| 1677.1 | 0.019 |
| 1677.2 | 0.019 |
| 1677.3 | 0.018 |
| 1677.4 | 0.018 |
| 1677.5 | 0.018 |
| 1677.6 | 0.019 |
| 1677.7 | 0.018 |
| 1677.8 | 0.018 |
| 1677.9 | 0.018 |
| 1678.0 | 0.018 |
| 1678.1 | 0.018 |
| 1678.2 | 0.018 |
| 1678.3 | 0.018 |
| 1678.4 | 0.018 |
| 1678.5 | 0.017 |
| 1678.6 | 0.019 |
| 1678.7 | 0.019 |
| 1678.8 | 0.019 |
| 1678.9 | 0.019 |
| 1679.0 | 0.019 |
| 1679.1 | 0.019 |
| 1679.2 | 0.019 |
| 1679.3 | 0.019 |
| 1679.4 | 0.02 |
| 1679.5 | 0.02 |
| 1679.6 | 0.019 |
| 1679.7 | 0.019 |
| 1679.8 | 0.019 |
| 1679.9 | 0.019 |
| 1680.0 | 0.019 |
| 1680.1 | 0.019 |
| 1680.2 | 0.019 |
| 1680.3 | 0.019 |
| 1680.4 | 0.019 |
| 1680.5 | 0.019 |
| 1680.6 | 0.019 |
| 1680.7 | 0.018 |
| 1680.8 | 0.018 |
| 1680.9 | 0.018 |
| 1681.0 | 0.018 |
| 1681.1 | 0.018 |
| 1681.2 | 0.018 |
| 1681.3 | 0.018 |
| 1681.4 | 0.018 |
| 1681.5 | 0.018 |
| 1681.6 | 0.019 |
| 1681.7 | 0.019 |
| 1681.8 | 0.019 |
| 1681.9 | 0.019 |
| 1682.0 | 0.019 |
| 1682.1 | 0.019 |
| 1682.2 | 0.019 |
| 1682.3 | 0.019 |
| 1682.4 | 0.019 |
| 1682.5 | 0.019 |
| 1682.6 | 0.016 |
| 1682.7 | 0.016 |
| 1682.8 | 0.016 |
| 1682.9 | 0.015 |
| 1683.0 | 0.015 |
| 1683.1 | 0.014 |
| 1683.2 | 0.014 |
| 1683.3 | 0.013 |
| 1683.4 | 0.013 |
| 1683.5 | 0.012 |
| 1683.6 | 0.014 |
| 1683.7 | 0.014 |
| 1683.8 | 0.013 |
| 1683.9 | 0.013 |
| 1684.0 | 0.013 |
| 1684.1 | 0.013 |
| 1684.2 | 0.013 |
| 1684.3 | 0.013 |
| 1684.4 | 0.012 |
| 1684.5 | 0.012 |
| 1684.6 | 0.016 |
| 1684.7 | 0.016 |
| 1684.8 | 0.017 |
| 1684.9 | 0.017 |
| 1685.0 | 0.018 |
| 1685.1 | 0.018 |
| 1685.2 | 0.019 |
| 1685.3 | 0.019 |
| 1685.4 | 0.02 |
| 1685.5 | 0.02 |
| 1685.6 | 0.016 |
| 1685.7 | 0.016 |
| 1685.8 | 0.015 |
| 1685.9 | 0.015 |
| 1686.0 | 0.015 |
| 1686.1 | 0.014 |
| 1686.2 | 0.014 |
| 1686.3 | 0.014 |
| 1686.4 | 0.014 |
| 1686.5 | 0.013 |
| 1686.6 | 0.018 |
| 1686.7 | 0.019 |
| 1686.8 | 0.019 |
| 1686.9 | 0.02 |
| 1687.0 | 0.02 |
| 1687.1 | 0.021 |
| 1687.2 | 0.022 |
| 1687.3 | 0.022 |
| 1687.4 | 0.023 |
| 1687.5 | 0.023 |
| 1687.6 | 0.022 |
| 1687.7 | 0.022 |
| 1687.8 | 0.022 |
| 1687.9 | 0.023 |
| 1688.0 | 0.023 |
| 1688.1 | 0.023 |
| 1688.2 | 0.023 |
| 1688.3 | 0.023 |
| 1688.4 | 0.024 |
| 1688.5 | 0.024 |
| 1688.6 | 0.021 |
| 1688.7 | 0.02 |
| 1688.8 | 0.02 |
| 1688.9 | 0.019 |
| 1689.0 | 0.019 |
| 1689.1 | 0.019 |
| 1689.2 | 0.018 |
| 1689.3 | 0.018 |
| 1689.4 | 0.018 |
| 1689.5 | 0.017 |
| 1689.6 | 0.019 |
| 1689.7 | 0.019 |
| 1689.8 | 0.019 |
| 1689.9 | 0.019 |
| 1690.0 | 0.019 |
| 1690.1 | 0.019 |
| 1690.2 | 0.019 |
| 1690.3 | 0.019 |
| 1690.4 | 0.019 |
| 1690.5 | 0.019 |
| 1690.6 | 0.019 |
| 1690.7 | 0.019 |
| 1690.8 | 0.019 |
| 1690.9 | 0.019 |
| 1691.0 | 0.019 |
| 1691.1 | 0.019 |
| 1691.2 | 0.018 |
| 1691.3 | 0.018 |
| 1691.4 | 0.018 |
| 1691.5 | 0.018 |
| 1691.6 | 0.02 |
| 1691.7 | 0.02 |
| 1691.8 | 0.021 |
| 1691.9 | 0.021 |
| 1692.0 | 0.021 |
| 1692.1 | 0.021 |
| 1692.2 | 0.022 |
| 1692.3 | 0.022 |
| 1692.4 | 0.022 |
| 1692.5 | 0.022 |
| 1692.6 | 0.019 |
| 1692.7 | 0.019 |
| 1692.8 | 0.019 |
| 1692.9 | 0.018 |
| 1693.0 | 0.018 |
| 1693.1 | 0.018 |
| 1693.2 | 0.018 |
| 1693.3 | 0.017 |
| 1693.4 | 0.017 |
| 1693.5 | 0.017 |
| 1693.6 | 0.021 |
| 1693.7 | 0.022 |
| 1693.8 | 0.023 |
| 1693.9 | 0.023 |
| 1694.0 | 0.024 |
| 1694.1 | 0.024 |
| 1694.2 | 0.025 |
| 1694.3 | 0.025 |
| 1694.4 | 0.026 |
| 1694.5 | 0.026 |
| 1694.6 | 0.02 |
| 1694.7 | 0.019 |
| 1694.8 | 0.018 |
| 1694.9 | 0.017 |
| 1695.0 | 0.017 |
| 1695.1 | 0.016 |
| 1695.2 | 0.015 |
| 1695.3 | 0.015 |
| 1695.4 | 0.014 |
| 1695.5 | 0.013 |
| 1695.6 | 0.018 |
| 1695.7 | 0.018 |
| 1695.8 | 0.018 |
| 1695.9 | 0.019 |
| 1696.0 | 0.019 |
| 1696.1 | 0.019 |
| 1696.2 | 0.019 |
| 1696.3 | 0.019 |
| 1696.4 | 0.02 |
| 1696.5 | 0.02 |
| 1696.6 | 0.018 |
| 1696.7 | 0.018 |
| 1696.8 | 0.017 |
| 1696.9 | 0.017 |
| 1697.0 | 0.017 |
| 1697.1 | 0.017 |
| 1697.2 | 0.017 |
| 1697.3 | 0.017 |
| 1697.4 | 0.016 |
| 1697.5 | 0.016 |
| 1697.6 | 0.018 |
| 1697.7 | 0.019 |
| 1697.8 | 0.019 |
| 1697.9 | 0.019 |
| 1698.0 | 0.019 |
| 1698.1 | 0.02 |
| 1698.2 | 0.02 |
| 1698.3 | 0.02 |
| 1698.4 | 0.02 |
| 1698.5 | 0.02 |
| 1698.6 | 0.02 |
| 1698.7 | 0.02 |
| 1698.8 | 0.02 |
| 1698.9 | 0.02 |
| 1699.0 | 0.02 |
| 1699.1 | 0.02 |
| 1699.2 | 0.02 |
| 1699.3 | 0.02 |
| 1699.4 | 0.02 |
| 1699.5 | 0.02 |
| 1699.6 | 0.019 |
| 1699.7 | 0.019 |
| 1699.8 | 0.019 |
| 1699.9 | 0.019 |
| 1700.0 | 0.019 |